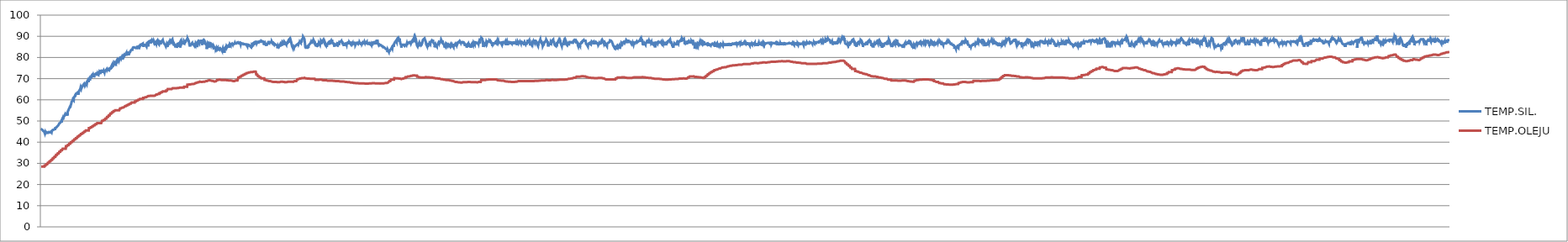
| Category | TEMP.SIL. | TEMP.OLEJU |
|---|---|---|
| 2015-01-01_00:00:09 | 45.5 | 28.5 |
| 2015-01-01_00:00:10 | 45.5 | 28.5 |
| 2015-01-01_00:00:11 | 46 | 28.5 |
| 2015-01-01_00:00:12 | 46 | 28.5 |
| 2015-01-01_00:00:13 | 46.2 | 28.5 |
| 2015-01-01_00:00:14 | 45.7 | 28.5 |
| 2015-01-01_00:00:15 | 45.9 | 28.5 |
| 2015-01-01_00:00:16 | 45.7 | 28.5 |
| 2015-01-01_00:00:17 | 45.6 | 28.5 |
| 2015-01-01_00:00:18 | 45.3 | 28.5 |
| 2015-01-01_00:00:19 | 45.3 | 28.5 |
| 2015-01-01_00:00:20 | 45.2 | 28.5 |
| 2015-01-01_00:00:21 | 45.1 | 28.5 |
| 2015-01-01_00:00:22 | 45 | 28.5 |
| 2015-01-01_00:00:23 | 45 | 28.5 |
| 2015-01-01_00:00:24 | 44.8 | 28.5 |
| 2015-01-01_00:00:25 | 44.8 | 29 |
| 2015-01-01_00:00:26 | 44.2 | 29 |
| 2015-01-01_00:00:27 | 44.7 | 29 |
| 2015-01-01_00:00:28 | 44.7 | 29 |
| 2015-01-01_00:00:29 | 44.1 | 29 |
| 2015-01-01_00:00:30 | 44.7 | 29 |
| 2015-01-01_00:00:31 | 44.7 | 29 |
| 2015-01-01_00:00:32 | 44.3 | 29 |
| 2015-01-01_00:00:33 | 44.6 | 29.6 |
| 2015-01-01_00:00:34 | 44.2 | 29.6 |
| 2015-01-01_00:00:35 | 44.1 | 29.6 |
| 2015-01-01_00:00:36 | 44.7 | 29.6 |
| 2015-01-01_00:00:37 | 44.6 | 29.6 |
| 2015-01-01_00:00:38 | 44.6 | 29.6 |
| 2015-01-01_00:00:39 | 44.7 | 29.6 |
| 2015-01-01_00:00:40 | 44.5 | 29.6 |
| 2015-01-01_00:00:41 | 44.4 | 30.3 |
| 2015-01-01_00:00:42 | 44.7 | 30.3 |
| 2015-01-01_00:00:43 | 44.2 | 30.3 |
| 2015-01-01_00:00:44 | 44.6 | 30.3 |
| 2015-01-01_00:00:45 | 44.6 | 30.3 |
| 2015-01-01_00:00:46 | 44.8 | 30.3 |
| 2015-01-01_00:00:47 | 44.5 | 30.3 |
| 2015-01-01_00:00:48 | 44.7 | 30.3 |
| 2015-01-01_00:00:49 | 44.6 | 31 |
| 2015-01-01_00:00:50 | 44.8 | 31 |
| 2015-01-01_00:00:51 | 44.6 | 31 |
| 2015-01-01_00:00:52 | 44.8 | 31 |
| 2015-01-01_00:00:53 | 44.7 | 31 |
| 2015-01-01_00:00:54 | 44.7 | 31 |
| 2015-01-01_00:00:55 | 44.4 | 31 |
| 2015-01-01_00:00:56 | 45 | 31 |
| 2015-01-01_00:00:57 | 45 | 31.6 |
| 2015-01-01_00:00:58 | 45 | 31.6 |
| 2015-01-01_00:00:59 | 44.6 | 31.6 |
| 2015-01-01_00:01:00 | 45.1 | 31.6 |
| 2015-01-01_00:01:01 | 45.3 | 31.6 |
| 2015-01-01_00:01:02 | 45.2 | 31.6 |
| 2015-01-01_00:01:03 | 45.4 | 31.6 |
| 2015-01-01_00:01:04 | 44.8 | 31.6 |
| 2015-01-01_00:01:05 | 45.8 | 32.4 |
| 2015-01-01_00:01:06 | 45.9 | 32.4 |
| 2015-01-01_00:01:07 | 45.8 | 32.4 |
| 2015-01-01_00:01:08 | 46 | 32.4 |
| 2015-01-01_00:01:09 | 45.7 | 32.4 |
| 2015-01-01_00:01:10 | 45.9 | 32.4 |
| 2015-01-01_00:01:11 | 45.9 | 32.4 |
| 2015-01-01_00:01:12 | 45.8 | 32.4 |
| 2015-01-01_00:01:13 | 46 | 33.1 |
| 2015-01-01_00:01:14 | 46.1 | 33.1 |
| 2015-01-01_00:01:15 | 46.2 | 33.1 |
| 2015-01-01_00:01:16 | 45.7 | 33.1 |
| 2015-01-01_00:01:17 | 46.7 | 33.1 |
| 2015-01-01_00:01:18 | 46.5 | 33.1 |
| 2015-01-01_00:01:19 | 46.8 | 33.1 |
| 2015-01-01_00:01:20 | 46.8 | 33.1 |
| 2015-01-01_00:01:21 | 46.8 | 34 |
| 2015-01-01_00:01:22 | 46.9 | 34 |
| 2015-01-01_00:01:23 | 46.7 | 34 |
| 2015-01-01_00:01:24 | 46.7 | 34 |
| 2015-01-01_00:01:25 | 46.7 | 34 |
| 2015-01-01_00:01:26 | 47 | 34 |
| 2015-01-01_00:01:27 | 47.5 | 34 |
| 2015-01-01_00:01:28 | 47.7 | 34 |
| 2015-01-01_00:01:29 | 47.5 | 34.7 |
| 2015-01-01_00:01:30 | 47.6 | 34.7 |
| 2015-01-01_00:01:31 | 47.2 | 34.7 |
| 2015-01-01_00:01:32 | 48 | 34.7 |
| 2015-01-01_00:01:33 | 48 | 34.7 |
| 2015-01-01_00:01:34 | 48.2 | 34.7 |
| 2015-01-01_00:01:35 | 48.5 | 34.7 |
| 2015-01-01_00:01:36 | 48.6 | 34.7 |
| 2015-01-01_00:01:37 | 48.9 | 35.5 |
| 2015-01-01_00:01:38 | 48.9 | 35.5 |
| 2015-01-01_00:01:39 | 49.1 | 35.5 |
| 2015-01-01_00:01:40 | 48.9 | 35.5 |
| 2015-01-01_00:01:41 | 49.1 | 35.5 |
| 2015-01-01_00:01:42 | 49.2 | 35.5 |
| 2015-01-01_00:01:43 | 49 | 35.5 |
| 2015-01-01_00:01:44 | 49.3 | 35.5 |
| 2015-01-01_00:01:45 | 49 | 36.2 |
| 2015-01-01_00:01:46 | 49.2 | 36.2 |
| 2015-01-01_00:01:47 | 50.1 | 36.2 |
| 2015-01-01_00:01:48 | 49.3 | 36.2 |
| 2015-01-01_00:01:49 | 50.1 | 36.2 |
| 2015-01-01_00:01:50 | 50.2 | 36.2 |
| 2015-01-01_00:01:51 | 50.7 | 36.2 |
| 2015-01-01_00:01:52 | 51 | 36.2 |
| 2015-01-01_00:01:53 | 51.2 | 36.9 |
| 2015-01-01_00:01:54 | 50.7 | 36.9 |
| 2015-01-01_00:01:55 | 50.9 | 36.9 |
| 2015-01-01_00:01:56 | 51.3 | 36.9 |
| 2015-01-01_00:01:57 | 51.5 | 36.9 |
| 2015-01-01_00:01:58 | 51.6 | 36.9 |
| 2015-01-01_00:01:59 | 52 | 36.9 |
| 2015-01-01_00:02:00 | 52.2 | 36.9 |
| 2015-01-01_00:02:01 | 52.2 | 36.9 |
| 2015-01-01_00:02:02 | 52.5 | 36.9 |
| 2015-01-01_00:02:03 | 52.6 | 36.9 |
| 2015-01-01_00:02:04 | 53 | 36.9 |
| 2015-01-01_00:02:05 | 53.3 | 36.9 |
| 2015-01-01_00:02:06 | 53.4 | 36.9 |
| 2015-01-01_00:02:07 | 53.1 | 36.9 |
| 2015-01-01_00:02:08 | 53.2 | 36.9 |
| 2015-01-01_00:02:09 | 53 | 38.1 |
| 2015-01-01_00:02:10 | 53.2 | 38.1 |
| 2015-01-01_00:02:11 | 52.8 | 38.1 |
| 2015-01-01_00:02:12 | 53.1 | 38.1 |
| 2015-01-01_00:02:13 | 53.3 | 38.1 |
| 2015-01-01_00:02:14 | 53.3 | 38.1 |
| 2015-01-01_00:02:15 | 53.7 | 38.1 |
| 2015-01-01_00:02:16 | 52.6 | 38.1 |
| 2015-01-01_00:02:17 | 54.1 | 38.6 |
| 2015-01-01_00:02:18 | 54.5 | 38.6 |
| 2015-01-01_00:02:19 | 54.7 | 38.6 |
| 2015-01-01_00:02:20 | 54.2 | 38.6 |
| 2015-01-01_00:02:21 | 55 | 38.6 |
| 2015-01-01_00:02:22 | 55.1 | 38.6 |
| 2015-01-01_00:02:23 | 55.6 | 38.6 |
| 2015-01-01_00:02:24 | 55.8 | 38.6 |
| 2015-01-01_00:02:25 | 56 | 39.3 |
| 2015-01-01_00:02:26 | 55.8 | 39.3 |
| 2015-01-01_00:02:27 | 56.2 | 39.3 |
| 2015-01-01_00:02:28 | 56.4 | 39.3 |
| 2015-01-01_00:02:29 | 56.9 | 39.3 |
| 2015-01-01_00:02:30 | 56.3 | 39.3 |
| 2015-01-01_00:02:31 | 57.2 | 39.3 |
| 2015-01-01_00:02:32 | 57.2 | 39.3 |
| 2015-01-01_00:02:33 | 57.3 | 40 |
| 2015-01-01_00:02:34 | 57.8 | 40 |
| 2015-01-01_00:02:35 | 57.8 | 40 |
| 2015-01-01_00:02:36 | 58.7 | 40 |
| 2015-01-01_00:02:37 | 59.1 | 40 |
| 2015-01-01_00:02:38 | 59.2 | 40 |
| 2015-01-01_00:02:39 | 59.2 | 40 |
| 2015-01-01_00:02:40 | 58.8 | 40 |
| 2015-01-01_00:02:41 | 59.6 | 40.6 |
| 2015-01-01_00:02:42 | 59.9 | 40.6 |
| 2015-01-01_00:02:43 | 60.3 | 40.6 |
| 2015-01-01_00:02:44 | 60.3 | 40.6 |
| 2015-01-01_00:02:45 | 60.2 | 40.6 |
| 2015-01-01_00:02:46 | 60.3 | 40.6 |
| 2015-01-01_00:02:47 | 59.8 | 40.6 |
| 2015-01-01_00:02:48 | 60.8 | 40.6 |
| 2015-01-01_00:02:49 | 61.2 | 41.3 |
| 2015-01-01_00:02:50 | 61.2 | 41.3 |
| 2015-01-01_00:02:51 | 61.3 | 41.3 |
| 2015-01-01_00:02:52 | 61.5 | 41.3 |
| 2015-01-01_00:02:53 | 61.9 | 41.3 |
| 2015-01-01_00:02:54 | 61.5 | 41.3 |
| 2015-01-01_00:02:55 | 61.9 | 41.3 |
| 2015-01-01_00:02:56 | 62.2 | 41.3 |
| 2015-01-01_00:02:57 | 62.6 | 41.9 |
| 2015-01-01_00:02:58 | 62.6 | 41.9 |
| 2015-01-01_00:02:59 | 62.7 | 41.9 |
| 2015-01-01_00:03:00 | 63 | 41.9 |
| 2015-01-01_00:03:01 | 63.1 | 41.9 |
| 2015-01-01_00:03:02 | 63.2 | 41.9 |
| 2015-01-01_00:03:03 | 63.2 | 41.9 |
| 2015-01-01_00:03:04 | 63.3 | 41.9 |
| 2015-01-01_00:03:05 | 63.3 | 42.6 |
| 2015-01-01_00:03:06 | 63.3 | 42.6 |
| 2015-01-01_00:03:07 | 63.6 | 42.6 |
| 2015-01-01_00:03:08 | 63.9 | 42.6 |
| 2015-01-01_00:03:09 | 62.4 | 42.6 |
| 2015-01-01_00:03:10 | 63.8 | 42.6 |
| 2015-01-01_00:03:11 | 63.4 | 42.6 |
| 2015-01-01_00:03:12 | 64 | 42.6 |
| 2015-01-01_00:03:13 | 64.2 | 43.2 |
| 2015-01-01_00:03:14 | 64.4 | 43.2 |
| 2015-01-01_00:03:15 | 64.7 | 43.2 |
| 2015-01-01_00:03:16 | 64.4 | 43.2 |
| 2015-01-01_00:03:17 | 64.8 | 43.2 |
| 2015-01-01_00:03:18 | 65.1 | 43.2 |
| 2015-01-01_00:03:19 | 65.2 | 43.2 |
| 2015-01-01_00:03:20 | 65.6 | 43.2 |
| 2015-01-01_00:03:21 | 65.6 | 43.8 |
| 2015-01-01_00:03:22 | 65.2 | 43.8 |
| 2015-01-01_00:03:23 | 65.9 | 43.8 |
| 2015-01-01_00:03:24 | 66 | 43.8 |
| 2015-01-01_00:03:25 | 65.5 | 43.8 |
| 2015-01-01_00:03:26 | 65.8 | 43.8 |
| 2015-01-01_00:03:27 | 65.5 | 43.8 |
| 2015-01-01_00:03:28 | 66.2 | 43.8 |
| 2015-01-01_00:03:29 | 66.4 | 44.3 |
| 2015-01-01_00:03:30 | 66.5 | 44.3 |
| 2015-01-01_00:03:31 | 66.4 | 44.3 |
| 2015-01-01_00:03:32 | 66.6 | 44.3 |
| 2015-01-01_00:03:33 | 67 | 44.3 |
| 2015-01-01_00:03:34 | 66.8 | 44.3 |
| 2015-01-01_00:03:35 | 67.2 | 44.3 |
| 2015-01-01_00:03:36 | 67.3 | 44.3 |
| 2015-01-01_00:03:37 | 67.5 | 44.9 |
| 2015-01-01_00:03:38 | 67.1 | 44.9 |
| 2015-01-01_00:03:39 | 67.3 | 44.9 |
| 2015-01-01_00:03:40 | 66.2 | 44.9 |
| 2015-01-01_00:03:41 | 67.1 | 44.9 |
| 2015-01-01_00:03:42 | 66.7 | 44.9 |
| 2015-01-01_00:03:43 | 66.5 | 44.9 |
| 2015-01-01_00:03:44 | 67.1 | 44.9 |
| 2015-01-01_00:03:45 | 67.4 | 45.5 |
| 2015-01-01_00:03:46 | 67.6 | 45.5 |
| 2015-01-01_00:03:47 | 67.6 | 45.5 |
| 2015-01-01_00:03:48 | 67.5 | 45.5 |
| 2015-01-01_00:03:49 | 68.1 | 45.5 |
| 2015-01-01_00:03:50 | 68.3 | 45.5 |
| 2015-01-01_00:03:51 | 67.6 | 45.5 |
| 2015-01-01_00:03:52 | 68.2 | 45.5 |
| 2015-01-01_00:03:53 | 68.6 | 45.5 |
| 2015-01-01_00:03:54 | 68.7 | 45.5 |
| 2015-01-01_00:03:55 | 68.9 | 45.5 |
| 2015-01-01_00:03:56 | 69.2 | 45.5 |
| 2015-01-01_00:03:57 | 69 | 45.5 |
| 2015-01-01_00:03:58 | 69 | 45.5 |
| 2015-01-01_00:03:59 | 68.3 | 45.5 |
| 2015-01-01_00:04:00 | 69.3 | 45.5 |
| 2015-01-01_00:04:01 | 69.5 | 46.6 |
| 2015-01-01_00:04:02 | 69.7 | 46.6 |
| 2015-01-01_00:04:03 | 69.1 | 46.6 |
| 2015-01-01_00:04:04 | 69.7 | 46.6 |
| 2015-01-01_00:04:05 | 69.1 | 46.6 |
| 2015-01-01_00:04:06 | 69.7 | 46.6 |
| 2015-01-01_00:04:07 | 70.4 | 46.6 |
| 2015-01-01_00:04:08 | 70.5 | 46.6 |
| 2015-01-01_00:04:09 | 70.7 | 47 |
| 2015-01-01_00:04:10 | 70.7 | 47 |
| 2015-01-01_00:04:11 | 70.1 | 47 |
| 2015-01-01_00:04:12 | 70.5 | 47 |
| 2015-01-01_00:04:13 | 71.3 | 47 |
| 2015-01-01_00:04:14 | 71 | 47 |
| 2015-01-01_00:04:15 | 71.2 | 47 |
| 2015-01-01_00:04:16 | 71.3 | 47 |
| 2015-01-01_00:04:17 | 71.8 | 47.5 |
| 2015-01-01_00:04:18 | 71.9 | 47.5 |
| 2015-01-01_00:04:19 | 71.8 | 47.5 |
| 2015-01-01_00:04:20 | 70.9 | 47.5 |
| 2015-01-01_00:04:21 | 71.7 | 47.5 |
| 2015-01-01_00:04:22 | 71.1 | 47.5 |
| 2015-01-01_00:04:23 | 71.5 | 47.5 |
| 2015-01-01_00:04:24 | 71.6 | 47.5 |
| 2015-01-01_00:04:25 | 71.5 | 48 |
| 2015-01-01_00:04:26 | 70.6 | 48 |
| 2015-01-01_00:04:27 | 71.1 | 48 |
| 2015-01-01_00:04:28 | 71.8 | 48 |
| 2015-01-01_00:04:29 | 71.9 | 48 |
| 2015-01-01_00:04:30 | 72 | 48 |
| 2015-01-01_00:04:31 | 71.9 | 48 |
| 2015-01-01_00:04:32 | 72.1 | 48 |
| 2015-01-01_00:04:33 | 72.2 | 48.5 |
| 2015-01-01_00:04:34 | 71.4 | 48.5 |
| 2015-01-01_00:04:35 | 72 | 48.5 |
| 2015-01-01_00:04:36 | 72.3 | 48.5 |
| 2015-01-01_00:04:37 | 72.1 | 48.5 |
| 2015-01-01_00:04:38 | 72.1 | 48.5 |
| 2015-01-01_00:04:39 | 72.4 | 48.5 |
| 2015-01-01_00:04:40 | 72.4 | 48.5 |
| 2015-01-01_00:04:41 | 72.4 | 49 |
| 2015-01-01_00:04:42 | 72.3 | 49 |
| 2015-01-01_00:04:43 | 72.4 | 49 |
| 2015-01-01_00:04:44 | 72 | 49 |
| 2015-01-01_00:04:45 | 72.6 | 49 |
| 2015-01-01_00:04:46 | 72.6 | 49 |
| 2015-01-01_00:04:47 | 72.8 | 49 |
| 2015-01-01_00:04:48 | 72.2 | 49 |
| 2015-01-01_00:04:49 | 72.9 | 49 |
| 2015-01-01_00:04:50 | 72.1 | 49 |
| 2015-01-01_00:04:51 | 72.6 | 49 |
| 2015-01-01_00:04:52 | 73 | 49 |
| 2015-01-01_00:04:53 | 73.1 | 49 |
| 2015-01-01_00:04:54 | 72.7 | 49 |
| 2015-01-01_00:04:55 | 73.3 | 49 |
| 2015-01-01_00:04:56 | 72.2 | 49 |
| 2015-01-01_00:04:57 | 73.6 | 49 |
| 2015-01-01_00:04:58 | 73.6 | 49 |
| 2015-01-01_00:04:59 | 73.8 | 49 |
| 2015-01-01_00:05:00 | 73.9 | 49 |
| 2015-01-01_00:05:01 | 73.8 | 49 |
| 2015-01-01_00:05:02 | 73.8 | 49 |
| 2015-01-01_00:05:03 | 73.8 | 49 |
| 2015-01-01_00:05:04 | 73.8 | 49 |
| 2015-01-01_00:05:05 | 73.8 | 50.1 |
| 2015-01-01_00:05:06 | 74.1 | 50.1 |
| 2015-01-01_00:05:07 | 73.6 | 50.1 |
| 2015-01-01_00:05:08 | 72.7 | 50.1 |
| 2015-01-01_00:05:09 | 72.8 | 50.1 |
| 2015-01-01_00:05:10 | 73 | 50.1 |
| 2015-01-01_00:05:11 | 73.5 | 50.1 |
| 2015-01-01_00:05:12 | 73.8 | 50.1 |
| 2015-01-01_00:05:13 | 73.9 | 50.5 |
| 2015-01-01_00:05:14 | 73.7 | 50.5 |
| 2015-01-01_00:05:15 | 73.4 | 50.5 |
| 2015-01-01_00:05:16 | 73.5 | 50.5 |
| 2015-01-01_00:05:17 | 72.9 | 50.5 |
| 2015-01-01_00:05:18 | 73.4 | 50.5 |
| 2015-01-01_00:05:19 | 73.7 | 50.5 |
| 2015-01-01_00:05:20 | 73.7 | 50.5 |
| 2015-01-01_00:05:21 | 73.5 | 51.1 |
| 2015-01-01_00:05:22 | 73.4 | 51.1 |
| 2015-01-01_00:05:23 | 73.9 | 51.1 |
| 2015-01-01_00:05:24 | 73.9 | 51.1 |
| 2015-01-01_00:05:25 | 74.2 | 51.1 |
| 2015-01-01_00:05:26 | 74.2 | 51.1 |
| 2015-01-01_00:05:27 | 74.4 | 51.1 |
| 2015-01-01_00:05:28 | 73.9 | 51.1 |
| 2015-01-01_00:05:29 | 74.5 | 51.9 |
| 2015-01-01_00:05:30 | 74.1 | 51.9 |
| 2015-01-01_00:05:31 | 74.1 | 51.9 |
| 2015-01-01_00:05:32 | 74.5 | 51.9 |
| 2015-01-01_00:05:33 | 74.4 | 51.9 |
| 2015-01-01_00:05:34 | 74.4 | 51.9 |
| 2015-01-01_00:05:35 | 74.1 | 51.9 |
| 2015-01-01_00:05:36 | 74.1 | 51.9 |
| 2015-01-01_00:05:37 | 74.1 | 52.6 |
| 2015-01-01_00:05:38 | 74.3 | 52.6 |
| 2015-01-01_00:05:39 | 74.1 | 52.6 |
| 2015-01-01_00:05:40 | 73.9 | 52.6 |
| 2015-01-01_00:05:41 | 73.8 | 52.6 |
| 2015-01-01_00:05:42 | 74.5 | 52.6 |
| 2015-01-01_00:05:43 | 74.9 | 52.6 |
| 2015-01-01_00:05:44 | 74.5 | 52.6 |
| 2015-01-01_00:05:45 | 75.4 | 53.5 |
| 2015-01-01_00:05:46 | 74.4 | 53.5 |
| 2015-01-01_00:05:47 | 75.3 | 53.5 |
| 2015-01-01_00:05:48 | 75.2 | 53.5 |
| 2015-01-01_00:05:49 | 74.6 | 53.5 |
| 2015-01-01_00:05:50 | 75.7 | 53.5 |
| 2015-01-01_00:05:51 | 75.6 | 53.5 |
| 2015-01-01_00:05:52 | 75.8 | 53.5 |
| 2015-01-01_00:05:53 | 75.5 | 54.1 |
| 2015-01-01_00:05:54 | 76.5 | 54.1 |
| 2015-01-01_00:05:55 | 75.3 | 54.1 |
| 2015-01-01_00:05:56 | 76.1 | 54.1 |
| 2015-01-01_00:05:57 | 75.6 | 54.1 |
| 2015-01-01_00:05:58 | 76.9 | 54.1 |
| 2015-01-01_00:05:59 | 77.2 | 54.1 |
| 2015-01-01_00:06:00 | 77.1 | 54.1 |
| 2015-01-01_00:06:01 | 77.2 | 54.7 |
| 2015-01-01_00:06:02 | 77.1 | 54.7 |
| 2015-01-01_00:06:03 | 77.2 | 54.7 |
| 2015-01-01_00:06:04 | 76.2 | 54.7 |
| 2015-01-01_00:06:05 | 77.4 | 54.7 |
| 2015-01-01_00:06:06 | 77.3 | 54.7 |
| 2015-01-01_00:06:07 | 77.2 | 54.7 |
| 2015-01-01_00:06:08 | 77 | 54.7 |
| 2015-01-01_00:06:09 | 77.4 | 55.1 |
| 2015-01-01_00:06:10 | 77.7 | 55.1 |
| 2015-01-01_00:06:11 | 77.1 | 55.1 |
| 2015-01-01_00:06:12 | 77.4 | 55.1 |
| 2015-01-01_00:06:13 | 77 | 55.1 |
| 2015-01-01_00:06:14 | 78 | 55.1 |
| 2015-01-01_00:06:15 | 77.1 | 55.1 |
| 2015-01-01_00:06:16 | 78.4 | 55.1 |
| 2015-01-01_00:06:17 | 78.4 | 55.1 |
| 2015-01-01_00:06:18 | 78.6 | 55.1 |
| 2015-01-01_00:06:19 | 78.2 | 55.1 |
| 2015-01-01_00:06:20 | 79.1 | 55.1 |
| 2015-01-01_00:06:21 | 79.1 | 55.1 |
| 2015-01-01_00:06:22 | 79.2 | 55.1 |
| 2015-01-01_00:06:23 | 78.8 | 55.1 |
| 2015-01-01_00:06:24 | 78.4 | 55.1 |
| 2015-01-01_00:06:25 | 79.4 | 55.1 |
| 2015-01-01_00:06:26 | 78.6 | 55.1 |
| 2015-01-01_00:06:27 | 79.6 | 55.1 |
| 2015-01-01_00:06:28 | 79.3 | 55.1 |
| 2015-01-01_00:06:29 | 79.1 | 55.1 |
| 2015-01-01_00:06:30 | 79.5 | 55.1 |
| 2015-01-01_00:06:31 | 79.5 | 55.1 |
| 2015-01-01_00:06:32 | 79.9 | 55.1 |
| 2015-01-01_00:06:33 | 79.8 | 56 |
| 2015-01-01_00:06:34 | 80.2 | 56 |
| 2015-01-01_00:06:35 | 79.6 | 56 |
| 2015-01-01_00:06:36 | 79.7 | 56 |
| 2015-01-01_00:06:37 | 80.1 | 56 |
| 2015-01-01_00:06:38 | 80.2 | 56 |
| 2015-01-01_00:06:39 | 79.5 | 56 |
| 2015-01-01_00:06:40 | 79.5 | 56 |
| 2015-01-01_00:06:41 | 79.6 | 56.3 |
| 2015-01-01_00:06:42 | 80.2 | 56.3 |
| 2015-01-01_00:06:43 | 80 | 56.3 |
| 2015-01-01_00:06:44 | 80.3 | 56.3 |
| 2015-01-01_00:06:45 | 79.2 | 56.3 |
| 2015-01-01_00:06:46 | 80.5 | 56.3 |
| 2015-01-01_00:06:47 | 80.7 | 56.3 |
| 2015-01-01_00:06:48 | 80.2 | 56.3 |
| 2015-01-01_00:06:49 | 80.8 | 56.6 |
| 2015-01-01_00:06:50 | 80.8 | 56.6 |
| 2015-01-01_00:06:51 | 81.1 | 56.6 |
| 2015-01-01_00:06:52 | 80.5 | 56.6 |
| 2015-01-01_00:06:53 | 80.4 | 56.6 |
| 2015-01-01_00:06:54 | 80.9 | 56.6 |
| 2015-01-01_00:06:55 | 81.2 | 56.6 |
| 2015-01-01_00:06:56 | 80.9 | 56.6 |
| 2015-01-01_00:06:57 | 81.2 | 57 |
| 2015-01-01_00:06:58 | 80.6 | 57 |
| 2015-01-01_00:06:59 | 81.2 | 57 |
| 2015-01-01_00:07:00 | 81 | 57 |
| 2015-01-01_00:07:01 | 81 | 57 |
| 2015-01-01_00:07:02 | 81.4 | 57 |
| 2015-01-01_00:07:03 | 82 | 57 |
| 2015-01-01_00:07:04 | 80.9 | 57 |
| 2015-01-01_00:07:05 | 81.8 | 57.4 |
| 2015-01-01_00:07:06 | 82.2 | 57.4 |
| 2015-01-01_00:07:07 | 82.5 | 57.4 |
| 2015-01-01_00:07:08 | 82.7 | 57.4 |
| 2015-01-01_00:07:09 | 81.9 | 57.4 |
| 2015-01-01_00:07:10 | 82.2 | 57.4 |
| 2015-01-01_00:07:11 | 82.5 | 57.4 |
| 2015-01-01_00:07:12 | 82.4 | 57.4 |
| 2015-01-01_00:07:13 | 82.2 | 57.8 |
| 2015-01-01_00:07:14 | 81.1 | 57.8 |
| 2015-01-01_00:07:15 | 81.6 | 57.8 |
| 2015-01-01_00:07:16 | 81.7 | 57.8 |
| 2015-01-01_00:07:17 | 82.1 | 57.8 |
| 2015-01-01_00:07:18 | 82.7 | 57.8 |
| 2015-01-01_00:07:19 | 82.2 | 57.8 |
| 2015-01-01_00:07:20 | 82.4 | 57.8 |
| 2015-01-01_00:07:21 | 82.5 | 58.2 |
| 2015-01-01_00:07:22 | 82.6 | 58.2 |
| 2015-01-01_00:07:23 | 82.8 | 58.2 |
| 2015-01-01_00:07:24 | 83.1 | 58.2 |
| 2015-01-01_00:07:25 | 83.2 | 58.2 |
| 2015-01-01_00:07:26 | 83.1 | 58.2 |
| 2015-01-01_00:07:27 | 83.3 | 58.2 |
| 2015-01-01_00:07:28 | 83.6 | 58.2 |
| 2015-01-01_00:07:29 | 83.5 | 58.7 |
| 2015-01-01_00:07:30 | 83.9 | 58.7 |
| 2015-01-01_00:07:31 | 83.7 | 58.7 |
| 2015-01-01_00:07:32 | 83.9 | 58.7 |
| 2015-01-01_00:07:33 | 83.6 | 58.7 |
| 2015-01-01_00:07:34 | 84.2 | 58.7 |
| 2015-01-01_00:07:35 | 84 | 58.7 |
| 2015-01-01_00:07:36 | 84.7 | 58.7 |
| 2015-01-01_00:07:37 | 84.4 | 58.7 |
| 2015-01-01_00:07:38 | 84.6 | 58.7 |
| 2015-01-01_00:07:39 | 84.7 | 58.7 |
| 2015-01-01_00:07:40 | 85 | 58.7 |
| 2015-01-01_00:07:41 | 84.8 | 58.7 |
| 2015-01-01_00:07:42 | 85.1 | 58.7 |
| 2015-01-01_00:07:43 | 85 | 58.7 |
| 2015-01-01_00:07:44 | 84.9 | 58.7 |
| 2015-01-01_00:07:45 | 85 | 59.2 |
| 2015-01-01_00:07:46 | 84.6 | 59.2 |
| 2015-01-01_00:07:47 | 84.8 | 59.2 |
| 2015-01-01_00:07:48 | 84.7 | 59.2 |
| 2015-01-01_00:07:49 | 84.9 | 59.2 |
| 2015-01-01_00:07:50 | 84.4 | 59.2 |
| 2015-01-01_00:07:51 | 84.4 | 59.2 |
| 2015-01-01_00:07:52 | 84 | 59.2 |
| 2015-01-01_00:07:53 | 84.5 | 59.6 |
| 2015-01-01_00:07:54 | 84.8 | 59.6 |
| 2015-01-01_00:07:55 | 85 | 59.6 |
| 2015-01-01_00:07:56 | 84.8 | 59.6 |
| 2015-01-01_00:07:57 | 85 | 59.6 |
| 2015-01-01_00:07:58 | 84.9 | 59.6 |
| 2015-01-01_00:07:59 | 84.9 | 59.6 |
| 2015-01-01_00:08:00 | 85 | 59.6 |
| 2015-01-01_00:08:01 | 85.4 | 60 |
| 2015-01-01_00:08:02 | 85 | 60 |
| 2015-01-01_00:08:03 | 84 | 60 |
| 2015-01-01_00:08:04 | 85.2 | 60 |
| 2015-01-01_00:08:05 | 85.7 | 60 |
| 2015-01-01_00:08:06 | 84.8 | 60 |
| 2015-01-01_00:08:07 | 85.1 | 60 |
| 2015-01-01_00:08:08 | 85.3 | 60 |
| 2015-01-01_00:08:09 | 85.9 | 60.4 |
| 2015-01-01_00:08:10 | 85.5 | 60.4 |
| 2015-01-01_00:08:11 | 85.7 | 60.4 |
| 2015-01-01_00:08:12 | 86 | 60.4 |
| 2015-01-01_00:08:13 | 85.8 | 60.4 |
| 2015-01-01_00:08:14 | 85.9 | 60.4 |
| 2015-01-01_00:08:15 | 86.1 | 60.4 |
| 2015-01-01_00:08:16 | 85.9 | 60.4 |
| 2015-01-01_00:08:17 | 85.9 | 60.4 |
| 2015-01-01_00:08:18 | 85.4 | 60.4 |
| 2015-01-01_00:08:19 | 86.3 | 60.4 |
| 2015-01-01_00:08:20 | 86 | 60.4 |
| 2015-01-01_00:08:21 | 86.1 | 60.4 |
| 2015-01-01_00:08:22 | 86 | 60.4 |
| 2015-01-01_00:08:23 | 86.4 | 60.4 |
| 2015-01-01_00:08:24 | 86.6 | 60.4 |
| 2015-01-01_00:08:25 | 86.5 | 60.9 |
| 2015-01-01_00:08:26 | 85 | 60.9 |
| 2015-01-01_00:08:27 | 86.2 | 60.9 |
| 2015-01-01_00:08:28 | 85.3 | 60.9 |
| 2015-01-01_00:08:29 | 85.1 | 60.9 |
| 2015-01-01_00:08:30 | 86 | 60.9 |
| 2015-01-01_00:08:31 | 86.5 | 60.9 |
| 2015-01-01_00:08:32 | 85.9 | 60.9 |
| 2015-01-01_00:08:33 | 86 | 61.2 |
| 2015-01-01_00:08:34 | 86 | 61.2 |
| 2015-01-01_00:08:35 | 86 | 61.2 |
| 2015-01-01_00:08:36 | 85.6 | 61.2 |
| 2015-01-01_00:08:37 | 85.9 | 61.2 |
| 2015-01-01_00:08:38 | 86.2 | 61.2 |
| 2015-01-01_00:08:39 | 86.2 | 61.2 |
| 2015-01-01_00:08:40 | 86.1 | 61.2 |
| 2015-01-01_00:08:41 | 85.7 | 61.5 |
| 2015-01-01_00:08:42 | 85.1 | 61.5 |
| 2015-01-01_00:08:43 | 85.6 | 61.5 |
| 2015-01-01_00:08:44 | 86.8 | 61.5 |
| 2015-01-01_00:08:45 | 86.8 | 61.5 |
| 2015-01-01_00:08:46 | 86.8 | 61.5 |
| 2015-01-01_00:08:47 | 86.9 | 61.5 |
| 2015-01-01_00:08:48 | 86.9 | 61.5 |
| 2015-01-01_00:08:49 | 87.2 | 61.8 |
| 2015-01-01_00:08:50 | 85.2 | 61.8 |
| 2015-01-01_00:08:51 | 86.9 | 61.8 |
| 2015-01-01_00:08:52 | 87 | 61.8 |
| 2015-01-01_00:08:53 | 86.9 | 61.8 |
| 2015-01-01_00:08:54 | 87.2 | 61.8 |
| 2015-01-01_00:08:55 | 86.8 | 61.8 |
| 2015-01-01_00:08:56 | 87.6 | 61.8 |
| 2015-01-01_00:08:57 | 87.5 | 61.9 |
| 2015-01-01_00:08:58 | 87.9 | 61.9 |
| 2015-01-01_00:08:59 | 87.6 | 61.9 |
| 2015-01-01_00:09:00 | 87.6 | 61.9 |
| 2015-01-01_00:09:01 | 87.9 | 61.9 |
| 2015-01-01_00:09:02 | 86.6 | 61.9 |
| 2015-01-01_00:09:03 | 87.9 | 61.9 |
| 2015-01-01_00:09:04 | 87 | 61.9 |
| 2015-01-01_00:09:05 | 87.6 | 61.9 |
| 2015-01-01_00:09:06 | 87.5 | 61.9 |
| 2015-01-01_00:09:07 | 88 | 61.9 |
| 2015-01-01_00:09:08 | 87.7 | 61.9 |
| 2015-01-01_00:09:09 | 88 | 61.9 |
| 2015-01-01_00:09:10 | 87.2 | 61.9 |
| 2015-01-01_00:09:11 | 88 | 61.9 |
| 2015-01-01_00:09:12 | 87.8 | 61.9 |
| 2015-01-01_00:09:13 | 88 | 61.9 |
| 2015-01-01_00:09:14 | 87.9 | 61.9 |
| 2015-01-01_00:09:15 | 87.8 | 61.9 |
| 2015-01-01_00:09:16 | 87.4 | 61.9 |
| 2015-01-01_00:09:17 | 87.8 | 61.9 |
| 2015-01-01_00:09:18 | 88.1 | 61.9 |
| 2015-01-01_00:09:19 | 87.3 | 61.9 |
| 2015-01-01_00:09:20 | 87.8 | 61.9 |
| 2015-01-01_00:09:21 | 87 | 62.1 |
| 2015-01-01_00:09:22 | 86 | 62.1 |
| 2015-01-01_00:09:23 | 86.6 | 62.1 |
| 2015-01-01_00:09:24 | 87 | 62.1 |
| 2015-01-01_00:09:25 | 85.9 | 62.1 |
| 2015-01-01_00:09:26 | 87.2 | 62.1 |
| 2015-01-01_00:09:27 | 87.2 | 62.1 |
| 2015-01-01_00:09:28 | 87.2 | 62.1 |
| 2015-01-01_00:09:29 | 86.5 | 62.5 |
| 2015-01-01_00:09:30 | 87.2 | 62.5 |
| 2015-01-01_00:09:31 | 87.6 | 62.5 |
| 2015-01-01_00:09:32 | 87.8 | 62.5 |
| 2015-01-01_00:09:33 | 87.8 | 62.5 |
| 2015-01-01_00:09:34 | 87.7 | 62.5 |
| 2015-01-01_00:09:35 | 88.1 | 62.5 |
| 2015-01-01_00:09:36 | 87.9 | 62.5 |
| 2015-01-01_00:09:37 | 87.4 | 62.8 |
| 2015-01-01_00:09:38 | 86.7 | 62.8 |
| 2015-01-01_00:09:39 | 86.5 | 62.8 |
| 2015-01-01_00:09:40 | 86.6 | 62.8 |
| 2015-01-01_00:09:41 | 86.5 | 62.8 |
| 2015-01-01_00:09:42 | 86.7 | 62.8 |
| 2015-01-01_00:09:43 | 86.1 | 62.8 |
| 2015-01-01_00:09:44 | 86.5 | 62.8 |
| 2015-01-01_00:09:45 | 87.2 | 63.2 |
| 2015-01-01_00:09:46 | 86.9 | 63.2 |
| 2015-01-01_00:09:47 | 87.2 | 63.2 |
| 2015-01-01_00:09:48 | 87 | 63.2 |
| 2015-01-01_00:09:49 | 86.6 | 63.2 |
| 2015-01-01_00:09:50 | 86.1 | 63.2 |
| 2015-01-01_00:09:51 | 87.7 | 63.2 |
| 2015-01-01_00:09:52 | 86.9 | 63.2 |
| 2015-01-01_00:09:53 | 87.1 | 63.6 |
| 2015-01-01_00:09:54 | 88.1 | 63.6 |
| 2015-01-01_00:09:55 | 87.9 | 63.6 |
| 2015-01-01_00:09:56 | 88 | 63.6 |
| 2015-01-01_00:09:57 | 87 | 63.6 |
| 2015-01-01_00:09:58 | 87.9 | 63.6 |
| 2015-01-01_00:09:59 | 88.1 | 63.6 |
| 2015-01-01_00:10:00 | 87.9 | 63.6 |
| 2015-01-01_00:10:01 | 88.3 | 64 |
| 2015-01-01_00:10:02 | 87.9 | 64 |
| 2015-01-01_00:10:03 | 87.5 | 64 |
| 2015-01-01_00:10:04 | 87.6 | 64 |
| 2015-01-01_00:10:05 | 87.8 | 64 |
| 2015-01-01_00:10:06 | 87.6 | 64 |
| 2015-01-01_00:10:07 | 87.2 | 64 |
| 2015-01-01_00:10:08 | 86.5 | 64 |
| 2015-01-01_00:10:09 | 86.4 | 64 |
| 2015-01-01_00:10:10 | 86.3 | 64 |
| 2015-01-01_00:10:11 | 86.2 | 64 |
| 2015-01-01_00:10:12 | 86.1 | 64 |
| 2015-01-01_00:10:13 | 85.8 | 64 |
| 2015-01-01_00:10:14 | 85.7 | 64 |
| 2015-01-01_00:10:15 | 85.8 | 64 |
| 2015-01-01_00:10:16 | 85.3 | 64 |
| 2015-01-01_00:10:17 | 85.3 | 64.4 |
| 2015-01-01_00:10:18 | 86 | 64.4 |
| 2015-01-01_00:10:19 | 84.9 | 64.4 |
| 2015-01-01_00:10:20 | 85.7 | 64.4 |
| 2015-01-01_00:10:21 | 86.2 | 64.4 |
| 2015-01-01_00:10:22 | 86 | 64.4 |
| 2015-01-01_00:10:23 | 85.7 | 64.4 |
| 2015-01-01_00:10:24 | 85.1 | 64.4 |
| 2015-01-01_00:10:25 | 85.8 | 65.1 |
| 2015-01-01_00:10:26 | 86.3 | 65.1 |
| 2015-01-01_00:10:27 | 85.8 | 65.1 |
| 2015-01-01_00:10:28 | 86.9 | 65.1 |
| 2015-01-01_00:10:29 | 86.8 | 65.1 |
| 2015-01-01_00:10:30 | 87.2 | 65.1 |
| 2015-01-01_00:10:31 | 87.3 | 65.1 |
| 2015-01-01_00:10:32 | 87.2 | 65.1 |
| 2015-01-01_00:10:33 | 87.4 | 65.1 |
| 2015-01-01_00:10:34 | 87.5 | 65.1 |
| 2015-01-01_00:10:35 | 87.9 | 65.1 |
| 2015-01-01_00:10:36 | 87.9 | 65.1 |
| 2015-01-01_00:10:37 | 87.5 | 65.1 |
| 2015-01-01_00:10:38 | 88 | 65.1 |
| 2015-01-01_00:10:39 | 88 | 65.1 |
| 2015-01-01_00:10:40 | 88.2 | 65.1 |
| 2015-01-01_00:10:41 | 88.3 | 65.1 |
| 2015-01-01_00:10:42 | 88.3 | 65.1 |
| 2015-01-01_00:10:43 | 87.4 | 65.1 |
| 2015-01-01_00:10:44 | 88.1 | 65.1 |
| 2015-01-01_00:10:45 | 88.1 | 65.1 |
| 2015-01-01_00:10:46 | 87.8 | 65.1 |
| 2015-01-01_00:10:47 | 88.1 | 65.1 |
| 2015-01-01_00:10:48 | 88.6 | 65.1 |
| 2015-01-01_00:10:49 | 88.1 | 65.5 |
| 2015-01-01_00:10:50 | 87.5 | 65.5 |
| 2015-01-01_00:10:51 | 87.7 | 65.5 |
| 2015-01-01_00:10:52 | 87.8 | 65.5 |
| 2015-01-01_00:10:53 | 87.4 | 65.5 |
| 2015-01-01_00:10:54 | 87 | 65.5 |
| 2015-01-01_00:10:55 | 86 | 65.5 |
| 2015-01-01_00:10:56 | 85.6 | 65.5 |
| 2015-01-01_00:10:57 | 86.3 | 65.5 |
| 2015-01-01_00:10:58 | 86.6 | 65.5 |
| 2015-01-01_00:10:59 | 86.2 | 65.5 |
| 2015-01-01_00:11:00 | 85.9 | 65.5 |
| 2015-01-01_00:11:01 | 85.6 | 65.5 |
| 2015-01-01_00:11:02 | 85.7 | 65.5 |
| 2015-01-01_00:11:03 | 84.8 | 65.5 |
| 2015-01-01_00:11:04 | 85.7 | 65.5 |
| 2015-01-01_00:11:05 | 85.6 | 65.5 |
| 2015-01-01_00:11:06 | 85.5 | 65.5 |
| 2015-01-01_00:11:07 | 85.7 | 65.5 |
| 2015-01-01_00:11:08 | 85.8 | 65.5 |
| 2015-01-01_00:11:09 | 85.5 | 65.5 |
| 2015-01-01_00:11:10 | 84.5 | 65.5 |
| 2015-01-01_00:11:11 | 86 | 65.5 |
| 2015-01-01_00:11:12 | 86.4 | 65.5 |
| 2015-01-01_00:11:13 | 86.3 | 65.6 |
| 2015-01-01_00:11:14 | 86.5 | 65.6 |
| 2015-01-01_00:11:15 | 86.3 | 65.6 |
| 2015-01-01_00:11:16 | 86.5 | 65.6 |
| 2015-01-01_00:11:17 | 86.6 | 65.6 |
| 2015-01-01_00:11:18 | 86.7 | 65.6 |
| 2015-01-01_00:11:19 | 86.1 | 65.6 |
| 2015-01-01_00:11:20 | 84.9 | 65.6 |
| 2015-01-01_00:11:21 | 86.3 | 65.8 |
| 2015-01-01_00:11:22 | 86.3 | 65.8 |
| 2015-01-01_00:11:23 | 86.5 | 65.8 |
| 2015-01-01_00:11:24 | 86.6 | 65.8 |
| 2015-01-01_00:11:25 | 87.1 | 65.8 |
| 2015-01-01_00:11:26 | 87 | 65.8 |
| 2015-01-01_00:11:27 | 84.7 | 65.8 |
| 2015-01-01_00:11:28 | 87.1 | 65.8 |
| 2015-01-01_00:11:29 | 87.2 | 65.8 |
| 2015-01-01_00:11:30 | 87.3 | 65.8 |
| 2015-01-01_00:11:31 | 87.7 | 65.8 |
| 2015-01-01_00:11:32 | 87 | 65.8 |
| 2015-01-01_00:11:33 | 86.8 | 65.8 |
| 2015-01-01_00:11:34 | 86.6 | 65.8 |
| 2015-01-01_00:11:35 | 86.8 | 65.8 |
| 2015-01-01_00:11:36 | 86.9 | 65.8 |
| 2015-01-01_00:11:37 | 87 | 65.8 |
| 2015-01-01_00:11:38 | 86.9 | 65.8 |
| 2015-01-01_00:11:39 | 87 | 65.8 |
| 2015-01-01_00:11:40 | 87.2 | 65.8 |
| 2015-01-01_00:11:41 | 87 | 65.8 |
| 2015-01-01_00:11:42 | 86.7 | 65.8 |
| 2015-01-01_00:11:43 | 87.3 | 65.8 |
| 2015-01-01_00:11:44 | 87.8 | 65.8 |
| 2015-01-01_00:11:45 | 87.5 | 66.2 |
| 2015-01-01_00:11:46 | 87.8 | 66.2 |
| 2015-01-01_00:11:47 | 87.9 | 66.2 |
| 2015-01-01_00:11:48 | 87.1 | 66.2 |
| 2015-01-01_00:11:49 | 87.5 | 66.2 |
| 2015-01-01_00:11:50 | 86.9 | 66.2 |
| 2015-01-01_00:11:51 | 87.5 | 66.2 |
| 2015-01-01_00:11:52 | 87.6 | 66.2 |
| 2015-01-01_00:11:53 | 87.5 | 66.2 |
| 2015-01-01_00:11:54 | 87.7 | 66.2 |
| 2015-01-01_00:11:55 | 88.1 | 66.2 |
| 2015-01-01_00:11:56 | 88.3 | 66.2 |
| 2015-01-01_00:11:57 | 88.4 | 66.2 |
| 2015-01-01_00:11:58 | 88 | 66.2 |
| 2015-01-01_00:11:59 | 88.3 | 66.2 |
| 2015-01-01_00:12:00 | 88.6 | 66.2 |
| 2015-01-01_00:12:01 | 88.1 | 67.2 |
| 2015-01-01_00:12:02 | 89 | 67.2 |
| 2015-01-01_00:12:03 | 88.7 | 67.2 |
| 2015-01-01_00:12:04 | 88.8 | 67.2 |
| 2015-01-01_00:12:05 | 88.4 | 67.2 |
| 2015-01-01_00:12:06 | 87.5 | 67.2 |
| 2015-01-01_00:12:07 | 88.1 | 67.2 |
| 2015-01-01_00:12:08 | 87.6 | 67.2 |
| 2015-01-01_00:12:09 | 87.1 | 67.3 |
| 2015-01-01_00:12:10 | 86.5 | 67.3 |
| 2015-01-01_00:12:11 | 86.1 | 67.3 |
| 2015-01-01_00:12:12 | 86.3 | 67.3 |
| 2015-01-01_00:12:13 | 85.6 | 67.3 |
| 2015-01-01_00:12:14 | 85.2 | 67.3 |
| 2015-01-01_00:12:15 | 86.1 | 67.3 |
| 2015-01-01_00:12:16 | 85.9 | 67.3 |
| 2015-01-01_00:12:17 | 85.8 | 67.4 |
| 2015-01-01_00:12:18 | 86.3 | 67.4 |
| 2015-01-01_00:12:19 | 86.4 | 67.4 |
| 2015-01-01_00:12:20 | 86.3 | 67.4 |
| 2015-01-01_00:12:21 | 86.5 | 67.4 |
| 2015-01-01_00:12:22 | 86.5 | 67.4 |
| 2015-01-01_00:12:23 | 86.4 | 67.4 |
| 2015-01-01_00:12:24 | 86.8 | 67.4 |
| 2015-01-01_00:12:25 | 86.2 | 67.5 |
| 2015-01-01_00:12:26 | 86.1 | 67.5 |
| 2015-01-01_00:12:27 | 86.1 | 67.5 |
| 2015-01-01_00:12:28 | 86.2 | 67.5 |
| 2015-01-01_00:12:29 | 86 | 67.5 |
| 2015-01-01_00:12:30 | 86.2 | 67.5 |
| 2015-01-01_00:12:31 | 86.5 | 67.5 |
| 2015-01-01_00:12:32 | 86.1 | 67.5 |
| 2015-01-01_00:12:33 | 86 | 67.6 |
| 2015-01-01_00:12:34 | 85.9 | 67.6 |
| 2015-01-01_00:12:35 | 85.5 | 67.6 |
| 2015-01-01_00:12:36 | 85.9 | 67.6 |
| 2015-01-01_00:12:37 | 85.6 | 67.6 |
| 2015-01-01_00:12:38 | 85.9 | 67.6 |
| 2015-01-01_00:12:39 | 86.1 | 67.6 |
| 2015-01-01_00:12:40 | 85.4 | 67.6 |
| 2015-01-01_00:12:41 | 85.6 | 68 |
| 2015-01-01_00:12:42 | 86.8 | 68 |
| 2015-01-01_00:12:43 | 86.5 | 68 |
| 2015-01-01_00:12:44 | 86.8 | 68 |
| 2015-01-01_00:12:45 | 86.5 | 68 |
| 2015-01-01_00:12:46 | 86.7 | 68 |
| 2015-01-01_00:12:47 | 86.1 | 68 |
| 2015-01-01_00:12:48 | 87.1 | 68 |
| 2015-01-01_00:12:49 | 84.9 | 68.3 |
| 2015-01-01_00:12:50 | 86.9 | 68.3 |
| 2015-01-01_00:12:51 | 87.3 | 68.3 |
| 2015-01-01_00:12:52 | 87.1 | 68.3 |
| 2015-01-01_00:12:53 | 87.3 | 68.3 |
| 2015-01-01_00:12:54 | 87.7 | 68.3 |
| 2015-01-01_00:12:55 | 87.4 | 68.3 |
| 2015-01-01_00:12:56 | 87.8 | 68.3 |
| 2015-01-01_00:12:57 | 87.8 | 68.6 |
| 2015-01-01_00:12:58 | 87.5 | 68.6 |
| 2015-01-01_00:12:59 | 86.8 | 68.6 |
| 2015-01-01_00:13:00 | 87.6 | 68.6 |
| 2015-01-01_00:13:01 | 87.5 | 68.6 |
| 2015-01-01_00:13:02 | 87.9 | 68.6 |
| 2015-01-01_00:13:03 | 87.6 | 68.6 |
| 2015-01-01_00:13:04 | 87.5 | 68.6 |
| 2015-01-01_00:13:05 | 87.3 | 68.5 |
| 2015-01-01_00:13:06 | 87.9 | 68.5 |
| 2015-01-01_00:13:07 | 87.3 | 68.5 |
| 2015-01-01_00:13:08 | 88.3 | 68.5 |
| 2015-01-01_00:13:09 | 87.1 | 68.5 |
| 2015-01-01_00:13:10 | 88.1 | 68.5 |
| 2015-01-01_00:13:11 | 88.1 | 68.5 |
| 2015-01-01_00:13:12 | 87.4 | 68.5 |
| 2015-01-01_00:13:13 | 85.9 | 68.5 |
| 2015-01-01_00:13:14 | 88.3 | 68.5 |
| 2015-01-01_00:13:15 | 88.2 | 68.5 |
| 2015-01-01_00:13:16 | 87.8 | 68.5 |
| 2015-01-01_00:13:17 | 88 | 68.5 |
| 2015-01-01_00:13:18 | 87.8 | 68.5 |
| 2015-01-01_00:13:19 | 88.1 | 68.5 |
| 2015-01-01_00:13:20 | 88.3 | 68.5 |
| 2015-01-01_00:13:21 | 88.2 | 68.6 |
| 2015-01-01_00:13:22 | 88.1 | 68.6 |
| 2015-01-01_00:13:23 | 88 | 68.6 |
| 2015-01-01_00:13:24 | 87.8 | 68.6 |
| 2015-01-01_00:13:25 | 87.6 | 68.6 |
| 2015-01-01_00:13:26 | 87.5 | 68.6 |
| 2015-01-01_00:13:27 | 86.2 | 68.6 |
| 2015-01-01_00:13:28 | 86.8 | 68.6 |
| 2015-01-01_00:13:29 | 86.7 | 68.8 |
| 2015-01-01_00:13:30 | 86.3 | 68.8 |
| 2015-01-01_00:13:31 | 86.3 | 68.8 |
| 2015-01-01_00:13:32 | 86.6 | 68.8 |
| 2015-01-01_00:13:33 | 86.3 | 68.8 |
| 2015-01-01_00:13:34 | 86.3 | 68.8 |
| 2015-01-01_00:13:35 | 86.3 | 68.8 |
| 2015-01-01_00:13:36 | 84 | 68.8 |
| 2015-01-01_00:13:37 | 86.1 | 69.1 |
| 2015-01-01_00:13:38 | 85.9 | 69.1 |
| 2015-01-01_00:13:39 | 86.8 | 69.1 |
| 2015-01-01_00:13:40 | 86.6 | 69.1 |
| 2015-01-01_00:13:41 | 86.5 | 69.1 |
| 2015-01-01_00:13:42 | 86.3 | 69.1 |
| 2015-01-01_00:13:43 | 86.5 | 69.1 |
| 2015-01-01_00:13:44 | 86.1 | 69.1 |
| 2015-01-01_00:13:45 | 84.6 | 69.2 |
| 2015-01-01_00:13:46 | 86.2 | 69.2 |
| 2015-01-01_00:13:47 | 86.6 | 69.2 |
| 2015-01-01_00:13:48 | 86.6 | 69.2 |
| 2015-01-01_00:13:49 | 86.4 | 69.2 |
| 2015-01-01_00:13:50 | 86.2 | 69.2 |
| 2015-01-01_00:13:51 | 86.3 | 69.2 |
| 2015-01-01_00:13:52 | 87.1 | 69.2 |
| 2015-01-01_00:13:53 | 86.4 | 69.1 |
| 2015-01-01_00:13:54 | 86.3 | 69.1 |
| 2015-01-01_00:13:55 | 85.9 | 69.1 |
| 2015-01-01_00:13:56 | 86.5 | 69.1 |
| 2015-01-01_00:13:57 | 86.2 | 69.1 |
| 2015-01-01_00:13:58 | 86.2 | 69.1 |
| 2015-01-01_00:13:59 | 86.3 | 69.1 |
| 2015-01-01_00:14:00 | 86.2 | 69.1 |
| 2015-01-01_00:14:01 | 86.1 | 68.9 |
| 2015-01-01_00:14:02 | 86.2 | 68.9 |
| 2015-01-01_00:14:03 | 86.1 | 68.9 |
| 2015-01-01_00:14:04 | 85.9 | 68.9 |
| 2015-01-01_00:14:05 | 85.8 | 68.9 |
| 2015-01-01_00:14:06 | 85 | 68.9 |
| 2015-01-01_00:14:07 | 85.3 | 68.9 |
| 2015-01-01_00:14:08 | 85.6 | 68.9 |
| 2015-01-01_00:14:09 | 85.3 | 68.7 |
| 2015-01-01_00:14:10 | 85.4 | 68.7 |
| 2015-01-01_00:14:11 | 85 | 68.7 |
| 2015-01-01_00:14:12 | 85.3 | 68.7 |
| 2015-01-01_00:14:13 | 84.8 | 68.7 |
| 2015-01-01_00:14:14 | 84.9 | 68.7 |
| 2015-01-01_00:14:15 | 84.6 | 68.7 |
| 2015-01-01_00:14:16 | 84.9 | 68.7 |
| 2015-01-01_00:14:17 | 83.9 | 68.8 |
| 2015-01-01_00:14:18 | 84.9 | 68.8 |
| 2015-01-01_00:14:19 | 84 | 68.8 |
| 2015-01-01_00:14:20 | 83.9 | 68.8 |
| 2015-01-01_00:14:21 | 84.4 | 68.8 |
| 2015-01-01_00:14:22 | 83.8 | 68.8 |
| 2015-01-01_00:14:23 | 83.9 | 68.8 |
| 2015-01-01_00:14:24 | 83.9 | 68.8 |
| 2015-01-01_00:14:25 | 84.2 | 69.3 |
| 2015-01-01_00:14:26 | 83.8 | 69.3 |
| 2015-01-01_00:14:27 | 83.8 | 69.3 |
| 2015-01-01_00:14:28 | 83.5 | 69.3 |
| 2015-01-01_00:14:29 | 84.3 | 69.3 |
| 2015-01-01_00:14:30 | 83.2 | 69.3 |
| 2015-01-01_00:14:31 | 84.5 | 69.3 |
| 2015-01-01_00:14:32 | 83.5 | 69.3 |
| 2015-01-01_00:14:33 | 84.1 | 69.5 |
| 2015-01-01_00:14:34 | 83.4 | 69.5 |
| 2015-01-01_00:14:35 | 83.7 | 69.5 |
| 2015-01-01_00:14:36 | 84.9 | 69.5 |
| 2015-01-01_00:14:37 | 84.7 | 69.5 |
| 2015-01-01_00:14:38 | 84.4 | 69.5 |
| 2015-01-01_00:14:39 | 84.8 | 69.5 |
| 2015-01-01_00:14:40 | 84.3 | 69.5 |
| 2015-01-01_00:14:41 | 84.5 | 69.4 |
| 2015-01-01_00:14:42 | 84.6 | 69.4 |
| 2015-01-01_00:14:43 | 84.3 | 69.4 |
| 2015-01-01_00:14:44 | 84.6 | 69.4 |
| 2015-01-01_00:14:45 | 84 | 69.4 |
| 2015-01-01_00:14:46 | 84.1 | 69.4 |
| 2015-01-01_00:14:47 | 84 | 69.4 |
| 2015-01-01_00:14:48 | 84.1 | 69.4 |
| 2015-01-01_00:14:49 | 83.8 | 69.3 |
| 2015-01-01_00:14:50 | 83.1 | 69.3 |
| 2015-01-01_00:14:51 | 84.2 | 69.3 |
| 2015-01-01_00:14:52 | 83.7 | 69.3 |
| 2015-01-01_00:14:53 | 83.9 | 69.3 |
| 2015-01-01_00:14:54 | 84.3 | 69.3 |
| 2015-01-01_00:14:55 | 83.9 | 69.3 |
| 2015-01-01_00:14:56 | 83.6 | 69.3 |
| 2015-01-01_00:14:57 | 84 | 69.3 |
| 2015-01-01_00:14:58 | 83.5 | 69.3 |
| 2015-01-01_00:14:59 | 84.1 | 69.3 |
| 2015-01-01_00:15:00 | 83.9 | 69.3 |
| 2015-01-01_00:15:01 | 82.2 | 69.3 |
| 2015-01-01_00:15:02 | 84.7 | 69.3 |
| 2015-01-01_00:15:03 | 83.6 | 69.3 |
| 2015-01-01_00:15:04 | 84.4 | 69.3 |
| 2015-01-01_00:15:05 | 84.1 | 69.3 |
| 2015-01-01_00:15:06 | 84.5 | 69.3 |
| 2015-01-01_00:15:07 | 84.7 | 69.3 |
| 2015-01-01_00:15:08 | 84.1 | 69.3 |
| 2015-01-01_00:15:09 | 85.2 | 69.3 |
| 2015-01-01_00:15:10 | 85.1 | 69.3 |
| 2015-01-01_00:15:11 | 84.8 | 69.3 |
| 2015-01-01_00:15:12 | 85.3 | 69.3 |
| 2015-01-01_00:15:13 | 85.5 | 69.2 |
| 2015-01-01_00:15:14 | 85.3 | 69.2 |
| 2015-01-01_00:15:15 | 84.8 | 69.2 |
| 2015-01-01_00:15:16 | 85 | 69.2 |
| 2015-01-01_00:15:17 | 84.8 | 69.2 |
| 2015-01-01_00:15:18 | 85.2 | 69.2 |
| 2015-01-01_00:15:19 | 84.8 | 69.2 |
| 2015-01-01_00:15:20 | 85.4 | 69.2 |
| 2015-01-01_00:15:21 | 84.7 | 69.1 |
| 2015-01-01_00:15:22 | 85.8 | 69.1 |
| 2015-01-01_00:15:23 | 85.4 | 69.1 |
| 2015-01-01_00:15:24 | 84.6 | 69.1 |
| 2015-01-01_00:15:25 | 86.1 | 69.1 |
| 2015-01-01_00:15:26 | 85.4 | 69.1 |
| 2015-01-01_00:15:27 | 85.6 | 69.1 |
| 2015-01-01_00:15:28 | 86.3 | 69.1 |
| 2015-01-01_00:15:29 | 86.1 | 69.1 |
| 2015-01-01_00:15:30 | 86.4 | 69.1 |
| 2015-01-01_00:15:31 | 86.6 | 69.1 |
| 2015-01-01_00:15:32 | 85.7 | 69.1 |
| 2015-01-01_00:15:33 | 86.7 | 69.1 |
| 2015-01-01_00:15:34 | 86.3 | 69.1 |
| 2015-01-01_00:15:35 | 86.2 | 69.1 |
| 2015-01-01_00:15:36 | 86.4 | 69.1 |
| 2015-01-01_00:15:37 | 86.4 | 69 |
| 2015-01-01_00:15:38 | 86.4 | 69 |
| 2015-01-01_00:15:39 | 86.6 | 69 |
| 2015-01-01_00:15:40 | 86.5 | 69 |
| 2015-01-01_00:15:41 | 86.3 | 69 |
| 2015-01-01_00:15:42 | 86.1 | 69 |
| 2015-01-01_00:15:43 | 86.5 | 69 |
| 2015-01-01_00:15:44 | 86.9 | 69 |
| 2015-01-01_00:15:45 | 86.9 | 68.8 |
| 2015-01-01_00:15:46 | 86.2 | 68.8 |
| 2015-01-01_00:15:47 | 86.3 | 68.8 |
| 2015-01-01_00:15:48 | 86.5 | 68.8 |
| 2015-01-01_00:15:49 | 86.3 | 68.8 |
| 2015-01-01_00:15:50 | 86.5 | 68.8 |
| 2015-01-01_00:15:51 | 86.5 | 68.8 |
| 2015-01-01_00:15:52 | 86.8 | 68.8 |
| 2015-01-01_00:15:53 | 87 | 69.1 |
| 2015-01-01_00:15:54 | 86.8 | 69.1 |
| 2015-01-01_00:15:55 | 86.6 | 69.1 |
| 2015-01-01_00:15:56 | 86.7 | 69.1 |
| 2015-01-01_00:15:57 | 86.7 | 69.1 |
| 2015-01-01_00:15:58 | 86.9 | 69.1 |
| 2015-01-01_00:15:59 | 86.7 | 69.1 |
| 2015-01-01_00:16:00 | 86.6 | 69.1 |
| 2015-01-01_00:16:01 | 86.9 | 69.1 |
| 2015-01-01_00:16:02 | 86.9 | 69.1 |
| 2015-01-01_00:16:03 | 87 | 69.1 |
| 2015-01-01_00:16:04 | 86.7 | 69.1 |
| 2015-01-01_00:16:05 | 87 | 69.1 |
| 2015-01-01_00:16:06 | 87 | 69.1 |
| 2015-01-01_00:16:07 | 87 | 69.1 |
| 2015-01-01_00:16:08 | 87.2 | 69.1 |
| 2015-01-01_00:16:09 | 87 | 70.5 |
| 2015-01-01_00:16:10 | 86.9 | 70.5 |
| 2015-01-01_00:16:11 | 86.8 | 70.5 |
| 2015-01-01_00:16:12 | 86.5 | 70.5 |
| 2015-01-01_00:16:13 | 87.1 | 70.5 |
| 2015-01-01_00:16:14 | 86.8 | 70.5 |
| 2015-01-01_00:16:15 | 86.8 | 70.5 |
| 2015-01-01_00:16:16 | 87 | 70.5 |
| 2015-01-01_00:16:17 | 86.8 | 70.9 |
| 2015-01-01_00:16:18 | 86.2 | 70.9 |
| 2015-01-01_00:16:19 | 86.8 | 70.9 |
| 2015-01-01_00:16:20 | 86.8 | 70.9 |
| 2015-01-01_00:16:21 | 86.1 | 70.9 |
| 2015-01-01_00:16:22 | 86 | 70.9 |
| 2015-01-01_00:16:23 | 86.8 | 70.9 |
| 2015-01-01_00:16:24 | 86.7 | 70.9 |
| 2015-01-01_00:16:25 | 86.8 | 71.4 |
| 2015-01-01_00:16:26 | 86.6 | 71.4 |
| 2015-01-01_00:16:27 | 86.6 | 71.4 |
| 2015-01-01_00:16:28 | 86.6 | 71.4 |
| 2015-01-01_00:16:29 | 86.5 | 71.4 |
| 2015-01-01_00:16:30 | 86.5 | 71.4 |
| 2015-01-01_00:16:31 | 86.5 | 71.4 |
| 2015-01-01_00:16:32 | 86.3 | 71.4 |
| 2015-01-01_00:16:33 | 86.5 | 71.8 |
| 2015-01-01_00:16:34 | 86.1 | 71.8 |
| 2015-01-01_00:16:35 | 86.7 | 71.8 |
| 2015-01-01_00:16:36 | 86.2 | 71.8 |
| 2015-01-01_00:16:37 | 85.7 | 71.8 |
| 2015-01-01_00:16:38 | 86.3 | 71.8 |
| 2015-01-01_00:16:39 | 86.3 | 71.8 |
| 2015-01-01_00:16:40 | 86.3 | 71.8 |
| 2015-01-01_00:16:41 | 86.3 | 72.2 |
| 2015-01-01_00:16:42 | 86 | 72.2 |
| 2015-01-01_00:16:43 | 86.2 | 72.2 |
| 2015-01-01_00:16:44 | 86.1 | 72.2 |
| 2015-01-01_00:16:45 | 86.1 | 72.2 |
| 2015-01-01_00:16:46 | 86 | 72.2 |
| 2015-01-01_00:16:47 | 86.3 | 72.2 |
| 2015-01-01_00:16:48 | 86.2 | 72.2 |
| 2015-01-01_00:16:49 | 85.9 | 72.6 |
| 2015-01-01_00:16:50 | 86.2 | 72.6 |
| 2015-01-01_00:16:51 | 86.3 | 72.6 |
| 2015-01-01_00:16:52 | 85.9 | 72.6 |
| 2015-01-01_00:16:53 | 85.3 | 72.6 |
| 2015-01-01_00:16:54 | 86.1 | 72.6 |
| 2015-01-01_00:16:55 | 85.9 | 72.6 |
| 2015-01-01_00:16:56 | 86.1 | 72.6 |
| 2015-01-01_00:16:57 | 85.8 | 72.9 |
| 2015-01-01_00:16:58 | 85.8 | 72.9 |
| 2015-01-01_00:16:59 | 86 | 72.9 |
| 2015-01-01_00:17:00 | 85.6 | 72.9 |
| 2015-01-01_00:17:01 | 85.7 | 72.9 |
| 2015-01-01_00:17:02 | 85.7 | 72.9 |
| 2015-01-01_00:17:03 | 85.4 | 72.9 |
| 2015-01-01_00:17:04 | 85.6 | 72.9 |
| 2015-01-01_00:17:05 | 85.6 | 73.1 |
| 2015-01-01_00:17:06 | 85.7 | 73.1 |
| 2015-01-01_00:17:07 | 85.4 | 73.1 |
| 2015-01-01_00:17:08 | 85.2 | 73.1 |
| 2015-01-01_00:17:09 | 85.4 | 73.1 |
| 2015-01-01_00:17:10 | 85.3 | 73.1 |
| 2015-01-01_00:17:11 | 85.3 | 73.1 |
| 2015-01-01_00:17:12 | 84.8 | 73.1 |
| 2015-01-01_00:17:13 | 84.5 | 73.1 |
| 2015-01-01_00:17:14 | 85.5 | 73.1 |
| 2015-01-01_00:17:15 | 84.8 | 73.1 |
| 2015-01-01_00:17:16 | 86.2 | 73.1 |
| 2015-01-01_00:17:17 | 86.3 | 73.1 |
| 2015-01-01_00:17:18 | 86.2 | 73.1 |
| 2015-01-01_00:17:19 | 86.3 | 73.1 |
| 2015-01-01_00:17:20 | 85.9 | 73.1 |
| 2015-01-01_00:17:21 | 85.9 | 73.3 |
| 2015-01-01_00:17:22 | 86.7 | 73.3 |
| 2015-01-01_00:17:23 | 87.1 | 73.3 |
| 2015-01-01_00:17:24 | 85.8 | 73.3 |
| 2015-01-01_00:17:25 | 87 | 73.3 |
| 2015-01-01_00:17:26 | 87.1 | 73.3 |
| 2015-01-01_00:17:27 | 86.2 | 73.3 |
| 2015-01-01_00:17:28 | 87.2 | 73.3 |
| 2015-01-01_00:17:29 | 87.2 | 73.3 |
| 2015-01-01_00:17:30 | 87.5 | 73.3 |
| 2015-01-01_00:17:31 | 87.3 | 73.3 |
| 2015-01-01_00:17:32 | 87.2 | 73.3 |
| 2015-01-01_00:17:33 | 87.4 | 73.3 |
| 2015-01-01_00:17:34 | 87.4 | 73.3 |
| 2015-01-01_00:17:35 | 87.4 | 73.3 |
| 2015-01-01_00:17:36 | 87 | 73.3 |
| 2015-01-01_00:17:37 | 87.4 | 71.9 |
| 2015-01-01_00:17:38 | 87.8 | 71.9 |
| 2015-01-01_00:17:39 | 87.4 | 71.9 |
| 2015-01-01_00:17:40 | 86.8 | 71.9 |
| 2015-01-01_00:17:41 | 87.1 | 71.9 |
| 2015-01-01_00:17:42 | 87.2 | 71.9 |
| 2015-01-01_00:17:43 | 87.6 | 71.9 |
| 2015-01-01_00:17:44 | 86.9 | 71.9 |
| 2015-01-01_00:17:45 | 87.6 | 71.1 |
| 2015-01-01_00:17:46 | 86.5 | 71.1 |
| 2015-01-01_00:17:47 | 87.3 | 71.1 |
| 2015-01-01_00:17:48 | 87.1 | 71.1 |
| 2015-01-01_00:17:49 | 87.5 | 71.1 |
| 2015-01-01_00:17:50 | 87.5 | 71.1 |
| 2015-01-01_00:17:51 | 87.2 | 71.1 |
| 2015-01-01_00:17:52 | 87.5 | 71.1 |
| 2015-01-01_00:17:53 | 86.9 | 70.6 |
| 2015-01-01_00:17:54 | 87.9 | 70.6 |
| 2015-01-01_00:17:55 | 86.9 | 70.6 |
| 2015-01-01_00:17:56 | 87.6 | 70.6 |
| 2015-01-01_00:17:57 | 88.1 | 70.6 |
| 2015-01-01_00:17:58 | 87.7 | 70.6 |
| 2015-01-01_00:17:59 | 87.1 | 70.6 |
| 2015-01-01_00:18:00 | 87.2 | 70.6 |
| 2015-01-01_00:18:01 | 87.9 | 70.1 |
| 2015-01-01_00:18:02 | 87.6 | 70.1 |
| 2015-01-01_00:18:03 | 87.6 | 70.1 |
| 2015-01-01_00:18:04 | 87.9 | 70.1 |
| 2015-01-01_00:18:05 | 87.8 | 70.1 |
| 2015-01-01_00:18:06 | 87.6 | 70.1 |
| 2015-01-01_00:18:07 | 87.5 | 70.1 |
| 2015-01-01_00:18:08 | 87.4 | 70.1 |
| 2015-01-01_00:18:09 | 87.3 | 70.1 |
| 2015-01-01_00:18:10 | 87.6 | 70.1 |
| 2015-01-01_00:18:11 | 87.5 | 70.1 |
| 2015-01-01_00:18:12 | 86.9 | 70.1 |
| 2015-01-01_00:18:13 | 87.2 | 70.1 |
| 2015-01-01_00:18:14 | 87.5 | 70.1 |
| 2015-01-01_00:18:15 | 86 | 70.1 |
| 2015-01-01_00:18:16 | 87.4 | 70.1 |
| 2015-01-01_00:18:17 | 86 | 69.4 |
| 2015-01-01_00:18:18 | 86.4 | 69.4 |
| 2015-01-01_00:18:19 | 86.5 | 69.4 |
| 2015-01-01_00:18:20 | 86.8 | 69.4 |
| 2015-01-01_00:18:21 | 86.6 | 69.4 |
| 2015-01-01_00:18:22 | 86.8 | 69.4 |
| 2015-01-01_00:18:23 | 86.9 | 69.4 |
| 2015-01-01_00:18:24 | 86.5 | 69.4 |
| 2015-01-01_00:18:25 | 85.6 | 69.1 |
| 2015-01-01_00:18:26 | 86.6 | 69.1 |
| 2015-01-01_00:18:27 | 86.8 | 69.1 |
| 2015-01-01_00:18:28 | 85.6 | 69.1 |
| 2015-01-01_00:18:29 | 86.8 | 69.1 |
| 2015-01-01_00:18:30 | 86.6 | 69.1 |
| 2015-01-01_00:18:31 | 86.2 | 69.1 |
| 2015-01-01_00:18:32 | 86.7 | 69.1 |
| 2015-01-01_00:18:33 | 86.7 | 68.9 |
| 2015-01-01_00:18:34 | 86.1 | 68.9 |
| 2015-01-01_00:18:35 | 87 | 68.9 |
| 2015-01-01_00:18:36 | 87.1 | 68.9 |
| 2015-01-01_00:18:37 | 86.7 | 68.9 |
| 2015-01-01_00:18:38 | 87.1 | 68.9 |
| 2015-01-01_00:18:39 | 87.3 | 68.9 |
| 2015-01-01_00:18:40 | 86.7 | 68.9 |
| 2015-01-01_00:18:41 | 87.3 | 68.8 |
| 2015-01-01_00:18:42 | 87.2 | 68.8 |
| 2015-01-01_00:18:43 | 87.4 | 68.8 |
| 2015-01-01_00:18:44 | 87.3 | 68.8 |
| 2015-01-01_00:18:45 | 87.3 | 68.8 |
| 2015-01-01_00:18:46 | 87.2 | 68.8 |
| 2015-01-01_00:18:47 | 87.2 | 68.8 |
| 2015-01-01_00:18:48 | 87.1 | 68.8 |
| 2015-01-01_00:18:49 | 86.9 | 68.6 |
| 2015-01-01_00:18:50 | 87.3 | 68.6 |
| 2015-01-01_00:18:51 | 87 | 68.6 |
| 2015-01-01_00:18:52 | 87.6 | 68.6 |
| 2015-01-01_00:18:53 | 87.5 | 68.6 |
| 2015-01-01_00:18:54 | 87.2 | 68.6 |
| 2015-01-01_00:18:55 | 87.6 | 68.6 |
| 2015-01-01_00:18:56 | 87.2 | 68.6 |
| 2015-01-01_00:18:57 | 87.2 | 68.5 |
| 2015-01-01_00:18:58 | 86.7 | 68.5 |
| 2015-01-01_00:18:59 | 87 | 68.5 |
| 2015-01-01_00:19:00 | 86.9 | 68.5 |
| 2015-01-01_00:19:01 | 86.7 | 68.5 |
| 2015-01-01_00:19:02 | 86.7 | 68.5 |
| 2015-01-01_00:19:03 | 86.1 | 68.5 |
| 2015-01-01_00:19:04 | 86.6 | 68.5 |
| 2015-01-01_00:19:05 | 86.3 | 68.5 |
| 2015-01-01_00:19:06 | 86.5 | 68.5 |
| 2015-01-01_00:19:07 | 86.6 | 68.5 |
| 2015-01-01_00:19:08 | 86.3 | 68.5 |
| 2015-01-01_00:19:09 | 86.2 | 68.5 |
| 2015-01-01_00:19:10 | 86.5 | 68.5 |
| 2015-01-01_00:19:11 | 86.1 | 68.5 |
| 2015-01-01_00:19:12 | 86.1 | 68.5 |
| 2015-01-01_00:19:13 | 86.2 | 68.4 |
| 2015-01-01_00:19:14 | 85.9 | 68.4 |
| 2015-01-01_00:19:15 | 85.7 | 68.4 |
| 2015-01-01_00:19:16 | 86.1 | 68.4 |
| 2015-01-01_00:19:17 | 85.6 | 68.4 |
| 2015-01-01_00:19:18 | 85.6 | 68.4 |
| 2015-01-01_00:19:19 | 85.7 | 68.4 |
| 2015-01-01_00:19:20 | 85.4 | 68.4 |
| 2015-01-01_00:19:21 | 84.4 | 68.4 |
| 2015-01-01_00:19:22 | 85.3 | 68.4 |
| 2015-01-01_00:19:23 | 84.5 | 68.4 |
| 2015-01-01_00:19:24 | 85.5 | 68.4 |
| 2015-01-01_00:19:25 | 85.4 | 68.4 |
| 2015-01-01_00:19:26 | 85.3 | 68.4 |
| 2015-01-01_00:19:27 | 85 | 68.4 |
| 2015-01-01_00:19:28 | 85.3 | 68.4 |
| 2015-01-01_00:19:29 | 84.9 | 68.4 |
| 2015-01-01_00:19:30 | 85.5 | 68.4 |
| 2015-01-01_00:19:31 | 85.6 | 68.4 |
| 2015-01-01_00:19:32 | 85.9 | 68.4 |
| 2015-01-01_00:19:33 | 85.2 | 68.4 |
| 2015-01-01_00:19:34 | 85.8 | 68.4 |
| 2015-01-01_00:19:35 | 85.7 | 68.4 |
| 2015-01-01_00:19:36 | 86.1 | 68.4 |
| 2015-01-01_00:19:37 | 86.2 | 68.6 |
| 2015-01-01_00:19:38 | 86.8 | 68.6 |
| 2015-01-01_00:19:39 | 86.4 | 68.6 |
| 2015-01-01_00:19:40 | 85.5 | 68.6 |
| 2015-01-01_00:19:41 | 86.7 | 68.6 |
| 2015-01-01_00:19:42 | 87 | 68.6 |
| 2015-01-01_00:19:43 | 87 | 68.6 |
| 2015-01-01_00:19:44 | 87.5 | 68.6 |
| 2015-01-01_00:19:45 | 87.3 | 68.5 |
| 2015-01-01_00:19:46 | 87.3 | 68.5 |
| 2015-01-01_00:19:47 | 87.2 | 68.5 |
| 2015-01-01_00:19:48 | 87.1 | 68.5 |
| 2015-01-01_00:19:49 | 87.2 | 68.5 |
| 2015-01-01_00:19:50 | 87.3 | 68.5 |
| 2015-01-01_00:19:51 | 87 | 68.5 |
| 2015-01-01_00:19:52 | 85.9 | 68.5 |
| 2015-01-01_00:19:53 | 85.9 | 68.3 |
| 2015-01-01_00:19:54 | 87.4 | 68.3 |
| 2015-01-01_00:19:55 | 87.2 | 68.3 |
| 2015-01-01_00:19:56 | 87.6 | 68.3 |
| 2015-01-01_00:19:57 | 87.2 | 68.3 |
| 2015-01-01_00:19:58 | 86.9 | 68.3 |
| 2015-01-01_00:19:59 | 87.2 | 68.3 |
| 2015-01-01_00:20:00 | 86.7 | 68.3 |
| 2015-01-01_00:20:01 | 87 | 68.4 |
| 2015-01-01_00:20:02 | 87.1 | 68.4 |
| 2015-01-01_00:20:03 | 86.1 | 68.4 |
| 2015-01-01_00:20:04 | 87 | 68.4 |
| 2015-01-01_00:20:05 | 86.3 | 68.4 |
| 2015-01-01_00:20:06 | 86.3 | 68.4 |
| 2015-01-01_00:20:07 | 86.8 | 68.4 |
| 2015-01-01_00:20:08 | 87.3 | 68.4 |
| 2015-01-01_00:20:09 | 86.7 | 68.6 |
| 2015-01-01_00:20:10 | 87.4 | 68.6 |
| 2015-01-01_00:20:11 | 87.4 | 68.6 |
| 2015-01-01_00:20:12 | 87.1 | 68.6 |
| 2015-01-01_00:20:13 | 87.4 | 68.6 |
| 2015-01-01_00:20:14 | 87.6 | 68.6 |
| 2015-01-01_00:20:15 | 88.1 | 68.6 |
| 2015-01-01_00:20:16 | 87 | 68.6 |
| 2015-01-01_00:20:17 | 88.7 | 68.6 |
| 2015-01-01_00:20:18 | 87.6 | 68.6 |
| 2015-01-01_00:20:19 | 88.6 | 68.6 |
| 2015-01-01_00:20:20 | 88.7 | 68.6 |
| 2015-01-01_00:20:21 | 88.3 | 68.6 |
| 2015-01-01_00:20:22 | 89 | 68.6 |
| 2015-01-01_00:20:23 | 89.1 | 68.6 |
| 2015-01-01_00:20:24 | 88.4 | 68.6 |
| 2015-01-01_00:20:25 | 87.9 | 68.6 |
| 2015-01-01_00:20:26 | 87.6 | 68.6 |
| 2015-01-01_00:20:27 | 87.3 | 68.6 |
| 2015-01-01_00:20:28 | 86.6 | 68.6 |
| 2015-01-01_00:20:29 | 86.5 | 68.6 |
| 2015-01-01_00:20:30 | 85.9 | 68.6 |
| 2015-01-01_00:20:31 | 85.4 | 68.6 |
| 2015-01-01_00:20:32 | 85.2 | 68.6 |
| 2015-01-01_00:20:33 | 85.1 | 68.5 |
| 2015-01-01_00:20:34 | 85.1 | 68.5 |
| 2015-01-01_00:20:35 | 84.5 | 68.5 |
| 2015-01-01_00:20:36 | 85.2 | 68.5 |
| 2015-01-01_00:20:37 | 84.3 | 68.5 |
| 2015-01-01_00:20:38 | 84.2 | 68.5 |
| 2015-01-01_00:20:39 | 85 | 68.5 |
| 2015-01-01_00:20:40 | 85.2 | 68.5 |
| 2015-01-01_00:20:41 | 84.6 | 68.8 |
| 2015-01-01_00:20:42 | 85 | 68.8 |
| 2015-01-01_00:20:43 | 85.1 | 68.8 |
| 2015-01-01_00:20:44 | 84.9 | 68.8 |
| 2015-01-01_00:20:45 | 85.3 | 68.8 |
| 2015-01-01_00:20:46 | 85.2 | 68.8 |
| 2015-01-01_00:20:47 | 85.3 | 68.8 |
| 2015-01-01_00:20:48 | 85.1 | 68.8 |
| 2015-01-01_00:20:49 | 85.4 | 68.8 |
| 2015-01-01_00:20:50 | 85.7 | 68.8 |
| 2015-01-01_00:20:51 | 85.5 | 68.8 |
| 2015-01-01_00:20:52 | 85.7 | 68.8 |
| 2015-01-01_00:20:53 | 86 | 68.8 |
| 2015-01-01_00:20:54 | 85.8 | 68.8 |
| 2015-01-01_00:20:55 | 86.1 | 68.8 |
| 2015-01-01_00:20:56 | 86 | 68.8 |
| 2015-01-01_00:20:57 | 86 | 69.7 |
| 2015-01-01_00:20:58 | 85.9 | 69.7 |
| 2015-01-01_00:20:59 | 86.3 | 69.7 |
| 2015-01-01_00:21:00 | 86 | 69.7 |
| 2015-01-01_00:21:01 | 86.1 | 69.7 |
| 2015-01-01_00:21:02 | 86.8 | 69.7 |
| 2015-01-01_00:21:03 | 86.4 | 69.7 |
| 2015-01-01_00:21:04 | 86.5 | 69.7 |
| 2015-01-01_00:21:05 | 86.9 | 70 |
| 2015-01-01_00:21:06 | 87.3 | 70 |
| 2015-01-01_00:21:07 | 86.6 | 70 |
| 2015-01-01_00:21:08 | 87 | 70 |
| 2015-01-01_00:21:09 | 87.5 | 70 |
| 2015-01-01_00:21:10 | 87.5 | 70 |
| 2015-01-01_00:21:11 | 87.3 | 70 |
| 2015-01-01_00:21:12 | 87.3 | 70 |
| 2015-01-01_00:21:13 | 87.4 | 70.2 |
| 2015-01-01_00:21:14 | 86.9 | 70.2 |
| 2015-01-01_00:21:15 | 88.1 | 70.2 |
| 2015-01-01_00:21:16 | 87.4 | 70.2 |
| 2015-01-01_00:21:17 | 86.9 | 70.2 |
| 2015-01-01_00:21:18 | 88.1 | 70.2 |
| 2015-01-01_00:21:19 | 88.5 | 70.2 |
| 2015-01-01_00:21:20 | 88.8 | 70.2 |
| 2015-01-01_00:21:21 | 88.2 | 70.2 |
| 2015-01-01_00:21:22 | 88.3 | 70.2 |
| 2015-01-01_00:21:23 | 88.3 | 70.2 |
| 2015-01-01_00:21:24 | 89 | 70.2 |
| 2015-01-01_00:21:25 | 89.8 | 70.2 |
| 2015-01-01_00:21:26 | 90 | 70.2 |
| 2015-01-01_00:21:27 | 90 | 70.2 |
| 2015-01-01_00:21:28 | 89.3 | 70.2 |
| 2015-01-01_00:21:29 | 89.5 | 70.4 |
| 2015-01-01_00:21:30 | 89.5 | 70.4 |
| 2015-01-01_00:21:31 | 88.8 | 70.4 |
| 2015-01-01_00:21:32 | 88.4 | 70.4 |
| 2015-01-01_00:21:33 | 87.5 | 70.4 |
| 2015-01-01_00:21:34 | 86.7 | 70.4 |
| 2015-01-01_00:21:35 | 86.4 | 70.4 |
| 2015-01-01_00:21:36 | 84.8 | 70.4 |
| 2015-01-01_00:21:37 | 85.1 | 70.1 |
| 2015-01-01_00:21:38 | 85 | 70.1 |
| 2015-01-01_00:21:39 | 84.9 | 70.1 |
| 2015-01-01_00:21:40 | 85.1 | 70.1 |
| 2015-01-01_00:21:41 | 84.7 | 70.1 |
| 2015-01-01_00:21:42 | 84.7 | 70.1 |
| 2015-01-01_00:21:43 | 84.1 | 70.1 |
| 2015-01-01_00:21:44 | 84.9 | 70.1 |
| 2015-01-01_00:21:45 | 84.2 | 70 |
| 2015-01-01_00:21:46 | 85.2 | 70 |
| 2015-01-01_00:21:47 | 85.3 | 70 |
| 2015-01-01_00:21:48 | 85.8 | 70 |
| 2015-01-01_00:21:49 | 85.2 | 70 |
| 2015-01-01_00:21:50 | 84.5 | 70 |
| 2015-01-01_00:21:51 | 85.2 | 70 |
| 2015-01-01_00:21:52 | 85.7 | 70 |
| 2015-01-01_00:21:53 | 85.9 | 70 |
| 2015-01-01_00:21:54 | 85.4 | 70 |
| 2015-01-01_00:21:55 | 86 | 70 |
| 2015-01-01_00:21:56 | 85.7 | 70 |
| 2015-01-01_00:21:57 | 86.3 | 70 |
| 2015-01-01_00:21:58 | 86.4 | 70 |
| 2015-01-01_00:21:59 | 86.3 | 70 |
| 2015-01-01_00:22:00 | 86 | 70 |
| 2015-01-01_00:22:01 | 86.7 | 69.9 |
| 2015-01-01_00:22:02 | 86.9 | 69.9 |
| 2015-01-01_00:22:03 | 87.2 | 69.9 |
| 2015-01-01_00:22:04 | 87.3 | 69.9 |
| 2015-01-01_00:22:05 | 86.5 | 69.9 |
| 2015-01-01_00:22:06 | 87.2 | 69.9 |
| 2015-01-01_00:22:07 | 87 | 69.9 |
| 2015-01-01_00:22:08 | 87.3 | 69.9 |
| 2015-01-01_00:22:09 | 87.6 | 69.9 |
| 2015-01-01_00:22:10 | 87.8 | 69.9 |
| 2015-01-01_00:22:11 | 87.6 | 69.9 |
| 2015-01-01_00:22:12 | 87.8 | 69.9 |
| 2015-01-01_00:22:13 | 88.1 | 69.9 |
| 2015-01-01_00:22:14 | 88.2 | 69.9 |
| 2015-01-01_00:22:15 | 87.7 | 69.9 |
| 2015-01-01_00:22:16 | 88.2 | 69.9 |
| 2015-01-01_00:22:17 | 88.3 | 69.9 |
| 2015-01-01_00:22:18 | 87.8 | 69.9 |
| 2015-01-01_00:22:19 | 87.9 | 69.9 |
| 2015-01-01_00:22:20 | 87.9 | 69.9 |
| 2015-01-01_00:22:21 | 88 | 69.9 |
| 2015-01-01_00:22:22 | 87.3 | 69.9 |
| 2015-01-01_00:22:23 | 86.7 | 69.9 |
| 2015-01-01_00:22:24 | 86.5 | 69.9 |
| 2015-01-01_00:22:25 | 86.1 | 69.4 |
| 2015-01-01_00:22:26 | 85.7 | 69.4 |
| 2015-01-01_00:22:27 | 85.7 | 69.4 |
| 2015-01-01_00:22:28 | 86 | 69.4 |
| 2015-01-01_00:22:29 | 85.6 | 69.4 |
| 2015-01-01_00:22:30 | 85.4 | 69.4 |
| 2015-01-01_00:22:31 | 85.5 | 69.4 |
| 2015-01-01_00:22:32 | 86 | 69.4 |
| 2015-01-01_00:22:33 | 85.8 | 69.4 |
| 2015-01-01_00:22:34 | 86.5 | 69.4 |
| 2015-01-01_00:22:35 | 85.1 | 69.4 |
| 2015-01-01_00:22:36 | 86.3 | 69.4 |
| 2015-01-01_00:22:37 | 86.5 | 69.4 |
| 2015-01-01_00:22:38 | 86.6 | 69.4 |
| 2015-01-01_00:22:39 | 86.6 | 69.4 |
| 2015-01-01_00:22:40 | 86.6 | 69.4 |
| 2015-01-01_00:22:41 | 86.3 | 69.5 |
| 2015-01-01_00:22:42 | 86.9 | 69.5 |
| 2015-01-01_00:22:43 | 86.9 | 69.5 |
| 2015-01-01_00:22:44 | 86.6 | 69.5 |
| 2015-01-01_00:22:45 | 87 | 69.5 |
| 2015-01-01_00:22:46 | 86.7 | 69.5 |
| 2015-01-01_00:22:47 | 86 | 69.5 |
| 2015-01-01_00:22:48 | 86.8 | 69.5 |
| 2015-01-01_00:22:49 | 86.2 | 69.5 |
| 2015-01-01_00:22:50 | 86.7 | 69.5 |
| 2015-01-01_00:22:51 | 87.4 | 69.5 |
| 2015-01-01_00:22:52 | 87.4 | 69.5 |
| 2015-01-01_00:22:53 | 87.5 | 69.5 |
| 2015-01-01_00:22:54 | 86.7 | 69.5 |
| 2015-01-01_00:22:55 | 87.6 | 69.5 |
| 2015-01-01_00:22:56 | 87.3 | 69.5 |
| 2015-01-01_00:22:57 | 87.7 | 69.3 |
| 2015-01-01_00:22:58 | 87.2 | 69.3 |
| 2015-01-01_00:22:59 | 86.9 | 69.3 |
| 2015-01-01_00:23:00 | 87 | 69.3 |
| 2015-01-01_00:23:01 | 87.1 | 69.3 |
| 2015-01-01_00:23:02 | 88 | 69.3 |
| 2015-01-01_00:23:03 | 87.9 | 69.3 |
| 2015-01-01_00:23:04 | 87.3 | 69.3 |
| 2015-01-01_00:23:05 | 87.7 | 69.2 |
| 2015-01-01_00:23:06 | 88 | 69.2 |
| 2015-01-01_00:23:07 | 87.8 | 69.2 |
| 2015-01-01_00:23:08 | 87.6 | 69.2 |
| 2015-01-01_00:23:09 | 86.9 | 69.2 |
| 2015-01-01_00:23:10 | 87.5 | 69.2 |
| 2015-01-01_00:23:11 | 87.2 | 69.2 |
| 2015-01-01_00:23:12 | 87 | 69.2 |
| 2015-01-01_00:23:13 | 86.8 | 69.2 |
| 2015-01-01_00:23:14 | 86.1 | 69.2 |
| 2015-01-01_00:23:15 | 86.1 | 69.2 |
| 2015-01-01_00:23:16 | 86.4 | 69.2 |
| 2015-01-01_00:23:17 | 85.6 | 69.2 |
| 2015-01-01_00:23:18 | 86.1 | 69.2 |
| 2015-01-01_00:23:19 | 86.3 | 69.2 |
| 2015-01-01_00:23:20 | 85 | 69.2 |
| 2015-01-01_00:23:21 | 85.5 | 69 |
| 2015-01-01_00:23:22 | 86.2 | 69 |
| 2015-01-01_00:23:23 | 86.3 | 69 |
| 2015-01-01_00:23:24 | 86.5 | 69 |
| 2015-01-01_00:23:25 | 86.6 | 69 |
| 2015-01-01_00:23:26 | 86.7 | 69 |
| 2015-01-01_00:23:27 | 86.9 | 69 |
| 2015-01-01_00:23:28 | 86.7 | 69 |
| 2015-01-01_00:23:29 | 87 | 69 |
| 2015-01-01_00:23:30 | 86 | 69 |
| 2015-01-01_00:23:31 | 87.3 | 69 |
| 2015-01-01_00:23:32 | 87.3 | 69 |
| 2015-01-01_00:23:33 | 87.5 | 69 |
| 2015-01-01_00:23:34 | 87.6 | 69 |
| 2015-01-01_00:23:35 | 87.2 | 69 |
| 2015-01-01_00:23:36 | 87.6 | 69 |
| 2015-01-01_00:23:37 | 86.3 | 69 |
| 2015-01-01_00:23:38 | 87.9 | 69 |
| 2015-01-01_00:23:39 | 88 | 69 |
| 2015-01-01_00:23:40 | 87.5 | 69 |
| 2015-01-01_00:23:41 | 87.3 | 69 |
| 2015-01-01_00:23:42 | 87.9 | 69 |
| 2015-01-01_00:23:43 | 87.8 | 69 |
| 2015-01-01_00:23:44 | 87.3 | 69 |
| 2015-01-01_00:23:45 | 88.3 | 69 |
| 2015-01-01_00:23:46 | 88 | 69 |
| 2015-01-01_00:23:47 | 87.5 | 69 |
| 2015-01-01_00:23:48 | 87.5 | 69 |
| 2015-01-01_00:23:49 | 86.8 | 69 |
| 2015-01-01_00:23:50 | 86.9 | 69 |
| 2015-01-01_00:23:51 | 87.1 | 69 |
| 2015-01-01_00:23:52 | 87 | 69 |
| 2015-01-01_00:23:53 | 86.5 | 68.9 |
| 2015-01-01_00:23:54 | 86.6 | 68.9 |
| 2015-01-01_00:23:55 | 86.1 | 68.9 |
| 2015-01-01_00:23:56 | 86.1 | 68.9 |
| 2015-01-01_00:23:57 | 85.7 | 68.9 |
| 2015-01-01_00:23:58 | 85.1 | 68.9 |
| 2015-01-01_00:23:59 | 86.6 | 68.9 |
| 2015-01-01_00:24:00 | 86.2 | 68.9 |
| 2015-01-01_00:24:01 | 86.3 | 68.8 |
| 2015-01-01_00:24:02 | 86.1 | 68.8 |
| 2015-01-01_00:24:03 | 86.2 | 68.8 |
| 2015-01-01_00:24:04 | 86.3 | 68.8 |
| 2015-01-01_00:24:05 | 86.1 | 68.8 |
| 2015-01-01_00:24:06 | 86.4 | 68.8 |
| 2015-01-01_00:24:07 | 86.2 | 68.8 |
| 2015-01-01_00:24:08 | 86.2 | 68.8 |
| 2015-01-01_00:24:09 | 86.3 | 68.8 |
| 2015-01-01_00:24:10 | 85.8 | 68.8 |
| 2015-01-01_00:24:11 | 86.4 | 68.8 |
| 2015-01-01_00:24:12 | 86.3 | 68.8 |
| 2015-01-01_00:24:13 | 86.2 | 68.8 |
| 2015-01-01_00:24:14 | 86.6 | 68.8 |
| 2015-01-01_00:24:15 | 86 | 68.8 |
| 2015-01-01_00:24:16 | 85.8 | 68.8 |
| 2015-01-01_00:24:17 | 87.2 | 68.8 |
| 2015-01-01_00:24:18 | 86.8 | 68.8 |
| 2015-01-01_00:24:19 | 85.9 | 68.8 |
| 2015-01-01_00:24:20 | 86.9 | 68.8 |
| 2015-01-01_00:24:21 | 86.4 | 68.8 |
| 2015-01-01_00:24:22 | 87.4 | 68.8 |
| 2015-01-01_00:24:23 | 87.7 | 68.8 |
| 2015-01-01_00:24:24 | 87.6 | 68.8 |
| 2015-01-01_00:24:25 | 87.4 | 68.7 |
| 2015-01-01_00:24:26 | 87.2 | 68.7 |
| 2015-01-01_00:24:27 | 87.4 | 68.7 |
| 2015-01-01_00:24:28 | 87.2 | 68.7 |
| 2015-01-01_00:24:29 | 87.2 | 68.7 |
| 2015-01-01_00:24:30 | 87.7 | 68.7 |
| 2015-01-01_00:24:31 | 87.8 | 68.7 |
| 2015-01-01_00:24:32 | 87 | 68.7 |
| 2015-01-01_00:24:33 | 87.8 | 68.7 |
| 2015-01-01_00:24:34 | 87.5 | 68.7 |
| 2015-01-01_00:24:35 | 87 | 68.7 |
| 2015-01-01_00:24:36 | 87.4 | 68.7 |
| 2015-01-01_00:24:37 | 87.2 | 68.7 |
| 2015-01-01_00:24:38 | 86.2 | 68.7 |
| 2015-01-01_00:24:39 | 86.9 | 68.7 |
| 2015-01-01_00:24:40 | 86.1 | 68.7 |
| 2015-01-01_00:24:41 | 86.8 | 68.6 |
| 2015-01-01_00:24:42 | 86.5 | 68.6 |
| 2015-01-01_00:24:43 | 86.2 | 68.6 |
| 2015-01-01_00:24:44 | 85.4 | 68.6 |
| 2015-01-01_00:24:45 | 86.3 | 68.6 |
| 2015-01-01_00:24:46 | 86.1 | 68.6 |
| 2015-01-01_00:24:47 | 86.4 | 68.6 |
| 2015-01-01_00:24:48 | 86.3 | 68.6 |
| 2015-01-01_00:24:49 | 86.3 | 68.5 |
| 2015-01-01_00:24:50 | 86.5 | 68.5 |
| 2015-01-01_00:24:51 | 85.8 | 68.5 |
| 2015-01-01_00:24:52 | 86.1 | 68.5 |
| 2015-01-01_00:24:53 | 85.5 | 68.5 |
| 2015-01-01_00:24:54 | 86.9 | 68.5 |
| 2015-01-01_00:24:55 | 86.4 | 68.5 |
| 2015-01-01_00:24:56 | 86.7 | 68.5 |
| 2015-01-01_00:24:57 | 85.9 | 68.4 |
| 2015-01-01_00:24:58 | 86.5 | 68.4 |
| 2015-01-01_00:24:59 | 86.7 | 68.4 |
| 2015-01-01_00:25:00 | 86.7 | 68.4 |
| 2015-01-01_00:25:01 | 87 | 68.4 |
| 2015-01-01_00:25:02 | 86.8 | 68.4 |
| 2015-01-01_00:25:03 | 86.8 | 68.4 |
| 2015-01-01_00:25:04 | 86.7 | 68.4 |
| 2015-01-01_00:25:05 | 86.8 | 68.4 |
| 2015-01-01_00:25:06 | 87.2 | 68.4 |
| 2015-01-01_00:25:07 | 86.2 | 68.4 |
| 2015-01-01_00:25:08 | 87.3 | 68.4 |
| 2015-01-01_00:25:09 | 86.6 | 68.4 |
| 2015-01-01_00:25:10 | 87.3 | 68.4 |
| 2015-01-01_00:25:11 | 87.3 | 68.4 |
| 2015-01-01_00:25:12 | 87.4 | 68.4 |
| 2015-01-01_00:25:13 | 87 | 68.2 |
| 2015-01-01_00:25:14 | 87.6 | 68.2 |
| 2015-01-01_00:25:15 | 86.6 | 68.2 |
| 2015-01-01_00:25:16 | 87.4 | 68.2 |
| 2015-01-01_00:25:17 | 87.4 | 68.2 |
| 2015-01-01_00:25:18 | 86.9 | 68.2 |
| 2015-01-01_00:25:19 | 87.3 | 68.2 |
| 2015-01-01_00:25:20 | 87.3 | 68.2 |
| 2015-01-01_00:25:21 | 87.3 | 68.1 |
| 2015-01-01_00:25:22 | 86.3 | 68.1 |
| 2015-01-01_00:25:23 | 87.1 | 68.1 |
| 2015-01-01_00:25:24 | 87.3 | 68.1 |
| 2015-01-01_00:25:25 | 86.4 | 68.1 |
| 2015-01-01_00:25:26 | 86.4 | 68.1 |
| 2015-01-01_00:25:27 | 86.8 | 68.1 |
| 2015-01-01_00:25:28 | 86.3 | 68.1 |
| 2015-01-01_00:25:29 | 86.7 | 68 |
| 2015-01-01_00:25:30 | 86.8 | 68 |
| 2015-01-01_00:25:31 | 86.6 | 68 |
| 2015-01-01_00:25:32 | 86.8 | 68 |
| 2015-01-01_00:25:33 | 86.9 | 68 |
| 2015-01-01_00:25:34 | 86.9 | 68 |
| 2015-01-01_00:25:35 | 86.7 | 68 |
| 2015-01-01_00:25:36 | 86.3 | 68 |
| 2015-01-01_00:25:37 | 85.8 | 67.9 |
| 2015-01-01_00:25:38 | 86.4 | 67.9 |
| 2015-01-01_00:25:39 | 87.1 | 67.9 |
| 2015-01-01_00:25:40 | 85.9 | 67.9 |
| 2015-01-01_00:25:41 | 85.6 | 67.9 |
| 2015-01-01_00:25:42 | 85.6 | 67.9 |
| 2015-01-01_00:25:43 | 86.5 | 67.9 |
| 2015-01-01_00:25:44 | 86.7 | 67.9 |
| 2015-01-01_00:25:45 | 86.9 | 67.9 |
| 2015-01-01_00:25:46 | 86.8 | 67.9 |
| 2015-01-01_00:25:47 | 86.7 | 67.9 |
| 2015-01-01_00:25:48 | 86.7 | 67.9 |
| 2015-01-01_00:25:49 | 87 | 67.9 |
| 2015-01-01_00:25:50 | 87 | 67.9 |
| 2015-01-01_00:25:51 | 87 | 67.9 |
| 2015-01-01_00:25:52 | 86.9 | 67.9 |
| 2015-01-01_00:25:53 | 87 | 67.8 |
| 2015-01-01_00:25:54 | 86.4 | 67.8 |
| 2015-01-01_00:25:55 | 86.6 | 67.8 |
| 2015-01-01_00:25:56 | 86.7 | 67.8 |
| 2015-01-01_00:25:57 | 86.7 | 67.8 |
| 2015-01-01_00:25:58 | 87 | 67.8 |
| 2015-01-01_00:25:59 | 86.5 | 67.8 |
| 2015-01-01_00:26:00 | 87.1 | 67.8 |
| 2015-01-01_00:26:01 | 86.9 | 67.8 |
| 2015-01-01_00:26:02 | 86.7 | 67.8 |
| 2015-01-01_00:26:03 | 86.3 | 67.8 |
| 2015-01-01_00:26:04 | 87 | 67.8 |
| 2015-01-01_00:26:05 | 87.2 | 67.8 |
| 2015-01-01_00:26:06 | 86.8 | 67.8 |
| 2015-01-01_00:26:07 | 86.9 | 67.8 |
| 2015-01-01_00:26:08 | 86 | 67.8 |
| 2015-01-01_00:26:09 | 87 | 67.8 |
| 2015-01-01_00:26:10 | 86.1 | 67.8 |
| 2015-01-01_00:26:11 | 87 | 67.8 |
| 2015-01-01_00:26:12 | 86.4 | 67.8 |
| 2015-01-01_00:26:13 | 86.3 | 67.8 |
| 2015-01-01_00:26:14 | 86.8 | 67.8 |
| 2015-01-01_00:26:15 | 87.1 | 67.8 |
| 2015-01-01_00:26:16 | 86.3 | 67.8 |
| 2015-01-01_00:26:17 | 87 | 67.8 |
| 2015-01-01_00:26:18 | 86.9 | 67.8 |
| 2015-01-01_00:26:19 | 86.9 | 67.8 |
| 2015-01-01_00:26:20 | 86.7 | 67.8 |
| 2015-01-01_00:26:21 | 87.1 | 67.8 |
| 2015-01-01_00:26:22 | 87 | 67.8 |
| 2015-01-01_00:26:23 | 87 | 67.8 |
| 2015-01-01_00:26:24 | 87.5 | 67.8 |
| 2015-01-01_00:26:25 | 87.3 | 67.7 |
| 2015-01-01_00:26:26 | 87 | 67.7 |
| 2015-01-01_00:26:27 | 87.4 | 67.7 |
| 2015-01-01_00:26:28 | 87.4 | 67.7 |
| 2015-01-01_00:26:29 | 86.4 | 67.7 |
| 2015-01-01_00:26:30 | 87.5 | 67.7 |
| 2015-01-01_00:26:31 | 87 | 67.7 |
| 2015-01-01_00:26:32 | 87.1 | 67.7 |
| 2015-01-01_00:26:33 | 87.2 | 67.7 |
| 2015-01-01_00:26:34 | 87.3 | 67.7 |
| 2015-01-01_00:26:35 | 87.4 | 67.7 |
| 2015-01-01_00:26:36 | 86.2 | 67.7 |
| 2015-01-01_00:26:37 | 87.3 | 67.7 |
| 2015-01-01_00:26:38 | 87.2 | 67.7 |
| 2015-01-01_00:26:39 | 86.3 | 67.7 |
| 2015-01-01_00:26:40 | 86.8 | 67.7 |
| 2015-01-01_00:26:41 | 86.2 | 67.7 |
| 2015-01-01_00:26:42 | 86.6 | 67.7 |
| 2015-01-01_00:26:43 | 86 | 67.7 |
| 2015-01-01_00:26:44 | 86.7 | 67.7 |
| 2015-01-01_00:26:45 | 86.9 | 67.7 |
| 2015-01-01_00:26:46 | 86.6 | 67.7 |
| 2015-01-01_00:26:47 | 86.6 | 67.7 |
| 2015-01-01_00:26:48 | 86.5 | 67.7 |
| 2015-01-01_00:26:49 | 86.9 | 67.8 |
| 2015-01-01_00:26:50 | 86.6 | 67.8 |
| 2015-01-01_00:26:51 | 86.9 | 67.8 |
| 2015-01-01_00:26:52 | 86.5 | 67.8 |
| 2015-01-01_00:26:53 | 87 | 67.8 |
| 2015-01-01_00:26:54 | 85.7 | 67.8 |
| 2015-01-01_00:26:55 | 86.8 | 67.8 |
| 2015-01-01_00:26:56 | 86.8 | 67.8 |
| 2015-01-01_00:26:57 | 86.7 | 67.8 |
| 2015-01-01_00:26:58 | 86.8 | 67.8 |
| 2015-01-01_00:26:59 | 85.9 | 67.8 |
| 2015-01-01_00:27:00 | 86.3 | 67.8 |
| 2015-01-01_00:27:01 | 86.8 | 67.8 |
| 2015-01-01_00:27:02 | 87 | 67.8 |
| 2015-01-01_00:27:03 | 86.8 | 67.8 |
| 2015-01-01_00:27:04 | 86.6 | 67.8 |
| 2015-01-01_00:27:05 | 86.4 | 67.9 |
| 2015-01-01_00:27:06 | 86.6 | 67.9 |
| 2015-01-01_00:27:07 | 86.8 | 67.9 |
| 2015-01-01_00:27:08 | 86.9 | 67.9 |
| 2015-01-01_00:27:09 | 87.2 | 67.9 |
| 2015-01-01_00:27:10 | 86.9 | 67.9 |
| 2015-01-01_00:27:11 | 87 | 67.9 |
| 2015-01-01_00:27:12 | 87 | 67.9 |
| 2015-01-01_00:27:13 | 87.2 | 67.8 |
| 2015-01-01_00:27:14 | 87.2 | 67.8 |
| 2015-01-01_00:27:15 | 87.2 | 67.8 |
| 2015-01-01_00:27:16 | 87.2 | 67.8 |
| 2015-01-01_00:27:17 | 87.5 | 67.8 |
| 2015-01-01_00:27:18 | 87.3 | 67.8 |
| 2015-01-01_00:27:19 | 86.2 | 67.8 |
| 2015-01-01_00:27:20 | 87.8 | 67.8 |
| 2015-01-01_00:27:21 | 87.1 | 67.8 |
| 2015-01-01_00:27:22 | 87.5 | 67.8 |
| 2015-01-01_00:27:23 | 87.9 | 67.8 |
| 2015-01-01_00:27:24 | 88 | 67.8 |
| 2015-01-01_00:27:25 | 88 | 67.8 |
| 2015-01-01_00:27:26 | 88.2 | 67.8 |
| 2015-01-01_00:27:27 | 88.1 | 67.8 |
| 2015-01-01_00:27:28 | 87.9 | 67.8 |
| 2015-01-01_00:27:29 | 87.8 | 67.8 |
| 2015-01-01_00:27:30 | 86.2 | 67.8 |
| 2015-01-01_00:27:31 | 86.8 | 67.8 |
| 2015-01-01_00:27:32 | 87 | 67.8 |
| 2015-01-01_00:27:33 | 86.1 | 67.8 |
| 2015-01-01_00:27:34 | 86.1 | 67.8 |
| 2015-01-01_00:27:35 | 85.6 | 67.8 |
| 2015-01-01_00:27:36 | 85.6 | 67.8 |
| 2015-01-01_00:27:37 | 85.6 | 67.7 |
| 2015-01-01_00:27:38 | 85.9 | 67.7 |
| 2015-01-01_00:27:39 | 85.9 | 67.7 |
| 2015-01-01_00:27:40 | 86 | 67.7 |
| 2015-01-01_00:27:41 | 85.8 | 67.7 |
| 2015-01-01_00:27:42 | 86.1 | 67.7 |
| 2015-01-01_00:27:43 | 86 | 67.7 |
| 2015-01-01_00:27:44 | 85.9 | 67.7 |
| 2015-01-01_00:27:45 | 85.8 | 67.8 |
| 2015-01-01_00:27:46 | 85.7 | 67.8 |
| 2015-01-01_00:27:47 | 85.7 | 67.8 |
| 2015-01-01_00:27:48 | 85.4 | 67.8 |
| 2015-01-01_00:27:49 | 85.4 | 67.8 |
| 2015-01-01_00:27:50 | 85.3 | 67.8 |
| 2015-01-01_00:27:51 | 85.2 | 67.8 |
| 2015-01-01_00:27:52 | 85.4 | 67.8 |
| 2015-01-01_00:27:53 | 85.3 | 67.8 |
| 2015-01-01_00:27:54 | 85 | 67.8 |
| 2015-01-01_00:27:55 | 84.8 | 67.8 |
| 2015-01-01_00:27:56 | 85 | 67.8 |
| 2015-01-01_00:27:57 | 84.6 | 67.8 |
| 2015-01-01_00:27:58 | 84.6 | 67.8 |
| 2015-01-01_00:27:59 | 85 | 67.8 |
| 2015-01-01_00:28:00 | 84.8 | 67.8 |
| 2015-01-01_00:28:01 | 84.7 | 67.9 |
| 2015-01-01_00:28:02 | 84.7 | 67.9 |
| 2015-01-01_00:28:03 | 84.5 | 67.9 |
| 2015-01-01_00:28:04 | 85 | 67.9 |
| 2015-01-01_00:28:05 | 84.4 | 67.9 |
| 2015-01-01_00:28:06 | 84.3 | 67.9 |
| 2015-01-01_00:28:07 | 84.2 | 67.9 |
| 2015-01-01_00:28:08 | 84 | 67.9 |
| 2015-01-01_00:28:09 | 84.2 | 68 |
| 2015-01-01_00:28:10 | 84 | 68 |
| 2015-01-01_00:28:11 | 84.1 | 68 |
| 2015-01-01_00:28:12 | 83.8 | 68 |
| 2015-01-01_00:28:13 | 83.9 | 68 |
| 2015-01-01_00:28:14 | 83.6 | 68 |
| 2015-01-01_00:28:15 | 83.6 | 68 |
| 2015-01-01_00:28:16 | 83.5 | 68 |
| 2015-01-01_00:28:17 | 82.5 | 68.2 |
| 2015-01-01_00:28:18 | 83.6 | 68.2 |
| 2015-01-01_00:28:19 | 83.5 | 68.2 |
| 2015-01-01_00:28:20 | 83.4 | 68.2 |
| 2015-01-01_00:28:21 | 83.7 | 68.2 |
| 2015-01-01_00:28:22 | 83.5 | 68.2 |
| 2015-01-01_00:28:23 | 82.6 | 68.2 |
| 2015-01-01_00:28:24 | 82.5 | 68.2 |
| 2015-01-01_00:28:25 | 83.7 | 68.8 |
| 2015-01-01_00:28:26 | 82.8 | 68.8 |
| 2015-01-01_00:28:27 | 83.3 | 68.8 |
| 2015-01-01_00:28:28 | 83.4 | 68.8 |
| 2015-01-01_00:28:29 | 83.5 | 68.8 |
| 2015-01-01_00:28:30 | 83.5 | 68.8 |
| 2015-01-01_00:28:31 | 83.7 | 68.8 |
| 2015-01-01_00:28:32 | 83.6 | 68.8 |
| 2015-01-01_00:28:33 | 83.7 | 69.5 |
| 2015-01-01_00:28:34 | 83.4 | 69.5 |
| 2015-01-01_00:28:35 | 84.2 | 69.5 |
| 2015-01-01_00:28:36 | 84.2 | 69.5 |
| 2015-01-01_00:28:37 | 84.5 | 69.5 |
| 2015-01-01_00:28:38 | 84.8 | 69.5 |
| 2015-01-01_00:28:39 | 85 | 69.5 |
| 2015-01-01_00:28:40 | 84.3 | 69.5 |
| 2015-01-01_00:28:41 | 84.9 | 69.5 |
| 2015-01-01_00:28:42 | 85.2 | 69.5 |
| 2015-01-01_00:28:43 | 85.4 | 69.5 |
| 2015-01-01_00:28:44 | 85.4 | 69.5 |
| 2015-01-01_00:28:45 | 85.3 | 69.5 |
| 2015-01-01_00:28:46 | 85.8 | 69.5 |
| 2015-01-01_00:28:47 | 85.1 | 69.5 |
| 2015-01-01_00:28:48 | 86.2 | 69.5 |
| 2015-01-01_00:28:49 | 86.3 | 70.2 |
| 2015-01-01_00:28:50 | 86.2 | 70.2 |
| 2015-01-01_00:28:51 | 86.4 | 70.2 |
| 2015-01-01_00:28:52 | 87.1 | 70.2 |
| 2015-01-01_00:28:53 | 86.9 | 70.2 |
| 2015-01-01_00:28:54 | 86.8 | 70.2 |
| 2015-01-01_00:28:55 | 87.5 | 70.2 |
| 2015-01-01_00:28:56 | 87.7 | 70.2 |
| 2015-01-01_00:28:57 | 87.8 | 70.1 |
| 2015-01-01_00:28:58 | 87.9 | 70.1 |
| 2015-01-01_00:28:59 | 87.9 | 70.1 |
| 2015-01-01_00:29:00 | 88.2 | 70.1 |
| 2015-01-01_00:29:01 | 87.3 | 70.1 |
| 2015-01-01_00:29:02 | 88.6 | 70.1 |
| 2015-01-01_00:29:03 | 88.1 | 70.1 |
| 2015-01-01_00:29:04 | 88.6 | 70.1 |
| 2015-01-01_00:29:05 | 89 | 70.1 |
| 2015-01-01_00:29:06 | 89.1 | 70.1 |
| 2015-01-01_00:29:07 | 89.1 | 70.1 |
| 2015-01-01_00:29:08 | 89.1 | 70.1 |
| 2015-01-01_00:29:09 | 89.4 | 70.1 |
| 2015-01-01_00:29:10 | 89.4 | 70.1 |
| 2015-01-01_00:29:11 | 89.4 | 70.1 |
| 2015-01-01_00:29:12 | 89.7 | 70.1 |
| 2015-01-01_00:29:13 | 88.6 | 70 |
| 2015-01-01_00:29:14 | 87.4 | 70 |
| 2015-01-01_00:29:15 | 88.9 | 70 |
| 2015-01-01_00:29:16 | 88.1 | 70 |
| 2015-01-01_00:29:17 | 88 | 70 |
| 2015-01-01_00:29:18 | 87.3 | 70 |
| 2015-01-01_00:29:19 | 86.7 | 70 |
| 2015-01-01_00:29:20 | 86.5 | 70 |
| 2015-01-01_00:29:21 | 86.2 | 69.8 |
| 2015-01-01_00:29:22 | 86.1 | 69.8 |
| 2015-01-01_00:29:23 | 85.7 | 69.8 |
| 2015-01-01_00:29:24 | 84.7 | 69.8 |
| 2015-01-01_00:29:25 | 85.6 | 69.8 |
| 2015-01-01_00:29:26 | 85.4 | 69.8 |
| 2015-01-01_00:29:27 | 85.9 | 69.8 |
| 2015-01-01_00:29:28 | 85.9 | 69.8 |
| 2015-01-01_00:29:29 | 86 | 70 |
| 2015-01-01_00:29:30 | 86.3 | 70 |
| 2015-01-01_00:29:31 | 86.2 | 70 |
| 2015-01-01_00:29:32 | 86 | 70 |
| 2015-01-01_00:29:33 | 85.9 | 70 |
| 2015-01-01_00:29:34 | 86 | 70 |
| 2015-01-01_00:29:35 | 86.3 | 70 |
| 2015-01-01_00:29:36 | 86.2 | 70 |
| 2015-01-01_00:29:37 | 85.8 | 70.3 |
| 2015-01-01_00:29:38 | 85.6 | 70.3 |
| 2015-01-01_00:29:39 | 86 | 70.3 |
| 2015-01-01_00:29:40 | 86 | 70.3 |
| 2015-01-01_00:29:41 | 85.9 | 70.3 |
| 2015-01-01_00:29:42 | 85.9 | 70.3 |
| 2015-01-01_00:29:43 | 85.8 | 70.3 |
| 2015-01-01_00:29:44 | 86 | 70.3 |
| 2015-01-01_00:29:45 | 86.3 | 70.7 |
| 2015-01-01_00:29:46 | 86.2 | 70.7 |
| 2015-01-01_00:29:47 | 86.3 | 70.7 |
| 2015-01-01_00:29:48 | 85.6 | 70.7 |
| 2015-01-01_00:29:49 | 86 | 70.7 |
| 2015-01-01_00:29:50 | 85.8 | 70.7 |
| 2015-01-01_00:29:51 | 86.7 | 70.7 |
| 2015-01-01_00:29:52 | 86.4 | 70.7 |
| 2015-01-01_00:29:53 | 86 | 71 |
| 2015-01-01_00:29:54 | 86.7 | 71 |
| 2015-01-01_00:29:55 | 86.7 | 71 |
| 2015-01-01_00:29:56 | 86.7 | 71 |
| 2015-01-01_00:29:57 | 86.8 | 71 |
| 2015-01-01_00:29:58 | 86.9 | 71 |
| 2015-01-01_00:29:59 | 87 | 71 |
| 2015-01-01_00:30:00 | 87.5 | 71 |
| 2015-01-01_00:30:01 | 87.1 | 71.1 |
| 2015-01-01_00:30:02 | 86.8 | 71.1 |
| 2015-01-01_00:30:03 | 87 | 71.1 |
| 2015-01-01_00:30:04 | 87 | 71.1 |
| 2015-01-01_00:30:05 | 87.2 | 71.1 |
| 2015-01-01_00:30:06 | 87.3 | 71.1 |
| 2015-01-01_00:30:07 | 87.1 | 71.1 |
| 2015-01-01_00:30:08 | 86.9 | 71.1 |
| 2015-01-01_00:30:09 | 86.2 | 71.3 |
| 2015-01-01_00:30:10 | 87 | 71.3 |
| 2015-01-01_00:30:11 | 86.6 | 71.3 |
| 2015-01-01_00:30:12 | 86.7 | 71.3 |
| 2015-01-01_00:30:13 | 87 | 71.3 |
| 2015-01-01_00:30:14 | 86.8 | 71.3 |
| 2015-01-01_00:30:15 | 87.4 | 71.3 |
| 2015-01-01_00:30:16 | 86.9 | 71.3 |
| 2015-01-01_00:30:17 | 87.5 | 71.5 |
| 2015-01-01_00:30:18 | 87.8 | 71.5 |
| 2015-01-01_00:30:19 | 87.9 | 71.5 |
| 2015-01-01_00:30:20 | 87.3 | 71.5 |
| 2015-01-01_00:30:21 | 88 | 71.5 |
| 2015-01-01_00:30:22 | 87.3 | 71.5 |
| 2015-01-01_00:30:23 | 88.2 | 71.5 |
| 2015-01-01_00:30:24 | 87.8 | 71.5 |
| 2015-01-01_00:30:25 | 88.7 | 71.5 |
| 2015-01-01_00:30:26 | 88.9 | 71.5 |
| 2015-01-01_00:30:27 | 89.5 | 71.5 |
| 2015-01-01_00:30:28 | 89.4 | 71.5 |
| 2015-01-01_00:30:29 | 88.9 | 71.5 |
| 2015-01-01_00:30:30 | 88.8 | 71.5 |
| 2015-01-01_00:30:31 | 89.7 | 71.5 |
| 2015-01-01_00:30:32 | 89.8 | 71.5 |
| 2015-01-01_00:30:33 | 89.1 | 71.4 |
| 2015-01-01_00:30:34 | 89 | 71.4 |
| 2015-01-01_00:30:35 | 88.6 | 71.4 |
| 2015-01-01_00:30:36 | 88.4 | 71.4 |
| 2015-01-01_00:30:37 | 87.3 | 71.4 |
| 2015-01-01_00:30:38 | 86.7 | 71.4 |
| 2015-01-01_00:30:39 | 86.4 | 71.4 |
| 2015-01-01_00:30:40 | 85.7 | 71.4 |
| 2015-01-01_00:30:41 | 85.4 | 70.9 |
| 2015-01-01_00:30:42 | 85.8 | 70.9 |
| 2015-01-01_00:30:43 | 85.2 | 70.9 |
| 2015-01-01_00:30:44 | 85.6 | 70.9 |
| 2015-01-01_00:30:45 | 86.1 | 70.9 |
| 2015-01-01_00:30:46 | 86.2 | 70.9 |
| 2015-01-01_00:30:47 | 85.2 | 70.9 |
| 2015-01-01_00:30:48 | 86.2 | 70.9 |
| 2015-01-01_00:30:49 | 86.5 | 70.6 |
| 2015-01-01_00:30:50 | 86.5 | 70.6 |
| 2015-01-01_00:30:51 | 86.9 | 70.6 |
| 2015-01-01_00:30:52 | 86.5 | 70.6 |
| 2015-01-01_00:30:53 | 86.9 | 70.6 |
| 2015-01-01_00:30:54 | 86.5 | 70.6 |
| 2015-01-01_00:30:55 | 86.5 | 70.6 |
| 2015-01-01_00:30:56 | 86.7 | 70.6 |
| 2015-01-01_00:30:57 | 86.1 | 70.5 |
| 2015-01-01_00:30:58 | 86.7 | 70.5 |
| 2015-01-01_00:30:59 | 85.3 | 70.5 |
| 2015-01-01_00:31:00 | 86 | 70.5 |
| 2015-01-01_00:31:01 | 86.5 | 70.5 |
| 2015-01-01_00:31:02 | 85.8 | 70.5 |
| 2015-01-01_00:31:03 | 87 | 70.5 |
| 2015-01-01_00:31:04 | 86.6 | 70.5 |
| 2015-01-01_00:31:05 | 86.9 | 70.5 |
| 2015-01-01_00:31:06 | 87.3 | 70.5 |
| 2015-01-01_00:31:07 | 87.6 | 70.5 |
| 2015-01-01_00:31:08 | 87.8 | 70.5 |
| 2015-01-01_00:31:09 | 88 | 70.5 |
| 2015-01-01_00:31:10 | 88.5 | 70.5 |
| 2015-01-01_00:31:11 | 88.1 | 70.5 |
| 2015-01-01_00:31:12 | 88.6 | 70.5 |
| 2015-01-01_00:31:13 | 88.6 | 70.5 |
| 2015-01-01_00:31:14 | 88.8 | 70.5 |
| 2015-01-01_00:31:15 | 88.6 | 70.5 |
| 2015-01-01_00:31:16 | 88.4 | 70.5 |
| 2015-01-01_00:31:17 | 89 | 70.5 |
| 2015-01-01_00:31:18 | 88.6 | 70.5 |
| 2015-01-01_00:31:19 | 88.5 | 70.5 |
| 2015-01-01_00:31:20 | 88.7 | 70.5 |
| 2015-01-01_00:31:21 | 88 | 70.7 |
| 2015-01-01_00:31:22 | 87.6 | 70.7 |
| 2015-01-01_00:31:23 | 87.3 | 70.7 |
| 2015-01-01_00:31:24 | 87 | 70.7 |
| 2015-01-01_00:31:25 | 86.2 | 70.7 |
| 2015-01-01_00:31:26 | 85.9 | 70.7 |
| 2015-01-01_00:31:27 | 85.9 | 70.7 |
| 2015-01-01_00:31:28 | 86.2 | 70.7 |
| 2015-01-01_00:31:29 | 86.1 | 70.6 |
| 2015-01-01_00:31:30 | 85.2 | 70.6 |
| 2015-01-01_00:31:31 | 85.8 | 70.6 |
| 2015-01-01_00:31:32 | 86.2 | 70.6 |
| 2015-01-01_00:31:33 | 85.1 | 70.6 |
| 2015-01-01_00:31:34 | 85.7 | 70.6 |
| 2015-01-01_00:31:35 | 86.5 | 70.6 |
| 2015-01-01_00:31:36 | 86.2 | 70.6 |
| 2015-01-01_00:31:37 | 85.7 | 70.6 |
| 2015-01-01_00:31:38 | 86.9 | 70.6 |
| 2015-01-01_00:31:39 | 86.9 | 70.6 |
| 2015-01-01_00:31:40 | 86.2 | 70.6 |
| 2015-01-01_00:31:41 | 86.7 | 70.6 |
| 2015-01-01_00:31:42 | 86.8 | 70.6 |
| 2015-01-01_00:31:43 | 86.6 | 70.6 |
| 2015-01-01_00:31:44 | 86.7 | 70.6 |
| 2015-01-01_00:31:45 | 86.2 | 70.5 |
| 2015-01-01_00:31:46 | 87 | 70.5 |
| 2015-01-01_00:31:47 | 86.7 | 70.5 |
| 2015-01-01_00:31:48 | 87.5 | 70.5 |
| 2015-01-01_00:31:49 | 87.3 | 70.5 |
| 2015-01-01_00:31:50 | 87.8 | 70.5 |
| 2015-01-01_00:31:51 | 87.5 | 70.5 |
| 2015-01-01_00:31:52 | 88 | 70.5 |
| 2015-01-01_00:31:53 | 88.1 | 70.5 |
| 2015-01-01_00:31:54 | 87.6 | 70.5 |
| 2015-01-01_00:31:55 | 86.9 | 70.5 |
| 2015-01-01_00:31:56 | 86.9 | 70.5 |
| 2015-01-01_00:31:57 | 88.3 | 70.5 |
| 2015-01-01_00:31:58 | 87.5 | 70.5 |
| 2015-01-01_00:31:59 | 87.8 | 70.5 |
| 2015-01-01_00:32:00 | 87.2 | 70.5 |
| 2015-01-01_00:32:01 | 86.9 | 70.3 |
| 2015-01-01_00:32:02 | 87 | 70.3 |
| 2015-01-01_00:32:03 | 86.6 | 70.3 |
| 2015-01-01_00:32:04 | 86.4 | 70.3 |
| 2015-01-01_00:32:05 | 86.2 | 70.3 |
| 2015-01-01_00:32:06 | 86 | 70.3 |
| 2015-01-01_00:32:07 | 84.8 | 70.3 |
| 2015-01-01_00:32:08 | 85.3 | 70.3 |
| 2015-01-01_00:32:09 | 85.6 | 70.1 |
| 2015-01-01_00:32:10 | 85.8 | 70.1 |
| 2015-01-01_00:32:11 | 85.4 | 70.1 |
| 2015-01-01_00:32:12 | 86 | 70.1 |
| 2015-01-01_00:32:13 | 85.7 | 70.1 |
| 2015-01-01_00:32:14 | 86.1 | 70.1 |
| 2015-01-01_00:32:15 | 85.9 | 70.1 |
| 2015-01-01_00:32:16 | 86.2 | 70.1 |
| 2015-01-01_00:32:17 | 85.2 | 70.1 |
| 2015-01-01_00:32:18 | 86.3 | 70.1 |
| 2015-01-01_00:32:19 | 85.8 | 70.1 |
| 2015-01-01_00:32:20 | 86.3 | 70.1 |
| 2015-01-01_00:32:21 | 85.8 | 70.1 |
| 2015-01-01_00:32:22 | 86.4 | 70.1 |
| 2015-01-01_00:32:23 | 86.3 | 70.1 |
| 2015-01-01_00:32:24 | 86.8 | 70.1 |
| 2015-01-01_00:32:25 | 86.8 | 70 |
| 2015-01-01_00:32:26 | 86.2 | 70 |
| 2015-01-01_00:32:27 | 86.7 | 70 |
| 2015-01-01_00:32:28 | 87.2 | 70 |
| 2015-01-01_00:32:29 | 86.8 | 70 |
| 2015-01-01_00:32:30 | 86.6 | 70 |
| 2015-01-01_00:32:31 | 87.4 | 70 |
| 2015-01-01_00:32:32 | 87.5 | 70 |
| 2015-01-01_00:32:33 | 87.3 | 69.8 |
| 2015-01-01_00:32:34 | 87.6 | 69.8 |
| 2015-01-01_00:32:35 | 87.1 | 69.8 |
| 2015-01-01_00:32:36 | 87.3 | 69.8 |
| 2015-01-01_00:32:37 | 87.6 | 69.8 |
| 2015-01-01_00:32:38 | 88.4 | 69.8 |
| 2015-01-01_00:32:39 | 88.1 | 69.8 |
| 2015-01-01_00:32:40 | 88 | 69.8 |
| 2015-01-01_00:32:41 | 87.9 | 69.7 |
| 2015-01-01_00:32:42 | 87 | 69.7 |
| 2015-01-01_00:32:43 | 88.1 | 69.7 |
| 2015-01-01_00:32:44 | 86.7 | 69.7 |
| 2015-01-01_00:32:45 | 87.5 | 69.7 |
| 2015-01-01_00:32:46 | 87.3 | 69.7 |
| 2015-01-01_00:32:47 | 86.5 | 69.7 |
| 2015-01-01_00:32:48 | 86.8 | 69.7 |
| 2015-01-01_00:32:49 | 86.3 | 69.5 |
| 2015-01-01_00:32:50 | 86.6 | 69.5 |
| 2015-01-01_00:32:51 | 86.2 | 69.5 |
| 2015-01-01_00:32:52 | 86.1 | 69.5 |
| 2015-01-01_00:32:53 | 85.7 | 69.5 |
| 2015-01-01_00:32:54 | 85.6 | 69.5 |
| 2015-01-01_00:32:55 | 85.7 | 69.5 |
| 2015-01-01_00:32:56 | 84.7 | 69.5 |
| 2015-01-01_00:32:57 | 86.2 | 69.4 |
| 2015-01-01_00:32:58 | 86.1 | 69.4 |
| 2015-01-01_00:32:59 | 85.6 | 69.4 |
| 2015-01-01_00:33:00 | 86 | 69.4 |
| 2015-01-01_00:33:01 | 85.9 | 69.4 |
| 2015-01-01_00:33:02 | 85.6 | 69.4 |
| 2015-01-01_00:33:03 | 86.3 | 69.4 |
| 2015-01-01_00:33:04 | 86.3 | 69.4 |
| 2015-01-01_00:33:05 | 86.1 | 69.3 |
| 2015-01-01_00:33:06 | 85.9 | 69.3 |
| 2015-01-01_00:33:07 | 86 | 69.3 |
| 2015-01-01_00:33:08 | 86.2 | 69.3 |
| 2015-01-01_00:33:09 | 85.5 | 69.3 |
| 2015-01-01_00:33:10 | 86.1 | 69.3 |
| 2015-01-01_00:33:11 | 85.8 | 69.3 |
| 2015-01-01_00:33:12 | 86 | 69.3 |
| 2015-01-01_00:33:13 | 86 | 69.3 |
| 2015-01-01_00:33:14 | 86.1 | 69.3 |
| 2015-01-01_00:33:15 | 85.6 | 69.3 |
| 2015-01-01_00:33:16 | 86 | 69.3 |
| 2015-01-01_00:33:17 | 86.2 | 69.3 |
| 2015-01-01_00:33:18 | 86.1 | 69.3 |
| 2015-01-01_00:33:19 | 85.7 | 69.3 |
| 2015-01-01_00:33:20 | 86.2 | 69.3 |
| 2015-01-01_00:33:21 | 85.5 | 69.1 |
| 2015-01-01_00:33:22 | 86.1 | 69.1 |
| 2015-01-01_00:33:23 | 85.7 | 69.1 |
| 2015-01-01_00:33:24 | 86 | 69.1 |
| 2015-01-01_00:33:25 | 86.2 | 69.1 |
| 2015-01-01_00:33:26 | 85.9 | 69.1 |
| 2015-01-01_00:33:27 | 85.9 | 69.1 |
| 2015-01-01_00:33:28 | 85.5 | 69.1 |
| 2015-01-01_00:33:29 | 85.7 | 68.9 |
| 2015-01-01_00:33:30 | 85.9 | 68.9 |
| 2015-01-01_00:33:31 | 85.8 | 68.9 |
| 2015-01-01_00:33:32 | 85.1 | 68.9 |
| 2015-01-01_00:33:33 | 86.3 | 68.9 |
| 2015-01-01_00:33:34 | 85.7 | 68.9 |
| 2015-01-01_00:33:35 | 86 | 68.9 |
| 2015-01-01_00:33:36 | 85.4 | 68.9 |
| 2015-01-01_00:33:37 | 85.9 | 68.7 |
| 2015-01-01_00:33:38 | 85 | 68.7 |
| 2015-01-01_00:33:39 | 86.2 | 68.7 |
| 2015-01-01_00:33:40 | 86.3 | 68.7 |
| 2015-01-01_00:33:41 | 85.2 | 68.7 |
| 2015-01-01_00:33:42 | 86.4 | 68.7 |
| 2015-01-01_00:33:43 | 86.2 | 68.7 |
| 2015-01-01_00:33:44 | 85.7 | 68.7 |
| 2015-01-01_00:33:45 | 86.2 | 68.5 |
| 2015-01-01_00:33:46 | 86.5 | 68.5 |
| 2015-01-01_00:33:47 | 86.4 | 68.5 |
| 2015-01-01_00:33:48 | 86.6 | 68.5 |
| 2015-01-01_00:33:49 | 86.8 | 68.5 |
| 2015-01-01_00:33:50 | 86.6 | 68.5 |
| 2015-01-01_00:33:51 | 86.9 | 68.5 |
| 2015-01-01_00:33:52 | 85.9 | 68.5 |
| 2015-01-01_00:33:53 | 86.9 | 68.4 |
| 2015-01-01_00:33:54 | 86.7 | 68.4 |
| 2015-01-01_00:33:55 | 86.2 | 68.4 |
| 2015-01-01_00:33:56 | 86.6 | 68.4 |
| 2015-01-01_00:33:57 | 87.1 | 68.4 |
| 2015-01-01_00:33:58 | 86.7 | 68.4 |
| 2015-01-01_00:33:59 | 86.5 | 68.4 |
| 2015-01-01_00:34:00 | 87.2 | 68.4 |
| 2015-01-01_00:34:01 | 87.3 | 68.3 |
| 2015-01-01_00:34:02 | 86.9 | 68.3 |
| 2015-01-01_00:34:03 | 86.9 | 68.3 |
| 2015-01-01_00:34:04 | 87.2 | 68.3 |
| 2015-01-01_00:34:05 | 87.4 | 68.3 |
| 2015-01-01_00:34:06 | 87.6 | 68.3 |
| 2015-01-01_00:34:07 | 87.7 | 68.3 |
| 2015-01-01_00:34:08 | 87.8 | 68.3 |
| 2015-01-01_00:34:09 | 87.5 | 68.2 |
| 2015-01-01_00:34:10 | 87.7 | 68.2 |
| 2015-01-01_00:34:11 | 87.3 | 68.2 |
| 2015-01-01_00:34:12 | 86.5 | 68.2 |
| 2015-01-01_00:34:13 | 87.4 | 68.2 |
| 2015-01-01_00:34:14 | 87.6 | 68.2 |
| 2015-01-01_00:34:15 | 86.8 | 68.2 |
| 2015-01-01_00:34:16 | 87.1 | 68.2 |
| 2015-01-01_00:34:17 | 87.2 | 68.2 |
| 2015-01-01_00:34:18 | 87.4 | 68.2 |
| 2015-01-01_00:34:19 | 86.9 | 68.2 |
| 2015-01-01_00:34:20 | 87.4 | 68.2 |
| 2015-01-01_00:34:21 | 87.3 | 68.2 |
| 2015-01-01_00:34:22 | 87.3 | 68.2 |
| 2015-01-01_00:34:23 | 87.3 | 68.2 |
| 2015-01-01_00:34:24 | 87 | 68.2 |
| 2015-01-01_00:34:25 | 87.1 | 68.4 |
| 2015-01-01_00:34:26 | 87.1 | 68.4 |
| 2015-01-01_00:34:27 | 87.2 | 68.4 |
| 2015-01-01_00:34:28 | 86.7 | 68.4 |
| 2015-01-01_00:34:29 | 86.7 | 68.4 |
| 2015-01-01_00:34:30 | 86.8 | 68.4 |
| 2015-01-01_00:34:31 | 86.5 | 68.4 |
| 2015-01-01_00:34:32 | 86.5 | 68.4 |
| 2015-01-01_00:34:33 | 86.5 | 68.4 |
| 2015-01-01_00:34:34 | 85.5 | 68.4 |
| 2015-01-01_00:34:35 | 86.1 | 68.4 |
| 2015-01-01_00:34:36 | 85.6 | 68.4 |
| 2015-01-01_00:34:37 | 86 | 68.4 |
| 2015-01-01_00:34:38 | 85.9 | 68.4 |
| 2015-01-01_00:34:39 | 86.1 | 68.4 |
| 2015-01-01_00:34:40 | 86.2 | 68.4 |
| 2015-01-01_00:34:41 | 85.6 | 68.4 |
| 2015-01-01_00:34:42 | 85.9 | 68.4 |
| 2015-01-01_00:34:43 | 84.7 | 68.4 |
| 2015-01-01_00:34:44 | 85.3 | 68.4 |
| 2015-01-01_00:34:45 | 86.1 | 68.4 |
| 2015-01-01_00:34:46 | 86 | 68.4 |
| 2015-01-01_00:34:47 | 86.4 | 68.4 |
| 2015-01-01_00:34:48 | 86.3 | 68.4 |
| 2015-01-01_00:34:49 | 86.1 | 68.5 |
| 2015-01-01_00:34:50 | 86.7 | 68.5 |
| 2015-01-01_00:34:51 | 86.2 | 68.5 |
| 2015-01-01_00:34:52 | 86.8 | 68.5 |
| 2015-01-01_00:34:53 | 86.2 | 68.5 |
| 2015-01-01_00:34:54 | 86.1 | 68.5 |
| 2015-01-01_00:34:55 | 85.9 | 68.5 |
| 2015-01-01_00:34:56 | 85 | 68.5 |
| 2015-01-01_00:34:57 | 85.1 | 68.4 |
| 2015-01-01_00:34:58 | 85.2 | 68.4 |
| 2015-01-01_00:34:59 | 86 | 68.4 |
| 2015-01-01_00:35:00 | 85.2 | 68.4 |
| 2015-01-01_00:35:01 | 84.8 | 68.4 |
| 2015-01-01_00:35:02 | 85.9 | 68.4 |
| 2015-01-01_00:35:03 | 84.7 | 68.4 |
| 2015-01-01_00:35:04 | 85.6 | 68.4 |
| 2015-01-01_00:35:05 | 86.1 | 68.4 |
| 2015-01-01_00:35:06 | 86.4 | 68.4 |
| 2015-01-01_00:35:07 | 86.1 | 68.4 |
| 2015-01-01_00:35:08 | 86.3 | 68.4 |
| 2015-01-01_00:35:09 | 86.3 | 68.4 |
| 2015-01-01_00:35:10 | 86.8 | 68.4 |
| 2015-01-01_00:35:11 | 86.6 | 68.4 |
| 2015-01-01_00:35:12 | 87 | 68.4 |
| 2015-01-01_00:35:13 | 86.7 | 68.4 |
| 2015-01-01_00:35:14 | 85.9 | 68.4 |
| 2015-01-01_00:35:15 | 86.5 | 68.4 |
| 2015-01-01_00:35:16 | 85.6 | 68.4 |
| 2015-01-01_00:35:17 | 86.9 | 68.4 |
| 2015-01-01_00:35:18 | 86.7 | 68.4 |
| 2015-01-01_00:35:19 | 87.1 | 68.4 |
| 2015-01-01_00:35:20 | 87.1 | 68.4 |
| 2015-01-01_00:35:21 | 87 | 68.4 |
| 2015-01-01_00:35:22 | 86.1 | 68.4 |
| 2015-01-01_00:35:23 | 87.2 | 68.4 |
| 2015-01-01_00:35:24 | 87.2 | 68.4 |
| 2015-01-01_00:35:25 | 87.3 | 68.4 |
| 2015-01-01_00:35:26 | 87.3 | 68.4 |
| 2015-01-01_00:35:27 | 87.3 | 68.4 |
| 2015-01-01_00:35:28 | 87.1 | 68.4 |
| 2015-01-01_00:35:29 | 86.9 | 68.3 |
| 2015-01-01_00:35:30 | 87.2 | 68.3 |
| 2015-01-01_00:35:31 | 87.2 | 68.3 |
| 2015-01-01_00:35:32 | 86.8 | 68.3 |
| 2015-01-01_00:35:33 | 86.7 | 68.3 |
| 2015-01-01_00:35:34 | 87 | 68.3 |
| 2015-01-01_00:35:35 | 86.9 | 68.3 |
| 2015-01-01_00:35:36 | 87 | 68.3 |
| 2015-01-01_00:35:37 | 87 | 68.5 |
| 2015-01-01_00:35:38 | 86.9 | 68.5 |
| 2015-01-01_00:35:39 | 86.9 | 68.5 |
| 2015-01-01_00:35:40 | 86.4 | 68.5 |
| 2015-01-01_00:35:41 | 87 | 68.5 |
| 2015-01-01_00:35:42 | 87.3 | 68.5 |
| 2015-01-01_00:35:43 | 87.6 | 68.5 |
| 2015-01-01_00:35:44 | 87.5 | 68.5 |
| 2015-01-01_00:35:45 | 87.1 | 68.5 |
| 2015-01-01_00:35:46 | 86.6 | 68.5 |
| 2015-01-01_00:35:47 | 87.1 | 68.5 |
| 2015-01-01_00:35:48 | 87.4 | 68.5 |
| 2015-01-01_00:35:49 | 87.4 | 68.5 |
| 2015-01-01_00:35:50 | 88.9 | 68.5 |
| 2015-01-01_00:35:51 | 88.1 | 68.5 |
| 2015-01-01_00:35:52 | 88.9 | 68.5 |
| 2015-01-01_00:35:53 | 88.5 | 69.3 |
| 2015-01-01_00:35:54 | 89.3 | 69.3 |
| 2015-01-01_00:35:55 | 89.2 | 69.3 |
| 2015-01-01_00:35:56 | 89.4 | 69.3 |
| 2015-01-01_00:35:57 | 89.5 | 69.3 |
| 2015-01-01_00:35:58 | 88.9 | 69.3 |
| 2015-01-01_00:35:59 | 88.4 | 69.3 |
| 2015-01-01_00:36:00 | 87.4 | 69.3 |
| 2015-01-01_00:36:01 | 87.6 | 69.3 |
| 2015-01-01_00:36:02 | 86.7 | 69.3 |
| 2015-01-01_00:36:03 | 85.5 | 69.3 |
| 2015-01-01_00:36:04 | 85 | 69.3 |
| 2015-01-01_00:36:05 | 85.8 | 69.3 |
| 2015-01-01_00:36:06 | 85.3 | 69.3 |
| 2015-01-01_00:36:07 | 86.3 | 69.3 |
| 2015-01-01_00:36:08 | 86 | 69.3 |
| 2015-01-01_00:36:09 | 85.9 | 69.3 |
| 2015-01-01_00:36:10 | 86 | 69.3 |
| 2015-01-01_00:36:11 | 86.1 | 69.3 |
| 2015-01-01_00:36:12 | 86.1 | 69.3 |
| 2015-01-01_00:36:13 | 86.6 | 69.3 |
| 2015-01-01_00:36:14 | 86.4 | 69.3 |
| 2015-01-01_00:36:15 | 86.9 | 69.3 |
| 2015-01-01_00:36:16 | 86.1 | 69.3 |
| 2015-01-01_00:36:17 | 86.8 | 69.5 |
| 2015-01-01_00:36:18 | 87.3 | 69.5 |
| 2015-01-01_00:36:19 | 87 | 69.5 |
| 2015-01-01_00:36:20 | 87.4 | 69.5 |
| 2015-01-01_00:36:21 | 86.6 | 69.5 |
| 2015-01-01_00:36:22 | 86.4 | 69.5 |
| 2015-01-01_00:36:23 | 87.3 | 69.5 |
| 2015-01-01_00:36:24 | 87.2 | 69.5 |
| 2015-01-01_00:36:25 | 87.8 | 69.6 |
| 2015-01-01_00:36:26 | 87 | 69.6 |
| 2015-01-01_00:36:27 | 88 | 69.6 |
| 2015-01-01_00:36:28 | 87.6 | 69.6 |
| 2015-01-01_00:36:29 | 88.1 | 69.6 |
| 2015-01-01_00:36:30 | 88 | 69.6 |
| 2015-01-01_00:36:31 | 88 | 69.6 |
| 2015-01-01_00:36:32 | 87.1 | 69.6 |
| 2015-01-01_00:36:33 | 88 | 69.6 |
| 2015-01-01_00:36:34 | 88.3 | 69.6 |
| 2015-01-01_00:36:35 | 87.9 | 69.6 |
| 2015-01-01_00:36:36 | 88.1 | 69.6 |
| 2015-01-01_00:36:37 | 87.6 | 69.6 |
| 2015-01-01_00:36:38 | 88 | 69.6 |
| 2015-01-01_00:36:39 | 86.8 | 69.6 |
| 2015-01-01_00:36:40 | 87.4 | 69.6 |
| 2015-01-01_00:36:41 | 87.1 | 69.6 |
| 2015-01-01_00:36:42 | 87.2 | 69.6 |
| 2015-01-01_00:36:43 | 87.1 | 69.6 |
| 2015-01-01_00:36:44 | 86.7 | 69.6 |
| 2015-01-01_00:36:45 | 86.9 | 69.6 |
| 2015-01-01_00:36:46 | 86.7 | 69.6 |
| 2015-01-01_00:36:47 | 85.8 | 69.6 |
| 2015-01-01_00:36:48 | 85.4 | 69.6 |
| 2015-01-01_00:36:49 | 86.8 | 69.6 |
| 2015-01-01_00:36:50 | 86.3 | 69.6 |
| 2015-01-01_00:36:51 | 86.6 | 69.6 |
| 2015-01-01_00:36:52 | 86.4 | 69.6 |
| 2015-01-01_00:36:53 | 86.5 | 69.6 |
| 2015-01-01_00:36:54 | 87.2 | 69.6 |
| 2015-01-01_00:36:55 | 86.2 | 69.6 |
| 2015-01-01_00:36:56 | 86.9 | 69.6 |
| 2015-01-01_00:36:57 | 87.2 | 69.6 |
| 2015-01-01_00:36:58 | 86.4 | 69.6 |
| 2015-01-01_00:36:59 | 87.2 | 69.6 |
| 2015-01-01_00:37:00 | 87.5 | 69.6 |
| 2015-01-01_00:37:01 | 87.3 | 69.6 |
| 2015-01-01_00:37:02 | 86.1 | 69.6 |
| 2015-01-01_00:37:03 | 87.4 | 69.6 |
| 2015-01-01_00:37:04 | 87.7 | 69.6 |
| 2015-01-01_00:37:05 | 87.3 | 69.6 |
| 2015-01-01_00:37:06 | 87.2 | 69.6 |
| 2015-01-01_00:37:07 | 87.3 | 69.6 |
| 2015-01-01_00:37:08 | 87.8 | 69.6 |
| 2015-01-01_00:37:09 | 87.4 | 69.6 |
| 2015-01-01_00:37:10 | 87.3 | 69.6 |
| 2015-01-01_00:37:11 | 87.7 | 69.6 |
| 2015-01-01_00:37:12 | 88.2 | 69.6 |
| 2015-01-01_00:37:13 | 87.8 | 69.2 |
| 2015-01-01_00:37:14 | 87.3 | 69.2 |
| 2015-01-01_00:37:15 | 87.4 | 69.2 |
| 2015-01-01_00:37:16 | 87.7 | 69.2 |
| 2015-01-01_00:37:17 | 87 | 69.2 |
| 2015-01-01_00:37:18 | 86.9 | 69.2 |
| 2015-01-01_00:37:19 | 87.4 | 69.2 |
| 2015-01-01_00:37:20 | 87.5 | 69.2 |
| 2015-01-01_00:37:21 | 87.3 | 69.1 |
| 2015-01-01_00:37:22 | 87.2 | 69.1 |
| 2015-01-01_00:37:23 | 87.2 | 69.1 |
| 2015-01-01_00:37:24 | 86.9 | 69.1 |
| 2015-01-01_00:37:25 | 87.2 | 69.1 |
| 2015-01-01_00:37:26 | 86.9 | 69.1 |
| 2015-01-01_00:37:27 | 86.8 | 69.1 |
| 2015-01-01_00:37:28 | 86.9 | 69.1 |
| 2015-01-01_00:37:29 | 87 | 69 |
| 2015-01-01_00:37:30 | 87 | 69 |
| 2015-01-01_00:37:31 | 87.3 | 69 |
| 2015-01-01_00:37:32 | 86.9 | 69 |
| 2015-01-01_00:37:33 | 86.9 | 69 |
| 2015-01-01_00:37:34 | 86 | 69 |
| 2015-01-01_00:37:35 | 86.5 | 69 |
| 2015-01-01_00:37:36 | 87.4 | 69 |
| 2015-01-01_00:37:37 | 86.8 | 69 |
| 2015-01-01_00:37:38 | 87.6 | 69 |
| 2015-01-01_00:37:39 | 86.8 | 69 |
| 2015-01-01_00:37:40 | 87 | 69 |
| 2015-01-01_00:37:41 | 87.2 | 69 |
| 2015-01-01_00:37:42 | 86.9 | 69 |
| 2015-01-01_00:37:43 | 87.5 | 69 |
| 2015-01-01_00:37:44 | 87.5 | 69 |
| 2015-01-01_00:37:45 | 86.9 | 68.8 |
| 2015-01-01_00:37:46 | 86.9 | 68.8 |
| 2015-01-01_00:37:47 | 86.6 | 68.8 |
| 2015-01-01_00:37:48 | 86.8 | 68.8 |
| 2015-01-01_00:37:49 | 87.2 | 68.8 |
| 2015-01-01_00:37:50 | 86.9 | 68.8 |
| 2015-01-01_00:37:51 | 87.7 | 68.8 |
| 2015-01-01_00:37:52 | 86.9 | 68.8 |
| 2015-01-01_00:37:53 | 87.2 | 68.7 |
| 2015-01-01_00:37:54 | 85.9 | 68.7 |
| 2015-01-01_00:37:55 | 87 | 68.7 |
| 2015-01-01_00:37:56 | 86.8 | 68.7 |
| 2015-01-01_00:37:57 | 87.1 | 68.7 |
| 2015-01-01_00:37:58 | 87.6 | 68.7 |
| 2015-01-01_00:37:59 | 87.6 | 68.7 |
| 2015-01-01_00:38:00 | 86.1 | 68.7 |
| 2015-01-01_00:38:01 | 86.8 | 68.6 |
| 2015-01-01_00:38:02 | 85.8 | 68.6 |
| 2015-01-01_00:38:03 | 86.8 | 68.6 |
| 2015-01-01_00:38:04 | 87.2 | 68.6 |
| 2015-01-01_00:38:05 | 87.3 | 68.6 |
| 2015-01-01_00:38:06 | 86.5 | 68.6 |
| 2015-01-01_00:38:07 | 87.5 | 68.6 |
| 2015-01-01_00:38:08 | 86.5 | 68.6 |
| 2015-01-01_00:38:09 | 87.3 | 68.6 |
| 2015-01-01_00:38:10 | 87.5 | 68.6 |
| 2015-01-01_00:38:11 | 87.5 | 68.6 |
| 2015-01-01_00:38:12 | 87.2 | 68.6 |
| 2015-01-01_00:38:13 | 87.4 | 68.6 |
| 2015-01-01_00:38:14 | 87.2 | 68.6 |
| 2015-01-01_00:38:15 | 87.3 | 68.6 |
| 2015-01-01_00:38:16 | 87.4 | 68.6 |
| 2015-01-01_00:38:17 | 86.3 | 68.5 |
| 2015-01-01_00:38:18 | 87.4 | 68.5 |
| 2015-01-01_00:38:19 | 87 | 68.5 |
| 2015-01-01_00:38:20 | 87.3 | 68.5 |
| 2015-01-01_00:38:21 | 87.2 | 68.5 |
| 2015-01-01_00:38:22 | 86.6 | 68.5 |
| 2015-01-01_00:38:23 | 87.3 | 68.5 |
| 2015-01-01_00:38:24 | 86.2 | 68.5 |
| 2015-01-01_00:38:25 | 87.4 | 68.5 |
| 2015-01-01_00:38:26 | 87.2 | 68.5 |
| 2015-01-01_00:38:27 | 87.4 | 68.5 |
| 2015-01-01_00:38:28 | 86.6 | 68.5 |
| 2015-01-01_00:38:29 | 87.3 | 68.5 |
| 2015-01-01_00:38:30 | 87.6 | 68.5 |
| 2015-01-01_00:38:31 | 86.2 | 68.5 |
| 2015-01-01_00:38:32 | 87.2 | 68.5 |
| 2015-01-01_00:38:33 | 86.8 | 68.5 |
| 2015-01-01_00:38:34 | 87.4 | 68.5 |
| 2015-01-01_00:38:35 | 86.9 | 68.5 |
| 2015-01-01_00:38:36 | 87.2 | 68.5 |
| 2015-01-01_00:38:37 | 87.5 | 68.5 |
| 2015-01-01_00:38:38 | 86.9 | 68.5 |
| 2015-01-01_00:38:39 | 87.3 | 68.5 |
| 2015-01-01_00:38:40 | 86.8 | 68.5 |
| 2015-01-01_00:38:41 | 87.2 | 68.6 |
| 2015-01-01_00:38:42 | 86.4 | 68.6 |
| 2015-01-01_00:38:43 | 87 | 68.6 |
| 2015-01-01_00:38:44 | 86.9 | 68.6 |
| 2015-01-01_00:38:45 | 87.3 | 68.6 |
| 2015-01-01_00:38:46 | 87.3 | 68.6 |
| 2015-01-01_00:38:47 | 87.3 | 68.6 |
| 2015-01-01_00:38:48 | 85.9 | 68.6 |
| 2015-01-01_00:38:49 | 87.5 | 68.8 |
| 2015-01-01_00:38:50 | 86.7 | 68.8 |
| 2015-01-01_00:38:51 | 87.4 | 68.8 |
| 2015-01-01_00:38:52 | 87.5 | 68.8 |
| 2015-01-01_00:38:53 | 87.3 | 68.8 |
| 2015-01-01_00:38:54 | 86.8 | 68.8 |
| 2015-01-01_00:38:55 | 87.2 | 68.8 |
| 2015-01-01_00:38:56 | 87.5 | 68.8 |
| 2015-01-01_00:38:57 | 87.4 | 68.8 |
| 2015-01-01_00:38:58 | 87.2 | 68.8 |
| 2015-01-01_00:38:59 | 87 | 68.8 |
| 2015-01-01_00:39:00 | 87 | 68.8 |
| 2015-01-01_00:39:01 | 87.8 | 68.8 |
| 2015-01-01_00:39:02 | 86.9 | 68.8 |
| 2015-01-01_00:39:03 | 87.3 | 68.8 |
| 2015-01-01_00:39:04 | 87.6 | 68.8 |
| 2015-01-01_00:39:05 | 87.4 | 68.8 |
| 2015-01-01_00:39:06 | 86.7 | 68.8 |
| 2015-01-01_00:39:07 | 87.8 | 68.8 |
| 2015-01-01_00:39:08 | 87.9 | 68.8 |
| 2015-01-01_00:39:09 | 87.7 | 68.8 |
| 2015-01-01_00:39:10 | 87.7 | 68.8 |
| 2015-01-01_00:39:11 | 87.8 | 68.8 |
| 2015-01-01_00:39:12 | 86.7 | 68.8 |
| 2015-01-01_00:39:13 | 87 | 68.8 |
| 2015-01-01_00:39:14 | 86.2 | 68.8 |
| 2015-01-01_00:39:15 | 87 | 68.8 |
| 2015-01-01_00:39:16 | 87.4 | 68.8 |
| 2015-01-01_00:39:17 | 86.6 | 68.8 |
| 2015-01-01_00:39:18 | 87.3 | 68.8 |
| 2015-01-01_00:39:19 | 87 | 68.8 |
| 2015-01-01_00:39:20 | 86.7 | 68.8 |
| 2015-01-01_00:39:21 | 86.8 | 68.8 |
| 2015-01-01_00:39:22 | 86.9 | 68.8 |
| 2015-01-01_00:39:23 | 87.1 | 68.8 |
| 2015-01-01_00:39:24 | 86.8 | 68.8 |
| 2015-01-01_00:39:25 | 85.8 | 68.8 |
| 2015-01-01_00:39:26 | 86.8 | 68.8 |
| 2015-01-01_00:39:27 | 86.9 | 68.8 |
| 2015-01-01_00:39:28 | 87 | 68.8 |
| 2015-01-01_00:39:29 | 86.3 | 68.8 |
| 2015-01-01_00:39:30 | 86.8 | 68.8 |
| 2015-01-01_00:39:31 | 87.3 | 68.8 |
| 2015-01-01_00:39:32 | 87 | 68.8 |
| 2015-01-01_00:39:33 | 86 | 68.8 |
| 2015-01-01_00:39:34 | 86.9 | 68.8 |
| 2015-01-01_00:39:35 | 86.5 | 68.8 |
| 2015-01-01_00:39:36 | 87.1 | 68.8 |
| 2015-01-01_00:39:37 | 87.3 | 68.8 |
| 2015-01-01_00:39:38 | 87.4 | 68.8 |
| 2015-01-01_00:39:39 | 87.6 | 68.8 |
| 2015-01-01_00:39:40 | 88.3 | 68.8 |
| 2015-01-01_00:39:41 | 87.1 | 68.8 |
| 2015-01-01_00:39:42 | 88 | 68.8 |
| 2015-01-01_00:39:43 | 86.7 | 68.8 |
| 2015-01-01_00:39:44 | 87.6 | 68.8 |
| 2015-01-01_00:39:45 | 87.9 | 68.8 |
| 2015-01-01_00:39:46 | 87.7 | 68.8 |
| 2015-01-01_00:39:47 | 88.1 | 68.8 |
| 2015-01-01_00:39:48 | 87.4 | 68.8 |
| 2015-01-01_00:39:49 | 86.7 | 68.8 |
| 2015-01-01_00:39:50 | 87.1 | 68.8 |
| 2015-01-01_00:39:51 | 87.1 | 68.8 |
| 2015-01-01_00:39:52 | 86.8 | 68.8 |
| 2015-01-01_00:39:53 | 85.7 | 68.8 |
| 2015-01-01_00:39:54 | 86.9 | 68.8 |
| 2015-01-01_00:39:55 | 86.5 | 68.8 |
| 2015-01-01_00:39:56 | 86.5 | 68.8 |
| 2015-01-01_00:39:57 | 86.3 | 68.8 |
| 2015-01-01_00:39:58 | 86.7 | 68.8 |
| 2015-01-01_00:39:59 | 85.9 | 68.8 |
| 2015-01-01_00:40:00 | 86.8 | 68.8 |
| 2015-01-01_00:40:01 | 86.5 | 68.8 |
| 2015-01-01_00:40:02 | 87 | 68.8 |
| 2015-01-01_00:40:03 | 86.3 | 68.8 |
| 2015-01-01_00:40:04 | 86.9 | 68.8 |
| 2015-01-01_00:40:05 | 86.8 | 68.8 |
| 2015-01-01_00:40:06 | 87.2 | 68.8 |
| 2015-01-01_00:40:07 | 87.6 | 68.8 |
| 2015-01-01_00:40:08 | 87.3 | 68.8 |
| 2015-01-01_00:40:09 | 87 | 68.9 |
| 2015-01-01_00:40:10 | 87.5 | 68.9 |
| 2015-01-01_00:40:11 | 87.3 | 68.9 |
| 2015-01-01_00:40:12 | 87.6 | 68.9 |
| 2015-01-01_00:40:13 | 87 | 68.9 |
| 2015-01-01_00:40:14 | 88.3 | 68.9 |
| 2015-01-01_00:40:15 | 87.5 | 68.9 |
| 2015-01-01_00:40:16 | 88.2 | 68.9 |
| 2015-01-01_00:40:17 | 87.8 | 68.9 |
| 2015-01-01_00:40:18 | 88.1 | 68.9 |
| 2015-01-01_00:40:19 | 87.7 | 68.9 |
| 2015-01-01_00:40:20 | 87.4 | 68.9 |
| 2015-01-01_00:40:21 | 86.3 | 68.9 |
| 2015-01-01_00:40:22 | 86.6 | 68.9 |
| 2015-01-01_00:40:23 | 86.8 | 68.9 |
| 2015-01-01_00:40:24 | 86.5 | 68.9 |
| 2015-01-01_00:40:25 | 86.3 | 68.9 |
| 2015-01-01_00:40:26 | 86.2 | 68.9 |
| 2015-01-01_00:40:27 | 86.2 | 68.9 |
| 2015-01-01_00:40:28 | 86.1 | 68.9 |
| 2015-01-01_00:40:29 | 86.4 | 68.9 |
| 2015-01-01_00:40:30 | 85.4 | 68.9 |
| 2015-01-01_00:40:31 | 86.3 | 68.9 |
| 2015-01-01_00:40:32 | 85.7 | 68.9 |
| 2015-01-01_00:40:33 | 87.2 | 69 |
| 2015-01-01_00:40:34 | 86.7 | 69 |
| 2015-01-01_00:40:35 | 87.6 | 69 |
| 2015-01-01_00:40:36 | 87 | 69 |
| 2015-01-01_00:40:37 | 87.5 | 69 |
| 2015-01-01_00:40:38 | 87.6 | 69 |
| 2015-01-01_00:40:39 | 87.8 | 69 |
| 2015-01-01_00:40:40 | 87.7 | 69 |
| 2015-01-01_00:40:41 | 88.5 | 69.1 |
| 2015-01-01_00:40:42 | 88.3 | 69.1 |
| 2015-01-01_00:40:43 | 87.3 | 69.1 |
| 2015-01-01_00:40:44 | 87.9 | 69.1 |
| 2015-01-01_00:40:45 | 87.6 | 69.1 |
| 2015-01-01_00:40:46 | 88.1 | 69.1 |
| 2015-01-01_00:40:47 | 87.6 | 69.1 |
| 2015-01-01_00:40:48 | 87.4 | 69.1 |
| 2015-01-01_00:40:49 | 86.5 | 69.1 |
| 2015-01-01_00:40:50 | 86.6 | 69.1 |
| 2015-01-01_00:40:51 | 86.6 | 69.1 |
| 2015-01-01_00:40:52 | 86.1 | 69.1 |
| 2015-01-01_00:40:53 | 85.4 | 69.1 |
| 2015-01-01_00:40:54 | 85.5 | 69.1 |
| 2015-01-01_00:40:55 | 85.4 | 69.1 |
| 2015-01-01_00:40:56 | 86.1 | 69.1 |
| 2015-01-01_00:40:57 | 85.7 | 69.1 |
| 2015-01-01_00:40:58 | 86.1 | 69.1 |
| 2015-01-01_00:40:59 | 86.6 | 69.1 |
| 2015-01-01_00:41:00 | 86.7 | 69.1 |
| 2015-01-01_00:41:01 | 86.7 | 69.1 |
| 2015-01-01_00:41:02 | 86.4 | 69.1 |
| 2015-01-01_00:41:03 | 87.1 | 69.1 |
| 2015-01-01_00:41:04 | 87.4 | 69.1 |
| 2015-01-01_00:41:05 | 87.5 | 69.3 |
| 2015-01-01_00:41:06 | 87.2 | 69.3 |
| 2015-01-01_00:41:07 | 87.6 | 69.3 |
| 2015-01-01_00:41:08 | 88 | 69.3 |
| 2015-01-01_00:41:09 | 88.1 | 69.3 |
| 2015-01-01_00:41:10 | 87.2 | 69.3 |
| 2015-01-01_00:41:11 | 88.3 | 69.3 |
| 2015-01-01_00:41:12 | 88.1 | 69.3 |
| 2015-01-01_00:41:13 | 88.5 | 69.3 |
| 2015-01-01_00:41:14 | 87.8 | 69.3 |
| 2015-01-01_00:41:15 | 87.2 | 69.3 |
| 2015-01-01_00:41:16 | 87.6 | 69.3 |
| 2015-01-01_00:41:17 | 87.1 | 69.3 |
| 2015-01-01_00:41:18 | 86.9 | 69.3 |
| 2015-01-01_00:41:19 | 86.9 | 69.3 |
| 2015-01-01_00:41:20 | 85.2 | 69.3 |
| 2015-01-01_00:41:21 | 86.1 | 69.2 |
| 2015-01-01_00:41:22 | 86 | 69.2 |
| 2015-01-01_00:41:23 | 86 | 69.2 |
| 2015-01-01_00:41:24 | 86.1 | 69.2 |
| 2015-01-01_00:41:25 | 86.1 | 69.2 |
| 2015-01-01_00:41:26 | 86.2 | 69.2 |
| 2015-01-01_00:41:27 | 85.8 | 69.2 |
| 2015-01-01_00:41:28 | 85.8 | 69.2 |
| 2015-01-01_00:41:29 | 86.7 | 69.3 |
| 2015-01-01_00:41:30 | 85.9 | 69.3 |
| 2015-01-01_00:41:31 | 86.1 | 69.3 |
| 2015-01-01_00:41:32 | 87.3 | 69.3 |
| 2015-01-01_00:41:33 | 87.4 | 69.3 |
| 2015-01-01_00:41:34 | 87.6 | 69.3 |
| 2015-01-01_00:41:35 | 86.8 | 69.3 |
| 2015-01-01_00:41:36 | 86.6 | 69.3 |
| 2015-01-01_00:41:37 | 87.7 | 69.4 |
| 2015-01-01_00:41:38 | 88 | 69.4 |
| 2015-01-01_00:41:39 | 87.7 | 69.4 |
| 2015-01-01_00:41:40 | 88.1 | 69.4 |
| 2015-01-01_00:41:41 | 88.3 | 69.4 |
| 2015-01-01_00:41:42 | 88.3 | 69.4 |
| 2015-01-01_00:41:43 | 88.3 | 69.4 |
| 2015-01-01_00:41:44 | 88.5 | 69.4 |
| 2015-01-01_00:41:45 | 88.3 | 69.3 |
| 2015-01-01_00:41:46 | 87 | 69.3 |
| 2015-01-01_00:41:47 | 87.6 | 69.3 |
| 2015-01-01_00:41:48 | 87.1 | 69.3 |
| 2015-01-01_00:41:49 | 86.8 | 69.3 |
| 2015-01-01_00:41:50 | 86.3 | 69.3 |
| 2015-01-01_00:41:51 | 86.6 | 69.3 |
| 2015-01-01_00:41:52 | 85.8 | 69.3 |
| 2015-01-01_00:41:53 | 85.5 | 69.3 |
| 2015-01-01_00:41:54 | 85.9 | 69.3 |
| 2015-01-01_00:41:55 | 85.5 | 69.3 |
| 2015-01-01_00:41:56 | 86.1 | 69.3 |
| 2015-01-01_00:41:57 | 85.4 | 69.3 |
| 2015-01-01_00:41:58 | 86.2 | 69.3 |
| 2015-01-01_00:41:59 | 86.6 | 69.3 |
| 2015-01-01_00:42:00 | 85.2 | 69.3 |
| 2015-01-01_00:42:01 | 86.5 | 69.4 |
| 2015-01-01_00:42:02 | 85.7 | 69.4 |
| 2015-01-01_00:42:03 | 87.2 | 69.4 |
| 2015-01-01_00:42:04 | 86.6 | 69.4 |
| 2015-01-01_00:42:05 | 86.9 | 69.4 |
| 2015-01-01_00:42:06 | 86.5 | 69.4 |
| 2015-01-01_00:42:07 | 87.4 | 69.4 |
| 2015-01-01_00:42:08 | 87.4 | 69.4 |
| 2015-01-01_00:42:09 | 87.6 | 69.5 |
| 2015-01-01_00:42:10 | 88 | 69.5 |
| 2015-01-01_00:42:11 | 87.8 | 69.5 |
| 2015-01-01_00:42:12 | 87.1 | 69.5 |
| 2015-01-01_00:42:13 | 87.6 | 69.5 |
| 2015-01-01_00:42:14 | 88.1 | 69.5 |
| 2015-01-01_00:42:15 | 88.3 | 69.5 |
| 2015-01-01_00:42:16 | 88.5 | 69.5 |
| 2015-01-01_00:42:17 | 88.6 | 69.5 |
| 2015-01-01_00:42:18 | 88.3 | 69.5 |
| 2015-01-01_00:42:19 | 87.8 | 69.5 |
| 2015-01-01_00:42:20 | 86.7 | 69.5 |
| 2015-01-01_00:42:21 | 87 | 69.5 |
| 2015-01-01_00:42:22 | 86.3 | 69.5 |
| 2015-01-01_00:42:23 | 86 | 69.5 |
| 2015-01-01_00:42:24 | 86.5 | 69.5 |
| 2015-01-01_00:42:25 | 86.3 | 69.5 |
| 2015-01-01_00:42:26 | 85.3 | 69.5 |
| 2015-01-01_00:42:27 | 85.9 | 69.5 |
| 2015-01-01_00:42:28 | 86.2 | 69.5 |
| 2015-01-01_00:42:29 | 86.3 | 69.5 |
| 2015-01-01_00:42:30 | 86.3 | 69.5 |
| 2015-01-01_00:42:31 | 86.8 | 69.5 |
| 2015-01-01_00:42:32 | 85.8 | 69.5 |
| 2015-01-01_00:42:33 | 86.2 | 69.5 |
| 2015-01-01_00:42:34 | 86.3 | 69.5 |
| 2015-01-01_00:42:35 | 87.5 | 69.5 |
| 2015-01-01_00:42:36 | 87.5 | 69.5 |
| 2015-01-01_00:42:37 | 88 | 69.5 |
| 2015-01-01_00:42:38 | 87.9 | 69.5 |
| 2015-01-01_00:42:39 | 87.6 | 69.5 |
| 2015-01-01_00:42:40 | 88.3 | 69.5 |
| 2015-01-01_00:42:41 | 88 | 69.6 |
| 2015-01-01_00:42:42 | 88.7 | 69.6 |
| 2015-01-01_00:42:43 | 88.8 | 69.6 |
| 2015-01-01_00:42:44 | 88.8 | 69.6 |
| 2015-01-01_00:42:45 | 88.4 | 69.6 |
| 2015-01-01_00:42:46 | 87.8 | 69.6 |
| 2015-01-01_00:42:47 | 87.4 | 69.6 |
| 2015-01-01_00:42:48 | 87.3 | 69.6 |
| 2015-01-01_00:42:49 | 86.2 | 69.7 |
| 2015-01-01_00:42:50 | 86.1 | 69.7 |
| 2015-01-01_00:42:51 | 86.5 | 69.7 |
| 2015-01-01_00:42:52 | 86.1 | 69.7 |
| 2015-01-01_00:42:53 | 85.7 | 69.7 |
| 2015-01-01_00:42:54 | 86 | 69.7 |
| 2015-01-01_00:42:55 | 85.9 | 69.7 |
| 2015-01-01_00:42:56 | 86.3 | 69.7 |
| 2015-01-01_00:42:57 | 85.9 | 69.9 |
| 2015-01-01_00:42:58 | 86.7 | 69.9 |
| 2015-01-01_00:42:59 | 86.3 | 69.9 |
| 2015-01-01_00:43:00 | 85.7 | 69.9 |
| 2015-01-01_00:43:01 | 86.1 | 69.9 |
| 2015-01-01_00:43:02 | 86.9 | 69.9 |
| 2015-01-01_00:43:03 | 87.2 | 69.9 |
| 2015-01-01_00:43:04 | 87.3 | 69.9 |
| 2015-01-01_00:43:05 | 87 | 70 |
| 2015-01-01_00:43:06 | 87.3 | 70 |
| 2015-01-01_00:43:07 | 87.4 | 70 |
| 2015-01-01_00:43:08 | 87.3 | 70 |
| 2015-01-01_00:43:09 | 87.3 | 70 |
| 2015-01-01_00:43:10 | 87.5 | 70 |
| 2015-01-01_00:43:11 | 87.1 | 70 |
| 2015-01-01_00:43:12 | 87.1 | 70 |
| 2015-01-01_00:43:13 | 87.1 | 70.1 |
| 2015-01-01_00:43:14 | 87.2 | 70.1 |
| 2015-01-01_00:43:15 | 86.5 | 70.1 |
| 2015-01-01_00:43:16 | 87.3 | 70.1 |
| 2015-01-01_00:43:17 | 87.2 | 70.1 |
| 2015-01-01_00:43:18 | 86.5 | 70.1 |
| 2015-01-01_00:43:19 | 86.6 | 70.1 |
| 2015-01-01_00:43:20 | 87.3 | 70.1 |
| 2015-01-01_00:43:21 | 87.6 | 70.4 |
| 2015-01-01_00:43:22 | 87.7 | 70.4 |
| 2015-01-01_00:43:23 | 87.5 | 70.4 |
| 2015-01-01_00:43:24 | 87.7 | 70.4 |
| 2015-01-01_00:43:25 | 88 | 70.4 |
| 2015-01-01_00:43:26 | 87.6 | 70.4 |
| 2015-01-01_00:43:27 | 88.2 | 70.4 |
| 2015-01-01_00:43:28 | 88.4 | 70.4 |
| 2015-01-01_00:43:29 | 88.2 | 70.4 |
| 2015-01-01_00:43:30 | 87.8 | 70.4 |
| 2015-01-01_00:43:31 | 88.1 | 70.4 |
| 2015-01-01_00:43:32 | 88.6 | 70.4 |
| 2015-01-01_00:43:33 | 88.4 | 70.4 |
| 2015-01-01_00:43:34 | 87.9 | 70.4 |
| 2015-01-01_00:43:35 | 88.2 | 70.4 |
| 2015-01-01_00:43:36 | 87.3 | 70.4 |
| 2015-01-01_00:43:37 | 86.7 | 70.9 |
| 2015-01-01_00:43:38 | 87.6 | 70.9 |
| 2015-01-01_00:43:39 | 87.7 | 70.9 |
| 2015-01-01_00:43:40 | 87.6 | 70.9 |
| 2015-01-01_00:43:41 | 87.2 | 70.9 |
| 2015-01-01_00:43:42 | 86.9 | 70.9 |
| 2015-01-01_00:43:43 | 86.7 | 70.9 |
| 2015-01-01_00:43:44 | 85.8 | 70.9 |
| 2015-01-01_00:43:45 | 86 | 70.9 |
| 2015-01-01_00:43:46 | 85.3 | 70.9 |
| 2015-01-01_00:43:47 | 85.8 | 70.9 |
| 2015-01-01_00:43:48 | 86.3 | 70.9 |
| 2015-01-01_00:43:49 | 86 | 70.9 |
| 2015-01-01_00:43:50 | 86.2 | 70.9 |
| 2015-01-01_00:43:51 | 85.9 | 70.9 |
| 2015-01-01_00:43:52 | 85.7 | 70.9 |
| 2015-01-01_00:43:53 | 85.9 | 71 |
| 2015-01-01_00:43:54 | 85.7 | 71 |
| 2015-01-01_00:43:55 | 85.3 | 71 |
| 2015-01-01_00:43:56 | 86.7 | 71 |
| 2015-01-01_00:43:57 | 86.2 | 71 |
| 2015-01-01_00:43:58 | 86.8 | 71 |
| 2015-01-01_00:43:59 | 86.4 | 71 |
| 2015-01-01_00:44:00 | 86.9 | 71 |
| 2015-01-01_00:44:01 | 86.9 | 71.1 |
| 2015-01-01_00:44:02 | 87.5 | 71.1 |
| 2015-01-01_00:44:03 | 86.8 | 71.1 |
| 2015-01-01_00:44:04 | 87 | 71.1 |
| 2015-01-01_00:44:05 | 86.8 | 71.1 |
| 2015-01-01_00:44:06 | 86.6 | 71.1 |
| 2015-01-01_00:44:07 | 87.8 | 71.1 |
| 2015-01-01_00:44:08 | 88.1 | 71.1 |
| 2015-01-01_00:44:09 | 87.7 | 71.1 |
| 2015-01-01_00:44:10 | 87.9 | 71.1 |
| 2015-01-01_00:44:11 | 88.1 | 71.1 |
| 2015-01-01_00:44:12 | 88.2 | 71.1 |
| 2015-01-01_00:44:13 | 87.7 | 71.1 |
| 2015-01-01_00:44:14 | 87.3 | 71.1 |
| 2015-01-01_00:44:15 | 88.4 | 71.1 |
| 2015-01-01_00:44:16 | 87.4 | 71.1 |
| 2015-01-01_00:44:17 | 88.3 | 71 |
| 2015-01-01_00:44:18 | 88.4 | 71 |
| 2015-01-01_00:44:19 | 87.4 | 71 |
| 2015-01-01_00:44:20 | 88.3 | 71 |
| 2015-01-01_00:44:21 | 87.7 | 71 |
| 2015-01-01_00:44:22 | 87.5 | 71 |
| 2015-01-01_00:44:23 | 87.3 | 71 |
| 2015-01-01_00:44:24 | 86.5 | 71 |
| 2015-01-01_00:44:25 | 86.6 | 70.7 |
| 2015-01-01_00:44:26 | 86.8 | 70.7 |
| 2015-01-01_00:44:27 | 86.5 | 70.7 |
| 2015-01-01_00:44:28 | 86.3 | 70.7 |
| 2015-01-01_00:44:29 | 85.9 | 70.7 |
| 2015-01-01_00:44:30 | 85.6 | 70.7 |
| 2015-01-01_00:44:31 | 86.1 | 70.7 |
| 2015-01-01_00:44:32 | 85.7 | 70.7 |
| 2015-01-01_00:44:33 | 85.2 | 70.5 |
| 2015-01-01_00:44:34 | 86 | 70.5 |
| 2015-01-01_00:44:35 | 86.2 | 70.5 |
| 2015-01-01_00:44:36 | 86 | 70.5 |
| 2015-01-01_00:44:37 | 86.6 | 70.5 |
| 2015-01-01_00:44:38 | 86.7 | 70.5 |
| 2015-01-01_00:44:39 | 86.9 | 70.5 |
| 2015-01-01_00:44:40 | 86.9 | 70.5 |
| 2015-01-01_00:44:41 | 86.6 | 70.4 |
| 2015-01-01_00:44:42 | 86.9 | 70.4 |
| 2015-01-01_00:44:43 | 86.5 | 70.4 |
| 2015-01-01_00:44:44 | 86.2 | 70.4 |
| 2015-01-01_00:44:45 | 86.4 | 70.4 |
| 2015-01-01_00:44:46 | 86.7 | 70.4 |
| 2015-01-01_00:44:47 | 86.5 | 70.4 |
| 2015-01-01_00:44:48 | 86.1 | 70.4 |
| 2015-01-01_00:44:49 | 86.5 | 70.3 |
| 2015-01-01_00:44:50 | 86.7 | 70.3 |
| 2015-01-01_00:44:51 | 87 | 70.3 |
| 2015-01-01_00:44:52 | 87.5 | 70.3 |
| 2015-01-01_00:44:53 | 87.2 | 70.3 |
| 2015-01-01_00:44:54 | 87.3 | 70.3 |
| 2015-01-01_00:44:55 | 87.6 | 70.3 |
| 2015-01-01_00:44:56 | 87.1 | 70.3 |
| 2015-01-01_00:44:57 | 86.8 | 70.3 |
| 2015-01-01_00:44:58 | 87.4 | 70.3 |
| 2015-01-01_00:44:59 | 86.9 | 70.3 |
| 2015-01-01_00:45:00 | 87.3 | 70.3 |
| 2015-01-01_00:45:01 | 87.5 | 70.3 |
| 2015-01-01_00:45:02 | 87.3 | 70.3 |
| 2015-01-01_00:45:03 | 86.2 | 70.3 |
| 2015-01-01_00:45:04 | 87.3 | 70.3 |
| 2015-01-01_00:45:05 | 87.5 | 70.2 |
| 2015-01-01_00:45:06 | 87 | 70.2 |
| 2015-01-01_00:45:07 | 87.4 | 70.2 |
| 2015-01-01_00:45:08 | 87.5 | 70.2 |
| 2015-01-01_00:45:09 | 87.3 | 70.2 |
| 2015-01-01_00:45:10 | 87.3 | 70.2 |
| 2015-01-01_00:45:11 | 87.4 | 70.2 |
| 2015-01-01_00:45:12 | 86.3 | 70.2 |
| 2015-01-01_00:45:13 | 86.5 | 70.2 |
| 2015-01-01_00:45:14 | 87.1 | 70.2 |
| 2015-01-01_00:45:15 | 86.8 | 70.2 |
| 2015-01-01_00:45:16 | 86.8 | 70.2 |
| 2015-01-01_00:45:17 | 86.8 | 70.2 |
| 2015-01-01_00:45:18 | 86.7 | 70.2 |
| 2015-01-01_00:45:19 | 86.6 | 70.2 |
| 2015-01-01_00:45:20 | 86.7 | 70.2 |
| 2015-01-01_00:45:21 | 86.9 | 70.3 |
| 2015-01-01_00:45:22 | 86.2 | 70.3 |
| 2015-01-01_00:45:23 | 86.8 | 70.3 |
| 2015-01-01_00:45:24 | 86.1 | 70.3 |
| 2015-01-01_00:45:25 | 86.3 | 70.3 |
| 2015-01-01_00:45:26 | 86.5 | 70.3 |
| 2015-01-01_00:45:27 | 86.1 | 70.3 |
| 2015-01-01_00:45:28 | 86.8 | 70.3 |
| 2015-01-01_00:45:29 | 86.1 | 70.3 |
| 2015-01-01_00:45:30 | 86.2 | 70.3 |
| 2015-01-01_00:45:31 | 87.2 | 70.3 |
| 2015-01-01_00:45:32 | 87.1 | 70.3 |
| 2015-01-01_00:45:33 | 87.2 | 70.3 |
| 2015-01-01_00:45:34 | 86.2 | 70.3 |
| 2015-01-01_00:45:35 | 87 | 70.3 |
| 2015-01-01_00:45:36 | 87.3 | 70.3 |
| 2015-01-01_00:45:37 | 87.4 | 70.3 |
| 2015-01-01_00:45:38 | 86.6 | 70.3 |
| 2015-01-01_00:45:39 | 87.5 | 70.3 |
| 2015-01-01_00:45:40 | 86.8 | 70.3 |
| 2015-01-01_00:45:41 | 87.4 | 70.3 |
| 2015-01-01_00:45:42 | 87.7 | 70.3 |
| 2015-01-01_00:45:43 | 88 | 70.3 |
| 2015-01-01_00:45:44 | 87.5 | 70.3 |
| 2015-01-01_00:45:45 | 87.9 | 70.1 |
| 2015-01-01_00:45:46 | 87.8 | 70.1 |
| 2015-01-01_00:45:47 | 87.8 | 70.1 |
| 2015-01-01_00:45:48 | 87.3 | 70.1 |
| 2015-01-01_00:45:49 | 88 | 70.1 |
| 2015-01-01_00:45:50 | 86.9 | 70.1 |
| 2015-01-01_00:45:51 | 87.8 | 70.1 |
| 2015-01-01_00:45:52 | 87.9 | 70.1 |
| 2015-01-01_00:45:53 | 86.5 | 69.8 |
| 2015-01-01_00:45:54 | 86.8 | 69.8 |
| 2015-01-01_00:45:55 | 86.9 | 69.8 |
| 2015-01-01_00:45:56 | 86.6 | 69.8 |
| 2015-01-01_00:45:57 | 86.4 | 69.8 |
| 2015-01-01_00:45:58 | 86.2 | 69.8 |
| 2015-01-01_00:45:59 | 85.3 | 69.8 |
| 2015-01-01_00:46:00 | 85.1 | 69.8 |
| 2015-01-01_00:46:01 | 86.1 | 69.6 |
| 2015-01-01_00:46:02 | 86.3 | 69.6 |
| 2015-01-01_00:46:03 | 86.2 | 69.6 |
| 2015-01-01_00:46:04 | 86 | 69.6 |
| 2015-01-01_00:46:05 | 86.1 | 69.6 |
| 2015-01-01_00:46:06 | 85.3 | 69.6 |
| 2015-01-01_00:46:07 | 86.5 | 69.6 |
| 2015-01-01_00:46:08 | 86.4 | 69.6 |
| 2015-01-01_00:46:09 | 86.2 | 69.6 |
| 2015-01-01_00:46:10 | 86.3 | 69.6 |
| 2015-01-01_00:46:11 | 86.9 | 69.6 |
| 2015-01-01_00:46:12 | 87 | 69.6 |
| 2015-01-01_00:46:13 | 87.2 | 69.6 |
| 2015-01-01_00:46:14 | 87.1 | 69.6 |
| 2015-01-01_00:46:15 | 86.9 | 69.6 |
| 2015-01-01_00:46:16 | 87.1 | 69.6 |
| 2015-01-01_00:46:17 | 87 | 69.6 |
| 2015-01-01_00:46:18 | 87.2 | 69.6 |
| 2015-01-01_00:46:19 | 87.5 | 69.6 |
| 2015-01-01_00:46:20 | 87.7 | 69.6 |
| 2015-01-01_00:46:21 | 88.1 | 69.6 |
| 2015-01-01_00:46:22 | 87.8 | 69.6 |
| 2015-01-01_00:46:23 | 88.3 | 69.6 |
| 2015-01-01_00:46:24 | 88.1 | 69.6 |
| 2015-01-01_00:46:25 | 87.8 | 69.6 |
| 2015-01-01_00:46:26 | 87.9 | 69.6 |
| 2015-01-01_00:46:27 | 87.9 | 69.6 |
| 2015-01-01_00:46:28 | 87.6 | 69.6 |
| 2015-01-01_00:46:29 | 87.9 | 69.6 |
| 2015-01-01_00:46:30 | 87.4 | 69.6 |
| 2015-01-01_00:46:31 | 87.3 | 69.6 |
| 2015-01-01_00:46:32 | 86.9 | 69.6 |
| 2015-01-01_00:46:33 | 86.8 | 69.6 |
| 2015-01-01_00:46:34 | 86.7 | 69.6 |
| 2015-01-01_00:46:35 | 86.2 | 69.6 |
| 2015-01-01_00:46:36 | 85.7 | 69.6 |
| 2015-01-01_00:46:37 | 85.8 | 69.6 |
| 2015-01-01_00:46:38 | 85.6 | 69.6 |
| 2015-01-01_00:46:39 | 85.8 | 69.6 |
| 2015-01-01_00:46:40 | 85.5 | 69.6 |
| 2015-01-01_00:46:41 | 84.9 | 69.6 |
| 2015-01-01_00:46:42 | 85.6 | 69.6 |
| 2015-01-01_00:46:43 | 85.2 | 69.6 |
| 2015-01-01_00:46:44 | 85.1 | 69.6 |
| 2015-01-01_00:46:45 | 84.3 | 69.6 |
| 2015-01-01_00:46:46 | 83.8 | 69.6 |
| 2015-01-01_00:46:47 | 84.9 | 69.6 |
| 2015-01-01_00:46:48 | 84.9 | 69.6 |
| 2015-01-01_00:46:49 | 84.4 | 70.1 |
| 2015-01-01_00:46:50 | 84.7 | 70.1 |
| 2015-01-01_00:46:51 | 84.7 | 70.1 |
| 2015-01-01_00:46:52 | 84.9 | 70.1 |
| 2015-01-01_00:46:53 | 84.7 | 70.1 |
| 2015-01-01_00:46:54 | 84.8 | 70.1 |
| 2015-01-01_00:46:55 | 83.9 | 70.1 |
| 2015-01-01_00:46:56 | 85.3 | 70.1 |
| 2015-01-01_00:46:57 | 85.1 | 70.5 |
| 2015-01-01_00:46:58 | 84.9 | 70.5 |
| 2015-01-01_00:46:59 | 85.4 | 70.5 |
| 2015-01-01_00:47:00 | 85.1 | 70.5 |
| 2015-01-01_00:47:01 | 85.3 | 70.5 |
| 2015-01-01_00:47:02 | 85 | 70.5 |
| 2015-01-01_00:47:03 | 85.3 | 70.5 |
| 2015-01-01_00:47:04 | 85.3 | 70.5 |
| 2015-01-01_00:47:05 | 85.5 | 70.5 |
| 2015-01-01_00:47:06 | 84.1 | 70.5 |
| 2015-01-01_00:47:07 | 85.4 | 70.5 |
| 2015-01-01_00:47:08 | 84.6 | 70.5 |
| 2015-01-01_00:47:09 | 84.1 | 70.5 |
| 2015-01-01_00:47:10 | 85.6 | 70.5 |
| 2015-01-01_00:47:11 | 85.3 | 70.5 |
| 2015-01-01_00:47:12 | 85.4 | 70.5 |
| 2015-01-01_00:47:13 | 86 | 70.6 |
| 2015-01-01_00:47:14 | 85.6 | 70.6 |
| 2015-01-01_00:47:15 | 85.6 | 70.6 |
| 2015-01-01_00:47:16 | 86 | 70.6 |
| 2015-01-01_00:47:17 | 86.8 | 70.6 |
| 2015-01-01_00:47:18 | 86.7 | 70.6 |
| 2015-01-01_00:47:19 | 87 | 70.6 |
| 2015-01-01_00:47:20 | 86.7 | 70.6 |
| 2015-01-01_00:47:21 | 86.3 | 70.6 |
| 2015-01-01_00:47:22 | 86.1 | 70.6 |
| 2015-01-01_00:47:23 | 87 | 70.6 |
| 2015-01-01_00:47:24 | 86.7 | 70.6 |
| 2015-01-01_00:47:25 | 87 | 70.6 |
| 2015-01-01_00:47:26 | 86.9 | 70.6 |
| 2015-01-01_00:47:27 | 87.1 | 70.6 |
| 2015-01-01_00:47:28 | 87.4 | 70.6 |
| 2015-01-01_00:47:29 | 87.1 | 70.6 |
| 2015-01-01_00:47:30 | 87.4 | 70.6 |
| 2015-01-01_00:47:31 | 87.4 | 70.6 |
| 2015-01-01_00:47:32 | 86.8 | 70.6 |
| 2015-01-01_00:47:33 | 87 | 70.6 |
| 2015-01-01_00:47:34 | 87.2 | 70.6 |
| 2015-01-01_00:47:35 | 86.9 | 70.6 |
| 2015-01-01_00:47:36 | 87.4 | 70.6 |
| 2015-01-01_00:47:37 | 87.4 | 70.4 |
| 2015-01-01_00:47:38 | 87.5 | 70.4 |
| 2015-01-01_00:47:39 | 87.9 | 70.4 |
| 2015-01-01_00:47:40 | 88.3 | 70.4 |
| 2015-01-01_00:47:41 | 88.1 | 70.4 |
| 2015-01-01_00:47:42 | 88 | 70.4 |
| 2015-01-01_00:47:43 | 88.4 | 70.4 |
| 2015-01-01_00:47:44 | 88.2 | 70.4 |
| 2015-01-01_00:47:45 | 87.8 | 70.3 |
| 2015-01-01_00:47:46 | 86.8 | 70.3 |
| 2015-01-01_00:47:47 | 88.3 | 70.3 |
| 2015-01-01_00:47:48 | 87.9 | 70.3 |
| 2015-01-01_00:47:49 | 88.3 | 70.3 |
| 2015-01-01_00:47:50 | 87.9 | 70.3 |
| 2015-01-01_00:47:51 | 88.2 | 70.3 |
| 2015-01-01_00:47:52 | 88.2 | 70.3 |
| 2015-01-01_00:47:53 | 88 | 70.3 |
| 2015-01-01_00:47:54 | 87.4 | 70.3 |
| 2015-01-01_00:47:55 | 87.4 | 70.3 |
| 2015-01-01_00:47:56 | 87.6 | 70.3 |
| 2015-01-01_00:47:57 | 87.6 | 70.3 |
| 2015-01-01_00:47:58 | 87.3 | 70.3 |
| 2015-01-01_00:47:59 | 87.4 | 70.3 |
| 2015-01-01_00:48:00 | 87.5 | 70.3 |
| 2015-01-01_00:48:01 | 87.3 | 70.3 |
| 2015-01-01_00:48:02 | 87 | 70.3 |
| 2015-01-01_00:48:03 | 86.9 | 70.3 |
| 2015-01-01_00:48:04 | 86.8 | 70.3 |
| 2015-01-01_00:48:05 | 86.5 | 70.3 |
| 2015-01-01_00:48:06 | 86.9 | 70.3 |
| 2015-01-01_00:48:07 | 87.1 | 70.3 |
| 2015-01-01_00:48:08 | 86.9 | 70.3 |
| 2015-01-01_00:48:09 | 86.9 | 70.5 |
| 2015-01-01_00:48:10 | 86.9 | 70.5 |
| 2015-01-01_00:48:11 | 86.4 | 70.5 |
| 2015-01-01_00:48:12 | 86.8 | 70.5 |
| 2015-01-01_00:48:13 | 86.6 | 70.5 |
| 2015-01-01_00:48:14 | 86.8 | 70.5 |
| 2015-01-01_00:48:15 | 86 | 70.5 |
| 2015-01-01_00:48:16 | 86.5 | 70.5 |
| 2015-01-01_00:48:17 | 87 | 70.6 |
| 2015-01-01_00:48:18 | 87.2 | 70.6 |
| 2015-01-01_00:48:19 | 86.9 | 70.6 |
| 2015-01-01_00:48:20 | 87.2 | 70.6 |
| 2015-01-01_00:48:21 | 87.3 | 70.6 |
| 2015-01-01_00:48:22 | 86.7 | 70.6 |
| 2015-01-01_00:48:23 | 87.1 | 70.6 |
| 2015-01-01_00:48:24 | 87.3 | 70.6 |
| 2015-01-01_00:48:25 | 87.3 | 70.6 |
| 2015-01-01_00:48:26 | 87 | 70.6 |
| 2015-01-01_00:48:27 | 87.3 | 70.6 |
| 2015-01-01_00:48:28 | 87.2 | 70.6 |
| 2015-01-01_00:48:29 | 87.1 | 70.6 |
| 2015-01-01_00:48:30 | 86.9 | 70.6 |
| 2015-01-01_00:48:31 | 87.6 | 70.6 |
| 2015-01-01_00:48:32 | 87.6 | 70.6 |
| 2015-01-01_00:48:33 | 87.1 | 70.6 |
| 2015-01-01_00:48:34 | 87.1 | 70.6 |
| 2015-01-01_00:48:35 | 87.3 | 70.6 |
| 2015-01-01_00:48:36 | 87.3 | 70.6 |
| 2015-01-01_00:48:37 | 87.3 | 70.6 |
| 2015-01-01_00:48:38 | 87.5 | 70.6 |
| 2015-01-01_00:48:39 | 87.4 | 70.6 |
| 2015-01-01_00:48:40 | 87.2 | 70.6 |
| 2015-01-01_00:48:41 | 87.6 | 70.6 |
| 2015-01-01_00:48:42 | 87.3 | 70.6 |
| 2015-01-01_00:48:43 | 87.8 | 70.6 |
| 2015-01-01_00:48:44 | 87.4 | 70.6 |
| 2015-01-01_00:48:45 | 87.9 | 70.6 |
| 2015-01-01_00:48:46 | 88 | 70.6 |
| 2015-01-01_00:48:47 | 88 | 70.6 |
| 2015-01-01_00:48:48 | 88.5 | 70.6 |
| 2015-01-01_00:48:49 | 87.6 | 70.6 |
| 2015-01-01_00:48:50 | 87.9 | 70.6 |
| 2015-01-01_00:48:51 | 88.3 | 70.6 |
| 2015-01-01_00:48:52 | 88.1 | 70.6 |
| 2015-01-01_00:48:53 | 88.7 | 70.6 |
| 2015-01-01_00:48:54 | 88.6 | 70.6 |
| 2015-01-01_00:48:55 | 87.5 | 70.6 |
| 2015-01-01_00:48:56 | 88.6 | 70.6 |
| 2015-01-01_00:48:57 | 88.4 | 70.7 |
| 2015-01-01_00:48:58 | 88.6 | 70.7 |
| 2015-01-01_00:48:59 | 87.5 | 70.7 |
| 2015-01-01_00:49:00 | 87.5 | 70.7 |
| 2015-01-01_00:49:01 | 86 | 70.7 |
| 2015-01-01_00:49:02 | 87 | 70.7 |
| 2015-01-01_00:49:03 | 87.4 | 70.7 |
| 2015-01-01_00:49:04 | 85.9 | 70.7 |
| 2015-01-01_00:49:05 | 86.8 | 70.6 |
| 2015-01-01_00:49:06 | 86.6 | 70.6 |
| 2015-01-01_00:49:07 | 85.7 | 70.6 |
| 2015-01-01_00:49:08 | 86.6 | 70.6 |
| 2015-01-01_00:49:09 | 86.2 | 70.6 |
| 2015-01-01_00:49:10 | 86.6 | 70.6 |
| 2015-01-01_00:49:11 | 86.5 | 70.6 |
| 2015-01-01_00:49:12 | 86.6 | 70.6 |
| 2015-01-01_00:49:13 | 86.3 | 70.5 |
| 2015-01-01_00:49:14 | 86 | 70.5 |
| 2015-01-01_00:49:15 | 85.8 | 70.5 |
| 2015-01-01_00:49:16 | 87.3 | 70.5 |
| 2015-01-01_00:49:17 | 86.6 | 70.5 |
| 2015-01-01_00:49:18 | 87.3 | 70.5 |
| 2015-01-01_00:49:19 | 86.8 | 70.5 |
| 2015-01-01_00:49:20 | 87.2 | 70.5 |
| 2015-01-01_00:49:21 | 87.4 | 70.4 |
| 2015-01-01_00:49:22 | 87.8 | 70.4 |
| 2015-01-01_00:49:23 | 87.9 | 70.4 |
| 2015-01-01_00:49:24 | 87.5 | 70.4 |
| 2015-01-01_00:49:25 | 87.6 | 70.4 |
| 2015-01-01_00:49:26 | 87.5 | 70.4 |
| 2015-01-01_00:49:27 | 87.6 | 70.4 |
| 2015-01-01_00:49:28 | 87.6 | 70.4 |
| 2015-01-01_00:49:29 | 88 | 70.3 |
| 2015-01-01_00:49:30 | 87.5 | 70.3 |
| 2015-01-01_00:49:31 | 87.5 | 70.3 |
| 2015-01-01_00:49:32 | 86.6 | 70.3 |
| 2015-01-01_00:49:33 | 87.5 | 70.3 |
| 2015-01-01_00:49:34 | 86.9 | 70.3 |
| 2015-01-01_00:49:35 | 87.8 | 70.3 |
| 2015-01-01_00:49:36 | 88 | 70.3 |
| 2015-01-01_00:49:37 | 88 | 70.3 |
| 2015-01-01_00:49:38 | 87.7 | 70.3 |
| 2015-01-01_00:49:39 | 87.5 | 70.3 |
| 2015-01-01_00:49:40 | 87.4 | 70.3 |
| 2015-01-01_00:49:41 | 86.9 | 70.3 |
| 2015-01-01_00:49:42 | 87.2 | 70.3 |
| 2015-01-01_00:49:43 | 87.3 | 70.3 |
| 2015-01-01_00:49:44 | 86.7 | 70.3 |
| 2015-01-01_00:49:45 | 86.9 | 70.1 |
| 2015-01-01_00:49:46 | 86.8 | 70.1 |
| 2015-01-01_00:49:47 | 86.6 | 70.1 |
| 2015-01-01_00:49:48 | 86.7 | 70.1 |
| 2015-01-01_00:49:49 | 86.3 | 70.1 |
| 2015-01-01_00:49:50 | 86.5 | 70.1 |
| 2015-01-01_00:49:51 | 86.9 | 70.1 |
| 2015-01-01_00:49:52 | 86.9 | 70.1 |
| 2015-01-01_00:49:53 | 86.6 | 70 |
| 2015-01-01_00:49:54 | 86.8 | 70 |
| 2015-01-01_00:49:55 | 86.9 | 70 |
| 2015-01-01_00:49:56 | 86.8 | 70 |
| 2015-01-01_00:49:57 | 86.2 | 70 |
| 2015-01-01_00:49:58 | 86.5 | 70 |
| 2015-01-01_00:49:59 | 85.5 | 70 |
| 2015-01-01_00:50:00 | 86.6 | 70 |
| 2015-01-01_00:50:01 | 84.8 | 69.9 |
| 2015-01-01_00:50:02 | 86.9 | 69.9 |
| 2015-01-01_00:50:03 | 85.6 | 69.9 |
| 2015-01-01_00:50:04 | 87 | 69.9 |
| 2015-01-01_00:50:05 | 86.9 | 69.9 |
| 2015-01-01_00:50:06 | 86.7 | 69.9 |
| 2015-01-01_00:50:07 | 87.1 | 69.9 |
| 2015-01-01_00:50:08 | 87.2 | 69.9 |
| 2015-01-01_00:50:09 | 86.9 | 69.9 |
| 2015-01-01_00:50:10 | 87 | 69.9 |
| 2015-01-01_00:50:11 | 86.8 | 69.9 |
| 2015-01-01_00:50:12 | 86.8 | 69.9 |
| 2015-01-01_00:50:13 | 87.1 | 69.9 |
| 2015-01-01_00:50:14 | 87.3 | 69.9 |
| 2015-01-01_00:50:15 | 86.9 | 69.9 |
| 2015-01-01_00:50:16 | 87 | 69.9 |
| 2015-01-01_00:50:17 | 87.4 | 69.9 |
| 2015-01-01_00:50:18 | 86.7 | 69.9 |
| 2015-01-01_00:50:19 | 87.3 | 69.9 |
| 2015-01-01_00:50:20 | 87.3 | 69.9 |
| 2015-01-01_00:50:21 | 87.6 | 69.9 |
| 2015-01-01_00:50:22 | 87.6 | 69.9 |
| 2015-01-01_00:50:23 | 87.2 | 69.9 |
| 2015-01-01_00:50:24 | 87.3 | 69.9 |
| 2015-01-01_00:50:25 | 87.3 | 69.8 |
| 2015-01-01_00:50:26 | 86.7 | 69.8 |
| 2015-01-01_00:50:27 | 87.6 | 69.8 |
| 2015-01-01_00:50:28 | 87.2 | 69.8 |
| 2015-01-01_00:50:29 | 87.5 | 69.8 |
| 2015-01-01_00:50:30 | 87.1 | 69.8 |
| 2015-01-01_00:50:31 | 87.1 | 69.8 |
| 2015-01-01_00:50:32 | 86.6 | 69.8 |
| 2015-01-01_00:50:33 | 87.3 | 69.7 |
| 2015-01-01_00:50:34 | 87 | 69.7 |
| 2015-01-01_00:50:35 | 87.2 | 69.7 |
| 2015-01-01_00:50:36 | 87 | 69.7 |
| 2015-01-01_00:50:37 | 86.8 | 69.7 |
| 2015-01-01_00:50:38 | 86.8 | 69.7 |
| 2015-01-01_00:50:39 | 86.4 | 69.7 |
| 2015-01-01_00:50:40 | 87.4 | 69.7 |
| 2015-01-01_00:50:41 | 87.3 | 69.6 |
| 2015-01-01_00:50:42 | 87.5 | 69.6 |
| 2015-01-01_00:50:43 | 86.9 | 69.6 |
| 2015-01-01_00:50:44 | 86.9 | 69.6 |
| 2015-01-01_00:50:45 | 86.8 | 69.6 |
| 2015-01-01_00:50:46 | 86.8 | 69.6 |
| 2015-01-01_00:50:47 | 86.8 | 69.6 |
| 2015-01-01_00:50:48 | 86.9 | 69.6 |
| 2015-01-01_00:50:49 | 87.1 | 69.5 |
| 2015-01-01_00:50:50 | 86.8 | 69.5 |
| 2015-01-01_00:50:51 | 86.9 | 69.5 |
| 2015-01-01_00:50:52 | 86.8 | 69.5 |
| 2015-01-01_00:50:53 | 85.7 | 69.5 |
| 2015-01-01_00:50:54 | 86.8 | 69.5 |
| 2015-01-01_00:50:55 | 86.5 | 69.5 |
| 2015-01-01_00:50:56 | 86.8 | 69.5 |
| 2015-01-01_00:50:57 | 87.1 | 69.5 |
| 2015-01-01_00:50:58 | 86.8 | 69.5 |
| 2015-01-01_00:50:59 | 87.3 | 69.5 |
| 2015-01-01_00:51:00 | 86.9 | 69.5 |
| 2015-01-01_00:51:01 | 86.9 | 69.5 |
| 2015-01-01_00:51:02 | 86.6 | 69.5 |
| 2015-01-01_00:51:03 | 87.3 | 69.5 |
| 2015-01-01_00:51:04 | 87.3 | 69.5 |
| 2015-01-01_00:51:05 | 87.5 | 69.6 |
| 2015-01-01_00:51:06 | 87.7 | 69.6 |
| 2015-01-01_00:51:07 | 87.6 | 69.6 |
| 2015-01-01_00:51:08 | 87.9 | 69.6 |
| 2015-01-01_00:51:09 | 87.7 | 69.6 |
| 2015-01-01_00:51:10 | 88.1 | 69.6 |
| 2015-01-01_00:51:11 | 87.3 | 69.6 |
| 2015-01-01_00:51:12 | 87.9 | 69.6 |
| 2015-01-01_00:51:13 | 88.2 | 69.6 |
| 2015-01-01_00:51:14 | 88.3 | 69.6 |
| 2015-01-01_00:51:15 | 87.8 | 69.6 |
| 2015-01-01_00:51:16 | 86.7 | 69.6 |
| 2015-01-01_00:51:17 | 87 | 69.6 |
| 2015-01-01_00:51:18 | 87.6 | 69.6 |
| 2015-01-01_00:51:19 | 87.2 | 69.6 |
| 2015-01-01_00:51:20 | 87 | 69.6 |
| 2015-01-01_00:51:21 | 86.5 | 69.7 |
| 2015-01-01_00:51:22 | 86.7 | 69.7 |
| 2015-01-01_00:51:23 | 86.6 | 69.7 |
| 2015-01-01_00:51:24 | 86 | 69.7 |
| 2015-01-01_00:51:25 | 85.3 | 69.7 |
| 2015-01-01_00:51:26 | 85.8 | 69.7 |
| 2015-01-01_00:51:27 | 85.9 | 69.7 |
| 2015-01-01_00:51:28 | 86.1 | 69.7 |
| 2015-01-01_00:51:29 | 84.6 | 69.7 |
| 2015-01-01_00:51:30 | 85.7 | 69.7 |
| 2015-01-01_00:51:31 | 85.6 | 69.7 |
| 2015-01-01_00:51:32 | 86.1 | 69.7 |
| 2015-01-01_00:51:33 | 86.2 | 69.7 |
| 2015-01-01_00:51:34 | 86.7 | 69.7 |
| 2015-01-01_00:51:35 | 86.6 | 69.7 |
| 2015-01-01_00:51:36 | 86.6 | 69.7 |
| 2015-01-01_00:51:37 | 86.3 | 69.8 |
| 2015-01-01_00:51:38 | 86.6 | 69.8 |
| 2015-01-01_00:51:39 | 86.5 | 69.8 |
| 2015-01-01_00:51:40 | 86.5 | 69.8 |
| 2015-01-01_00:51:41 | 86.4 | 69.8 |
| 2015-01-01_00:51:42 | 86.5 | 69.8 |
| 2015-01-01_00:51:43 | 85.7 | 69.8 |
| 2015-01-01_00:51:44 | 86.1 | 69.8 |
| 2015-01-01_00:51:45 | 86.1 | 69.8 |
| 2015-01-01_00:51:46 | 86.6 | 69.8 |
| 2015-01-01_00:51:47 | 86.9 | 69.8 |
| 2015-01-01_00:51:48 | 86 | 69.8 |
| 2015-01-01_00:51:49 | 86.7 | 69.8 |
| 2015-01-01_00:51:50 | 87.1 | 69.8 |
| 2015-01-01_00:51:51 | 87.2 | 69.8 |
| 2015-01-01_00:51:52 | 87.3 | 69.8 |
| 2015-01-01_00:51:53 | 87 | 70 |
| 2015-01-01_00:51:54 | 86.5 | 70 |
| 2015-01-01_00:51:55 | 87.3 | 70 |
| 2015-01-01_00:51:56 | 87.3 | 70 |
| 2015-01-01_00:51:57 | 87.9 | 70 |
| 2015-01-01_00:51:58 | 87.2 | 70 |
| 2015-01-01_00:51:59 | 87.7 | 70 |
| 2015-01-01_00:52:00 | 88.2 | 70 |
| 2015-01-01_00:52:01 | 88.1 | 70 |
| 2015-01-01_00:52:02 | 87.3 | 70 |
| 2015-01-01_00:52:03 | 87.8 | 70 |
| 2015-01-01_00:52:04 | 87.8 | 70 |
| 2015-01-01_00:52:05 | 88 | 70 |
| 2015-01-01_00:52:06 | 87.6 | 70 |
| 2015-01-01_00:52:07 | 88.4 | 70 |
| 2015-01-01_00:52:08 | 88.5 | 70 |
| 2015-01-01_00:52:09 | 87.5 | 70 |
| 2015-01-01_00:52:10 | 88.5 | 70 |
| 2015-01-01_00:52:11 | 87.7 | 70 |
| 2015-01-01_00:52:12 | 89 | 70 |
| 2015-01-01_00:52:13 | 88.8 | 70 |
| 2015-01-01_00:52:14 | 89 | 70 |
| 2015-01-01_00:52:15 | 88.7 | 70 |
| 2015-01-01_00:52:16 | 88.4 | 70 |
| 2015-01-01_00:52:17 | 88.4 | 70.1 |
| 2015-01-01_00:52:18 | 88.5 | 70.1 |
| 2015-01-01_00:52:19 | 88.5 | 70.1 |
| 2015-01-01_00:52:20 | 88.6 | 70.1 |
| 2015-01-01_00:52:21 | 88.8 | 70.1 |
| 2015-01-01_00:52:22 | 88.1 | 70.1 |
| 2015-01-01_00:52:23 | 88 | 70.1 |
| 2015-01-01_00:52:24 | 87.6 | 70.1 |
| 2015-01-01_00:52:25 | 86.3 | 70 |
| 2015-01-01_00:52:26 | 87.2 | 70 |
| 2015-01-01_00:52:27 | 87.1 | 70 |
| 2015-01-01_00:52:28 | 87.3 | 70 |
| 2015-01-01_00:52:29 | 86.6 | 70 |
| 2015-01-01_00:52:30 | 86.8 | 70 |
| 2015-01-01_00:52:31 | 86.3 | 70 |
| 2015-01-01_00:52:32 | 86.6 | 70 |
| 2015-01-01_00:52:33 | 87 | 70.1 |
| 2015-01-01_00:52:34 | 87 | 70.1 |
| 2015-01-01_00:52:35 | 86.2 | 70.1 |
| 2015-01-01_00:52:36 | 87.3 | 70.1 |
| 2015-01-01_00:52:37 | 86.6 | 70.1 |
| 2015-01-01_00:52:38 | 87.3 | 70.1 |
| 2015-01-01_00:52:39 | 87.1 | 70.1 |
| 2015-01-01_00:52:40 | 87.2 | 70.1 |
| 2015-01-01_00:52:41 | 87.3 | 70.6 |
| 2015-01-01_00:52:42 | 87.1 | 70.6 |
| 2015-01-01_00:52:43 | 87.7 | 70.6 |
| 2015-01-01_00:52:44 | 86.8 | 70.6 |
| 2015-01-01_00:52:45 | 87.3 | 70.6 |
| 2015-01-01_00:52:46 | 87.3 | 70.6 |
| 2015-01-01_00:52:47 | 87.4 | 70.6 |
| 2015-01-01_00:52:48 | 87.4 | 70.6 |
| 2015-01-01_00:52:49 | 87.2 | 71 |
| 2015-01-01_00:52:50 | 87.3 | 71 |
| 2015-01-01_00:52:51 | 86.7 | 71 |
| 2015-01-01_00:52:52 | 87.8 | 71 |
| 2015-01-01_00:52:53 | 86.7 | 71 |
| 2015-01-01_00:52:54 | 87.5 | 71 |
| 2015-01-01_00:52:55 | 87.7 | 71 |
| 2015-01-01_00:52:56 | 86.9 | 71 |
| 2015-01-01_00:52:57 | 87.8 | 71 |
| 2015-01-01_00:52:58 | 87.6 | 71 |
| 2015-01-01_00:52:59 | 88 | 71 |
| 2015-01-01_00:53:00 | 87.3 | 71 |
| 2015-01-01_00:53:01 | 88.2 | 71 |
| 2015-01-01_00:53:02 | 88.1 | 71 |
| 2015-01-01_00:53:03 | 87.7 | 71 |
| 2015-01-01_00:53:04 | 88.2 | 71 |
| 2015-01-01_00:53:05 | 87.2 | 71.1 |
| 2015-01-01_00:53:06 | 86.8 | 71.1 |
| 2015-01-01_00:53:07 | 87.3 | 71.1 |
| 2015-01-01_00:53:08 | 86.6 | 71.1 |
| 2015-01-01_00:53:09 | 86.9 | 71.1 |
| 2015-01-01_00:53:10 | 86.6 | 71.1 |
| 2015-01-01_00:53:11 | 86.1 | 71.1 |
| 2015-01-01_00:53:12 | 86.3 | 71.1 |
| 2015-01-01_00:53:13 | 85.7 | 70.8 |
| 2015-01-01_00:53:14 | 84.2 | 70.8 |
| 2015-01-01_00:53:15 | 85.3 | 70.8 |
| 2015-01-01_00:53:16 | 85.3 | 70.8 |
| 2015-01-01_00:53:17 | 85.9 | 70.8 |
| 2015-01-01_00:53:18 | 85.9 | 70.8 |
| 2015-01-01_00:53:19 | 85.6 | 70.8 |
| 2015-01-01_00:53:20 | 85.2 | 70.8 |
| 2015-01-01_00:53:21 | 85.4 | 70.8 |
| 2015-01-01_00:53:22 | 85.9 | 70.8 |
| 2015-01-01_00:53:23 | 86 | 70.8 |
| 2015-01-01_00:53:24 | 85.5 | 70.8 |
| 2015-01-01_00:53:25 | 86.1 | 70.8 |
| 2015-01-01_00:53:26 | 85.3 | 70.8 |
| 2015-01-01_00:53:27 | 85.8 | 70.8 |
| 2015-01-01_00:53:28 | 85.9 | 70.8 |
| 2015-01-01_00:53:29 | 85.4 | 70.7 |
| 2015-01-01_00:53:30 | 86.7 | 70.7 |
| 2015-01-01_00:53:31 | 86.7 | 70.7 |
| 2015-01-01_00:53:32 | 86.6 | 70.7 |
| 2015-01-01_00:53:33 | 86.8 | 70.7 |
| 2015-01-01_00:53:34 | 86.7 | 70.7 |
| 2015-01-01_00:53:35 | 86.3 | 70.7 |
| 2015-01-01_00:53:36 | 87.1 | 70.7 |
| 2015-01-01_00:53:37 | 86.7 | 70.6 |
| 2015-01-01_00:53:38 | 86.5 | 70.6 |
| 2015-01-01_00:53:39 | 87.4 | 70.6 |
| 2015-01-01_00:53:40 | 87.2 | 70.6 |
| 2015-01-01_00:53:41 | 87.2 | 70.6 |
| 2015-01-01_00:53:42 | 87 | 70.6 |
| 2015-01-01_00:53:43 | 87.7 | 70.6 |
| 2015-01-01_00:53:44 | 87.6 | 70.6 |
| 2015-01-01_00:53:45 | 87.7 | 70.5 |
| 2015-01-01_00:53:46 | 88 | 70.5 |
| 2015-01-01_00:53:47 | 87.8 | 70.5 |
| 2015-01-01_00:53:48 | 86.8 | 70.5 |
| 2015-01-01_00:53:49 | 88.2 | 70.5 |
| 2015-01-01_00:53:50 | 86.7 | 70.5 |
| 2015-01-01_00:53:51 | 87.3 | 70.5 |
| 2015-01-01_00:53:52 | 87.6 | 70.5 |
| 2015-01-01_00:53:53 | 87.4 | 70.3 |
| 2015-01-01_00:53:54 | 86.8 | 70.3 |
| 2015-01-01_00:53:55 | 87.4 | 70.3 |
| 2015-01-01_00:53:56 | 87.5 | 70.3 |
| 2015-01-01_00:53:57 | 87.6 | 70.3 |
| 2015-01-01_00:53:58 | 87.5 | 70.3 |
| 2015-01-01_00:53:59 | 87.6 | 70.3 |
| 2015-01-01_00:54:00 | 87.2 | 70.3 |
| 2015-01-01_00:54:01 | 87.1 | 70.7 |
| 2015-01-01_00:54:02 | 87 | 70.7 |
| 2015-01-01_00:54:03 | 87.1 | 70.7 |
| 2015-01-01_00:54:04 | 87.3 | 70.7 |
| 2015-01-01_00:54:05 | 85.8 | 70.7 |
| 2015-01-01_00:54:06 | 86.1 | 70.7 |
| 2015-01-01_00:54:07 | 86.9 | 70.7 |
| 2015-01-01_00:54:08 | 86.9 | 70.7 |
| 2015-01-01_00:54:09 | 86.8 | 71.3 |
| 2015-01-01_00:54:10 | 85.8 | 71.3 |
| 2015-01-01_00:54:11 | 86.4 | 71.3 |
| 2015-01-01_00:54:12 | 86.4 | 71.3 |
| 2015-01-01_00:54:13 | 86.2 | 71.3 |
| 2015-01-01_00:54:14 | 86.2 | 71.3 |
| 2015-01-01_00:54:15 | 86.3 | 71.3 |
| 2015-01-01_00:54:16 | 86.6 | 71.3 |
| 2015-01-01_00:54:17 | 85.6 | 72 |
| 2015-01-01_00:54:18 | 86.5 | 72 |
| 2015-01-01_00:54:19 | 86.5 | 72 |
| 2015-01-01_00:54:20 | 85.3 | 72 |
| 2015-01-01_00:54:21 | 86.4 | 72 |
| 2015-01-01_00:54:22 | 86.5 | 72 |
| 2015-01-01_00:54:23 | 86.5 | 72 |
| 2015-01-01_00:54:24 | 86.1 | 72 |
| 2015-01-01_00:54:25 | 86.1 | 72.6 |
| 2015-01-01_00:54:26 | 86.2 | 72.6 |
| 2015-01-01_00:54:27 | 85.9 | 72.6 |
| 2015-01-01_00:54:28 | 86.4 | 72.6 |
| 2015-01-01_00:54:29 | 86.2 | 72.6 |
| 2015-01-01_00:54:30 | 86.4 | 72.6 |
| 2015-01-01_00:54:31 | 85.7 | 72.6 |
| 2015-01-01_00:54:32 | 86.4 | 72.6 |
| 2015-01-01_00:54:33 | 85.6 | 73.1 |
| 2015-01-01_00:54:34 | 86.1 | 73.1 |
| 2015-01-01_00:54:35 | 86.3 | 73.1 |
| 2015-01-01_00:54:36 | 86.1 | 73.1 |
| 2015-01-01_00:54:37 | 86.3 | 73.1 |
| 2015-01-01_00:54:38 | 85.9 | 73.1 |
| 2015-01-01_00:54:39 | 86.4 | 73.1 |
| 2015-01-01_00:54:40 | 85.7 | 73.1 |
| 2015-01-01_00:54:41 | 86.3 | 73.5 |
| 2015-01-01_00:54:42 | 86.3 | 73.5 |
| 2015-01-01_00:54:43 | 86.5 | 73.5 |
| 2015-01-01_00:54:44 | 86.5 | 73.5 |
| 2015-01-01_00:54:45 | 86.3 | 73.5 |
| 2015-01-01_00:54:46 | 86.1 | 73.5 |
| 2015-01-01_00:54:47 | 86.1 | 73.5 |
| 2015-01-01_00:54:48 | 86.4 | 73.5 |
| 2015-01-01_00:54:49 | 86.5 | 74 |
| 2015-01-01_00:54:50 | 86.2 | 74 |
| 2015-01-01_00:54:51 | 85.2 | 74 |
| 2015-01-01_00:54:52 | 86.2 | 74 |
| 2015-01-01_00:54:53 | 86.4 | 74 |
| 2015-01-01_00:54:54 | 85.1 | 74 |
| 2015-01-01_00:54:55 | 86.6 | 74 |
| 2015-01-01_00:54:56 | 86.4 | 74 |
| 2015-01-01_00:54:57 | 86.3 | 74.3 |
| 2015-01-01_00:54:58 | 86.5 | 74.3 |
| 2015-01-01_00:54:59 | 86.6 | 74.3 |
| 2015-01-01_00:55:00 | 86.2 | 74.3 |
| 2015-01-01_00:55:01 | 86.5 | 74.3 |
| 2015-01-01_00:55:02 | 86.5 | 74.3 |
| 2015-01-01_00:55:03 | 86.7 | 74.3 |
| 2015-01-01_00:55:04 | 86.3 | 74.3 |
| 2015-01-01_00:55:05 | 85.6 | 74.6 |
| 2015-01-01_00:55:06 | 84.8 | 74.6 |
| 2015-01-01_00:55:07 | 86.3 | 74.6 |
| 2015-01-01_00:55:08 | 86.5 | 74.6 |
| 2015-01-01_00:55:09 | 86.4 | 74.6 |
| 2015-01-01_00:55:10 | 85.7 | 74.6 |
| 2015-01-01_00:55:11 | 86.2 | 74.6 |
| 2015-01-01_00:55:12 | 86.5 | 74.6 |
| 2015-01-01_00:55:13 | 86.3 | 74.8 |
| 2015-01-01_00:55:14 | 86.4 | 74.8 |
| 2015-01-01_00:55:15 | 86.4 | 74.8 |
| 2015-01-01_00:55:16 | 86.2 | 74.8 |
| 2015-01-01_00:55:17 | 86.1 | 74.8 |
| 2015-01-01_00:55:18 | 85.7 | 74.8 |
| 2015-01-01_00:55:19 | 86.1 | 74.8 |
| 2015-01-01_00:55:20 | 86.2 | 74.8 |
| 2015-01-01_00:55:21 | 86.5 | 75.1 |
| 2015-01-01_00:55:22 | 86.5 | 75.1 |
| 2015-01-01_00:55:23 | 86.2 | 75.1 |
| 2015-01-01_00:55:24 | 86.2 | 75.1 |
| 2015-01-01_00:55:25 | 86.5 | 75.1 |
| 2015-01-01_00:55:26 | 86.1 | 75.1 |
| 2015-01-01_00:55:27 | 86 | 75.1 |
| 2015-01-01_00:55:28 | 86.2 | 75.1 |
| 2015-01-01_00:55:29 | 85.8 | 75.3 |
| 2015-01-01_00:55:30 | 86.3 | 75.3 |
| 2015-01-01_00:55:31 | 85.4 | 75.3 |
| 2015-01-01_00:55:32 | 85.5 | 75.3 |
| 2015-01-01_00:55:33 | 86.4 | 75.3 |
| 2015-01-01_00:55:34 | 86.2 | 75.3 |
| 2015-01-01_00:55:35 | 86.6 | 75.3 |
| 2015-01-01_00:55:36 | 86.3 | 75.3 |
| 2015-01-01_00:55:37 | 85.4 | 75.4 |
| 2015-01-01_00:55:38 | 86.2 | 75.4 |
| 2015-01-01_00:55:39 | 86.2 | 75.4 |
| 2015-01-01_00:55:40 | 86.1 | 75.4 |
| 2015-01-01_00:55:41 | 86.3 | 75.4 |
| 2015-01-01_00:55:42 | 86.1 | 75.4 |
| 2015-01-01_00:55:43 | 86.2 | 75.4 |
| 2015-01-01_00:55:44 | 86.3 | 75.4 |
| 2015-01-01_00:55:45 | 85.7 | 75.5 |
| 2015-01-01_00:55:46 | 86.5 | 75.5 |
| 2015-01-01_00:55:47 | 86.3 | 75.5 |
| 2015-01-01_00:55:48 | 86.3 | 75.5 |
| 2015-01-01_00:55:49 | 85.4 | 75.5 |
| 2015-01-01_00:55:50 | 85.9 | 75.5 |
| 2015-01-01_00:55:51 | 86.6 | 75.5 |
| 2015-01-01_00:55:52 | 86.3 | 75.5 |
| 2015-01-01_00:55:53 | 86 | 75.8 |
| 2015-01-01_00:55:54 | 86.3 | 75.8 |
| 2015-01-01_00:55:55 | 85.4 | 75.8 |
| 2015-01-01_00:55:56 | 86.3 | 75.8 |
| 2015-01-01_00:55:57 | 86.3 | 75.8 |
| 2015-01-01_00:55:58 | 86.3 | 75.8 |
| 2015-01-01_00:55:59 | 86.2 | 75.8 |
| 2015-01-01_00:56:00 | 86.3 | 75.8 |
| 2015-01-01_00:56:01 | 86.4 | 76 |
| 2015-01-01_00:56:02 | 86.5 | 76 |
| 2015-01-01_00:56:03 | 86.2 | 76 |
| 2015-01-01_00:56:04 | 86.3 | 76 |
| 2015-01-01_00:56:05 | 86.5 | 76 |
| 2015-01-01_00:56:06 | 86.3 | 76 |
| 2015-01-01_00:56:07 | 86.5 | 76 |
| 2015-01-01_00:56:08 | 86.5 | 76 |
| 2015-01-01_00:56:09 | 86.2 | 76.1 |
| 2015-01-01_00:56:10 | 85.4 | 76.1 |
| 2015-01-01_00:56:11 | 86.7 | 76.1 |
| 2015-01-01_00:56:12 | 85.9 | 76.1 |
| 2015-01-01_00:56:13 | 86.3 | 76.1 |
| 2015-01-01_00:56:14 | 86.2 | 76.1 |
| 2015-01-01_00:56:15 | 86.5 | 76.1 |
| 2015-01-01_00:56:16 | 86.2 | 76.1 |
| 2015-01-01_00:56:17 | 86.6 | 76.3 |
| 2015-01-01_00:56:18 | 86.3 | 76.3 |
| 2015-01-01_00:56:19 | 85.9 | 76.3 |
| 2015-01-01_00:56:20 | 86.6 | 76.3 |
| 2015-01-01_00:56:21 | 86.5 | 76.3 |
| 2015-01-01_00:56:22 | 86.7 | 76.3 |
| 2015-01-01_00:56:23 | 86.7 | 76.3 |
| 2015-01-01_00:56:24 | 86.5 | 76.3 |
| 2015-01-01_00:56:25 | 86.5 | 76.3 |
| 2015-01-01_00:56:26 | 86.5 | 76.3 |
| 2015-01-01_00:56:27 | 86.5 | 76.3 |
| 2015-01-01_00:56:28 | 86.5 | 76.3 |
| 2015-01-01_00:56:29 | 86.6 | 76.3 |
| 2015-01-01_00:56:30 | 86.7 | 76.3 |
| 2015-01-01_00:56:31 | 85.9 | 76.3 |
| 2015-01-01_00:56:32 | 86.5 | 76.3 |
| 2015-01-01_00:56:33 | 86.5 | 76.4 |
| 2015-01-01_00:56:34 | 86.5 | 76.4 |
| 2015-01-01_00:56:35 | 86.3 | 76.4 |
| 2015-01-01_00:56:36 | 86.7 | 76.4 |
| 2015-01-01_00:56:37 | 86.8 | 76.4 |
| 2015-01-01_00:56:38 | 86.5 | 76.4 |
| 2015-01-01_00:56:39 | 86.3 | 76.4 |
| 2015-01-01_00:56:40 | 86.8 | 76.4 |
| 2015-01-01_00:56:41 | 85.7 | 76.5 |
| 2015-01-01_00:56:42 | 86.7 | 76.5 |
| 2015-01-01_00:56:43 | 86.7 | 76.5 |
| 2015-01-01_00:56:44 | 86.5 | 76.5 |
| 2015-01-01_00:56:45 | 86.4 | 76.5 |
| 2015-01-01_00:56:46 | 86.7 | 76.5 |
| 2015-01-01_00:56:47 | 86.6 | 76.5 |
| 2015-01-01_00:56:48 | 86.6 | 76.5 |
| 2015-01-01_00:56:49 | 86.7 | 76.6 |
| 2015-01-01_00:56:50 | 86.6 | 76.6 |
| 2015-01-01_00:56:51 | 86.7 | 76.6 |
| 2015-01-01_00:56:52 | 87.1 | 76.6 |
| 2015-01-01_00:56:53 | 87 | 76.6 |
| 2015-01-01_00:56:54 | 86.9 | 76.6 |
| 2015-01-01_00:56:55 | 86.7 | 76.6 |
| 2015-01-01_00:56:56 | 86.3 | 76.6 |
| 2015-01-01_00:56:57 | 86.6 | 76.6 |
| 2015-01-01_00:56:58 | 86.7 | 76.6 |
| 2015-01-01_00:56:59 | 86.4 | 76.6 |
| 2015-01-01_00:57:00 | 85.7 | 76.6 |
| 2015-01-01_00:57:01 | 86.6 | 76.6 |
| 2015-01-01_00:57:02 | 86.7 | 76.6 |
| 2015-01-01_00:57:03 | 86.7 | 76.6 |
| 2015-01-01_00:57:04 | 85.7 | 76.6 |
| 2015-01-01_00:57:05 | 86.7 | 76.8 |
| 2015-01-01_00:57:06 | 86.9 | 76.8 |
| 2015-01-01_00:57:07 | 87 | 76.8 |
| 2015-01-01_00:57:08 | 86.7 | 76.8 |
| 2015-01-01_00:57:09 | 86.6 | 76.8 |
| 2015-01-01_00:57:10 | 86.6 | 76.8 |
| 2015-01-01_00:57:11 | 86.6 | 76.8 |
| 2015-01-01_00:57:12 | 86.6 | 76.8 |
| 2015-01-01_00:57:13 | 86.7 | 76.9 |
| 2015-01-01_00:57:14 | 87.1 | 76.9 |
| 2015-01-01_00:57:15 | 86 | 76.9 |
| 2015-01-01_00:57:16 | 86.8 | 76.9 |
| 2015-01-01_00:57:17 | 86.9 | 76.9 |
| 2015-01-01_00:57:18 | 86.2 | 76.9 |
| 2015-01-01_00:57:19 | 86.9 | 76.9 |
| 2015-01-01_00:57:20 | 86.8 | 76.9 |
| 2015-01-01_00:57:21 | 86.6 | 76.9 |
| 2015-01-01_00:57:22 | 86.5 | 76.9 |
| 2015-01-01_00:57:23 | 86.9 | 76.9 |
| 2015-01-01_00:57:24 | 86.8 | 76.9 |
| 2015-01-01_00:57:25 | 86.5 | 76.9 |
| 2015-01-01_00:57:26 | 86.8 | 76.9 |
| 2015-01-01_00:57:27 | 85.8 | 76.9 |
| 2015-01-01_00:57:28 | 87 | 76.9 |
| 2015-01-01_00:57:29 | 86.9 | 76.9 |
| 2015-01-01_00:57:30 | 86.7 | 76.9 |
| 2015-01-01_00:57:31 | 86 | 76.9 |
| 2015-01-01_00:57:32 | 86.7 | 76.9 |
| 2015-01-01_00:57:33 | 86.7 | 76.9 |
| 2015-01-01_00:57:34 | 86.4 | 76.9 |
| 2015-01-01_00:57:35 | 86.7 | 76.9 |
| 2015-01-01_00:57:36 | 86.8 | 76.9 |
| 2015-01-01_00:57:37 | 86.6 | 76.9 |
| 2015-01-01_00:57:38 | 86.8 | 76.9 |
| 2015-01-01_00:57:39 | 86.7 | 76.9 |
| 2015-01-01_00:57:40 | 86.7 | 76.9 |
| 2015-01-01_00:57:41 | 86.6 | 76.9 |
| 2015-01-01_00:57:42 | 85.7 | 76.9 |
| 2015-01-01_00:57:43 | 86.6 | 76.9 |
| 2015-01-01_00:57:44 | 86.7 | 76.9 |
| 2015-01-01_00:57:45 | 86.4 | 77.1 |
| 2015-01-01_00:57:46 | 86.6 | 77.1 |
| 2015-01-01_00:57:47 | 86.7 | 77.1 |
| 2015-01-01_00:57:48 | 86.6 | 77.1 |
| 2015-01-01_00:57:49 | 86.6 | 77.1 |
| 2015-01-01_00:57:50 | 86.7 | 77.1 |
| 2015-01-01_00:57:51 | 86.3 | 77.1 |
| 2015-01-01_00:57:52 | 86.7 | 77.1 |
| 2015-01-01_00:57:53 | 86 | 77.2 |
| 2015-01-01_00:57:54 | 86.7 | 77.2 |
| 2015-01-01_00:57:55 | 86.7 | 77.2 |
| 2015-01-01_00:57:56 | 86.4 | 77.2 |
| 2015-01-01_00:57:57 | 86.6 | 77.2 |
| 2015-01-01_00:57:58 | 86.3 | 77.2 |
| 2015-01-01_00:57:59 | 86.6 | 77.2 |
| 2015-01-01_00:58:00 | 86.5 | 77.2 |
| 2015-01-01_00:58:01 | 86.5 | 77.4 |
| 2015-01-01_00:58:02 | 86.6 | 77.4 |
| 2015-01-01_00:58:03 | 86.7 | 77.4 |
| 2015-01-01_00:58:04 | 86.6 | 77.4 |
| 2015-01-01_00:58:05 | 86.3 | 77.4 |
| 2015-01-01_00:58:06 | 86.1 | 77.4 |
| 2015-01-01_00:58:07 | 86.7 | 77.4 |
| 2015-01-01_00:58:08 | 85.8 | 77.4 |
| 2015-01-01_00:58:09 | 86.7 | 77.4 |
| 2015-01-01_00:58:10 | 86.5 | 77.4 |
| 2015-01-01_00:58:11 | 86.5 | 77.4 |
| 2015-01-01_00:58:12 | 85.6 | 77.4 |
| 2015-01-01_00:58:13 | 86.5 | 77.4 |
| 2015-01-01_00:58:14 | 86.3 | 77.4 |
| 2015-01-01_00:58:15 | 85.7 | 77.4 |
| 2015-01-01_00:58:16 | 86.7 | 77.4 |
| 2015-01-01_00:58:17 | 86.8 | 77.3 |
| 2015-01-01_00:58:18 | 85.9 | 77.3 |
| 2015-01-01_00:58:19 | 86.7 | 77.3 |
| 2015-01-01_00:58:20 | 86.7 | 77.3 |
| 2015-01-01_00:58:21 | 85.5 | 77.3 |
| 2015-01-01_00:58:22 | 86.6 | 77.3 |
| 2015-01-01_00:58:23 | 86 | 77.3 |
| 2015-01-01_00:58:24 | 86.5 | 77.3 |
| 2015-01-01_00:58:25 | 86.8 | 77.4 |
| 2015-01-01_00:58:26 | 87 | 77.4 |
| 2015-01-01_00:58:27 | 86.6 | 77.4 |
| 2015-01-01_00:58:28 | 86.6 | 77.4 |
| 2015-01-01_00:58:29 | 86.5 | 77.4 |
| 2015-01-01_00:58:30 | 85.7 | 77.4 |
| 2015-01-01_00:58:31 | 86.5 | 77.4 |
| 2015-01-01_00:58:32 | 86.6 | 77.4 |
| 2015-01-01_00:58:33 | 86.2 | 77.5 |
| 2015-01-01_00:58:34 | 86.6 | 77.5 |
| 2015-01-01_00:58:35 | 86.7 | 77.5 |
| 2015-01-01_00:58:36 | 86.2 | 77.5 |
| 2015-01-01_00:58:37 | 86.5 | 77.5 |
| 2015-01-01_00:58:38 | 86.7 | 77.5 |
| 2015-01-01_00:58:39 | 86.6 | 77.5 |
| 2015-01-01_00:58:40 | 86.7 | 77.5 |
| 2015-01-01_00:58:41 | 86.3 | 77.6 |
| 2015-01-01_00:58:42 | 86.6 | 77.6 |
| 2015-01-01_00:58:43 | 86.7 | 77.6 |
| 2015-01-01_00:58:44 | 86 | 77.6 |
| 2015-01-01_00:58:45 | 86.8 | 77.6 |
| 2015-01-01_00:58:46 | 86.8 | 77.6 |
| 2015-01-01_00:58:47 | 86.6 | 77.6 |
| 2015-01-01_00:58:48 | 86.1 | 77.6 |
| 2015-01-01_00:58:49 | 86.7 | 77.7 |
| 2015-01-01_00:58:50 | 86.6 | 77.7 |
| 2015-01-01_00:58:51 | 86.9 | 77.7 |
| 2015-01-01_00:58:52 | 86.1 | 77.7 |
| 2015-01-01_00:58:53 | 86.8 | 77.7 |
| 2015-01-01_00:58:54 | 86.5 | 77.7 |
| 2015-01-01_00:58:55 | 86.7 | 77.7 |
| 2015-01-01_00:58:56 | 86.8 | 77.7 |
| 2015-01-01_00:58:57 | 86.3 | 77.6 |
| 2015-01-01_00:58:58 | 86.1 | 77.6 |
| 2015-01-01_00:58:59 | 86.5 | 77.6 |
| 2015-01-01_00:59:00 | 86 | 77.6 |
| 2015-01-01_00:59:01 | 86.7 | 77.6 |
| 2015-01-01_00:59:02 | 86.7 | 77.6 |
| 2015-01-01_00:59:03 | 86.8 | 77.6 |
| 2015-01-01_00:59:04 | 86.9 | 77.6 |
| 2015-01-01_00:59:05 | 86.9 | 77.7 |
| 2015-01-01_00:59:06 | 86.8 | 77.7 |
| 2015-01-01_00:59:07 | 87.1 | 77.7 |
| 2015-01-01_00:59:08 | 86.8 | 77.7 |
| 2015-01-01_00:59:09 | 86.8 | 77.7 |
| 2015-01-01_00:59:10 | 86.8 | 77.7 |
| 2015-01-01_00:59:11 | 86.9 | 77.7 |
| 2015-01-01_00:59:12 | 86.9 | 77.7 |
| 2015-01-01_00:59:13 | 87 | 77.8 |
| 2015-01-01_00:59:14 | 86.7 | 77.8 |
| 2015-01-01_00:59:15 | 86.8 | 77.8 |
| 2015-01-01_00:59:16 | 86.9 | 77.8 |
| 2015-01-01_00:59:17 | 86.9 | 77.8 |
| 2015-01-01_00:59:18 | 86.7 | 77.8 |
| 2015-01-01_00:59:19 | 86.8 | 77.8 |
| 2015-01-01_00:59:20 | 86.7 | 77.8 |
| 2015-01-01_00:59:21 | 86.6 | 77.9 |
| 2015-01-01_00:59:22 | 86 | 77.9 |
| 2015-01-01_00:59:23 | 87.4 | 77.9 |
| 2015-01-01_00:59:24 | 87 | 77.9 |
| 2015-01-01_00:59:25 | 85.9 | 77.9 |
| 2015-01-01_00:59:26 | 86.9 | 77.9 |
| 2015-01-01_00:59:27 | 86.3 | 77.9 |
| 2015-01-01_00:59:28 | 86.5 | 77.9 |
| 2015-01-01_00:59:29 | 86.8 | 78 |
| 2015-01-01_00:59:30 | 86.8 | 78 |
| 2015-01-01_00:59:31 | 87 | 78 |
| 2015-01-01_00:59:32 | 86.8 | 78 |
| 2015-01-01_00:59:33 | 86.9 | 78 |
| 2015-01-01_00:59:34 | 86.9 | 78 |
| 2015-01-01_00:59:35 | 87.1 | 78 |
| 2015-01-01_00:59:36 | 86.7 | 78 |
| 2015-01-01_00:59:37 | 86.9 | 78 |
| 2015-01-01_00:59:38 | 87.1 | 78 |
| 2015-01-01_00:59:39 | 86.7 | 78 |
| 2015-01-01_00:59:40 | 86.8 | 78 |
| 2015-01-01_00:59:41 | 86.9 | 78 |
| 2015-01-01_00:59:42 | 86.7 | 78 |
| 2015-01-01_00:59:43 | 86.8 | 78 |
| 2015-01-01_00:59:44 | 86.7 | 78 |
| 2015-01-01_00:59:45 | 86.8 | 78 |
| 2015-01-01_00:59:46 | 86.9 | 78 |
| 2015-01-01_00:59:47 | 86.7 | 78 |
| 2015-01-01_00:59:48 | 86.8 | 78 |
| 2015-01-01_00:59:49 | 87.1 | 78 |
| 2015-01-01_00:59:50 | 86.7 | 78 |
| 2015-01-01_00:59:51 | 86.8 | 78 |
| 2015-01-01_00:59:52 | 86.7 | 78 |
| 2015-01-01_00:59:53 | 86.5 | 78.1 |
| 2015-01-01_00:59:54 | 86.8 | 78.1 |
| 2015-01-01_00:59:55 | 87 | 78.1 |
| 2015-01-01_00:59:56 | 86 | 78.1 |
| 2015-01-01_00:59:57 | 86 | 78.1 |
| 2015-01-01_00:59:58 | 86.7 | 78.1 |
| 2015-01-01_00:59:59 | 85.7 | 78.1 |
| 2015-01-01_01:00:01 | 86.7 | 78.2 |
| 2015-01-01_01:00:02 | 86.8 | 78.2 |
| 2015-01-01_01:00:03 | 86.6 | 78.2 |
| 2015-01-01_01:00:04 | 86.7 | 78.2 |
| 2015-01-01_01:00:05 | 86.6 | 78.2 |
| 2015-01-01_01:00:06 | 86.5 | 78.2 |
| 2015-01-01_01:00:07 | 87 | 78.2 |
| 2015-01-01_01:00:08 | 86.8 | 78.2 |
| 2015-01-01_01:00:09 | 86.1 | 78.2 |
| 2015-01-01_01:00:10 | 85.8 | 78.2 |
| 2015-01-01_01:00:11 | 86.8 | 78.2 |
| 2015-01-01_01:00:12 | 86.6 | 78.2 |
| 2015-01-01_01:00:13 | 86.7 | 78.2 |
| 2015-01-01_01:00:14 | 85.9 | 78.2 |
| 2015-01-01_01:00:15 | 86.7 | 78.2 |
| 2015-01-01_01:00:16 | 86.7 | 78.2 |
| 2015-01-01_01:00:17 | 86.8 | 78.3 |
| 2015-01-01_01:00:18 | 85.9 | 78.3 |
| 2015-01-01_01:00:19 | 86.7 | 78.3 |
| 2015-01-01_01:00:20 | 86.5 | 78.3 |
| 2015-01-01_01:00:21 | 86.7 | 78.3 |
| 2015-01-01_01:00:22 | 86.5 | 78.3 |
| 2015-01-01_01:00:23 | 86.4 | 78.3 |
| 2015-01-01_01:00:24 | 86.6 | 78.3 |
| 2015-01-01_01:00:25 | 86.5 | 78.2 |
| 2015-01-01_01:00:26 | 86.7 | 78.2 |
| 2015-01-01_01:00:27 | 86.9 | 78.2 |
| 2015-01-01_01:00:28 | 86.9 | 78.2 |
| 2015-01-01_01:00:29 | 86.7 | 78.2 |
| 2015-01-01_01:00:30 | 86.4 | 78.2 |
| 2015-01-01_01:00:31 | 86.6 | 78.2 |
| 2015-01-01_01:00:32 | 85.7 | 78.2 |
| 2015-01-01_01:00:33 | 86.7 | 78.2 |
| 2015-01-01_01:00:34 | 86.6 | 78.2 |
| 2015-01-01_01:00:35 | 86.5 | 78.2 |
| 2015-01-01_01:00:36 | 86.4 | 78.2 |
| 2015-01-01_01:00:37 | 86.7 | 78.2 |
| 2015-01-01_01:00:38 | 86.6 | 78.2 |
| 2015-01-01_01:00:39 | 86.8 | 78.2 |
| 2015-01-01_01:00:40 | 86.6 | 78.2 |
| 2015-01-01_01:00:41 | 86.8 | 78.3 |
| 2015-01-01_01:00:42 | 86.4 | 78.3 |
| 2015-01-01_01:00:43 | 86.5 | 78.3 |
| 2015-01-01_01:00:44 | 86.5 | 78.3 |
| 2015-01-01_01:00:45 | 86.6 | 78.3 |
| 2015-01-01_01:00:46 | 86.3 | 78.3 |
| 2015-01-01_01:00:47 | 86.8 | 78.3 |
| 2015-01-01_01:00:48 | 86.6 | 78.3 |
| 2015-01-01_01:00:49 | 86.6 | 78.3 |
| 2015-01-01_01:00:50 | 86.6 | 78.3 |
| 2015-01-01_01:00:51 | 86.6 | 78.3 |
| 2015-01-01_01:00:52 | 86.8 | 78.3 |
| 2015-01-01_01:00:53 | 86.8 | 78.3 |
| 2015-01-01_01:00:54 | 86.2 | 78.3 |
| 2015-01-01_01:00:55 | 86.8 | 78.3 |
| 2015-01-01_01:00:56 | 86.5 | 78.3 |
| 2015-01-01_01:00:57 | 86.2 | 78.1 |
| 2015-01-01_01:00:58 | 86.7 | 78.1 |
| 2015-01-01_01:00:59 | 86.5 | 78.1 |
| 2015-01-01_01:01:00 | 86.7 | 78.1 |
| 2015-01-01_01:01:01 | 86.7 | 78.1 |
| 2015-01-01_01:01:02 | 87 | 78.1 |
| 2015-01-01_01:01:03 | 86.6 | 78.1 |
| 2015-01-01_01:01:04 | 86.6 | 78.1 |
| 2015-01-01_01:01:05 | 86.6 | 78 |
| 2015-01-01_01:01:06 | 86.7 | 78 |
| 2015-01-01_01:01:07 | 86.6 | 78 |
| 2015-01-01_01:01:08 | 86.8 | 78 |
| 2015-01-01_01:01:09 | 86.7 | 78 |
| 2015-01-01_01:01:10 | 86.8 | 78 |
| 2015-01-01_01:01:11 | 86.9 | 78 |
| 2015-01-01_01:01:12 | 86.6 | 78 |
| 2015-01-01_01:01:13 | 85.7 | 77.8 |
| 2015-01-01_01:01:14 | 86.6 | 77.8 |
| 2015-01-01_01:01:15 | 86.7 | 77.8 |
| 2015-01-01_01:01:16 | 86.5 | 77.8 |
| 2015-01-01_01:01:17 | 86.7 | 77.8 |
| 2015-01-01_01:01:18 | 86.6 | 77.8 |
| 2015-01-01_01:01:19 | 85.9 | 77.8 |
| 2015-01-01_01:01:20 | 86.7 | 77.8 |
| 2015-01-01_01:01:21 | 86.4 | 77.8 |
| 2015-01-01_01:01:22 | 86.6 | 77.8 |
| 2015-01-01_01:01:23 | 86.3 | 77.8 |
| 2015-01-01_01:01:24 | 86.6 | 77.8 |
| 2015-01-01_01:01:25 | 86.3 | 77.8 |
| 2015-01-01_01:01:26 | 86.5 | 77.8 |
| 2015-01-01_01:01:27 | 86.7 | 77.8 |
| 2015-01-01_01:01:28 | 86.4 | 77.8 |
| 2015-01-01_01:01:29 | 86.7 | 77.6 |
| 2015-01-01_01:01:30 | 87 | 77.6 |
| 2015-01-01_01:01:31 | 86.5 | 77.6 |
| 2015-01-01_01:01:32 | 86.7 | 77.6 |
| 2015-01-01_01:01:33 | 86.2 | 77.6 |
| 2015-01-01_01:01:34 | 86.2 | 77.6 |
| 2015-01-01_01:01:35 | 85.6 | 77.6 |
| 2015-01-01_01:01:36 | 86.5 | 77.6 |
| 2015-01-01_01:01:37 | 86.7 | 77.6 |
| 2015-01-01_01:01:38 | 86.7 | 77.6 |
| 2015-01-01_01:01:39 | 85.9 | 77.6 |
| 2015-01-01_01:01:40 | 85.9 | 77.6 |
| 2015-01-01_01:01:41 | 86.7 | 77.6 |
| 2015-01-01_01:01:42 | 86.5 | 77.6 |
| 2015-01-01_01:01:43 | 86.7 | 77.6 |
| 2015-01-01_01:01:44 | 86.5 | 77.6 |
| 2015-01-01_01:01:45 | 86.5 | 77.5 |
| 2015-01-01_01:01:46 | 86.4 | 77.5 |
| 2015-01-01_01:01:47 | 85.8 | 77.5 |
| 2015-01-01_01:01:48 | 86.5 | 77.5 |
| 2015-01-01_01:01:49 | 86.1 | 77.5 |
| 2015-01-01_01:01:50 | 86.5 | 77.5 |
| 2015-01-01_01:01:51 | 86.7 | 77.5 |
| 2015-01-01_01:01:52 | 86.4 | 77.5 |
| 2015-01-01_01:01:53 | 86.6 | 77.3 |
| 2015-01-01_01:01:54 | 86.5 | 77.3 |
| 2015-01-01_01:01:55 | 86.5 | 77.3 |
| 2015-01-01_01:01:56 | 86.5 | 77.3 |
| 2015-01-01_01:01:57 | 86.7 | 77.3 |
| 2015-01-01_01:01:58 | 86.7 | 77.3 |
| 2015-01-01_01:01:59 | 86.3 | 77.3 |
| 2015-01-01_01:02:00 | 86.4 | 77.3 |
| 2015-01-01_01:02:01 | 86.1 | 77.3 |
| 2015-01-01_01:02:02 | 86.8 | 77.3 |
| 2015-01-01_01:02:03 | 86.6 | 77.3 |
| 2015-01-01_01:02:04 | 86.6 | 77.3 |
| 2015-01-01_01:02:05 | 86.7 | 77.3 |
| 2015-01-01_01:02:06 | 85.8 | 77.3 |
| 2015-01-01_01:02:07 | 86.3 | 77.3 |
| 2015-01-01_01:02:08 | 86.8 | 77.3 |
| 2015-01-01_01:02:09 | 86.6 | 77.3 |
| 2015-01-01_01:02:10 | 86 | 77.3 |
| 2015-01-01_01:02:11 | 86.8 | 77.3 |
| 2015-01-01_01:02:12 | 86.9 | 77.3 |
| 2015-01-01_01:02:13 | 86.8 | 77.3 |
| 2015-01-01_01:02:14 | 86.8 | 77.3 |
| 2015-01-01_01:02:15 | 86.8 | 77.3 |
| 2015-01-01_01:02:16 | 86.3 | 77.3 |
| 2015-01-01_01:02:17 | 86.5 | 77 |
| 2015-01-01_01:02:18 | 86.7 | 77 |
| 2015-01-01_01:02:19 | 86.8 | 77 |
| 2015-01-01_01:02:20 | 87.1 | 77 |
| 2015-01-01_01:02:21 | 87.2 | 77 |
| 2015-01-01_01:02:22 | 86.9 | 77 |
| 2015-01-01_01:02:23 | 86.1 | 77 |
| 2015-01-01_01:02:24 | 87.2 | 77 |
| 2015-01-01_01:02:25 | 86.9 | 77 |
| 2015-01-01_01:02:26 | 87.1 | 77 |
| 2015-01-01_01:02:27 | 86.1 | 77 |
| 2015-01-01_01:02:28 | 86.9 | 77 |
| 2015-01-01_01:02:29 | 86.9 | 77 |
| 2015-01-01_01:02:30 | 87.1 | 77 |
| 2015-01-01_01:02:31 | 87.2 | 77 |
| 2015-01-01_01:02:32 | 87 | 77 |
| 2015-01-01_01:02:33 | 86.7 | 77 |
| 2015-01-01_01:02:34 | 87 | 77 |
| 2015-01-01_01:02:35 | 87.3 | 77 |
| 2015-01-01_01:02:36 | 87 | 77 |
| 2015-01-01_01:02:37 | 87 | 77 |
| 2015-01-01_01:02:38 | 87.2 | 77 |
| 2015-01-01_01:02:39 | 87.2 | 77 |
| 2015-01-01_01:02:40 | 87.1 | 77 |
| 2015-01-01_01:02:41 | 87.1 | 77 |
| 2015-01-01_01:02:42 | 86.8 | 77 |
| 2015-01-01_01:02:43 | 87.2 | 77 |
| 2015-01-01_01:02:44 | 86.9 | 77 |
| 2015-01-01_01:02:45 | 86.9 | 77 |
| 2015-01-01_01:02:46 | 86.8 | 77 |
| 2015-01-01_01:02:47 | 87.1 | 77 |
| 2015-01-01_01:02:48 | 86.4 | 77 |
| 2015-01-01_01:02:49 | 87.2 | 77 |
| 2015-01-01_01:02:50 | 86.8 | 77 |
| 2015-01-01_01:02:51 | 86.3 | 77 |
| 2015-01-01_01:02:52 | 87.2 | 77 |
| 2015-01-01_01:02:53 | 87 | 77 |
| 2015-01-01_01:02:54 | 86.7 | 77 |
| 2015-01-01_01:02:55 | 86.2 | 77 |
| 2015-01-01_01:02:56 | 87.2 | 77 |
| 2015-01-01_01:02:57 | 87 | 77 |
| 2015-01-01_01:02:58 | 87 | 77 |
| 2015-01-01_01:02:59 | 86.7 | 77 |
| 2015-01-01_01:03:00 | 87.1 | 77 |
| 2015-01-01_01:03:01 | 87.3 | 77 |
| 2015-01-01_01:03:02 | 87.4 | 77 |
| 2015-01-01_01:03:03 | 86.1 | 77 |
| 2015-01-01_01:03:04 | 87.2 | 77 |
| 2015-01-01_01:03:05 | 87.2 | 77 |
| 2015-01-01_01:03:06 | 87.4 | 77 |
| 2015-01-01_01:03:07 | 87.4 | 77 |
| 2015-01-01_01:03:08 | 87.5 | 77 |
| 2015-01-01_01:03:09 | 87.2 | 77 |
| 2015-01-01_01:03:10 | 87.4 | 77 |
| 2015-01-01_01:03:11 | 87.4 | 77 |
| 2015-01-01_01:03:12 | 87.3 | 77 |
| 2015-01-01_01:03:13 | 87.4 | 77.1 |
| 2015-01-01_01:03:14 | 87.2 | 77.1 |
| 2015-01-01_01:03:15 | 87.3 | 77.1 |
| 2015-01-01_01:03:16 | 87.5 | 77.1 |
| 2015-01-01_01:03:17 | 87.4 | 77.1 |
| 2015-01-01_01:03:18 | 87.3 | 77.1 |
| 2015-01-01_01:03:19 | 87.1 | 77.1 |
| 2015-01-01_01:03:20 | 87.6 | 77.1 |
| 2015-01-01_01:03:21 | 87.5 | 77.1 |
| 2015-01-01_01:03:22 | 87.8 | 77.1 |
| 2015-01-01_01:03:23 | 87.6 | 77.1 |
| 2015-01-01_01:03:24 | 87.5 | 77.1 |
| 2015-01-01_01:03:25 | 87.7 | 77.1 |
| 2015-01-01_01:03:26 | 87 | 77.1 |
| 2015-01-01_01:03:27 | 87.6 | 77.1 |
| 2015-01-01_01:03:28 | 87.8 | 77.1 |
| 2015-01-01_01:03:29 | 88 | 77.1 |
| 2015-01-01_01:03:30 | 88 | 77.1 |
| 2015-01-01_01:03:31 | 87.5 | 77.1 |
| 2015-01-01_01:03:32 | 87.9 | 77.1 |
| 2015-01-01_01:03:33 | 87.8 | 77.1 |
| 2015-01-01_01:03:34 | 87.8 | 77.1 |
| 2015-01-01_01:03:35 | 87.9 | 77.1 |
| 2015-01-01_01:03:36 | 87.3 | 77.1 |
| 2015-01-01_01:03:37 | 87.8 | 77.3 |
| 2015-01-01_01:03:38 | 87.8 | 77.3 |
| 2015-01-01_01:03:39 | 88.3 | 77.3 |
| 2015-01-01_01:03:40 | 88.1 | 77.3 |
| 2015-01-01_01:03:41 | 88 | 77.3 |
| 2015-01-01_01:03:42 | 87.6 | 77.3 |
| 2015-01-01_01:03:43 | 88 | 77.3 |
| 2015-01-01_01:03:44 | 88.2 | 77.3 |
| 2015-01-01_01:03:45 | 87.3 | 77.3 |
| 2015-01-01_01:03:46 | 87.8 | 77.3 |
| 2015-01-01_01:03:47 | 87.5 | 77.3 |
| 2015-01-01_01:03:48 | 88.4 | 77.3 |
| 2015-01-01_01:03:49 | 88.4 | 77.3 |
| 2015-01-01_01:03:50 | 86.9 | 77.3 |
| 2015-01-01_01:03:51 | 87.6 | 77.3 |
| 2015-01-01_01:03:52 | 88.3 | 77.3 |
| 2015-01-01_01:03:53 | 88.4 | 77.3 |
| 2015-01-01_01:03:54 | 88.3 | 77.3 |
| 2015-01-01_01:03:55 | 87.6 | 77.3 |
| 2015-01-01_01:03:56 | 88.5 | 77.3 |
| 2015-01-01_01:03:57 | 87.5 | 77.3 |
| 2015-01-01_01:03:58 | 88.6 | 77.3 |
| 2015-01-01_01:03:59 | 88.7 | 77.3 |
| 2015-01-01_01:04:00 | 88.8 | 77.3 |
| 2015-01-01_01:04:01 | 88.6 | 77.4 |
| 2015-01-01_01:04:02 | 88.6 | 77.4 |
| 2015-01-01_01:04:03 | 88.5 | 77.4 |
| 2015-01-01_01:04:04 | 89 | 77.4 |
| 2015-01-01_01:04:05 | 88.8 | 77.4 |
| 2015-01-01_01:04:06 | 88.9 | 77.4 |
| 2015-01-01_01:04:07 | 88.5 | 77.4 |
| 2015-01-01_01:04:08 | 88.5 | 77.4 |
| 2015-01-01_01:04:09 | 88.3 | 77.6 |
| 2015-01-01_01:04:10 | 88.6 | 77.6 |
| 2015-01-01_01:04:11 | 88.3 | 77.6 |
| 2015-01-01_01:04:12 | 88.3 | 77.6 |
| 2015-01-01_01:04:13 | 88.1 | 77.6 |
| 2015-01-01_01:04:14 | 88.3 | 77.6 |
| 2015-01-01_01:04:15 | 87.4 | 77.6 |
| 2015-01-01_01:04:16 | 88.1 | 77.6 |
| 2015-01-01_01:04:17 | 87.9 | 77.6 |
| 2015-01-01_01:04:18 | 88 | 77.6 |
| 2015-01-01_01:04:19 | 86.5 | 77.6 |
| 2015-01-01_01:04:20 | 87.7 | 77.6 |
| 2015-01-01_01:04:21 | 86.7 | 77.6 |
| 2015-01-01_01:04:22 | 87.2 | 77.6 |
| 2015-01-01_01:04:23 | 87.4 | 77.6 |
| 2015-01-01_01:04:24 | 87.6 | 77.6 |
| 2015-01-01_01:04:25 | 87.3 | 77.8 |
| 2015-01-01_01:04:26 | 87.4 | 77.8 |
| 2015-01-01_01:04:27 | 86 | 77.8 |
| 2015-01-01_01:04:28 | 86.2 | 77.8 |
| 2015-01-01_01:04:29 | 86.7 | 77.8 |
| 2015-01-01_01:04:30 | 87.3 | 77.8 |
| 2015-01-01_01:04:31 | 87.5 | 77.8 |
| 2015-01-01_01:04:32 | 86.1 | 77.8 |
| 2015-01-01_01:04:33 | 87.6 | 77.9 |
| 2015-01-01_01:04:34 | 87.1 | 77.9 |
| 2015-01-01_01:04:35 | 87.3 | 77.9 |
| 2015-01-01_01:04:36 | 87.4 | 77.9 |
| 2015-01-01_01:04:37 | 87.4 | 77.9 |
| 2015-01-01_01:04:38 | 87.2 | 77.9 |
| 2015-01-01_01:04:39 | 86.9 | 77.9 |
| 2015-01-01_01:04:40 | 87.5 | 77.9 |
| 2015-01-01_01:04:41 | 87.3 | 78 |
| 2015-01-01_01:04:42 | 87.5 | 78 |
| 2015-01-01_01:04:43 | 87.5 | 78 |
| 2015-01-01_01:04:44 | 87.5 | 78 |
| 2015-01-01_01:04:45 | 86.2 | 78 |
| 2015-01-01_01:04:46 | 87.4 | 78 |
| 2015-01-01_01:04:47 | 86.3 | 78 |
| 2015-01-01_01:04:48 | 87.7 | 78 |
| 2015-01-01_01:04:49 | 87 | 78.2 |
| 2015-01-01_01:04:50 | 86.7 | 78.2 |
| 2015-01-01_01:04:51 | 87.5 | 78.2 |
| 2015-01-01_01:04:52 | 86.9 | 78.2 |
| 2015-01-01_01:04:53 | 87.4 | 78.2 |
| 2015-01-01_01:04:54 | 87.8 | 78.2 |
| 2015-01-01_01:04:55 | 87.8 | 78.2 |
| 2015-01-01_01:04:56 | 88.2 | 78.2 |
| 2015-01-01_01:04:57 | 87.6 | 78.3 |
| 2015-01-01_01:04:58 | 87.7 | 78.3 |
| 2015-01-01_01:04:59 | 87.7 | 78.3 |
| 2015-01-01_01:05:00 | 88 | 78.3 |
| 2015-01-01_01:05:01 | 87.2 | 78.3 |
| 2015-01-01_01:05:02 | 88.1 | 78.3 |
| 2015-01-01_01:05:03 | 88.4 | 78.3 |
| 2015-01-01_01:05:04 | 87.8 | 78.3 |
| 2015-01-01_01:05:05 | 87.4 | 78.5 |
| 2015-01-01_01:05:06 | 87.6 | 78.5 |
| 2015-01-01_01:05:07 | 87.8 | 78.5 |
| 2015-01-01_01:05:08 | 88 | 78.5 |
| 2015-01-01_01:05:09 | 87.6 | 78.5 |
| 2015-01-01_01:05:10 | 88.6 | 78.5 |
| 2015-01-01_01:05:11 | 88.4 | 78.5 |
| 2015-01-01_01:05:12 | 89.1 | 78.5 |
| 2015-01-01_01:05:13 | 89.2 | 78.5 |
| 2015-01-01_01:05:14 | 88.3 | 78.5 |
| 2015-01-01_01:05:15 | 89.4 | 78.5 |
| 2015-01-01_01:05:16 | 88.8 | 78.5 |
| 2015-01-01_01:05:17 | 90.2 | 78.5 |
| 2015-01-01_01:05:18 | 88.5 | 78.5 |
| 2015-01-01_01:05:19 | 90.1 | 78.5 |
| 2015-01-01_01:05:20 | 90.3 | 78.5 |
| 2015-01-01_01:05:21 | 89.9 | 78.2 |
| 2015-01-01_01:05:22 | 88.9 | 78.2 |
| 2015-01-01_01:05:23 | 89.3 | 78.2 |
| 2015-01-01_01:05:24 | 87.9 | 78.2 |
| 2015-01-01_01:05:25 | 88.5 | 78.2 |
| 2015-01-01_01:05:26 | 88.2 | 78.2 |
| 2015-01-01_01:05:27 | 87.6 | 78.2 |
| 2015-01-01_01:05:28 | 86.7 | 78.2 |
| 2015-01-01_01:05:29 | 86.8 | 77.4 |
| 2015-01-01_01:05:30 | 86.7 | 77.4 |
| 2015-01-01_01:05:31 | 86.8 | 77.4 |
| 2015-01-01_01:05:32 | 86.7 | 77.4 |
| 2015-01-01_01:05:33 | 86.3 | 77.4 |
| 2015-01-01_01:05:34 | 86.6 | 77.4 |
| 2015-01-01_01:05:35 | 86.2 | 77.4 |
| 2015-01-01_01:05:36 | 86.6 | 77.4 |
| 2015-01-01_01:05:37 | 86.5 | 76.7 |
| 2015-01-01_01:05:38 | 86.3 | 76.7 |
| 2015-01-01_01:05:39 | 86.6 | 76.7 |
| 2015-01-01_01:05:40 | 85.9 | 76.7 |
| 2015-01-01_01:05:41 | 86.5 | 76.7 |
| 2015-01-01_01:05:42 | 86.4 | 76.7 |
| 2015-01-01_01:05:43 | 86.1 | 76.7 |
| 2015-01-01_01:05:44 | 86.9 | 76.7 |
| 2015-01-01_01:05:45 | 86.7 | 76.1 |
| 2015-01-01_01:05:46 | 86.1 | 76.1 |
| 2015-01-01_01:05:47 | 85.5 | 76.1 |
| 2015-01-01_01:05:48 | 87 | 76.1 |
| 2015-01-01_01:05:49 | 86.3 | 76.1 |
| 2015-01-01_01:05:50 | 86 | 76.1 |
| 2015-01-01_01:05:51 | 87.3 | 76.1 |
| 2015-01-01_01:05:52 | 87.2 | 76.1 |
| 2015-01-01_01:05:53 | 86.1 | 75.3 |
| 2015-01-01_01:05:54 | 87.4 | 75.3 |
| 2015-01-01_01:05:55 | 86.8 | 75.3 |
| 2015-01-01_01:05:56 | 87.7 | 75.3 |
| 2015-01-01_01:05:57 | 87.4 | 75.3 |
| 2015-01-01_01:05:58 | 87 | 75.3 |
| 2015-01-01_01:05:59 | 87.6 | 75.3 |
| 2015-01-01_01:06:00 | 87.6 | 75.3 |
| 2015-01-01_01:06:01 | 87.6 | 74.6 |
| 2015-01-01_01:06:02 | 87.4 | 74.6 |
| 2015-01-01_01:06:03 | 88.3 | 74.6 |
| 2015-01-01_01:06:04 | 88.3 | 74.6 |
| 2015-01-01_01:06:05 | 88.4 | 74.6 |
| 2015-01-01_01:06:06 | 88.4 | 74.6 |
| 2015-01-01_01:06:07 | 88.2 | 74.6 |
| 2015-01-01_01:06:08 | 88.6 | 74.6 |
| 2015-01-01_01:06:09 | 88.3 | 74.6 |
| 2015-01-01_01:06:10 | 88 | 74.6 |
| 2015-01-01_01:06:11 | 87.3 | 74.6 |
| 2015-01-01_01:06:12 | 87.5 | 74.6 |
| 2015-01-01_01:06:13 | 87.1 | 74.6 |
| 2015-01-01_01:06:14 | 87.2 | 74.6 |
| 2015-01-01_01:06:15 | 87.2 | 74.6 |
| 2015-01-01_01:06:16 | 86.3 | 74.6 |
| 2015-01-01_01:06:17 | 85.5 | 73.6 |
| 2015-01-01_01:06:18 | 85.9 | 73.6 |
| 2015-01-01_01:06:19 | 86.3 | 73.6 |
| 2015-01-01_01:06:20 | 86 | 73.6 |
| 2015-01-01_01:06:21 | 86.1 | 73.6 |
| 2015-01-01_01:06:22 | 85.6 | 73.6 |
| 2015-01-01_01:06:23 | 85.1 | 73.6 |
| 2015-01-01_01:06:24 | 86.2 | 73.6 |
| 2015-01-01_01:06:25 | 86.6 | 73.3 |
| 2015-01-01_01:06:26 | 85.7 | 73.3 |
| 2015-01-01_01:06:27 | 86.8 | 73.3 |
| 2015-01-01_01:06:28 | 86.5 | 73.3 |
| 2015-01-01_01:06:29 | 86.6 | 73.3 |
| 2015-01-01_01:06:30 | 86.7 | 73.3 |
| 2015-01-01_01:06:31 | 87 | 73.3 |
| 2015-01-01_01:06:32 | 87.2 | 73.3 |
| 2015-01-01_01:06:33 | 87.2 | 73 |
| 2015-01-01_01:06:34 | 87.2 | 73 |
| 2015-01-01_01:06:35 | 87.3 | 73 |
| 2015-01-01_01:06:36 | 86.7 | 73 |
| 2015-01-01_01:06:37 | 87.4 | 73 |
| 2015-01-01_01:06:38 | 87.9 | 73 |
| 2015-01-01_01:06:39 | 86.8 | 73 |
| 2015-01-01_01:06:40 | 87.8 | 73 |
| 2015-01-01_01:06:41 | 88.1 | 72.8 |
| 2015-01-01_01:06:42 | 88 | 72.8 |
| 2015-01-01_01:06:43 | 86.9 | 72.8 |
| 2015-01-01_01:06:44 | 88.3 | 72.8 |
| 2015-01-01_01:06:45 | 88.4 | 72.8 |
| 2015-01-01_01:06:46 | 88.2 | 72.8 |
| 2015-01-01_01:06:47 | 88.2 | 72.8 |
| 2015-01-01_01:06:48 | 87.9 | 72.8 |
| 2015-01-01_01:06:49 | 87.5 | 72.6 |
| 2015-01-01_01:06:50 | 86.9 | 72.6 |
| 2015-01-01_01:06:51 | 87.4 | 72.6 |
| 2015-01-01_01:06:52 | 86.2 | 72.6 |
| 2015-01-01_01:06:53 | 86 | 72.6 |
| 2015-01-01_01:06:54 | 86.8 | 72.6 |
| 2015-01-01_01:06:55 | 84.9 | 72.6 |
| 2015-01-01_01:06:56 | 86.1 | 72.6 |
| 2015-01-01_01:06:57 | 86.3 | 72.3 |
| 2015-01-01_01:06:58 | 86 | 72.3 |
| 2015-01-01_01:06:59 | 85.9 | 72.3 |
| 2015-01-01_01:07:00 | 86.2 | 72.3 |
| 2015-01-01_01:07:01 | 86.1 | 72.3 |
| 2015-01-01_01:07:02 | 85.7 | 72.3 |
| 2015-01-01_01:07:03 | 86.1 | 72.3 |
| 2015-01-01_01:07:04 | 85.9 | 72.3 |
| 2015-01-01_01:07:05 | 86.3 | 72.1 |
| 2015-01-01_01:07:06 | 85.8 | 72.1 |
| 2015-01-01_01:07:07 | 86.5 | 72.1 |
| 2015-01-01_01:07:08 | 86.5 | 72.1 |
| 2015-01-01_01:07:09 | 86.9 | 72.1 |
| 2015-01-01_01:07:10 | 86.9 | 72.1 |
| 2015-01-01_01:07:11 | 86.7 | 72.1 |
| 2015-01-01_01:07:12 | 87.2 | 72.1 |
| 2015-01-01_01:07:13 | 86.8 | 71.9 |
| 2015-01-01_01:07:14 | 86.9 | 71.9 |
| 2015-01-01_01:07:15 | 85.9 | 71.9 |
| 2015-01-01_01:07:16 | 87.4 | 71.9 |
| 2015-01-01_01:07:17 | 87.6 | 71.9 |
| 2015-01-01_01:07:18 | 86.7 | 71.9 |
| 2015-01-01_01:07:19 | 87.5 | 71.9 |
| 2015-01-01_01:07:20 | 87.5 | 71.9 |
| 2015-01-01_01:07:21 | 87.7 | 71.6 |
| 2015-01-01_01:07:22 | 87.6 | 71.6 |
| 2015-01-01_01:07:23 | 87.7 | 71.6 |
| 2015-01-01_01:07:24 | 88 | 71.6 |
| 2015-01-01_01:07:25 | 87.1 | 71.6 |
| 2015-01-01_01:07:26 | 87.9 | 71.6 |
| 2015-01-01_01:07:27 | 87 | 71.6 |
| 2015-01-01_01:07:28 | 88.2 | 71.6 |
| 2015-01-01_01:07:29 | 87.6 | 71.3 |
| 2015-01-01_01:07:30 | 88 | 71.3 |
| 2015-01-01_01:07:31 | 87.4 | 71.3 |
| 2015-01-01_01:07:32 | 87.3 | 71.3 |
| 2015-01-01_01:07:33 | 87.1 | 71.3 |
| 2015-01-01_01:07:34 | 86.8 | 71.3 |
| 2015-01-01_01:07:35 | 86.9 | 71.3 |
| 2015-01-01_01:07:36 | 85.4 | 71.3 |
| 2015-01-01_01:07:37 | 86.6 | 71.1 |
| 2015-01-01_01:07:38 | 86.4 | 71.1 |
| 2015-01-01_01:07:39 | 85.9 | 71.1 |
| 2015-01-01_01:07:40 | 85.9 | 71.1 |
| 2015-01-01_01:07:41 | 85.9 | 71.1 |
| 2015-01-01_01:07:42 | 85.8 | 71.1 |
| 2015-01-01_01:07:43 | 84.9 | 71.1 |
| 2015-01-01_01:07:44 | 86 | 71.1 |
| 2015-01-01_01:07:45 | 84.8 | 71 |
| 2015-01-01_01:07:46 | 85.1 | 71 |
| 2015-01-01_01:07:47 | 86.2 | 71 |
| 2015-01-01_01:07:48 | 86.2 | 71 |
| 2015-01-01_01:07:49 | 86.6 | 71 |
| 2015-01-01_01:07:50 | 86.1 | 71 |
| 2015-01-01_01:07:51 | 86.5 | 71 |
| 2015-01-01_01:07:52 | 85.7 | 71 |
| 2015-01-01_01:07:53 | 86.6 | 71 |
| 2015-01-01_01:07:54 | 87.1 | 71 |
| 2015-01-01_01:07:55 | 86.4 | 71 |
| 2015-01-01_01:07:56 | 86.4 | 71 |
| 2015-01-01_01:07:57 | 87 | 71 |
| 2015-01-01_01:07:58 | 86.2 | 71 |
| 2015-01-01_01:07:59 | 87 | 71 |
| 2015-01-01_01:08:00 | 87.1 | 71 |
| 2015-01-01_01:08:01 | 87.3 | 70.8 |
| 2015-01-01_01:08:02 | 87.2 | 70.8 |
| 2015-01-01_01:08:03 | 87.6 | 70.8 |
| 2015-01-01_01:08:04 | 87.4 | 70.8 |
| 2015-01-01_01:08:05 | 87.6 | 70.8 |
| 2015-01-01_01:08:06 | 87.5 | 70.8 |
| 2015-01-01_01:08:07 | 87.5 | 70.8 |
| 2015-01-01_01:08:08 | 86.6 | 70.8 |
| 2015-01-01_01:08:09 | 87.7 | 70.6 |
| 2015-01-01_01:08:10 | 87.8 | 70.6 |
| 2015-01-01_01:08:11 | 87.8 | 70.6 |
| 2015-01-01_01:08:12 | 88.1 | 70.6 |
| 2015-01-01_01:08:13 | 88 | 70.6 |
| 2015-01-01_01:08:14 | 88.2 | 70.6 |
| 2015-01-01_01:08:15 | 87.8 | 70.6 |
| 2015-01-01_01:08:16 | 87.5 | 70.6 |
| 2015-01-01_01:08:17 | 87.4 | 70.5 |
| 2015-01-01_01:08:18 | 86.2 | 70.5 |
| 2015-01-01_01:08:19 | 87.3 | 70.5 |
| 2015-01-01_01:08:20 | 87 | 70.5 |
| 2015-01-01_01:08:21 | 86.9 | 70.5 |
| 2015-01-01_01:08:22 | 85.3 | 70.5 |
| 2015-01-01_01:08:23 | 86.4 | 70.5 |
| 2015-01-01_01:08:24 | 86.6 | 70.5 |
| 2015-01-01_01:08:25 | 86.9 | 70.3 |
| 2015-01-01_01:08:26 | 86.2 | 70.3 |
| 2015-01-01_01:08:27 | 85.9 | 70.3 |
| 2015-01-01_01:08:28 | 84.6 | 70.3 |
| 2015-01-01_01:08:29 | 85.4 | 70.3 |
| 2015-01-01_01:08:30 | 85.8 | 70.3 |
| 2015-01-01_01:08:31 | 85.1 | 70.3 |
| 2015-01-01_01:08:32 | 86.1 | 70.3 |
| 2015-01-01_01:08:33 | 86 | 70.1 |
| 2015-01-01_01:08:34 | 86.1 | 70.1 |
| 2015-01-01_01:08:35 | 86.2 | 70.1 |
| 2015-01-01_01:08:36 | 86.4 | 70.1 |
| 2015-01-01_01:08:37 | 85.8 | 70.1 |
| 2015-01-01_01:08:38 | 86.3 | 70.1 |
| 2015-01-01_01:08:39 | 86.7 | 70.1 |
| 2015-01-01_01:08:40 | 86.2 | 70.1 |
| 2015-01-01_01:08:41 | 86.9 | 69.9 |
| 2015-01-01_01:08:42 | 86.3 | 69.9 |
| 2015-01-01_01:08:43 | 86.7 | 69.9 |
| 2015-01-01_01:08:44 | 86.4 | 69.9 |
| 2015-01-01_01:08:45 | 86.9 | 69.9 |
| 2015-01-01_01:08:46 | 86.9 | 69.9 |
| 2015-01-01_01:08:47 | 86.9 | 69.9 |
| 2015-01-01_01:08:48 | 86.7 | 69.9 |
| 2015-01-01_01:08:49 | 87.4 | 69.9 |
| 2015-01-01_01:08:50 | 87.2 | 69.9 |
| 2015-01-01_01:08:51 | 87.2 | 69.9 |
| 2015-01-01_01:08:52 | 87.5 | 69.9 |
| 2015-01-01_01:08:53 | 86 | 69.9 |
| 2015-01-01_01:08:54 | 87 | 69.9 |
| 2015-01-01_01:08:55 | 87.2 | 69.9 |
| 2015-01-01_01:08:56 | 87.9 | 69.9 |
| 2015-01-01_01:08:57 | 86.7 | 69.5 |
| 2015-01-01_01:08:58 | 88.2 | 69.5 |
| 2015-01-01_01:08:59 | 87.9 | 69.5 |
| 2015-01-01_01:09:00 | 87.8 | 69.5 |
| 2015-01-01_01:09:01 | 88.6 | 69.5 |
| 2015-01-01_01:09:02 | 88.4 | 69.5 |
| 2015-01-01_01:09:03 | 88.2 | 69.5 |
| 2015-01-01_01:09:04 | 88.3 | 69.5 |
| 2015-01-01_01:09:05 | 87.7 | 69.5 |
| 2015-01-01_01:09:06 | 87.5 | 69.5 |
| 2015-01-01_01:09:07 | 86.6 | 69.5 |
| 2015-01-01_01:09:08 | 86.5 | 69.5 |
| 2015-01-01_01:09:09 | 86.2 | 69.5 |
| 2015-01-01_01:09:10 | 85.9 | 69.5 |
| 2015-01-01_01:09:11 | 86.2 | 69.5 |
| 2015-01-01_01:09:12 | 85.7 | 69.5 |
| 2015-01-01_01:09:13 | 85.8 | 69.1 |
| 2015-01-01_01:09:14 | 84.9 | 69.1 |
| 2015-01-01_01:09:15 | 85.2 | 69.1 |
| 2015-01-01_01:09:16 | 86 | 69.1 |
| 2015-01-01_01:09:17 | 85.1 | 69.1 |
| 2015-01-01_01:09:18 | 86.3 | 69.1 |
| 2015-01-01_01:09:19 | 86.5 | 69.1 |
| 2015-01-01_01:09:20 | 86.2 | 69.1 |
| 2015-01-01_01:09:21 | 86.7 | 69.1 |
| 2015-01-01_01:09:22 | 86.5 | 69.1 |
| 2015-01-01_01:09:23 | 86.6 | 69.1 |
| 2015-01-01_01:09:24 | 86.8 | 69.1 |
| 2015-01-01_01:09:25 | 87.2 | 69.1 |
| 2015-01-01_01:09:26 | 86.7 | 69.1 |
| 2015-01-01_01:09:27 | 86.8 | 69.1 |
| 2015-01-01_01:09:28 | 87.1 | 69.1 |
| 2015-01-01_01:09:29 | 86.9 | 69.2 |
| 2015-01-01_01:09:30 | 87 | 69.2 |
| 2015-01-01_01:09:31 | 86.5 | 69.2 |
| 2015-01-01_01:09:32 | 87.7 | 69.2 |
| 2015-01-01_01:09:33 | 87.2 | 69.2 |
| 2015-01-01_01:09:34 | 87.7 | 69.2 |
| 2015-01-01_01:09:35 | 87.4 | 69.2 |
| 2015-01-01_01:09:36 | 87 | 69.2 |
| 2015-01-01_01:09:37 | 88.1 | 69.1 |
| 2015-01-01_01:09:38 | 88.2 | 69.1 |
| 2015-01-01_01:09:39 | 87.9 | 69.1 |
| 2015-01-01_01:09:40 | 87.9 | 69.1 |
| 2015-01-01_01:09:41 | 87.9 | 69.1 |
| 2015-01-01_01:09:42 | 87.9 | 69.1 |
| 2015-01-01_01:09:43 | 85.9 | 69.1 |
| 2015-01-01_01:09:44 | 87 | 69.1 |
| 2015-01-01_01:09:45 | 86.5 | 69 |
| 2015-01-01_01:09:46 | 86.1 | 69 |
| 2015-01-01_01:09:47 | 86.3 | 69 |
| 2015-01-01_01:09:48 | 86 | 69 |
| 2015-01-01_01:09:49 | 85.7 | 69 |
| 2015-01-01_01:09:50 | 85.8 | 69 |
| 2015-01-01_01:09:51 | 86 | 69 |
| 2015-01-01_01:09:52 | 86.1 | 69 |
| 2015-01-01_01:09:53 | 86.2 | 69 |
| 2015-01-01_01:09:54 | 86.1 | 69 |
| 2015-01-01_01:09:55 | 86.2 | 69 |
| 2015-01-01_01:09:56 | 86 | 69 |
| 2015-01-01_01:09:57 | 85.8 | 69 |
| 2015-01-01_01:09:58 | 85.6 | 69 |
| 2015-01-01_01:09:59 | 85.9 | 69 |
| 2015-01-01_01:10:00 | 85.5 | 69 |
| 2015-01-01_01:10:01 | 85.9 | 69.1 |
| 2015-01-01_01:10:02 | 85.6 | 69.1 |
| 2015-01-01_01:10:03 | 85.8 | 69.1 |
| 2015-01-01_01:10:04 | 85.9 | 69.1 |
| 2015-01-01_01:10:05 | 85.3 | 69.1 |
| 2015-01-01_01:10:06 | 85.9 | 69.1 |
| 2015-01-01_01:10:07 | 85.6 | 69.1 |
| 2015-01-01_01:10:08 | 85.9 | 69.1 |
| 2015-01-01_01:10:09 | 85.2 | 69.1 |
| 2015-01-01_01:10:10 | 84.5 | 69.1 |
| 2015-01-01_01:10:11 | 86.1 | 69.1 |
| 2015-01-01_01:10:12 | 85.7 | 69.1 |
| 2015-01-01_01:10:13 | 84.8 | 69.1 |
| 2015-01-01_01:10:14 | 86.3 | 69.1 |
| 2015-01-01_01:10:15 | 86 | 69.1 |
| 2015-01-01_01:10:16 | 85.9 | 69.1 |
| 2015-01-01_01:10:17 | 86.3 | 69.1 |
| 2015-01-01_01:10:18 | 86.5 | 69.1 |
| 2015-01-01_01:10:19 | 86.3 | 69.1 |
| 2015-01-01_01:10:20 | 86.8 | 69.1 |
| 2015-01-01_01:10:21 | 85.7 | 69.1 |
| 2015-01-01_01:10:22 | 86.7 | 69.1 |
| 2015-01-01_01:10:23 | 86.9 | 69.1 |
| 2015-01-01_01:10:24 | 86.9 | 69.1 |
| 2015-01-01_01:10:25 | 86.9 | 69 |
| 2015-01-01_01:10:26 | 86.9 | 69 |
| 2015-01-01_01:10:27 | 86.9 | 69 |
| 2015-01-01_01:10:28 | 86.4 | 69 |
| 2015-01-01_01:10:29 | 87.3 | 69 |
| 2015-01-01_01:10:30 | 86.9 | 69 |
| 2015-01-01_01:10:31 | 86.7 | 69 |
| 2015-01-01_01:10:32 | 87.2 | 69 |
| 2015-01-01_01:10:33 | 86.7 | 68.8 |
| 2015-01-01_01:10:34 | 87.3 | 68.8 |
| 2015-01-01_01:10:35 | 87.5 | 68.8 |
| 2015-01-01_01:10:36 | 87.7 | 68.8 |
| 2015-01-01_01:10:37 | 86.1 | 68.8 |
| 2015-01-01_01:10:38 | 87.4 | 68.8 |
| 2015-01-01_01:10:39 | 87.5 | 68.8 |
| 2015-01-01_01:10:40 | 87.8 | 68.8 |
| 2015-01-01_01:10:41 | 87.8 | 68.7 |
| 2015-01-01_01:10:42 | 87.7 | 68.7 |
| 2015-01-01_01:10:43 | 87.9 | 68.7 |
| 2015-01-01_01:10:44 | 87.8 | 68.7 |
| 2015-01-01_01:10:45 | 87.6 | 68.7 |
| 2015-01-01_01:10:46 | 87.3 | 68.7 |
| 2015-01-01_01:10:47 | 87.5 | 68.7 |
| 2015-01-01_01:10:48 | 87 | 68.7 |
| 2015-01-01_01:10:49 | 86.7 | 68.6 |
| 2015-01-01_01:10:50 | 86.8 | 68.6 |
| 2015-01-01_01:10:51 | 85.6 | 68.6 |
| 2015-01-01_01:10:52 | 86.1 | 68.6 |
| 2015-01-01_01:10:53 | 85.6 | 68.6 |
| 2015-01-01_01:10:54 | 85.7 | 68.6 |
| 2015-01-01_01:10:55 | 85.1 | 68.6 |
| 2015-01-01_01:10:56 | 84.7 | 68.6 |
| 2015-01-01_01:10:57 | 85.2 | 68.6 |
| 2015-01-01_01:10:58 | 85 | 68.6 |
| 2015-01-01_01:10:59 | 85.4 | 68.6 |
| 2015-01-01_01:11:00 | 85.5 | 68.6 |
| 2015-01-01_01:11:01 | 85.3 | 68.6 |
| 2015-01-01_01:11:02 | 84.1 | 68.6 |
| 2015-01-01_01:11:03 | 85.3 | 68.6 |
| 2015-01-01_01:11:04 | 86 | 68.6 |
| 2015-01-01_01:11:05 | 85.7 | 69 |
| 2015-01-01_01:11:06 | 85.7 | 69 |
| 2015-01-01_01:11:07 | 85.7 | 69 |
| 2015-01-01_01:11:08 | 85.3 | 69 |
| 2015-01-01_01:11:09 | 86 | 69 |
| 2015-01-01_01:11:10 | 86.1 | 69 |
| 2015-01-01_01:11:11 | 86.1 | 69 |
| 2015-01-01_01:11:12 | 86.1 | 69 |
| 2015-01-01_01:11:13 | 86.2 | 69.3 |
| 2015-01-01_01:11:14 | 86.5 | 69.3 |
| 2015-01-01_01:11:15 | 86.6 | 69.3 |
| 2015-01-01_01:11:16 | 86.2 | 69.3 |
| 2015-01-01_01:11:17 | 86.9 | 69.3 |
| 2015-01-01_01:11:18 | 86.6 | 69.3 |
| 2015-01-01_01:11:19 | 86.5 | 69.3 |
| 2015-01-01_01:11:20 | 86.1 | 69.3 |
| 2015-01-01_01:11:21 | 86.1 | 69.4 |
| 2015-01-01_01:11:22 | 86.6 | 69.4 |
| 2015-01-01_01:11:23 | 86.4 | 69.4 |
| 2015-01-01_01:11:24 | 86.7 | 69.4 |
| 2015-01-01_01:11:25 | 86.9 | 69.4 |
| 2015-01-01_01:11:26 | 86.6 | 69.4 |
| 2015-01-01_01:11:27 | 86.8 | 69.4 |
| 2015-01-01_01:11:28 | 86 | 69.4 |
| 2015-01-01_01:11:29 | 86.9 | 69.5 |
| 2015-01-01_01:11:30 | 86.7 | 69.5 |
| 2015-01-01_01:11:31 | 86.6 | 69.5 |
| 2015-01-01_01:11:32 | 86.7 | 69.5 |
| 2015-01-01_01:11:33 | 87 | 69.5 |
| 2015-01-01_01:11:34 | 87.4 | 69.5 |
| 2015-01-01_01:11:35 | 86.9 | 69.5 |
| 2015-01-01_01:11:36 | 86.8 | 69.5 |
| 2015-01-01_01:11:37 | 87 | 69.5 |
| 2015-01-01_01:11:38 | 86.4 | 69.5 |
| 2015-01-01_01:11:39 | 87.3 | 69.5 |
| 2015-01-01_01:11:40 | 87 | 69.5 |
| 2015-01-01_01:11:41 | 87.5 | 69.5 |
| 2015-01-01_01:11:42 | 87.2 | 69.5 |
| 2015-01-01_01:11:43 | 87.4 | 69.5 |
| 2015-01-01_01:11:44 | 87.2 | 69.5 |
| 2015-01-01_01:11:45 | 86.9 | 69.6 |
| 2015-01-01_01:11:46 | 87.5 | 69.6 |
| 2015-01-01_01:11:47 | 86.1 | 69.6 |
| 2015-01-01_01:11:48 | 87.6 | 69.6 |
| 2015-01-01_01:11:49 | 87.5 | 69.6 |
| 2015-01-01_01:11:50 | 86.9 | 69.6 |
| 2015-01-01_01:11:51 | 87 | 69.6 |
| 2015-01-01_01:11:52 | 87.5 | 69.6 |
| 2015-01-01_01:11:53 | 87.2 | 69.6 |
| 2015-01-01_01:11:54 | 87.1 | 69.6 |
| 2015-01-01_01:11:55 | 86.8 | 69.6 |
| 2015-01-01_01:11:56 | 87.4 | 69.6 |
| 2015-01-01_01:11:57 | 86.4 | 69.6 |
| 2015-01-01_01:11:58 | 86.8 | 69.6 |
| 2015-01-01_01:11:59 | 86.9 | 69.6 |
| 2015-01-01_01:12:00 | 87.4 | 69.6 |
| 2015-01-01_01:12:01 | 87.3 | 69.6 |
| 2015-01-01_01:12:02 | 87 | 69.6 |
| 2015-01-01_01:12:03 | 87.4 | 69.6 |
| 2015-01-01_01:12:04 | 87.7 | 69.6 |
| 2015-01-01_01:12:05 | 87.5 | 69.6 |
| 2015-01-01_01:12:06 | 87.7 | 69.6 |
| 2015-01-01_01:12:07 | 87.8 | 69.6 |
| 2015-01-01_01:12:08 | 87.9 | 69.6 |
| 2015-01-01_01:12:09 | 87.8 | 69.6 |
| 2015-01-01_01:12:10 | 87.6 | 69.6 |
| 2015-01-01_01:12:11 | 87.9 | 69.6 |
| 2015-01-01_01:12:12 | 87.8 | 69.6 |
| 2015-01-01_01:12:13 | 87.2 | 69.6 |
| 2015-01-01_01:12:14 | 87.4 | 69.6 |
| 2015-01-01_01:12:15 | 87.4 | 69.6 |
| 2015-01-01_01:12:16 | 87.4 | 69.6 |
| 2015-01-01_01:12:17 | 86.3 | 69.5 |
| 2015-01-01_01:12:18 | 87 | 69.5 |
| 2015-01-01_01:12:19 | 85.5 | 69.5 |
| 2015-01-01_01:12:20 | 87.4 | 69.5 |
| 2015-01-01_01:12:21 | 86.3 | 69.5 |
| 2015-01-01_01:12:22 | 87.4 | 69.5 |
| 2015-01-01_01:12:23 | 87 | 69.5 |
| 2015-01-01_01:12:24 | 87.3 | 69.5 |
| 2015-01-01_01:12:25 | 87 | 69.4 |
| 2015-01-01_01:12:26 | 87.5 | 69.4 |
| 2015-01-01_01:12:27 | 87.9 | 69.4 |
| 2015-01-01_01:12:28 | 87.8 | 69.4 |
| 2015-01-01_01:12:29 | 87.9 | 69.4 |
| 2015-01-01_01:12:30 | 87.6 | 69.4 |
| 2015-01-01_01:12:31 | 87.8 | 69.4 |
| 2015-01-01_01:12:32 | 87.4 | 69.4 |
| 2015-01-01_01:12:33 | 87.4 | 69.2 |
| 2015-01-01_01:12:34 | 85.6 | 69.2 |
| 2015-01-01_01:12:35 | 87.4 | 69.2 |
| 2015-01-01_01:12:36 | 87.6 | 69.2 |
| 2015-01-01_01:12:37 | 87.4 | 69.2 |
| 2015-01-01_01:12:38 | 87.6 | 69.2 |
| 2015-01-01_01:12:39 | 86.6 | 69.2 |
| 2015-01-01_01:12:40 | 87.3 | 69.2 |
| 2015-01-01_01:12:41 | 86.6 | 68.8 |
| 2015-01-01_01:12:42 | 87.1 | 68.8 |
| 2015-01-01_01:12:43 | 86.9 | 68.8 |
| 2015-01-01_01:12:44 | 86 | 68.8 |
| 2015-01-01_01:12:45 | 85.6 | 68.8 |
| 2015-01-01_01:12:46 | 86.7 | 68.8 |
| 2015-01-01_01:12:47 | 86.5 | 68.8 |
| 2015-01-01_01:12:48 | 86.6 | 68.8 |
| 2015-01-01_01:12:49 | 86.3 | 68.5 |
| 2015-01-01_01:12:50 | 86.4 | 68.5 |
| 2015-01-01_01:12:51 | 86.2 | 68.5 |
| 2015-01-01_01:12:52 | 86.6 | 68.5 |
| 2015-01-01_01:12:53 | 86.7 | 68.5 |
| 2015-01-01_01:12:54 | 86.4 | 68.5 |
| 2015-01-01_01:12:55 | 86.6 | 68.5 |
| 2015-01-01_01:12:56 | 86.8 | 68.5 |
| 2015-01-01_01:12:57 | 87.2 | 68.5 |
| 2015-01-01_01:12:58 | 87.1 | 68.5 |
| 2015-01-01_01:12:59 | 86.7 | 68.5 |
| 2015-01-01_01:13:00 | 87.1 | 68.5 |
| 2015-01-01_01:13:01 | 86.9 | 68.5 |
| 2015-01-01_01:13:02 | 86.6 | 68.5 |
| 2015-01-01_01:13:03 | 87.4 | 68.5 |
| 2015-01-01_01:13:04 | 87.5 | 68.5 |
| 2015-01-01_01:13:05 | 87.4 | 68 |
| 2015-01-01_01:13:06 | 87.6 | 68 |
| 2015-01-01_01:13:07 | 87 | 68 |
| 2015-01-01_01:13:08 | 86.5 | 68 |
| 2015-01-01_01:13:09 | 87.9 | 68 |
| 2015-01-01_01:13:10 | 87.6 | 68 |
| 2015-01-01_01:13:11 | 87.6 | 68 |
| 2015-01-01_01:13:12 | 87.5 | 68 |
| 2015-01-01_01:13:13 | 86.6 | 67.8 |
| 2015-01-01_01:13:14 | 86.5 | 67.8 |
| 2015-01-01_01:13:15 | 87.4 | 67.8 |
| 2015-01-01_01:13:16 | 86.2 | 67.8 |
| 2015-01-01_01:13:17 | 87.1 | 67.8 |
| 2015-01-01_01:13:18 | 85.9 | 67.8 |
| 2015-01-01_01:13:19 | 85.8 | 67.8 |
| 2015-01-01_01:13:20 | 87 | 67.8 |
| 2015-01-01_01:13:21 | 86.8 | 67.8 |
| 2015-01-01_01:13:22 | 85.9 | 67.8 |
| 2015-01-01_01:13:23 | 86.4 | 67.8 |
| 2015-01-01_01:13:24 | 86.6 | 67.8 |
| 2015-01-01_01:13:25 | 86.3 | 67.8 |
| 2015-01-01_01:13:26 | 85.8 | 67.8 |
| 2015-01-01_01:13:27 | 86.5 | 67.8 |
| 2015-01-01_01:13:28 | 86.4 | 67.8 |
| 2015-01-01_01:13:29 | 86.2 | 67.4 |
| 2015-01-01_01:13:30 | 86.5 | 67.4 |
| 2015-01-01_01:13:31 | 86.5 | 67.4 |
| 2015-01-01_01:13:32 | 86.7 | 67.4 |
| 2015-01-01_01:13:33 | 87 | 67.4 |
| 2015-01-01_01:13:34 | 86.8 | 67.4 |
| 2015-01-01_01:13:35 | 86.8 | 67.4 |
| 2015-01-01_01:13:36 | 86.6 | 67.4 |
| 2015-01-01_01:13:37 | 86.8 | 67.3 |
| 2015-01-01_01:13:38 | 86.1 | 67.3 |
| 2015-01-01_01:13:39 | 86.7 | 67.3 |
| 2015-01-01_01:13:40 | 86.5 | 67.3 |
| 2015-01-01_01:13:41 | 86.4 | 67.3 |
| 2015-01-01_01:13:42 | 86.8 | 67.3 |
| 2015-01-01_01:13:43 | 87.4 | 67.3 |
| 2015-01-01_01:13:44 | 86.9 | 67.3 |
| 2015-01-01_01:13:45 | 87.4 | 67.3 |
| 2015-01-01_01:13:46 | 87.4 | 67.3 |
| 2015-01-01_01:13:47 | 86.8 | 67.3 |
| 2015-01-01_01:13:48 | 87.3 | 67.3 |
| 2015-01-01_01:13:49 | 87.6 | 67.3 |
| 2015-01-01_01:13:50 | 86.8 | 67.3 |
| 2015-01-01_01:13:51 | 87.9 | 67.3 |
| 2015-01-01_01:13:52 | 86.8 | 67.3 |
| 2015-01-01_01:13:53 | 87.6 | 67.2 |
| 2015-01-01_01:13:54 | 87 | 67.2 |
| 2015-01-01_01:13:55 | 87.6 | 67.2 |
| 2015-01-01_01:13:56 | 87.5 | 67.2 |
| 2015-01-01_01:13:57 | 87.6 | 67.2 |
| 2015-01-01_01:13:58 | 87.4 | 67.2 |
| 2015-01-01_01:13:59 | 87 | 67.2 |
| 2015-01-01_01:14:00 | 86.9 | 67.2 |
| 2015-01-01_01:14:01 | 86.7 | 67.2 |
| 2015-01-01_01:14:02 | 86.4 | 67.2 |
| 2015-01-01_01:14:03 | 86.6 | 67.2 |
| 2015-01-01_01:14:04 | 86.5 | 67.2 |
| 2015-01-01_01:14:05 | 86.4 | 67.2 |
| 2015-01-01_01:14:06 | 86.5 | 67.2 |
| 2015-01-01_01:14:07 | 86.5 | 67.2 |
| 2015-01-01_01:14:08 | 86.2 | 67.2 |
| 2015-01-01_01:14:09 | 86.3 | 67.2 |
| 2015-01-01_01:14:10 | 86 | 67.2 |
| 2015-01-01_01:14:11 | 85.9 | 67.2 |
| 2015-01-01_01:14:12 | 85.9 | 67.2 |
| 2015-01-01_01:14:13 | 85.9 | 67.2 |
| 2015-01-01_01:14:14 | 85.8 | 67.2 |
| 2015-01-01_01:14:15 | 85.8 | 67.2 |
| 2015-01-01_01:14:16 | 85.8 | 67.2 |
| 2015-01-01_01:14:17 | 85.6 | 67.3 |
| 2015-01-01_01:14:18 | 85.7 | 67.3 |
| 2015-01-01_01:14:19 | 85.6 | 67.3 |
| 2015-01-01_01:14:20 | 85.3 | 67.3 |
| 2015-01-01_01:14:21 | 84.1 | 67.3 |
| 2015-01-01_01:14:22 | 85.1 | 67.3 |
| 2015-01-01_01:14:23 | 85 | 67.3 |
| 2015-01-01_01:14:24 | 85.1 | 67.3 |
| 2015-01-01_01:14:25 | 84.7 | 67.4 |
| 2015-01-01_01:14:26 | 84.9 | 67.4 |
| 2015-01-01_01:14:27 | 84.7 | 67.4 |
| 2015-01-01_01:14:28 | 84 | 67.4 |
| 2015-01-01_01:14:29 | 84.7 | 67.4 |
| 2015-01-01_01:14:30 | 84.7 | 67.4 |
| 2015-01-01_01:14:31 | 85 | 67.4 |
| 2015-01-01_01:14:32 | 84.8 | 67.4 |
| 2015-01-01_01:14:33 | 84.8 | 67.5 |
| 2015-01-01_01:14:34 | 85.1 | 67.5 |
| 2015-01-01_01:14:35 | 84.2 | 67.5 |
| 2015-01-01_01:14:36 | 84.9 | 67.5 |
| 2015-01-01_01:14:37 | 85.2 | 67.5 |
| 2015-01-01_01:14:38 | 85.1 | 67.5 |
| 2015-01-01_01:14:39 | 85.2 | 67.5 |
| 2015-01-01_01:14:40 | 84.5 | 67.5 |
| 2015-01-01_01:14:41 | 85.7 | 68 |
| 2015-01-01_01:14:42 | 86 | 68 |
| 2015-01-01_01:14:43 | 85.9 | 68 |
| 2015-01-01_01:14:44 | 86 | 68 |
| 2015-01-01_01:14:45 | 85.4 | 68 |
| 2015-01-01_01:14:46 | 85.8 | 68 |
| 2015-01-01_01:14:47 | 86.1 | 68 |
| 2015-01-01_01:14:48 | 86.3 | 68 |
| 2015-01-01_01:14:49 | 86.5 | 68.3 |
| 2015-01-01_01:14:50 | 86.1 | 68.3 |
| 2015-01-01_01:14:51 | 86.3 | 68.3 |
| 2015-01-01_01:14:52 | 86.3 | 68.3 |
| 2015-01-01_01:14:53 | 86.5 | 68.3 |
| 2015-01-01_01:14:54 | 86.2 | 68.3 |
| 2015-01-01_01:14:55 | 86.9 | 68.3 |
| 2015-01-01_01:14:56 | 86.8 | 68.3 |
| 2015-01-01_01:14:57 | 86.5 | 68.5 |
| 2015-01-01_01:14:58 | 86.8 | 68.5 |
| 2015-01-01_01:14:59 | 86.9 | 68.5 |
| 2015-01-01_01:15:00 | 86.5 | 68.5 |
| 2015-01-01_01:15:01 | 86.5 | 68.5 |
| 2015-01-01_01:15:02 | 87.3 | 68.5 |
| 2015-01-01_01:15:03 | 87.3 | 68.5 |
| 2015-01-01_01:15:04 | 87.1 | 68.5 |
| 2015-01-01_01:15:05 | 87.3 | 68.5 |
| 2015-01-01_01:15:06 | 87.5 | 68.5 |
| 2015-01-01_01:15:07 | 87 | 68.5 |
| 2015-01-01_01:15:08 | 88 | 68.5 |
| 2015-01-01_01:15:09 | 86.7 | 68.5 |
| 2015-01-01_01:15:10 | 87.8 | 68.5 |
| 2015-01-01_01:15:11 | 87.4 | 68.5 |
| 2015-01-01_01:15:12 | 87.8 | 68.5 |
| 2015-01-01_01:15:13 | 88 | 68.4 |
| 2015-01-01_01:15:14 | 88.3 | 68.4 |
| 2015-01-01_01:15:15 | 86.8 | 68.4 |
| 2015-01-01_01:15:16 | 88.1 | 68.4 |
| 2015-01-01_01:15:17 | 87.9 | 68.4 |
| 2015-01-01_01:15:18 | 88 | 68.4 |
| 2015-01-01_01:15:19 | 88 | 68.4 |
| 2015-01-01_01:15:20 | 88.1 | 68.4 |
| 2015-01-01_01:15:21 | 87.2 | 68.3 |
| 2015-01-01_01:15:22 | 88 | 68.3 |
| 2015-01-01_01:15:23 | 87.5 | 68.3 |
| 2015-01-01_01:15:24 | 87.5 | 68.3 |
| 2015-01-01_01:15:25 | 87.1 | 68.3 |
| 2015-01-01_01:15:26 | 86.4 | 68.3 |
| 2015-01-01_01:15:27 | 86.6 | 68.3 |
| 2015-01-01_01:15:28 | 86.3 | 68.3 |
| 2015-01-01_01:15:29 | 86.1 | 68.3 |
| 2015-01-01_01:15:30 | 86 | 68.3 |
| 2015-01-01_01:15:31 | 85.8 | 68.3 |
| 2015-01-01_01:15:32 | 85.9 | 68.3 |
| 2015-01-01_01:15:33 | 85.6 | 68.3 |
| 2015-01-01_01:15:34 | 85.7 | 68.3 |
| 2015-01-01_01:15:35 | 85.5 | 68.3 |
| 2015-01-01_01:15:36 | 85.2 | 68.3 |
| 2015-01-01_01:15:37 | 84.6 | 68.4 |
| 2015-01-01_01:15:38 | 85.6 | 68.4 |
| 2015-01-01_01:15:39 | 85.3 | 68.4 |
| 2015-01-01_01:15:40 | 85.1 | 68.4 |
| 2015-01-01_01:15:41 | 85.6 | 68.4 |
| 2015-01-01_01:15:42 | 85.2 | 68.4 |
| 2015-01-01_01:15:43 | 85 | 68.4 |
| 2015-01-01_01:15:44 | 85.2 | 68.4 |
| 2015-01-01_01:15:45 | 85.8 | 68.4 |
| 2015-01-01_01:15:46 | 85.8 | 68.4 |
| 2015-01-01_01:15:47 | 85.8 | 68.4 |
| 2015-01-01_01:15:48 | 85.7 | 68.4 |
| 2015-01-01_01:15:49 | 86 | 68.4 |
| 2015-01-01_01:15:50 | 85.9 | 68.4 |
| 2015-01-01_01:15:51 | 86 | 68.4 |
| 2015-01-01_01:15:52 | 86.2 | 68.4 |
| 2015-01-01_01:15:53 | 86.4 | 68.9 |
| 2015-01-01_01:15:54 | 86.1 | 68.9 |
| 2015-01-01_01:15:55 | 86.5 | 68.9 |
| 2015-01-01_01:15:56 | 86.6 | 68.9 |
| 2015-01-01_01:15:57 | 86.6 | 68.9 |
| 2015-01-01_01:15:58 | 86.5 | 68.9 |
| 2015-01-01_01:15:59 | 86.5 | 68.9 |
| 2015-01-01_01:16:00 | 86.4 | 68.9 |
| 2015-01-01_01:16:01 | 85.9 | 68.9 |
| 2015-01-01_01:16:02 | 86 | 68.9 |
| 2015-01-01_01:16:03 | 86.6 | 68.9 |
| 2015-01-01_01:16:04 | 86.7 | 68.9 |
| 2015-01-01_01:16:05 | 86.8 | 68.9 |
| 2015-01-01_01:16:06 | 85.9 | 68.9 |
| 2015-01-01_01:16:07 | 86.8 | 68.9 |
| 2015-01-01_01:16:08 | 86.8 | 68.9 |
| 2015-01-01_01:16:09 | 86.7 | 68.9 |
| 2015-01-01_01:16:10 | 87 | 68.9 |
| 2015-01-01_01:16:11 | 87.2 | 68.9 |
| 2015-01-01_01:16:12 | 86.4 | 68.9 |
| 2015-01-01_01:16:13 | 86.9 | 68.9 |
| 2015-01-01_01:16:14 | 86.4 | 68.9 |
| 2015-01-01_01:16:15 | 87.4 | 68.9 |
| 2015-01-01_01:16:16 | 87.3 | 68.9 |
| 2015-01-01_01:16:17 | 87 | 68.9 |
| 2015-01-01_01:16:18 | 87.7 | 68.9 |
| 2015-01-01_01:16:19 | 87.1 | 68.9 |
| 2015-01-01_01:16:20 | 87.8 | 68.9 |
| 2015-01-01_01:16:21 | 87.8 | 68.9 |
| 2015-01-01_01:16:22 | 87.4 | 68.9 |
| 2015-01-01_01:16:23 | 87 | 68.9 |
| 2015-01-01_01:16:24 | 87.9 | 68.9 |
| 2015-01-01_01:16:25 | 87.7 | 68.8 |
| 2015-01-01_01:16:26 | 87.8 | 68.8 |
| 2015-01-01_01:16:27 | 88.2 | 68.8 |
| 2015-01-01_01:16:28 | 87.5 | 68.8 |
| 2015-01-01_01:16:29 | 88.1 | 68.8 |
| 2015-01-01_01:16:30 | 87.2 | 68.8 |
| 2015-01-01_01:16:31 | 88.1 | 68.8 |
| 2015-01-01_01:16:32 | 88.3 | 68.8 |
| 2015-01-01_01:16:33 | 88 | 68.9 |
| 2015-01-01_01:16:34 | 87.4 | 68.9 |
| 2015-01-01_01:16:35 | 88.1 | 68.9 |
| 2015-01-01_01:16:36 | 88.8 | 68.9 |
| 2015-01-01_01:16:37 | 88.1 | 68.9 |
| 2015-01-01_01:16:38 | 88.4 | 68.9 |
| 2015-01-01_01:16:39 | 87.9 | 68.9 |
| 2015-01-01_01:16:40 | 88.1 | 68.9 |
| 2015-01-01_01:16:41 | 87.8 | 68.9 |
| 2015-01-01_01:16:42 | 87.8 | 68.9 |
| 2015-01-01_01:16:43 | 87.4 | 68.9 |
| 2015-01-01_01:16:44 | 86.8 | 68.9 |
| 2015-01-01_01:16:45 | 87.6 | 68.9 |
| 2015-01-01_01:16:46 | 87.5 | 68.9 |
| 2015-01-01_01:16:47 | 87.5 | 68.9 |
| 2015-01-01_01:16:48 | 85.3 | 68.9 |
| 2015-01-01_01:16:49 | 86.6 | 68.9 |
| 2015-01-01_01:16:50 | 86.8 | 68.9 |
| 2015-01-01_01:16:51 | 86.2 | 68.9 |
| 2015-01-01_01:16:52 | 85.7 | 68.9 |
| 2015-01-01_01:16:53 | 86.5 | 68.9 |
| 2015-01-01_01:16:54 | 85.9 | 68.9 |
| 2015-01-01_01:16:55 | 86.5 | 68.9 |
| 2015-01-01_01:16:56 | 87 | 68.9 |
| 2015-01-01_01:16:57 | 86.9 | 69 |
| 2015-01-01_01:16:58 | 86.7 | 69 |
| 2015-01-01_01:16:59 | 86.7 | 69 |
| 2015-01-01_01:17:00 | 85.6 | 69 |
| 2015-01-01_01:17:01 | 86.9 | 69 |
| 2015-01-01_01:17:02 | 85.8 | 69 |
| 2015-01-01_01:17:03 | 86.5 | 69 |
| 2015-01-01_01:17:04 | 87 | 69 |
| 2015-01-01_01:17:05 | 87.2 | 69 |
| 2015-01-01_01:17:06 | 87.5 | 69 |
| 2015-01-01_01:17:07 | 87.2 | 69 |
| 2015-01-01_01:17:08 | 87.2 | 69 |
| 2015-01-01_01:17:09 | 86.7 | 69 |
| 2015-01-01_01:17:10 | 86.8 | 69 |
| 2015-01-01_01:17:11 | 87.7 | 69 |
| 2015-01-01_01:17:12 | 87.3 | 69 |
| 2015-01-01_01:17:13 | 87.3 | 69.1 |
| 2015-01-01_01:17:14 | 87.3 | 69.1 |
| 2015-01-01_01:17:15 | 87.4 | 69.1 |
| 2015-01-01_01:17:16 | 87.7 | 69.1 |
| 2015-01-01_01:17:17 | 87.5 | 69.1 |
| 2015-01-01_01:17:18 | 87.7 | 69.1 |
| 2015-01-01_01:17:19 | 87.7 | 69.1 |
| 2015-01-01_01:17:20 | 87.6 | 69.1 |
| 2015-01-01_01:17:21 | 87.5 | 69.2 |
| 2015-01-01_01:17:22 | 88 | 69.2 |
| 2015-01-01_01:17:23 | 87.9 | 69.2 |
| 2015-01-01_01:17:24 | 87.6 | 69.2 |
| 2015-01-01_01:17:25 | 88 | 69.2 |
| 2015-01-01_01:17:26 | 88.3 | 69.2 |
| 2015-01-01_01:17:27 | 87.5 | 69.2 |
| 2015-01-01_01:17:28 | 87.9 | 69.2 |
| 2015-01-01_01:17:29 | 87.9 | 69.2 |
| 2015-01-01_01:17:30 | 87.8 | 69.2 |
| 2015-01-01_01:17:31 | 87.9 | 69.2 |
| 2015-01-01_01:17:32 | 87.7 | 69.2 |
| 2015-01-01_01:17:33 | 87.5 | 69.2 |
| 2015-01-01_01:17:34 | 86.2 | 69.2 |
| 2015-01-01_01:17:35 | 87.5 | 69.2 |
| 2015-01-01_01:17:36 | 87.6 | 69.2 |
| 2015-01-01_01:17:37 | 87.1 | 69.3 |
| 2015-01-01_01:17:38 | 87.3 | 69.3 |
| 2015-01-01_01:17:39 | 87.1 | 69.3 |
| 2015-01-01_01:17:40 | 87.1 | 69.3 |
| 2015-01-01_01:17:41 | 87.2 | 69.3 |
| 2015-01-01_01:17:42 | 87.2 | 69.3 |
| 2015-01-01_01:17:43 | 87.3 | 69.3 |
| 2015-01-01_01:17:44 | 86.8 | 69.3 |
| 2015-01-01_01:17:45 | 86.8 | 69.3 |
| 2015-01-01_01:17:46 | 87.3 | 69.3 |
| 2015-01-01_01:17:47 | 86.3 | 69.3 |
| 2015-01-01_01:17:48 | 86.9 | 69.3 |
| 2015-01-01_01:17:49 | 86.5 | 69.3 |
| 2015-01-01_01:17:50 | 86.3 | 69.3 |
| 2015-01-01_01:17:51 | 86.5 | 69.3 |
| 2015-01-01_01:17:52 | 86 | 69.3 |
| 2015-01-01_01:17:53 | 86.2 | 69.4 |
| 2015-01-01_01:17:54 | 85.7 | 69.4 |
| 2015-01-01_01:17:55 | 86.2 | 69.4 |
| 2015-01-01_01:17:56 | 86.3 | 69.4 |
| 2015-01-01_01:17:57 | 86.4 | 69.4 |
| 2015-01-01_01:17:58 | 86.1 | 69.4 |
| 2015-01-01_01:17:59 | 86.3 | 69.4 |
| 2015-01-01_01:18:00 | 86.1 | 69.4 |
| 2015-01-01_01:18:01 | 85.4 | 69.9 |
| 2015-01-01_01:18:02 | 86.2 | 69.9 |
| 2015-01-01_01:18:03 | 85.3 | 69.9 |
| 2015-01-01_01:18:04 | 86.3 | 69.9 |
| 2015-01-01_01:18:05 | 86.3 | 69.9 |
| 2015-01-01_01:18:06 | 86.4 | 69.9 |
| 2015-01-01_01:18:07 | 86.4 | 69.9 |
| 2015-01-01_01:18:08 | 86.3 | 69.9 |
| 2015-01-01_01:18:09 | 86.5 | 70.6 |
| 2015-01-01_01:18:10 | 86 | 70.6 |
| 2015-01-01_01:18:11 | 86.3 | 70.6 |
| 2015-01-01_01:18:12 | 86.5 | 70.6 |
| 2015-01-01_01:18:13 | 85.9 | 70.6 |
| 2015-01-01_01:18:14 | 86.9 | 70.6 |
| 2015-01-01_01:18:15 | 86.1 | 70.6 |
| 2015-01-01_01:18:16 | 86.8 | 70.6 |
| 2015-01-01_01:18:17 | 86.4 | 71.2 |
| 2015-01-01_01:18:18 | 86.7 | 71.2 |
| 2015-01-01_01:18:19 | 86.8 | 71.2 |
| 2015-01-01_01:18:20 | 86.7 | 71.2 |
| 2015-01-01_01:18:21 | 87.2 | 71.2 |
| 2015-01-01_01:18:22 | 87.2 | 71.2 |
| 2015-01-01_01:18:23 | 87 | 71.2 |
| 2015-01-01_01:18:24 | 86.9 | 71.2 |
| 2015-01-01_01:18:25 | 87.3 | 71.6 |
| 2015-01-01_01:18:26 | 86.3 | 71.6 |
| 2015-01-01_01:18:27 | 86.6 | 71.6 |
| 2015-01-01_01:18:28 | 87.3 | 71.6 |
| 2015-01-01_01:18:29 | 87.5 | 71.6 |
| 2015-01-01_01:18:30 | 88.3 | 71.6 |
| 2015-01-01_01:18:31 | 87.6 | 71.6 |
| 2015-01-01_01:18:32 | 88.1 | 71.6 |
| 2015-01-01_01:18:33 | 88.1 | 71.6 |
| 2015-01-01_01:18:34 | 87.6 | 71.6 |
| 2015-01-01_01:18:35 | 87.6 | 71.6 |
| 2015-01-01_01:18:36 | 88.1 | 71.6 |
| 2015-01-01_01:18:37 | 88.2 | 71.6 |
| 2015-01-01_01:18:38 | 88.3 | 71.6 |
| 2015-01-01_01:18:39 | 88.6 | 71.6 |
| 2015-01-01_01:18:40 | 88.5 | 71.6 |
| 2015-01-01_01:18:41 | 88.9 | 71.6 |
| 2015-01-01_01:18:42 | 88.9 | 71.6 |
| 2015-01-01_01:18:43 | 88.8 | 71.6 |
| 2015-01-01_01:18:44 | 89 | 71.6 |
| 2015-01-01_01:18:45 | 88.5 | 71.6 |
| 2015-01-01_01:18:46 | 89.2 | 71.6 |
| 2015-01-01_01:18:47 | 88.8 | 71.6 |
| 2015-01-01_01:18:48 | 88.6 | 71.6 |
| 2015-01-01_01:18:49 | 88.1 | 71.5 |
| 2015-01-01_01:18:50 | 87.8 | 71.5 |
| 2015-01-01_01:18:51 | 87.7 | 71.5 |
| 2015-01-01_01:18:52 | 87.3 | 71.5 |
| 2015-01-01_01:18:53 | 87.3 | 71.5 |
| 2015-01-01_01:18:54 | 86.6 | 71.5 |
| 2015-01-01_01:18:55 | 86.8 | 71.5 |
| 2015-01-01_01:18:56 | 86.7 | 71.5 |
| 2015-01-01_01:18:57 | 86.6 | 71.3 |
| 2015-01-01_01:18:58 | 86.6 | 71.3 |
| 2015-01-01_01:18:59 | 86.9 | 71.3 |
| 2015-01-01_01:19:00 | 86.8 | 71.3 |
| 2015-01-01_01:19:01 | 86.7 | 71.3 |
| 2015-01-01_01:19:02 | 87.3 | 71.3 |
| 2015-01-01_01:19:03 | 87 | 71.3 |
| 2015-01-01_01:19:04 | 87.2 | 71.3 |
| 2015-01-01_01:19:05 | 87.6 | 71.3 |
| 2015-01-01_01:19:06 | 87.2 | 71.3 |
| 2015-01-01_01:19:07 | 87.8 | 71.3 |
| 2015-01-01_01:19:08 | 87.9 | 71.3 |
| 2015-01-01_01:19:09 | 88.4 | 71.3 |
| 2015-01-01_01:19:10 | 87.9 | 71.3 |
| 2015-01-01_01:19:11 | 87.5 | 71.3 |
| 2015-01-01_01:19:12 | 88.5 | 71.3 |
| 2015-01-01_01:19:13 | 87.5 | 71.2 |
| 2015-01-01_01:19:14 | 88.4 | 71.2 |
| 2015-01-01_01:19:15 | 88.9 | 71.2 |
| 2015-01-01_01:19:16 | 88.4 | 71.2 |
| 2015-01-01_01:19:17 | 87.9 | 71.2 |
| 2015-01-01_01:19:18 | 88.5 | 71.2 |
| 2015-01-01_01:19:19 | 88.3 | 71.2 |
| 2015-01-01_01:19:20 | 87.8 | 71.2 |
| 2015-01-01_01:19:21 | 87.6 | 71 |
| 2015-01-01_01:19:22 | 86.6 | 71 |
| 2015-01-01_01:19:23 | 86.8 | 71 |
| 2015-01-01_01:19:24 | 85.9 | 71 |
| 2015-01-01_01:19:25 | 86.2 | 71 |
| 2015-01-01_01:19:26 | 86.6 | 71 |
| 2015-01-01_01:19:27 | 86.2 | 71 |
| 2015-01-01_01:19:28 | 86.3 | 71 |
| 2015-01-01_01:19:29 | 86.6 | 71 |
| 2015-01-01_01:19:30 | 86.2 | 71 |
| 2015-01-01_01:19:31 | 86.4 | 71 |
| 2015-01-01_01:19:32 | 86.4 | 71 |
| 2015-01-01_01:19:33 | 86.4 | 71 |
| 2015-01-01_01:19:34 | 86.8 | 71 |
| 2015-01-01_01:19:35 | 86.4 | 71 |
| 2015-01-01_01:19:36 | 86.8 | 71 |
| 2015-01-01_01:19:37 | 86.9 | 70.7 |
| 2015-01-01_01:19:38 | 86.9 | 70.7 |
| 2015-01-01_01:19:39 | 86.6 | 70.7 |
| 2015-01-01_01:19:40 | 86.9 | 70.7 |
| 2015-01-01_01:19:41 | 86.6 | 70.7 |
| 2015-01-01_01:19:42 | 86.8 | 70.7 |
| 2015-01-01_01:19:43 | 86.9 | 70.7 |
| 2015-01-01_01:19:44 | 86.5 | 70.7 |
| 2015-01-01_01:19:45 | 86.5 | 70.6 |
| 2015-01-01_01:19:46 | 86.7 | 70.6 |
| 2015-01-01_01:19:47 | 86.4 | 70.6 |
| 2015-01-01_01:19:48 | 85.8 | 70.6 |
| 2015-01-01_01:19:49 | 85.9 | 70.6 |
| 2015-01-01_01:19:50 | 85.9 | 70.6 |
| 2015-01-01_01:19:51 | 86.2 | 70.6 |
| 2015-01-01_01:19:52 | 85.9 | 70.6 |
| 2015-01-01_01:19:53 | 85.7 | 70.5 |
| 2015-01-01_01:19:54 | 85.7 | 70.5 |
| 2015-01-01_01:19:55 | 86.7 | 70.5 |
| 2015-01-01_01:19:56 | 86.2 | 70.5 |
| 2015-01-01_01:19:57 | 85.3 | 70.5 |
| 2015-01-01_01:19:58 | 86.3 | 70.5 |
| 2015-01-01_01:19:59 | 86.2 | 70.5 |
| 2015-01-01_01:20:00 | 85.6 | 70.5 |
| 2015-01-01_01:20:01 | 86.6 | 70.6 |
| 2015-01-01_01:20:02 | 86.8 | 70.6 |
| 2015-01-01_01:20:03 | 86.6 | 70.6 |
| 2015-01-01_01:20:04 | 86.7 | 70.6 |
| 2015-01-01_01:20:05 | 86.9 | 70.6 |
| 2015-01-01_01:20:06 | 87 | 70.6 |
| 2015-01-01_01:20:07 | 87 | 70.6 |
| 2015-01-01_01:20:08 | 87.3 | 70.6 |
| 2015-01-01_01:20:09 | 86.6 | 70.6 |
| 2015-01-01_01:20:10 | 87.4 | 70.6 |
| 2015-01-01_01:20:11 | 87.6 | 70.6 |
| 2015-01-01_01:20:12 | 87.6 | 70.6 |
| 2015-01-01_01:20:13 | 87.9 | 70.6 |
| 2015-01-01_01:20:14 | 87.5 | 70.6 |
| 2015-01-01_01:20:15 | 87.5 | 70.6 |
| 2015-01-01_01:20:16 | 87.5 | 70.6 |
| 2015-01-01_01:20:17 | 87.6 | 70.6 |
| 2015-01-01_01:20:18 | 87.6 | 70.6 |
| 2015-01-01_01:20:19 | 87.1 | 70.6 |
| 2015-01-01_01:20:20 | 88.3 | 70.6 |
| 2015-01-01_01:20:21 | 87.8 | 70.6 |
| 2015-01-01_01:20:22 | 88.4 | 70.6 |
| 2015-01-01_01:20:23 | 88.2 | 70.6 |
| 2015-01-01_01:20:24 | 88.2 | 70.6 |
| 2015-01-01_01:20:25 | 88.4 | 70.5 |
| 2015-01-01_01:20:26 | 88.5 | 70.5 |
| 2015-01-01_01:20:27 | 88.2 | 70.5 |
| 2015-01-01_01:20:28 | 88.2 | 70.5 |
| 2015-01-01_01:20:29 | 87.8 | 70.5 |
| 2015-01-01_01:20:30 | 88 | 70.5 |
| 2015-01-01_01:20:31 | 87.2 | 70.5 |
| 2015-01-01_01:20:32 | 87.2 | 70.5 |
| 2015-01-01_01:20:33 | 87.1 | 70.3 |
| 2015-01-01_01:20:34 | 86.6 | 70.3 |
| 2015-01-01_01:20:35 | 86.3 | 70.3 |
| 2015-01-01_01:20:36 | 85.7 | 70.3 |
| 2015-01-01_01:20:37 | 85.9 | 70.3 |
| 2015-01-01_01:20:38 | 86 | 70.3 |
| 2015-01-01_01:20:39 | 86.1 | 70.3 |
| 2015-01-01_01:20:40 | 84.8 | 70.3 |
| 2015-01-01_01:20:41 | 86.2 | 70.1 |
| 2015-01-01_01:20:42 | 86.1 | 70.1 |
| 2015-01-01_01:20:43 | 85.9 | 70.1 |
| 2015-01-01_01:20:44 | 86.1 | 70.1 |
| 2015-01-01_01:20:45 | 86.2 | 70.1 |
| 2015-01-01_01:20:46 | 85.4 | 70.1 |
| 2015-01-01_01:20:47 | 85.9 | 70.1 |
| 2015-01-01_01:20:48 | 86.1 | 70.1 |
| 2015-01-01_01:20:49 | 85.8 | 70.1 |
| 2015-01-01_01:20:50 | 85.6 | 70.1 |
| 2015-01-01_01:20:51 | 86.6 | 70.1 |
| 2015-01-01_01:20:52 | 86.6 | 70.1 |
| 2015-01-01_01:20:53 | 86.7 | 70.1 |
| 2015-01-01_01:20:54 | 86.5 | 70.1 |
| 2015-01-01_01:20:55 | 85.3 | 70.1 |
| 2015-01-01_01:20:56 | 86.8 | 70.1 |
| 2015-01-01_01:20:57 | 86.9 | 70.1 |
| 2015-01-01_01:20:58 | 85.6 | 70.1 |
| 2015-01-01_01:20:59 | 86.9 | 70.1 |
| 2015-01-01_01:21:00 | 86.9 | 70.1 |
| 2015-01-01_01:21:01 | 87 | 70.1 |
| 2015-01-01_01:21:02 | 86.9 | 70.1 |
| 2015-01-01_01:21:03 | 86.9 | 70.1 |
| 2015-01-01_01:21:04 | 86.7 | 70.1 |
| 2015-01-01_01:21:05 | 86.8 | 70.1 |
| 2015-01-01_01:21:06 | 86.3 | 70.1 |
| 2015-01-01_01:21:07 | 86.7 | 70.1 |
| 2015-01-01_01:21:08 | 87.1 | 70.1 |
| 2015-01-01_01:21:09 | 87 | 70.1 |
| 2015-01-01_01:21:10 | 86.8 | 70.1 |
| 2015-01-01_01:21:11 | 87 | 70.1 |
| 2015-01-01_01:21:12 | 87.4 | 70.1 |
| 2015-01-01_01:21:13 | 86.9 | 70.1 |
| 2015-01-01_01:21:14 | 87.2 | 70.1 |
| 2015-01-01_01:21:15 | 86.5 | 70.1 |
| 2015-01-01_01:21:16 | 87.4 | 70.1 |
| 2015-01-01_01:21:17 | 87.3 | 70.1 |
| 2015-01-01_01:21:18 | 87.5 | 70.1 |
| 2015-01-01_01:21:19 | 87.2 | 70.1 |
| 2015-01-01_01:21:20 | 87.8 | 70.1 |
| 2015-01-01_01:21:21 | 87.5 | 70.1 |
| 2015-01-01_01:21:22 | 87.9 | 70.1 |
| 2015-01-01_01:21:23 | 87.8 | 70.1 |
| 2015-01-01_01:21:24 | 87.6 | 70.1 |
| 2015-01-01_01:21:25 | 87.7 | 70.1 |
| 2015-01-01_01:21:26 | 87.7 | 70.1 |
| 2015-01-01_01:21:27 | 87.5 | 70.1 |
| 2015-01-01_01:21:28 | 87.8 | 70.1 |
| 2015-01-01_01:21:29 | 87.3 | 70.2 |
| 2015-01-01_01:21:30 | 87.6 | 70.2 |
| 2015-01-01_01:21:31 | 86.7 | 70.2 |
| 2015-01-01_01:21:32 | 87.5 | 70.2 |
| 2015-01-01_01:21:33 | 87.3 | 70.2 |
| 2015-01-01_01:21:34 | 87.3 | 70.2 |
| 2015-01-01_01:21:35 | 87.6 | 70.2 |
| 2015-01-01_01:21:36 | 87.3 | 70.2 |
| 2015-01-01_01:21:37 | 87.3 | 70.3 |
| 2015-01-01_01:21:38 | 86.6 | 70.3 |
| 2015-01-01_01:21:39 | 86.2 | 70.3 |
| 2015-01-01_01:21:40 | 87.4 | 70.3 |
| 2015-01-01_01:21:41 | 86.9 | 70.3 |
| 2015-01-01_01:21:42 | 86.8 | 70.3 |
| 2015-01-01_01:21:43 | 87.5 | 70.3 |
| 2015-01-01_01:21:44 | 87.3 | 70.3 |
| 2015-01-01_01:21:45 | 86.6 | 70.5 |
| 2015-01-01_01:21:46 | 87.6 | 70.5 |
| 2015-01-01_01:21:47 | 87.7 | 70.5 |
| 2015-01-01_01:21:48 | 87.9 | 70.5 |
| 2015-01-01_01:21:49 | 87.5 | 70.5 |
| 2015-01-01_01:21:50 | 87.3 | 70.5 |
| 2015-01-01_01:21:51 | 87.5 | 70.5 |
| 2015-01-01_01:21:52 | 87.8 | 70.5 |
| 2015-01-01_01:21:53 | 87.5 | 70.5 |
| 2015-01-01_01:21:54 | 87.3 | 70.5 |
| 2015-01-01_01:21:55 | 86.7 | 70.5 |
| 2015-01-01_01:21:56 | 87.3 | 70.5 |
| 2015-01-01_01:21:57 | 87.3 | 70.5 |
| 2015-01-01_01:21:58 | 87.5 | 70.5 |
| 2015-01-01_01:21:59 | 87.7 | 70.5 |
| 2015-01-01_01:22:00 | 87.2 | 70.5 |
| 2015-01-01_01:22:01 | 87.4 | 70.5 |
| 2015-01-01_01:22:02 | 87.5 | 70.5 |
| 2015-01-01_01:22:03 | 87.2 | 70.5 |
| 2015-01-01_01:22:04 | 87.4 | 70.5 |
| 2015-01-01_01:22:05 | 87.5 | 70.5 |
| 2015-01-01_01:22:06 | 86.5 | 70.5 |
| 2015-01-01_01:22:07 | 86.9 | 70.5 |
| 2015-01-01_01:22:08 | 86.2 | 70.5 |
| 2015-01-01_01:22:09 | 87.5 | 70.6 |
| 2015-01-01_01:22:10 | 87.7 | 70.6 |
| 2015-01-01_01:22:11 | 87.3 | 70.6 |
| 2015-01-01_01:22:12 | 88 | 70.6 |
| 2015-01-01_01:22:13 | 87.2 | 70.6 |
| 2015-01-01_01:22:14 | 88 | 70.6 |
| 2015-01-01_01:22:15 | 88 | 70.6 |
| 2015-01-01_01:22:16 | 88.1 | 70.6 |
| 2015-01-01_01:22:17 | 88.2 | 70.6 |
| 2015-01-01_01:22:18 | 88.1 | 70.6 |
| 2015-01-01_01:22:19 | 88.2 | 70.6 |
| 2015-01-01_01:22:20 | 88 | 70.6 |
| 2015-01-01_01:22:21 | 88 | 70.6 |
| 2015-01-01_01:22:22 | 88 | 70.6 |
| 2015-01-01_01:22:23 | 87.6 | 70.6 |
| 2015-01-01_01:22:24 | 87.5 | 70.6 |
| 2015-01-01_01:22:25 | 87.4 | 70.5 |
| 2015-01-01_01:22:26 | 87.3 | 70.5 |
| 2015-01-01_01:22:27 | 87.1 | 70.5 |
| 2015-01-01_01:22:28 | 86 | 70.5 |
| 2015-01-01_01:22:29 | 86.5 | 70.5 |
| 2015-01-01_01:22:30 | 86.2 | 70.5 |
| 2015-01-01_01:22:31 | 86.1 | 70.5 |
| 2015-01-01_01:22:32 | 86.2 | 70.5 |
| 2015-01-01_01:22:33 | 85.5 | 70.5 |
| 2015-01-01_01:22:34 | 86.2 | 70.5 |
| 2015-01-01_01:22:35 | 86.1 | 70.5 |
| 2015-01-01_01:22:36 | 85.1 | 70.5 |
| 2015-01-01_01:22:37 | 85.4 | 70.5 |
| 2015-01-01_01:22:38 | 85.8 | 70.5 |
| 2015-01-01_01:22:39 | 86.2 | 70.5 |
| 2015-01-01_01:22:40 | 86.3 | 70.5 |
| 2015-01-01_01:22:41 | 86.4 | 70.5 |
| 2015-01-01_01:22:42 | 86.1 | 70.5 |
| 2015-01-01_01:22:43 | 86 | 70.5 |
| 2015-01-01_01:22:44 | 86.5 | 70.5 |
| 2015-01-01_01:22:45 | 86.3 | 70.5 |
| 2015-01-01_01:22:46 | 85.9 | 70.5 |
| 2015-01-01_01:22:47 | 86.7 | 70.5 |
| 2015-01-01_01:22:48 | 86.5 | 70.5 |
| 2015-01-01_01:22:49 | 86.3 | 70.5 |
| 2015-01-01_01:22:50 | 87 | 70.5 |
| 2015-01-01_01:22:51 | 87 | 70.5 |
| 2015-01-01_01:22:52 | 87 | 70.5 |
| 2015-01-01_01:22:53 | 86.7 | 70.5 |
| 2015-01-01_01:22:54 | 85.8 | 70.5 |
| 2015-01-01_01:22:55 | 86.7 | 70.5 |
| 2015-01-01_01:22:56 | 86.2 | 70.5 |
| 2015-01-01_01:22:57 | 86.7 | 70.5 |
| 2015-01-01_01:22:58 | 87.1 | 70.5 |
| 2015-01-01_01:22:59 | 86.6 | 70.5 |
| 2015-01-01_01:23:00 | 87 | 70.5 |
| 2015-01-01_01:23:01 | 86 | 70.5 |
| 2015-01-01_01:23:02 | 87.3 | 70.5 |
| 2015-01-01_01:23:03 | 86.2 | 70.5 |
| 2015-01-01_01:23:04 | 87.3 | 70.5 |
| 2015-01-01_01:23:05 | 87.2 | 70.5 |
| 2015-01-01_01:23:06 | 86.9 | 70.5 |
| 2015-01-01_01:23:07 | 87 | 70.5 |
| 2015-01-01_01:23:08 | 87.2 | 70.5 |
| 2015-01-01_01:23:09 | 87.3 | 70.5 |
| 2015-01-01_01:23:10 | 86.2 | 70.5 |
| 2015-01-01_01:23:11 | 86.6 | 70.5 |
| 2015-01-01_01:23:12 | 87.4 | 70.5 |
| 2015-01-01_01:23:13 | 86.9 | 70.4 |
| 2015-01-01_01:23:14 | 87.3 | 70.4 |
| 2015-01-01_01:23:15 | 87.1 | 70.4 |
| 2015-01-01_01:23:16 | 87.2 | 70.4 |
| 2015-01-01_01:23:17 | 87.3 | 70.4 |
| 2015-01-01_01:23:18 | 85.9 | 70.4 |
| 2015-01-01_01:23:19 | 87.3 | 70.4 |
| 2015-01-01_01:23:20 | 87.1 | 70.4 |
| 2015-01-01_01:23:21 | 87.3 | 70.3 |
| 2015-01-01_01:23:22 | 87 | 70.3 |
| 2015-01-01_01:23:23 | 87.7 | 70.3 |
| 2015-01-01_01:23:24 | 87.5 | 70.3 |
| 2015-01-01_01:23:25 | 87.5 | 70.3 |
| 2015-01-01_01:23:26 | 86.9 | 70.3 |
| 2015-01-01_01:23:27 | 86.7 | 70.3 |
| 2015-01-01_01:23:28 | 87 | 70.3 |
| 2015-01-01_01:23:29 | 87.5 | 70.3 |
| 2015-01-01_01:23:30 | 87.7 | 70.3 |
| 2015-01-01_01:23:31 | 87.9 | 70.3 |
| 2015-01-01_01:23:32 | 87.8 | 70.3 |
| 2015-01-01_01:23:33 | 87.9 | 70.3 |
| 2015-01-01_01:23:34 | 87.8 | 70.3 |
| 2015-01-01_01:23:35 | 88.1 | 70.3 |
| 2015-01-01_01:23:36 | 88 | 70.3 |
| 2015-01-01_01:23:37 | 88.4 | 70.1 |
| 2015-01-01_01:23:38 | 86.8 | 70.1 |
| 2015-01-01_01:23:39 | 88 | 70.1 |
| 2015-01-01_01:23:40 | 87.8 | 70.1 |
| 2015-01-01_01:23:41 | 87.6 | 70.1 |
| 2015-01-01_01:23:42 | 86.5 | 70.1 |
| 2015-01-01_01:23:43 | 87.4 | 70.1 |
| 2015-01-01_01:23:44 | 87.5 | 70.1 |
| 2015-01-01_01:23:45 | 87.3 | 70.1 |
| 2015-01-01_01:23:46 | 86.7 | 70.1 |
| 2015-01-01_01:23:47 | 86.9 | 70.1 |
| 2015-01-01_01:23:48 | 86 | 70.1 |
| 2015-01-01_01:23:49 | 86.4 | 70.1 |
| 2015-01-01_01:23:50 | 86.5 | 70.1 |
| 2015-01-01_01:23:51 | 86.3 | 70.1 |
| 2015-01-01_01:23:52 | 86.7 | 70.1 |
| 2015-01-01_01:23:53 | 86.3 | 70.1 |
| 2015-01-01_01:23:54 | 86.3 | 70.1 |
| 2015-01-01_01:23:55 | 86.3 | 70.1 |
| 2015-01-01_01:23:56 | 86.5 | 70.1 |
| 2015-01-01_01:23:57 | 85.8 | 70.1 |
| 2015-01-01_01:23:58 | 86.5 | 70.1 |
| 2015-01-01_01:23:59 | 85.8 | 70.1 |
| 2015-01-01_01:24:00 | 84.9 | 70.1 |
| 2015-01-01_01:24:01 | 85.7 | 70.1 |
| 2015-01-01_01:24:02 | 86.1 | 70.1 |
| 2015-01-01_01:24:03 | 85.9 | 70.1 |
| 2015-01-01_01:24:04 | 85.3 | 70.1 |
| 2015-01-01_01:24:05 | 85.9 | 70.1 |
| 2015-01-01_01:24:06 | 86 | 70.1 |
| 2015-01-01_01:24:07 | 86.1 | 70.1 |
| 2015-01-01_01:24:08 | 86.2 | 70.1 |
| 2015-01-01_01:24:09 | 86.2 | 70.3 |
| 2015-01-01_01:24:10 | 86.5 | 70.3 |
| 2015-01-01_01:24:11 | 86.6 | 70.3 |
| 2015-01-01_01:24:12 | 86.3 | 70.3 |
| 2015-01-01_01:24:13 | 86.4 | 70.3 |
| 2015-01-01_01:24:14 | 85.9 | 70.3 |
| 2015-01-01_01:24:15 | 86 | 70.3 |
| 2015-01-01_01:24:16 | 85.7 | 70.3 |
| 2015-01-01_01:24:17 | 85.8 | 70.3 |
| 2015-01-01_01:24:18 | 86.1 | 70.3 |
| 2015-01-01_01:24:19 | 85.4 | 70.3 |
| 2015-01-01_01:24:20 | 85.9 | 70.3 |
| 2015-01-01_01:24:21 | 85.8 | 70.3 |
| 2015-01-01_01:24:22 | 85.9 | 70.3 |
| 2015-01-01_01:24:23 | 85.2 | 70.3 |
| 2015-01-01_01:24:24 | 85.7 | 70.3 |
| 2015-01-01_01:24:25 | 86.2 | 70.8 |
| 2015-01-01_01:24:26 | 85.1 | 70.8 |
| 2015-01-01_01:24:27 | 86.1 | 70.8 |
| 2015-01-01_01:24:28 | 86.1 | 70.8 |
| 2015-01-01_01:24:29 | 86.2 | 70.8 |
| 2015-01-01_01:24:30 | 85.8 | 70.8 |
| 2015-01-01_01:24:31 | 86.4 | 70.8 |
| 2015-01-01_01:24:32 | 85.3 | 70.8 |
| 2015-01-01_01:24:33 | 84.8 | 70.8 |
| 2015-01-01_01:24:34 | 86.5 | 70.8 |
| 2015-01-01_01:24:35 | 86.5 | 70.8 |
| 2015-01-01_01:24:36 | 86.5 | 70.8 |
| 2015-01-01_01:24:37 | 86.6 | 70.8 |
| 2015-01-01_01:24:38 | 86.9 | 70.8 |
| 2015-01-01_01:24:39 | 87 | 70.8 |
| 2015-01-01_01:24:40 | 86.5 | 70.8 |
| 2015-01-01_01:24:41 | 86.7 | 71.6 |
| 2015-01-01_01:24:42 | 86.9 | 71.6 |
| 2015-01-01_01:24:43 | 87.2 | 71.6 |
| 2015-01-01_01:24:44 | 87 | 71.6 |
| 2015-01-01_01:24:45 | 87 | 71.6 |
| 2015-01-01_01:24:46 | 87 | 71.6 |
| 2015-01-01_01:24:47 | 86.9 | 71.6 |
| 2015-01-01_01:24:48 | 87.1 | 71.6 |
| 2015-01-01_01:24:49 | 87.3 | 71.7 |
| 2015-01-01_01:24:50 | 86.8 | 71.7 |
| 2015-01-01_01:24:51 | 86.9 | 71.7 |
| 2015-01-01_01:24:52 | 86.1 | 71.7 |
| 2015-01-01_01:24:53 | 87.4 | 71.7 |
| 2015-01-01_01:24:54 | 87.1 | 71.7 |
| 2015-01-01_01:24:55 | 87.4 | 71.7 |
| 2015-01-01_01:24:56 | 87.5 | 71.7 |
| 2015-01-01_01:24:57 | 87.6 | 71.9 |
| 2015-01-01_01:24:58 | 87.6 | 71.9 |
| 2015-01-01_01:24:59 | 87.6 | 71.9 |
| 2015-01-01_01:25:00 | 87.9 | 71.9 |
| 2015-01-01_01:25:01 | 87.6 | 71.9 |
| 2015-01-01_01:25:02 | 87.9 | 71.9 |
| 2015-01-01_01:25:03 | 87.7 | 71.9 |
| 2015-01-01_01:25:04 | 87.4 | 71.9 |
| 2015-01-01_01:25:05 | 87.4 | 71.9 |
| 2015-01-01_01:25:06 | 87.5 | 71.9 |
| 2015-01-01_01:25:07 | 87.6 | 71.9 |
| 2015-01-01_01:25:08 | 87.5 | 71.9 |
| 2015-01-01_01:25:09 | 87.8 | 71.9 |
| 2015-01-01_01:25:10 | 88.1 | 71.9 |
| 2015-01-01_01:25:11 | 87.6 | 71.9 |
| 2015-01-01_01:25:12 | 87.6 | 71.9 |
| 2015-01-01_01:25:13 | 87.7 | 72.5 |
| 2015-01-01_01:25:14 | 87.7 | 72.5 |
| 2015-01-01_01:25:15 | 87.5 | 72.5 |
| 2015-01-01_01:25:16 | 87.6 | 72.5 |
| 2015-01-01_01:25:17 | 88.1 | 72.5 |
| 2015-01-01_01:25:18 | 87.6 | 72.5 |
| 2015-01-01_01:25:19 | 88.3 | 72.5 |
| 2015-01-01_01:25:20 | 87.7 | 72.5 |
| 2015-01-01_01:25:21 | 88.1 | 73.1 |
| 2015-01-01_01:25:22 | 87.8 | 73.1 |
| 2015-01-01_01:25:23 | 87.8 | 73.1 |
| 2015-01-01_01:25:24 | 88.1 | 73.1 |
| 2015-01-01_01:25:25 | 88 | 73.1 |
| 2015-01-01_01:25:26 | 88.1 | 73.1 |
| 2015-01-01_01:25:27 | 87.5 | 73.1 |
| 2015-01-01_01:25:28 | 87.8 | 73.1 |
| 2015-01-01_01:25:29 | 88 | 73.5 |
| 2015-01-01_01:25:30 | 87.8 | 73.5 |
| 2015-01-01_01:25:31 | 88 | 73.5 |
| 2015-01-01_01:25:32 | 88 | 73.5 |
| 2015-01-01_01:25:33 | 87.8 | 73.5 |
| 2015-01-01_01:25:34 | 88 | 73.5 |
| 2015-01-01_01:25:35 | 87.4 | 73.5 |
| 2015-01-01_01:25:36 | 88 | 73.5 |
| 2015-01-01_01:25:37 | 87.9 | 74 |
| 2015-01-01_01:25:38 | 87.8 | 74 |
| 2015-01-01_01:25:39 | 88.2 | 74 |
| 2015-01-01_01:25:40 | 88 | 74 |
| 2015-01-01_01:25:41 | 87.6 | 74 |
| 2015-01-01_01:25:42 | 88.1 | 74 |
| 2015-01-01_01:25:43 | 87.1 | 74 |
| 2015-01-01_01:25:44 | 87.9 | 74 |
| 2015-01-01_01:25:45 | 87.9 | 74.3 |
| 2015-01-01_01:25:46 | 88 | 74.3 |
| 2015-01-01_01:25:47 | 87.7 | 74.3 |
| 2015-01-01_01:25:48 | 88.1 | 74.3 |
| 2015-01-01_01:25:49 | 87.8 | 74.3 |
| 2015-01-01_01:25:50 | 87.9 | 74.3 |
| 2015-01-01_01:25:51 | 87.8 | 74.3 |
| 2015-01-01_01:25:52 | 87 | 74.3 |
| 2015-01-01_01:25:53 | 87.6 | 74.7 |
| 2015-01-01_01:25:54 | 87.9 | 74.7 |
| 2015-01-01_01:25:55 | 87.8 | 74.7 |
| 2015-01-01_01:25:56 | 87.2 | 74.7 |
| 2015-01-01_01:25:57 | 88.1 | 74.7 |
| 2015-01-01_01:25:58 | 88 | 74.7 |
| 2015-01-01_01:25:59 | 88.1 | 74.7 |
| 2015-01-01_01:26:00 | 87.9 | 74.7 |
| 2015-01-01_01:26:01 | 87.9 | 74.7 |
| 2015-01-01_01:26:02 | 87.6 | 74.7 |
| 2015-01-01_01:26:03 | 87 | 74.7 |
| 2015-01-01_01:26:04 | 86.7 | 74.7 |
| 2015-01-01_01:26:05 | 87.2 | 74.7 |
| 2015-01-01_01:26:06 | 87.8 | 74.7 |
| 2015-01-01_01:26:07 | 87.7 | 74.7 |
| 2015-01-01_01:26:08 | 87.9 | 74.7 |
| 2015-01-01_01:26:09 | 86.3 | 75.3 |
| 2015-01-01_01:26:10 | 87.9 | 75.3 |
| 2015-01-01_01:26:11 | 87.7 | 75.3 |
| 2015-01-01_01:26:12 | 87 | 75.3 |
| 2015-01-01_01:26:13 | 87.9 | 75.3 |
| 2015-01-01_01:26:14 | 87.7 | 75.3 |
| 2015-01-01_01:26:15 | 88.2 | 75.3 |
| 2015-01-01_01:26:16 | 87.4 | 75.3 |
| 2015-01-01_01:26:17 | 86.4 | 75.5 |
| 2015-01-01_01:26:18 | 87.6 | 75.5 |
| 2015-01-01_01:26:19 | 88 | 75.5 |
| 2015-01-01_01:26:20 | 88.3 | 75.5 |
| 2015-01-01_01:26:21 | 88.1 | 75.5 |
| 2015-01-01_01:26:22 | 88.5 | 75.5 |
| 2015-01-01_01:26:23 | 88.5 | 75.5 |
| 2015-01-01_01:26:24 | 88.6 | 75.5 |
| 2015-01-01_01:26:25 | 88.6 | 75.2 |
| 2015-01-01_01:26:26 | 88.7 | 75.2 |
| 2015-01-01_01:26:27 | 88.8 | 75.2 |
| 2015-01-01_01:26:28 | 88.6 | 75.2 |
| 2015-01-01_01:26:29 | 88.6 | 75.2 |
| 2015-01-01_01:26:30 | 88.9 | 75.2 |
| 2015-01-01_01:26:31 | 89 | 75.2 |
| 2015-01-01_01:26:32 | 89 | 75.2 |
| 2015-01-01_01:26:33 | 88.9 | 75.2 |
| 2015-01-01_01:26:34 | 89 | 75.2 |
| 2015-01-01_01:26:35 | 88.9 | 75.2 |
| 2015-01-01_01:26:36 | 88.5 | 75.2 |
| 2015-01-01_01:26:37 | 87.1 | 75.2 |
| 2015-01-01_01:26:38 | 86.5 | 75.2 |
| 2015-01-01_01:26:39 | 88 | 75.2 |
| 2015-01-01_01:26:40 | 87.3 | 75.2 |
| 2015-01-01_01:26:41 | 87.5 | 74.4 |
| 2015-01-01_01:26:42 | 86.7 | 74.4 |
| 2015-01-01_01:26:43 | 85.7 | 74.4 |
| 2015-01-01_01:26:44 | 86.4 | 74.4 |
| 2015-01-01_01:26:45 | 86.3 | 74.4 |
| 2015-01-01_01:26:46 | 84.8 | 74.4 |
| 2015-01-01_01:26:47 | 86.6 | 74.4 |
| 2015-01-01_01:26:48 | 85.1 | 74.4 |
| 2015-01-01_01:26:49 | 86 | 74.2 |
| 2015-01-01_01:26:50 | 86.2 | 74.2 |
| 2015-01-01_01:26:51 | 85.4 | 74.2 |
| 2015-01-01_01:26:52 | 86.7 | 74.2 |
| 2015-01-01_01:26:53 | 86.7 | 74.2 |
| 2015-01-01_01:26:54 | 86.8 | 74.2 |
| 2015-01-01_01:26:55 | 86.4 | 74.2 |
| 2015-01-01_01:26:56 | 86.1 | 74.2 |
| 2015-01-01_01:26:57 | 86.5 | 74.1 |
| 2015-01-01_01:26:58 | 86.5 | 74.1 |
| 2015-01-01_01:26:59 | 84.8 | 74.1 |
| 2015-01-01_01:27:00 | 85.9 | 74.1 |
| 2015-01-01_01:27:01 | 86.4 | 74.1 |
| 2015-01-01_01:27:02 | 86.3 | 74.1 |
| 2015-01-01_01:27:03 | 86.7 | 74.1 |
| 2015-01-01_01:27:04 | 86.6 | 74.1 |
| 2015-01-01_01:27:05 | 86.9 | 74 |
| 2015-01-01_01:27:06 | 86.9 | 74 |
| 2015-01-01_01:27:07 | 86.8 | 74 |
| 2015-01-01_01:27:08 | 86.9 | 74 |
| 2015-01-01_01:27:09 | 86.1 | 74 |
| 2015-01-01_01:27:10 | 86.5 | 74 |
| 2015-01-01_01:27:11 | 86.9 | 74 |
| 2015-01-01_01:27:12 | 87.2 | 74 |
| 2015-01-01_01:27:13 | 87.3 | 73.8 |
| 2015-01-01_01:27:14 | 87 | 73.8 |
| 2015-01-01_01:27:15 | 87.4 | 73.8 |
| 2015-01-01_01:27:16 | 87.4 | 73.8 |
| 2015-01-01_01:27:17 | 87.5 | 73.8 |
| 2015-01-01_01:27:18 | 87.2 | 73.8 |
| 2015-01-01_01:27:19 | 87.2 | 73.8 |
| 2015-01-01_01:27:20 | 87.3 | 73.8 |
| 2015-01-01_01:27:21 | 87.1 | 73.6 |
| 2015-01-01_01:27:22 | 87.3 | 73.6 |
| 2015-01-01_01:27:23 | 86.3 | 73.6 |
| 2015-01-01_01:27:24 | 87 | 73.6 |
| 2015-01-01_01:27:25 | 86.9 | 73.6 |
| 2015-01-01_01:27:26 | 87.2 | 73.6 |
| 2015-01-01_01:27:27 | 87 | 73.6 |
| 2015-01-01_01:27:28 | 86.7 | 73.6 |
| 2015-01-01_01:27:29 | 87 | 73.6 |
| 2015-01-01_01:27:30 | 86.9 | 73.6 |
| 2015-01-01_01:27:31 | 87 | 73.6 |
| 2015-01-01_01:27:32 | 86.6 | 73.6 |
| 2015-01-01_01:27:33 | 86.8 | 73.6 |
| 2015-01-01_01:27:34 | 86.8 | 73.6 |
| 2015-01-01_01:27:35 | 86.7 | 73.6 |
| 2015-01-01_01:27:36 | 86.7 | 73.6 |
| 2015-01-01_01:27:37 | 86.5 | 73.8 |
| 2015-01-01_01:27:38 | 87 | 73.8 |
| 2015-01-01_01:27:39 | 86.7 | 73.8 |
| 2015-01-01_01:27:40 | 87.2 | 73.8 |
| 2015-01-01_01:27:41 | 87 | 73.8 |
| 2015-01-01_01:27:42 | 86.1 | 73.8 |
| 2015-01-01_01:27:43 | 87.2 | 73.8 |
| 2015-01-01_01:27:44 | 86 | 73.8 |
| 2015-01-01_01:27:45 | 87.4 | 74.2 |
| 2015-01-01_01:27:46 | 87.1 | 74.2 |
| 2015-01-01_01:27:47 | 87.4 | 74.2 |
| 2015-01-01_01:27:48 | 86.5 | 74.2 |
| 2015-01-01_01:27:49 | 86.9 | 74.2 |
| 2015-01-01_01:27:50 | 87.4 | 74.2 |
| 2015-01-01_01:27:51 | 87.3 | 74.2 |
| 2015-01-01_01:27:52 | 87.2 | 74.2 |
| 2015-01-01_01:27:53 | 87.5 | 74.6 |
| 2015-01-01_01:27:54 | 87.3 | 74.6 |
| 2015-01-01_01:27:55 | 88 | 74.6 |
| 2015-01-01_01:27:56 | 86.3 | 74.6 |
| 2015-01-01_01:27:57 | 87.9 | 74.6 |
| 2015-01-01_01:27:58 | 87.3 | 74.6 |
| 2015-01-01_01:27:59 | 87.9 | 74.6 |
| 2015-01-01_01:28:00 | 88.1 | 74.6 |
| 2015-01-01_01:28:01 | 88 | 75 |
| 2015-01-01_01:28:02 | 87.9 | 75 |
| 2015-01-01_01:28:03 | 87.8 | 75 |
| 2015-01-01_01:28:04 | 88.2 | 75 |
| 2015-01-01_01:28:05 | 88 | 75 |
| 2015-01-01_01:28:06 | 88.2 | 75 |
| 2015-01-01_01:28:07 | 88 | 75 |
| 2015-01-01_01:28:08 | 88.3 | 75 |
| 2015-01-01_01:28:09 | 88.3 | 75 |
| 2015-01-01_01:28:10 | 88.5 | 75 |
| 2015-01-01_01:28:11 | 88.1 | 75 |
| 2015-01-01_01:28:12 | 88.6 | 75 |
| 2015-01-01_01:28:13 | 88.6 | 75 |
| 2015-01-01_01:28:14 | 89 | 75 |
| 2015-01-01_01:28:15 | 88.8 | 75 |
| 2015-01-01_01:28:16 | 88.6 | 75 |
| 2015-01-01_01:28:17 | 89.3 | 75 |
| 2015-01-01_01:28:18 | 89.3 | 75 |
| 2015-01-01_01:28:19 | 89.8 | 75 |
| 2015-01-01_01:28:20 | 89.7 | 75 |
| 2015-01-01_01:28:21 | 89.3 | 75 |
| 2015-01-01_01:28:22 | 89.7 | 75 |
| 2015-01-01_01:28:23 | 89.1 | 75 |
| 2015-01-01_01:28:24 | 88.5 | 75 |
| 2015-01-01_01:28:25 | 88.6 | 74.9 |
| 2015-01-01_01:28:26 | 88.1 | 74.9 |
| 2015-01-01_01:28:27 | 87.8 | 74.9 |
| 2015-01-01_01:28:28 | 87.3 | 74.9 |
| 2015-01-01_01:28:29 | 87 | 74.9 |
| 2015-01-01_01:28:30 | 86.6 | 74.9 |
| 2015-01-01_01:28:31 | 86.5 | 74.9 |
| 2015-01-01_01:28:32 | 86.5 | 74.9 |
| 2015-01-01_01:28:33 | 86.2 | 74.8 |
| 2015-01-01_01:28:34 | 86.1 | 74.8 |
| 2015-01-01_01:28:35 | 85.7 | 74.8 |
| 2015-01-01_01:28:36 | 85.8 | 74.8 |
| 2015-01-01_01:28:37 | 84.9 | 74.8 |
| 2015-01-01_01:28:38 | 85.8 | 74.8 |
| 2015-01-01_01:28:39 | 86 | 74.8 |
| 2015-01-01_01:28:40 | 86.2 | 74.8 |
| 2015-01-01_01:28:41 | 86.3 | 75 |
| 2015-01-01_01:28:42 | 86 | 75 |
| 2015-01-01_01:28:43 | 86.8 | 75 |
| 2015-01-01_01:28:44 | 86.3 | 75 |
| 2015-01-01_01:28:45 | 86.4 | 75 |
| 2015-01-01_01:28:46 | 86.7 | 75 |
| 2015-01-01_01:28:47 | 86.5 | 75 |
| 2015-01-01_01:28:48 | 86.2 | 75 |
| 2015-01-01_01:28:49 | 86.3 | 75.1 |
| 2015-01-01_01:28:50 | 86.2 | 75.1 |
| 2015-01-01_01:28:51 | 86.2 | 75.1 |
| 2015-01-01_01:28:52 | 86.3 | 75.1 |
| 2015-01-01_01:28:53 | 86.2 | 75.1 |
| 2015-01-01_01:28:54 | 85.8 | 75.1 |
| 2015-01-01_01:28:55 | 86.1 | 75.1 |
| 2015-01-01_01:28:56 | 86.1 | 75.1 |
| 2015-01-01_01:28:57 | 86.2 | 75.3 |
| 2015-01-01_01:28:58 | 86.2 | 75.3 |
| 2015-01-01_01:28:59 | 85.7 | 75.3 |
| 2015-01-01_01:29:00 | 85.8 | 75.3 |
| 2015-01-01_01:29:01 | 86.2 | 75.3 |
| 2015-01-01_01:29:02 | 85.7 | 75.3 |
| 2015-01-01_01:29:03 | 86.8 | 75.3 |
| 2015-01-01_01:29:04 | 86.9 | 75.3 |
| 2015-01-01_01:29:05 | 87 | 75.3 |
| 2015-01-01_01:29:06 | 86.7 | 75.3 |
| 2015-01-01_01:29:07 | 86.9 | 75.3 |
| 2015-01-01_01:29:08 | 86.5 | 75.3 |
| 2015-01-01_01:29:09 | 86.8 | 75.3 |
| 2015-01-01_01:29:10 | 87.2 | 75.3 |
| 2015-01-01_01:29:11 | 87.9 | 75.3 |
| 2015-01-01_01:29:12 | 87 | 75.3 |
| 2015-01-01_01:29:13 | 86.7 | 75.1 |
| 2015-01-01_01:29:14 | 87.6 | 75.1 |
| 2015-01-01_01:29:15 | 87.2 | 75.1 |
| 2015-01-01_01:29:16 | 87.7 | 75.1 |
| 2015-01-01_01:29:17 | 87.9 | 75.1 |
| 2015-01-01_01:29:18 | 87.9 | 75.1 |
| 2015-01-01_01:29:19 | 87.8 | 75.1 |
| 2015-01-01_01:29:20 | 88 | 75.1 |
| 2015-01-01_01:29:21 | 87.9 | 74.7 |
| 2015-01-01_01:29:22 | 88.4 | 74.7 |
| 2015-01-01_01:29:23 | 88.5 | 74.7 |
| 2015-01-01_01:29:24 | 88 | 74.7 |
| 2015-01-01_01:29:25 | 88.6 | 74.7 |
| 2015-01-01_01:29:26 | 88.8 | 74.7 |
| 2015-01-01_01:29:27 | 88.8 | 74.7 |
| 2015-01-01_01:29:28 | 89.1 | 74.7 |
| 2015-01-01_01:29:29 | 88.7 | 74.4 |
| 2015-01-01_01:29:30 | 88.8 | 74.4 |
| 2015-01-01_01:29:31 | 88.8 | 74.4 |
| 2015-01-01_01:29:32 | 88.8 | 74.4 |
| 2015-01-01_01:29:33 | 88.5 | 74.4 |
| 2015-01-01_01:29:34 | 88.8 | 74.4 |
| 2015-01-01_01:29:35 | 88.4 | 74.4 |
| 2015-01-01_01:29:36 | 87.8 | 74.4 |
| 2015-01-01_01:29:37 | 87.8 | 74.1 |
| 2015-01-01_01:29:38 | 86.9 | 74.1 |
| 2015-01-01_01:29:39 | 87.6 | 74.1 |
| 2015-01-01_01:29:40 | 87.1 | 74.1 |
| 2015-01-01_01:29:41 | 86.8 | 74.1 |
| 2015-01-01_01:29:42 | 86.8 | 74.1 |
| 2015-01-01_01:29:43 | 86.5 | 74.1 |
| 2015-01-01_01:29:44 | 87.3 | 74.1 |
| 2015-01-01_01:29:45 | 87.1 | 74 |
| 2015-01-01_01:29:46 | 87.3 | 74 |
| 2015-01-01_01:29:47 | 87 | 74 |
| 2015-01-01_01:29:48 | 86.8 | 74 |
| 2015-01-01_01:29:49 | 86.8 | 74 |
| 2015-01-01_01:29:50 | 86.8 | 74 |
| 2015-01-01_01:29:51 | 87 | 74 |
| 2015-01-01_01:29:52 | 86.8 | 74 |
| 2015-01-01_01:29:53 | 87 | 73.7 |
| 2015-01-01_01:29:54 | 87.1 | 73.7 |
| 2015-01-01_01:29:55 | 86.3 | 73.7 |
| 2015-01-01_01:29:56 | 86.8 | 73.7 |
| 2015-01-01_01:29:57 | 86.2 | 73.7 |
| 2015-01-01_01:29:58 | 87.3 | 73.7 |
| 2015-01-01_01:29:59 | 87.3 | 73.7 |
| 2015-01-01_01:30:00 | 87.2 | 73.7 |
| 2015-01-01_01:30:01 | 87.2 | 73.4 |
| 2015-01-01_01:30:02 | 87.4 | 73.4 |
| 2015-01-01_01:30:03 | 87.4 | 73.4 |
| 2015-01-01_01:30:04 | 87.6 | 73.4 |
| 2015-01-01_01:30:05 | 87.4 | 73.4 |
| 2015-01-01_01:30:06 | 87.9 | 73.4 |
| 2015-01-01_01:30:07 | 87.3 | 73.4 |
| 2015-01-01_01:30:08 | 87.7 | 73.4 |
| 2015-01-01_01:30:09 | 87.5 | 73.2 |
| 2015-01-01_01:30:10 | 88 | 73.2 |
| 2015-01-01_01:30:11 | 87.9 | 73.2 |
| 2015-01-01_01:30:12 | 88 | 73.2 |
| 2015-01-01_01:30:13 | 88.2 | 73.2 |
| 2015-01-01_01:30:14 | 88.3 | 73.2 |
| 2015-01-01_01:30:15 | 88.4 | 73.2 |
| 2015-01-01_01:30:16 | 87.9 | 73.2 |
| 2015-01-01_01:30:17 | 88 | 72.9 |
| 2015-01-01_01:30:18 | 87.1 | 72.9 |
| 2015-01-01_01:30:19 | 87.9 | 72.9 |
| 2015-01-01_01:30:20 | 86.8 | 72.9 |
| 2015-01-01_01:30:21 | 87.8 | 72.9 |
| 2015-01-01_01:30:22 | 87.5 | 72.9 |
| 2015-01-01_01:30:23 | 87.3 | 72.9 |
| 2015-01-01_01:30:24 | 87.4 | 72.9 |
| 2015-01-01_01:30:25 | 87.2 | 72.6 |
| 2015-01-01_01:30:26 | 86.9 | 72.6 |
| 2015-01-01_01:30:27 | 87.1 | 72.6 |
| 2015-01-01_01:30:28 | 86.5 | 72.6 |
| 2015-01-01_01:30:29 | 85.7 | 72.6 |
| 2015-01-01_01:30:30 | 86.6 | 72.6 |
| 2015-01-01_01:30:31 | 85.5 | 72.6 |
| 2015-01-01_01:30:32 | 86.7 | 72.6 |
| 2015-01-01_01:30:33 | 86.6 | 72.5 |
| 2015-01-01_01:30:34 | 86.3 | 72.5 |
| 2015-01-01_01:30:35 | 86 | 72.5 |
| 2015-01-01_01:30:36 | 86.9 | 72.5 |
| 2015-01-01_01:30:37 | 86.7 | 72.5 |
| 2015-01-01_01:30:38 | 86.5 | 72.5 |
| 2015-01-01_01:30:39 | 86.9 | 72.5 |
| 2015-01-01_01:30:40 | 86.6 | 72.5 |
| 2015-01-01_01:30:41 | 86.8 | 72.2 |
| 2015-01-01_01:30:42 | 86.9 | 72.2 |
| 2015-01-01_01:30:43 | 87.1 | 72.2 |
| 2015-01-01_01:30:44 | 86.9 | 72.2 |
| 2015-01-01_01:30:45 | 87 | 72.2 |
| 2015-01-01_01:30:46 | 86.8 | 72.2 |
| 2015-01-01_01:30:47 | 86.7 | 72.2 |
| 2015-01-01_01:30:48 | 86.1 | 72.2 |
| 2015-01-01_01:30:49 | 86.6 | 72 |
| 2015-01-01_01:30:50 | 86.9 | 72 |
| 2015-01-01_01:30:51 | 86.8 | 72 |
| 2015-01-01_01:30:52 | 86.9 | 72 |
| 2015-01-01_01:30:53 | 86.9 | 72 |
| 2015-01-01_01:30:54 | 87.1 | 72 |
| 2015-01-01_01:30:55 | 87.6 | 72 |
| 2015-01-01_01:30:56 | 87.3 | 72 |
| 2015-01-01_01:30:57 | 87.8 | 71.9 |
| 2015-01-01_01:30:58 | 87.5 | 71.9 |
| 2015-01-01_01:30:59 | 88.2 | 71.9 |
| 2015-01-01_01:31:00 | 87.9 | 71.9 |
| 2015-01-01_01:31:01 | 87.6 | 71.9 |
| 2015-01-01_01:31:02 | 87.5 | 71.9 |
| 2015-01-01_01:31:03 | 87.5 | 71.9 |
| 2015-01-01_01:31:04 | 87.7 | 71.9 |
| 2015-01-01_01:31:05 | 87.5 | 71.8 |
| 2015-01-01_01:31:06 | 87.5 | 71.8 |
| 2015-01-01_01:31:07 | 87.6 | 71.8 |
| 2015-01-01_01:31:08 | 87.5 | 71.8 |
| 2015-01-01_01:31:09 | 87.4 | 71.8 |
| 2015-01-01_01:31:10 | 87.3 | 71.8 |
| 2015-01-01_01:31:11 | 87.7 | 71.8 |
| 2015-01-01_01:31:12 | 87.2 | 71.8 |
| 2015-01-01_01:31:13 | 87.4 | 71.8 |
| 2015-01-01_01:31:14 | 87.3 | 71.8 |
| 2015-01-01_01:31:15 | 87.5 | 71.8 |
| 2015-01-01_01:31:16 | 87 | 71.8 |
| 2015-01-01_01:31:17 | 86.2 | 71.8 |
| 2015-01-01_01:31:18 | 87 | 71.8 |
| 2015-01-01_01:31:19 | 86.7 | 71.8 |
| 2015-01-01_01:31:20 | 87.3 | 71.8 |
| 2015-01-01_01:31:21 | 86.8 | 72 |
| 2015-01-01_01:31:22 | 86.9 | 72 |
| 2015-01-01_01:31:23 | 85.8 | 72 |
| 2015-01-01_01:31:24 | 86.7 | 72 |
| 2015-01-01_01:31:25 | 87.1 | 72 |
| 2015-01-01_01:31:26 | 86.6 | 72 |
| 2015-01-01_01:31:27 | 87 | 72 |
| 2015-01-01_01:31:28 | 87.2 | 72 |
| 2015-01-01_01:31:29 | 86.9 | 72.2 |
| 2015-01-01_01:31:30 | 86.8 | 72.2 |
| 2015-01-01_01:31:31 | 86.8 | 72.2 |
| 2015-01-01_01:31:32 | 87 | 72.2 |
| 2015-01-01_01:31:33 | 87 | 72.2 |
| 2015-01-01_01:31:34 | 85.9 | 72.2 |
| 2015-01-01_01:31:35 | 86.2 | 72.2 |
| 2015-01-01_01:31:36 | 86.8 | 72.2 |
| 2015-01-01_01:31:37 | 86.9 | 72.6 |
| 2015-01-01_01:31:38 | 87.2 | 72.6 |
| 2015-01-01_01:31:39 | 86.9 | 72.6 |
| 2015-01-01_01:31:40 | 87.2 | 72.6 |
| 2015-01-01_01:31:41 | 86.8 | 72.6 |
| 2015-01-01_01:31:42 | 87.1 | 72.6 |
| 2015-01-01_01:31:43 | 86.4 | 72.6 |
| 2015-01-01_01:31:44 | 87 | 72.6 |
| 2015-01-01_01:31:45 | 86.9 | 73.1 |
| 2015-01-01_01:31:46 | 86.8 | 73.1 |
| 2015-01-01_01:31:47 | 87 | 73.1 |
| 2015-01-01_01:31:48 | 86.9 | 73.1 |
| 2015-01-01_01:31:49 | 86.7 | 73.1 |
| 2015-01-01_01:31:50 | 86.4 | 73.1 |
| 2015-01-01_01:31:51 | 87 | 73.1 |
| 2015-01-01_01:31:52 | 87.1 | 73.1 |
| 2015-01-01_01:31:53 | 86.8 | 73.1 |
| 2015-01-01_01:31:54 | 87.2 | 73.1 |
| 2015-01-01_01:31:55 | 87.1 | 73.1 |
| 2015-01-01_01:31:56 | 86.5 | 73.1 |
| 2015-01-01_01:31:57 | 87.2 | 73.1 |
| 2015-01-01_01:31:58 | 87 | 73.1 |
| 2015-01-01_01:31:59 | 86.8 | 73.1 |
| 2015-01-01_01:32:00 | 87.2 | 73.1 |
| 2015-01-01_01:32:01 | 87.1 | 74 |
| 2015-01-01_01:32:02 | 87 | 74 |
| 2015-01-01_01:32:03 | 86.8 | 74 |
| 2015-01-01_01:32:04 | 86.7 | 74 |
| 2015-01-01_01:32:05 | 87.3 | 74 |
| 2015-01-01_01:32:06 | 87.4 | 74 |
| 2015-01-01_01:32:07 | 87.2 | 74 |
| 2015-01-01_01:32:08 | 87.1 | 74 |
| 2015-01-01_01:32:09 | 87.1 | 74.3 |
| 2015-01-01_01:32:10 | 87.1 | 74.3 |
| 2015-01-01_01:32:11 | 87 | 74.3 |
| 2015-01-01_01:32:12 | 87.2 | 74.3 |
| 2015-01-01_01:32:13 | 87.1 | 74.3 |
| 2015-01-01_01:32:14 | 87.2 | 74.3 |
| 2015-01-01_01:32:15 | 87.1 | 74.3 |
| 2015-01-01_01:32:16 | 87.2 | 74.3 |
| 2015-01-01_01:32:17 | 87.2 | 74.7 |
| 2015-01-01_01:32:18 | 86.6 | 74.7 |
| 2015-01-01_01:32:19 | 87.3 | 74.7 |
| 2015-01-01_01:32:20 | 87.2 | 74.7 |
| 2015-01-01_01:32:21 | 86.7 | 74.7 |
| 2015-01-01_01:32:22 | 86.9 | 74.7 |
| 2015-01-01_01:32:23 | 87.3 | 74.7 |
| 2015-01-01_01:32:24 | 87.4 | 74.7 |
| 2015-01-01_01:32:25 | 87.2 | 74.9 |
| 2015-01-01_01:32:26 | 86.3 | 74.9 |
| 2015-01-01_01:32:27 | 86.7 | 74.9 |
| 2015-01-01_01:32:28 | 87.5 | 74.9 |
| 2015-01-01_01:32:29 | 86.6 | 74.9 |
| 2015-01-01_01:32:30 | 87.2 | 74.9 |
| 2015-01-01_01:32:31 | 87.2 | 74.9 |
| 2015-01-01_01:32:32 | 87.9 | 74.9 |
| 2015-01-01_01:32:33 | 87.6 | 74.8 |
| 2015-01-01_01:32:34 | 87.6 | 74.8 |
| 2015-01-01_01:32:35 | 88 | 74.8 |
| 2015-01-01_01:32:36 | 87.4 | 74.8 |
| 2015-01-01_01:32:37 | 88.4 | 74.8 |
| 2015-01-01_01:32:38 | 88.4 | 74.8 |
| 2015-01-01_01:32:39 | 88.3 | 74.8 |
| 2015-01-01_01:32:40 | 87.2 | 74.8 |
| 2015-01-01_01:32:41 | 88.5 | 74.6 |
| 2015-01-01_01:32:42 | 88.5 | 74.6 |
| 2015-01-01_01:32:43 | 88.6 | 74.6 |
| 2015-01-01_01:32:44 | 88.6 | 74.6 |
| 2015-01-01_01:32:45 | 89 | 74.6 |
| 2015-01-01_01:32:46 | 88.9 | 74.6 |
| 2015-01-01_01:32:47 | 88.6 | 74.6 |
| 2015-01-01_01:32:48 | 88.6 | 74.6 |
| 2015-01-01_01:32:49 | 88.8 | 74.5 |
| 2015-01-01_01:32:50 | 87.8 | 74.5 |
| 2015-01-01_01:32:51 | 88.4 | 74.5 |
| 2015-01-01_01:32:52 | 88.6 | 74.5 |
| 2015-01-01_01:32:53 | 88.2 | 74.5 |
| 2015-01-01_01:32:54 | 88.2 | 74.5 |
| 2015-01-01_01:32:55 | 88.3 | 74.5 |
| 2015-01-01_01:32:56 | 87.8 | 74.5 |
| 2015-01-01_01:32:57 | 88 | 74.4 |
| 2015-01-01_01:32:58 | 87.4 | 74.4 |
| 2015-01-01_01:32:59 | 86.5 | 74.4 |
| 2015-01-01_01:33:00 | 87.2 | 74.4 |
| 2015-01-01_01:33:01 | 86.8 | 74.4 |
| 2015-01-01_01:33:02 | 86.7 | 74.4 |
| 2015-01-01_01:33:03 | 86.9 | 74.4 |
| 2015-01-01_01:33:04 | 86.9 | 74.4 |
| 2015-01-01_01:33:05 | 86.8 | 74.3 |
| 2015-01-01_01:33:06 | 86.9 | 74.3 |
| 2015-01-01_01:33:07 | 86.5 | 74.3 |
| 2015-01-01_01:33:08 | 86.7 | 74.3 |
| 2015-01-01_01:33:09 | 86.6 | 74.3 |
| 2015-01-01_01:33:10 | 86.7 | 74.3 |
| 2015-01-01_01:33:11 | 86.1 | 74.3 |
| 2015-01-01_01:33:12 | 86 | 74.3 |
| 2015-01-01_01:33:13 | 86.1 | 74.3 |
| 2015-01-01_01:33:14 | 86.8 | 74.3 |
| 2015-01-01_01:33:15 | 87 | 74.3 |
| 2015-01-01_01:33:16 | 87.2 | 74.3 |
| 2015-01-01_01:33:17 | 85.7 | 74.3 |
| 2015-01-01_01:33:18 | 85.8 | 74.3 |
| 2015-01-01_01:33:19 | 87.4 | 74.3 |
| 2015-01-01_01:33:20 | 87.4 | 74.3 |
| 2015-01-01_01:33:21 | 87.3 | 74.3 |
| 2015-01-01_01:33:22 | 87.9 | 74.3 |
| 2015-01-01_01:33:23 | 85.8 | 74.3 |
| 2015-01-01_01:33:24 | 87.2 | 74.3 |
| 2015-01-01_01:33:25 | 87 | 74.3 |
| 2015-01-01_01:33:26 | 87.6 | 74.3 |
| 2015-01-01_01:33:27 | 87.8 | 74.3 |
| 2015-01-01_01:33:28 | 87.9 | 74.3 |
| 2015-01-01_01:33:29 | 87.7 | 74.2 |
| 2015-01-01_01:33:30 | 87.9 | 74.2 |
| 2015-01-01_01:33:31 | 88.2 | 74.2 |
| 2015-01-01_01:33:32 | 88.4 | 74.2 |
| 2015-01-01_01:33:33 | 88.1 | 74.2 |
| 2015-01-01_01:33:34 | 88.3 | 74.2 |
| 2015-01-01_01:33:35 | 88.3 | 74.2 |
| 2015-01-01_01:33:36 | 88 | 74.2 |
| 2015-01-01_01:33:37 | 87.9 | 74.1 |
| 2015-01-01_01:33:38 | 88.1 | 74.1 |
| 2015-01-01_01:33:39 | 88.4 | 74.1 |
| 2015-01-01_01:33:40 | 88.1 | 74.1 |
| 2015-01-01_01:33:41 | 88.3 | 74.1 |
| 2015-01-01_01:33:42 | 86.8 | 74.1 |
| 2015-01-01_01:33:43 | 87.6 | 74.1 |
| 2015-01-01_01:33:44 | 87.5 | 74.1 |
| 2015-01-01_01:33:45 | 87.7 | 74.1 |
| 2015-01-01_01:33:46 | 87.8 | 74.1 |
| 2015-01-01_01:33:47 | 88 | 74.1 |
| 2015-01-01_01:33:48 | 87.4 | 74.1 |
| 2015-01-01_01:33:49 | 87.7 | 74.1 |
| 2015-01-01_01:33:50 | 87.4 | 74.1 |
| 2015-01-01_01:33:51 | 87.6 | 74.1 |
| 2015-01-01_01:33:52 | 87.6 | 74.1 |
| 2015-01-01_01:33:53 | 87.6 | 74.3 |
| 2015-01-01_01:33:54 | 87 | 74.3 |
| 2015-01-01_01:33:55 | 87.5 | 74.3 |
| 2015-01-01_01:33:56 | 87.8 | 74.3 |
| 2015-01-01_01:33:57 | 87.4 | 74.3 |
| 2015-01-01_01:33:58 | 87.9 | 74.3 |
| 2015-01-01_01:33:59 | 87.8 | 74.3 |
| 2015-01-01_01:34:00 | 86.6 | 74.3 |
| 2015-01-01_01:34:01 | 87 | 74.8 |
| 2015-01-01_01:34:02 | 86.5 | 74.8 |
| 2015-01-01_01:34:03 | 87.5 | 74.8 |
| 2015-01-01_01:34:04 | 87.5 | 74.8 |
| 2015-01-01_01:34:05 | 86.7 | 74.8 |
| 2015-01-01_01:34:06 | 86.1 | 74.8 |
| 2015-01-01_01:34:07 | 87.4 | 74.8 |
| 2015-01-01_01:34:08 | 87.2 | 74.8 |
| 2015-01-01_01:34:09 | 87 | 75.2 |
| 2015-01-01_01:34:10 | 86.2 | 75.2 |
| 2015-01-01_01:34:11 | 86.7 | 75.2 |
| 2015-01-01_01:34:12 | 87.2 | 75.2 |
| 2015-01-01_01:34:13 | 87.3 | 75.2 |
| 2015-01-01_01:34:14 | 86.9 | 75.2 |
| 2015-01-01_01:34:15 | 87.1 | 75.2 |
| 2015-01-01_01:34:16 | 86.3 | 75.2 |
| 2015-01-01_01:34:17 | 87 | 75.5 |
| 2015-01-01_01:34:18 | 87.2 | 75.5 |
| 2015-01-01_01:34:19 | 85.8 | 75.5 |
| 2015-01-01_01:34:20 | 86.1 | 75.5 |
| 2015-01-01_01:34:21 | 86.5 | 75.5 |
| 2015-01-01_01:34:22 | 87.2 | 75.5 |
| 2015-01-01_01:34:23 | 87.3 | 75.5 |
| 2015-01-01_01:34:24 | 87 | 75.5 |
| 2015-01-01_01:34:25 | 87.3 | 75.7 |
| 2015-01-01_01:34:26 | 86.7 | 75.7 |
| 2015-01-01_01:34:27 | 87.9 | 75.7 |
| 2015-01-01_01:34:28 | 87.6 | 75.7 |
| 2015-01-01_01:34:29 | 87.6 | 75.7 |
| 2015-01-01_01:34:30 | 88 | 75.7 |
| 2015-01-01_01:34:31 | 88.1 | 75.7 |
| 2015-01-01_01:34:32 | 88.3 | 75.7 |
| 2015-01-01_01:34:33 | 87.4 | 75.6 |
| 2015-01-01_01:34:34 | 88.5 | 75.6 |
| 2015-01-01_01:34:35 | 88.8 | 75.6 |
| 2015-01-01_01:34:36 | 88.9 | 75.6 |
| 2015-01-01_01:34:37 | 88.3 | 75.6 |
| 2015-01-01_01:34:38 | 89 | 75.6 |
| 2015-01-01_01:34:39 | 88.9 | 75.6 |
| 2015-01-01_01:34:40 | 88.4 | 75.6 |
| 2015-01-01_01:34:41 | 87.9 | 75.1 |
| 2015-01-01_01:34:42 | 89.4 | 75.1 |
| 2015-01-01_01:34:43 | 88.9 | 75.1 |
| 2015-01-01_01:34:44 | 88.8 | 75.1 |
| 2015-01-01_01:34:45 | 88.7 | 75.1 |
| 2015-01-01_01:34:46 | 87.9 | 75.1 |
| 2015-01-01_01:34:47 | 88 | 75.1 |
| 2015-01-01_01:34:48 | 87 | 75.1 |
| 2015-01-01_01:34:49 | 87.2 | 74.5 |
| 2015-01-01_01:34:50 | 86.9 | 74.5 |
| 2015-01-01_01:34:51 | 86.8 | 74.5 |
| 2015-01-01_01:34:52 | 85.1 | 74.5 |
| 2015-01-01_01:34:53 | 86.2 | 74.5 |
| 2015-01-01_01:34:54 | 86.1 | 74.5 |
| 2015-01-01_01:34:55 | 86.1 | 74.5 |
| 2015-01-01_01:34:56 | 85.6 | 74.5 |
| 2015-01-01_01:34:57 | 85.4 | 74.1 |
| 2015-01-01_01:34:58 | 86 | 74.1 |
| 2015-01-01_01:34:59 | 86.2 | 74.1 |
| 2015-01-01_01:35:00 | 86.7 | 74.1 |
| 2015-01-01_01:35:01 | 86 | 74.1 |
| 2015-01-01_01:35:02 | 86.8 | 74.1 |
| 2015-01-01_01:35:03 | 86.5 | 74.1 |
| 2015-01-01_01:35:04 | 86.8 | 74.1 |
| 2015-01-01_01:35:05 | 86.2 | 73.8 |
| 2015-01-01_01:35:06 | 87.3 | 73.8 |
| 2015-01-01_01:35:07 | 87.4 | 73.8 |
| 2015-01-01_01:35:08 | 87.3 | 73.8 |
| 2015-01-01_01:35:09 | 87.6 | 73.8 |
| 2015-01-01_01:35:10 | 87.9 | 73.8 |
| 2015-01-01_01:35:11 | 88.1 | 73.8 |
| 2015-01-01_01:35:12 | 88.6 | 73.8 |
| 2015-01-01_01:35:13 | 88.6 | 73.6 |
| 2015-01-01_01:35:14 | 89.2 | 73.6 |
| 2015-01-01_01:35:15 | 89.2 | 73.6 |
| 2015-01-01_01:35:16 | 89.4 | 73.6 |
| 2015-01-01_01:35:17 | 89.3 | 73.6 |
| 2015-01-01_01:35:18 | 89.4 | 73.6 |
| 2015-01-01_01:35:19 | 88.8 | 73.6 |
| 2015-01-01_01:35:20 | 88.6 | 73.6 |
| 2015-01-01_01:35:21 | 87.8 | 73.3 |
| 2015-01-01_01:35:22 | 87.6 | 73.3 |
| 2015-01-01_01:35:23 | 86.6 | 73.3 |
| 2015-01-01_01:35:24 | 86.5 | 73.3 |
| 2015-01-01_01:35:25 | 86 | 73.3 |
| 2015-01-01_01:35:26 | 85.6 | 73.3 |
| 2015-01-01_01:35:27 | 85.6 | 73.3 |
| 2015-01-01_01:35:28 | 84.9 | 73.3 |
| 2015-01-01_01:35:29 | 84.9 | 73.1 |
| 2015-01-01_01:35:30 | 85.3 | 73.1 |
| 2015-01-01_01:35:31 | 85.3 | 73.1 |
| 2015-01-01_01:35:32 | 84.5 | 73.1 |
| 2015-01-01_01:35:33 | 84.9 | 73.1 |
| 2015-01-01_01:35:34 | 85.1 | 73.1 |
| 2015-01-01_01:35:35 | 84.7 | 73.1 |
| 2015-01-01_01:35:36 | 85 | 73.1 |
| 2015-01-01_01:35:37 | 85.4 | 73.2 |
| 2015-01-01_01:35:38 | 85.2 | 73.2 |
| 2015-01-01_01:35:39 | 85.6 | 73.2 |
| 2015-01-01_01:35:40 | 85.2 | 73.2 |
| 2015-01-01_01:35:41 | 85.2 | 73.2 |
| 2015-01-01_01:35:42 | 85.4 | 73.2 |
| 2015-01-01_01:35:43 | 85.7 | 73.2 |
| 2015-01-01_01:35:44 | 85.6 | 73.2 |
| 2015-01-01_01:35:45 | 85.2 | 73.1 |
| 2015-01-01_01:35:46 | 85.9 | 73.1 |
| 2015-01-01_01:35:47 | 85.6 | 73.1 |
| 2015-01-01_01:35:48 | 85.5 | 73.1 |
| 2015-01-01_01:35:49 | 85.6 | 73.1 |
| 2015-01-01_01:35:50 | 85.6 | 73.1 |
| 2015-01-01_01:35:51 | 85.7 | 73.1 |
| 2015-01-01_01:35:52 | 85.7 | 73.1 |
| 2015-01-01_01:35:53 | 85.5 | 73 |
| 2015-01-01_01:35:54 | 85.7 | 73 |
| 2015-01-01_01:35:55 | 85.6 | 73 |
| 2015-01-01_01:35:56 | 85.7 | 73 |
| 2015-01-01_01:35:57 | 85.6 | 73 |
| 2015-01-01_01:35:58 | 85.7 | 73 |
| 2015-01-01_01:35:59 | 85.4 | 73 |
| 2015-01-01_01:36:00 | 85.6 | 73 |
| 2015-01-01_01:36:01 | 84.2 | 72.8 |
| 2015-01-01_01:36:02 | 84.3 | 72.8 |
| 2015-01-01_01:36:03 | 84.6 | 72.8 |
| 2015-01-01_01:36:04 | 84.8 | 72.8 |
| 2015-01-01_01:36:05 | 83.7 | 72.8 |
| 2015-01-01_01:36:06 | 85.5 | 72.8 |
| 2015-01-01_01:36:07 | 85.7 | 72.8 |
| 2015-01-01_01:36:08 | 85.6 | 72.8 |
| 2015-01-01_01:36:09 | 86.2 | 72.9 |
| 2015-01-01_01:36:10 | 86.3 | 72.9 |
| 2015-01-01_01:36:11 | 86 | 72.9 |
| 2015-01-01_01:36:12 | 86.2 | 72.9 |
| 2015-01-01_01:36:13 | 86.6 | 72.9 |
| 2015-01-01_01:36:14 | 86.6 | 72.9 |
| 2015-01-01_01:36:15 | 86.5 | 72.9 |
| 2015-01-01_01:36:16 | 86.3 | 72.9 |
| 2015-01-01_01:36:17 | 86.7 | 72.9 |
| 2015-01-01_01:36:18 | 86.2 | 72.9 |
| 2015-01-01_01:36:19 | 86.7 | 72.9 |
| 2015-01-01_01:36:20 | 87 | 72.9 |
| 2015-01-01_01:36:21 | 86.6 | 72.9 |
| 2015-01-01_01:36:22 | 86.7 | 72.9 |
| 2015-01-01_01:36:23 | 87.2 | 72.9 |
| 2015-01-01_01:36:24 | 87.3 | 72.9 |
| 2015-01-01_01:36:25 | 86.9 | 72.9 |
| 2015-01-01_01:36:26 | 86.8 | 72.9 |
| 2015-01-01_01:36:27 | 87.3 | 72.9 |
| 2015-01-01_01:36:28 | 87.8 | 72.9 |
| 2015-01-01_01:36:29 | 87.5 | 72.9 |
| 2015-01-01_01:36:30 | 88.2 | 72.9 |
| 2015-01-01_01:36:31 | 87.6 | 72.9 |
| 2015-01-01_01:36:32 | 87.1 | 72.9 |
| 2015-01-01_01:36:33 | 87.6 | 72.8 |
| 2015-01-01_01:36:34 | 88 | 72.8 |
| 2015-01-01_01:36:35 | 88.1 | 72.8 |
| 2015-01-01_01:36:36 | 88 | 72.8 |
| 2015-01-01_01:36:37 | 88.4 | 72.8 |
| 2015-01-01_01:36:38 | 88.2 | 72.8 |
| 2015-01-01_01:36:39 | 87.3 | 72.8 |
| 2015-01-01_01:36:40 | 86.8 | 72.8 |
| 2015-01-01_01:36:41 | 87.1 | 72.8 |
| 2015-01-01_01:36:42 | 88.5 | 72.8 |
| 2015-01-01_01:36:43 | 88.3 | 72.8 |
| 2015-01-01_01:36:44 | 88.3 | 72.8 |
| 2015-01-01_01:36:45 | 87.9 | 72.8 |
| 2015-01-01_01:36:46 | 87.2 | 72.8 |
| 2015-01-01_01:36:47 | 87.4 | 72.8 |
| 2015-01-01_01:36:48 | 87.8 | 72.8 |
| 2015-01-01_01:36:49 | 86.8 | 72.3 |
| 2015-01-01_01:36:50 | 86.6 | 72.3 |
| 2015-01-01_01:36:51 | 86.5 | 72.3 |
| 2015-01-01_01:36:52 | 86.2 | 72.3 |
| 2015-01-01_01:36:53 | 86.2 | 72.3 |
| 2015-01-01_01:36:54 | 85.8 | 72.3 |
| 2015-01-01_01:36:55 | 85.7 | 72.3 |
| 2015-01-01_01:36:56 | 85.8 | 72.3 |
| 2015-01-01_01:36:57 | 85.9 | 72.1 |
| 2015-01-01_01:36:58 | 86.3 | 72.1 |
| 2015-01-01_01:36:59 | 86.8 | 72.1 |
| 2015-01-01_01:37:00 | 86.2 | 72.1 |
| 2015-01-01_01:37:01 | 86.2 | 72.1 |
| 2015-01-01_01:37:02 | 86.9 | 72.1 |
| 2015-01-01_01:37:03 | 86.2 | 72.1 |
| 2015-01-01_01:37:04 | 86.6 | 72.1 |
| 2015-01-01_01:37:05 | 87.8 | 72.1 |
| 2015-01-01_01:37:06 | 87.6 | 72.1 |
| 2015-01-01_01:37:07 | 87.8 | 72.1 |
| 2015-01-01_01:37:08 | 87.6 | 72.1 |
| 2015-01-01_01:37:09 | 87.6 | 72.1 |
| 2015-01-01_01:37:10 | 88.1 | 72.1 |
| 2015-01-01_01:37:11 | 87.7 | 72.1 |
| 2015-01-01_01:37:12 | 87.2 | 72.1 |
| 2015-01-01_01:37:13 | 87.7 | 71.8 |
| 2015-01-01_01:37:14 | 87.6 | 71.8 |
| 2015-01-01_01:37:15 | 87.6 | 71.8 |
| 2015-01-01_01:37:16 | 87.4 | 71.8 |
| 2015-01-01_01:37:17 | 87.3 | 71.8 |
| 2015-01-01_01:37:18 | 87.5 | 71.8 |
| 2015-01-01_01:37:19 | 87.2 | 71.8 |
| 2015-01-01_01:37:20 | 86.9 | 71.8 |
| 2015-01-01_01:37:21 | 87.3 | 72.1 |
| 2015-01-01_01:37:22 | 87.7 | 72.1 |
| 2015-01-01_01:37:23 | 87.9 | 72.1 |
| 2015-01-01_01:37:24 | 87.6 | 72.1 |
| 2015-01-01_01:37:25 | 87.7 | 72.1 |
| 2015-01-01_01:37:26 | 87.9 | 72.1 |
| 2015-01-01_01:37:27 | 87.8 | 72.1 |
| 2015-01-01_01:37:28 | 87.6 | 72.1 |
| 2015-01-01_01:37:29 | 87.5 | 72.7 |
| 2015-01-01_01:37:30 | 87.2 | 72.7 |
| 2015-01-01_01:37:31 | 87.5 | 72.7 |
| 2015-01-01_01:37:32 | 87.9 | 72.7 |
| 2015-01-01_01:37:33 | 87.5 | 72.7 |
| 2015-01-01_01:37:34 | 87.6 | 72.7 |
| 2015-01-01_01:37:35 | 87.4 | 72.7 |
| 2015-01-01_01:37:36 | 87.9 | 72.7 |
| 2015-01-01_01:37:37 | 88.3 | 73.4 |
| 2015-01-01_01:37:38 | 87.8 | 73.4 |
| 2015-01-01_01:37:39 | 88.6 | 73.4 |
| 2015-01-01_01:37:40 | 88.4 | 73.4 |
| 2015-01-01_01:37:41 | 88.5 | 73.4 |
| 2015-01-01_01:37:42 | 88.2 | 73.4 |
| 2015-01-01_01:37:43 | 88.8 | 73.4 |
| 2015-01-01_01:37:44 | 88 | 73.4 |
| 2015-01-01_01:37:45 | 88.6 | 73.8 |
| 2015-01-01_01:37:46 | 89 | 73.8 |
| 2015-01-01_01:37:47 | 89.1 | 73.8 |
| 2015-01-01_01:37:48 | 89.6 | 73.8 |
| 2015-01-01_01:37:49 | 88.5 | 73.8 |
| 2015-01-01_01:37:50 | 89.3 | 73.8 |
| 2015-01-01_01:37:51 | 89 | 73.8 |
| 2015-01-01_01:37:52 | 88.5 | 73.8 |
| 2015-01-01_01:37:53 | 88.4 | 74 |
| 2015-01-01_01:37:54 | 87.4 | 74 |
| 2015-01-01_01:37:55 | 87.4 | 74 |
| 2015-01-01_01:37:56 | 87.2 | 74 |
| 2015-01-01_01:37:57 | 87.1 | 74 |
| 2015-01-01_01:37:58 | 86.7 | 74 |
| 2015-01-01_01:37:59 | 86.3 | 74 |
| 2015-01-01_01:38:00 | 85.7 | 74 |
| 2015-01-01_01:38:01 | 86.6 | 74 |
| 2015-01-01_01:38:02 | 86.7 | 74 |
| 2015-01-01_01:38:03 | 86.8 | 74 |
| 2015-01-01_01:38:04 | 86.4 | 74 |
| 2015-01-01_01:38:05 | 86.7 | 74 |
| 2015-01-01_01:38:06 | 86.6 | 74 |
| 2015-01-01_01:38:07 | 86.7 | 74 |
| 2015-01-01_01:38:08 | 87.1 | 74 |
| 2015-01-01_01:38:09 | 87.1 | 74 |
| 2015-01-01_01:38:10 | 86.5 | 74 |
| 2015-01-01_01:38:11 | 86.1 | 74 |
| 2015-01-01_01:38:12 | 85.9 | 74 |
| 2015-01-01_01:38:13 | 86.9 | 74 |
| 2015-01-01_01:38:14 | 87 | 74 |
| 2015-01-01_01:38:15 | 86.7 | 74 |
| 2015-01-01_01:38:16 | 87 | 74 |
| 2015-01-01_01:38:17 | 85.8 | 74.2 |
| 2015-01-01_01:38:18 | 86.7 | 74.2 |
| 2015-01-01_01:38:19 | 86.8 | 74.2 |
| 2015-01-01_01:38:20 | 87.4 | 74.2 |
| 2015-01-01_01:38:21 | 87.1 | 74.2 |
| 2015-01-01_01:38:22 | 87.3 | 74.2 |
| 2015-01-01_01:38:23 | 87.9 | 74.2 |
| 2015-01-01_01:38:24 | 87.5 | 74.2 |
| 2015-01-01_01:38:25 | 87.9 | 74.3 |
| 2015-01-01_01:38:26 | 87.5 | 74.3 |
| 2015-01-01_01:38:27 | 86.9 | 74.3 |
| 2015-01-01_01:38:28 | 87.9 | 74.3 |
| 2015-01-01_01:38:29 | 87.9 | 74.3 |
| 2015-01-01_01:38:30 | 88.2 | 74.3 |
| 2015-01-01_01:38:31 | 87.6 | 74.3 |
| 2015-01-01_01:38:32 | 88 | 74.3 |
| 2015-01-01_01:38:33 | 87.9 | 74.1 |
| 2015-01-01_01:38:34 | 87.9 | 74.1 |
| 2015-01-01_01:38:35 | 88.1 | 74.1 |
| 2015-01-01_01:38:36 | 87.8 | 74.1 |
| 2015-01-01_01:38:37 | 87.6 | 74.1 |
| 2015-01-01_01:38:38 | 87.6 | 74.1 |
| 2015-01-01_01:38:39 | 87.6 | 74.1 |
| 2015-01-01_01:38:40 | 88 | 74.1 |
| 2015-01-01_01:38:41 | 87.9 | 74 |
| 2015-01-01_01:38:42 | 86.7 | 74 |
| 2015-01-01_01:38:43 | 87.4 | 74 |
| 2015-01-01_01:38:44 | 87.4 | 74 |
| 2015-01-01_01:38:45 | 87 | 74 |
| 2015-01-01_01:38:46 | 88 | 74 |
| 2015-01-01_01:38:47 | 88.1 | 74 |
| 2015-01-01_01:38:48 | 87.8 | 74 |
| 2015-01-01_01:38:49 | 87.6 | 74 |
| 2015-01-01_01:38:50 | 87 | 74 |
| 2015-01-01_01:38:51 | 87.4 | 74 |
| 2015-01-01_01:38:52 | 87.9 | 74 |
| 2015-01-01_01:38:53 | 87 | 74 |
| 2015-01-01_01:38:54 | 87.9 | 74 |
| 2015-01-01_01:38:55 | 87.7 | 74 |
| 2015-01-01_01:38:56 | 87.8 | 74 |
| 2015-01-01_01:38:57 | 87.4 | 74.1 |
| 2015-01-01_01:38:58 | 87.5 | 74.1 |
| 2015-01-01_01:38:59 | 87.5 | 74.1 |
| 2015-01-01_01:39:00 | 87.8 | 74.1 |
| 2015-01-01_01:39:01 | 87.5 | 74.1 |
| 2015-01-01_01:39:02 | 87.4 | 74.1 |
| 2015-01-01_01:39:03 | 87.2 | 74.1 |
| 2015-01-01_01:39:04 | 87.2 | 74.1 |
| 2015-01-01_01:39:05 | 87.5 | 74.5 |
| 2015-01-01_01:39:06 | 87.6 | 74.5 |
| 2015-01-01_01:39:07 | 87.3 | 74.5 |
| 2015-01-01_01:39:08 | 86.6 | 74.5 |
| 2015-01-01_01:39:09 | 87.3 | 74.5 |
| 2015-01-01_01:39:10 | 86 | 74.5 |
| 2015-01-01_01:39:11 | 87.2 | 74.5 |
| 2015-01-01_01:39:12 | 87.6 | 74.5 |
| 2015-01-01_01:39:13 | 87.5 | 74.5 |
| 2015-01-01_01:39:14 | 85.6 | 74.5 |
| 2015-01-01_01:39:15 | 87.1 | 74.5 |
| 2015-01-01_01:39:16 | 87.6 | 74.5 |
| 2015-01-01_01:39:17 | 87.5 | 74.5 |
| 2015-01-01_01:39:18 | 87.9 | 74.5 |
| 2015-01-01_01:39:19 | 88.1 | 74.5 |
| 2015-01-01_01:39:20 | 87.8 | 74.5 |
| 2015-01-01_01:39:21 | 88.3 | 75.1 |
| 2015-01-01_01:39:22 | 88.1 | 75.1 |
| 2015-01-01_01:39:23 | 87.9 | 75.1 |
| 2015-01-01_01:39:24 | 88.2 | 75.1 |
| 2015-01-01_01:39:25 | 87.5 | 75.1 |
| 2015-01-01_01:39:26 | 87.3 | 75.1 |
| 2015-01-01_01:39:27 | 88 | 75.1 |
| 2015-01-01_01:39:28 | 87.4 | 75.1 |
| 2015-01-01_01:39:29 | 87.8 | 75.3 |
| 2015-01-01_01:39:30 | 87.9 | 75.3 |
| 2015-01-01_01:39:31 | 87.8 | 75.3 |
| 2015-01-01_01:39:32 | 88.3 | 75.3 |
| 2015-01-01_01:39:33 | 88.5 | 75.3 |
| 2015-01-01_01:39:34 | 88.5 | 75.3 |
| 2015-01-01_01:39:35 | 88.1 | 75.3 |
| 2015-01-01_01:39:36 | 88.9 | 75.3 |
| 2015-01-01_01:39:37 | 89 | 75.6 |
| 2015-01-01_01:39:38 | 88.9 | 75.6 |
| 2015-01-01_01:39:39 | 88.3 | 75.6 |
| 2015-01-01_01:39:40 | 88.4 | 75.6 |
| 2015-01-01_01:39:41 | 88.6 | 75.6 |
| 2015-01-01_01:39:42 | 88.5 | 75.6 |
| 2015-01-01_01:39:43 | 88.5 | 75.6 |
| 2015-01-01_01:39:44 | 88.7 | 75.6 |
| 2015-01-01_01:39:45 | 88.5 | 75.7 |
| 2015-01-01_01:39:46 | 87.2 | 75.7 |
| 2015-01-01_01:39:47 | 88.3 | 75.7 |
| 2015-01-01_01:39:48 | 87.5 | 75.7 |
| 2015-01-01_01:39:49 | 87.8 | 75.7 |
| 2015-01-01_01:39:50 | 86.8 | 75.7 |
| 2015-01-01_01:39:51 | 87.1 | 75.7 |
| 2015-01-01_01:39:52 | 87.3 | 75.7 |
| 2015-01-01_01:39:53 | 87.2 | 75.8 |
| 2015-01-01_01:39:54 | 87.3 | 75.8 |
| 2015-01-01_01:39:55 | 87.1 | 75.8 |
| 2015-01-01_01:39:56 | 87.5 | 75.8 |
| 2015-01-01_01:39:57 | 87.5 | 75.8 |
| 2015-01-01_01:39:58 | 87.6 | 75.8 |
| 2015-01-01_01:39:59 | 87.9 | 75.8 |
| 2015-01-01_01:40:00 | 87.3 | 75.8 |
| 2015-01-01_01:40:01 | 87.9 | 75.6 |
| 2015-01-01_01:40:02 | 87.9 | 75.6 |
| 2015-01-01_01:40:03 | 88.1 | 75.6 |
| 2015-01-01_01:40:04 | 87.7 | 75.6 |
| 2015-01-01_01:40:05 | 87.9 | 75.6 |
| 2015-01-01_01:40:06 | 87.9 | 75.6 |
| 2015-01-01_01:40:07 | 87.7 | 75.6 |
| 2015-01-01_01:40:08 | 87.9 | 75.6 |
| 2015-01-01_01:40:09 | 88.1 | 75.5 |
| 2015-01-01_01:40:10 | 88.1 | 75.5 |
| 2015-01-01_01:40:11 | 88 | 75.5 |
| 2015-01-01_01:40:12 | 88.2 | 75.5 |
| 2015-01-01_01:40:13 | 88.2 | 75.5 |
| 2015-01-01_01:40:14 | 88.3 | 75.5 |
| 2015-01-01_01:40:15 | 88.6 | 75.5 |
| 2015-01-01_01:40:16 | 87.9 | 75.5 |
| 2015-01-01_01:40:17 | 88.5 | 75.6 |
| 2015-01-01_01:40:18 | 88.2 | 75.6 |
| 2015-01-01_01:40:19 | 88.3 | 75.6 |
| 2015-01-01_01:40:20 | 87.3 | 75.6 |
| 2015-01-01_01:40:21 | 88.6 | 75.6 |
| 2015-01-01_01:40:22 | 87.9 | 75.6 |
| 2015-01-01_01:40:23 | 88.1 | 75.6 |
| 2015-01-01_01:40:24 | 88.2 | 75.6 |
| 2015-01-01_01:40:25 | 88.4 | 75.7 |
| 2015-01-01_01:40:26 | 88.3 | 75.7 |
| 2015-01-01_01:40:27 | 88.6 | 75.7 |
| 2015-01-01_01:40:28 | 88.5 | 75.7 |
| 2015-01-01_01:40:29 | 88.6 | 75.7 |
| 2015-01-01_01:40:30 | 88.2 | 75.7 |
| 2015-01-01_01:40:31 | 87.8 | 75.7 |
| 2015-01-01_01:40:32 | 87.8 | 75.7 |
| 2015-01-01_01:40:33 | 87.7 | 75.8 |
| 2015-01-01_01:40:34 | 87.7 | 75.8 |
| 2015-01-01_01:40:35 | 87.4 | 75.8 |
| 2015-01-01_01:40:36 | 87.2 | 75.8 |
| 2015-01-01_01:40:37 | 86.9 | 75.8 |
| 2015-01-01_01:40:38 | 86.9 | 75.8 |
| 2015-01-01_01:40:39 | 86.8 | 75.8 |
| 2015-01-01_01:40:40 | 87 | 75.8 |
| 2015-01-01_01:40:41 | 86.1 | 75.8 |
| 2015-01-01_01:40:42 | 86.9 | 75.8 |
| 2015-01-01_01:40:43 | 86.2 | 75.8 |
| 2015-01-01_01:40:44 | 86.7 | 75.8 |
| 2015-01-01_01:40:45 | 86 | 75.8 |
| 2015-01-01_01:40:46 | 86.7 | 75.8 |
| 2015-01-01_01:40:47 | 86.2 | 75.8 |
| 2015-01-01_01:40:48 | 86.5 | 75.8 |
| 2015-01-01_01:40:49 | 86.8 | 75.9 |
| 2015-01-01_01:40:50 | 86.8 | 75.9 |
| 2015-01-01_01:40:51 | 87.5 | 75.9 |
| 2015-01-01_01:40:52 | 86.8 | 75.9 |
| 2015-01-01_01:40:53 | 86.5 | 75.9 |
| 2015-01-01_01:40:54 | 86.6 | 75.9 |
| 2015-01-01_01:40:55 | 86.8 | 75.9 |
| 2015-01-01_01:40:56 | 87 | 75.9 |
| 2015-01-01_01:40:57 | 86.6 | 76.4 |
| 2015-01-01_01:40:58 | 87 | 76.4 |
| 2015-01-01_01:40:59 | 86.9 | 76.4 |
| 2015-01-01_01:41:00 | 86.5 | 76.4 |
| 2015-01-01_01:41:01 | 86.9 | 76.4 |
| 2015-01-01_01:41:02 | 86.9 | 76.4 |
| 2015-01-01_01:41:03 | 86.8 | 76.4 |
| 2015-01-01_01:41:04 | 87.2 | 76.4 |
| 2015-01-01_01:41:05 | 87.2 | 76.9 |
| 2015-01-01_01:41:06 | 87.2 | 76.9 |
| 2015-01-01_01:41:07 | 87 | 76.9 |
| 2015-01-01_01:41:08 | 86.9 | 76.9 |
| 2015-01-01_01:41:09 | 86 | 76.9 |
| 2015-01-01_01:41:10 | 87 | 76.9 |
| 2015-01-01_01:41:11 | 87.4 | 76.9 |
| 2015-01-01_01:41:12 | 86.4 | 76.9 |
| 2015-01-01_01:41:13 | 87.4 | 77.3 |
| 2015-01-01_01:41:14 | 87.1 | 77.3 |
| 2015-01-01_01:41:15 | 87.2 | 77.3 |
| 2015-01-01_01:41:16 | 87.4 | 77.3 |
| 2015-01-01_01:41:17 | 86.5 | 77.3 |
| 2015-01-01_01:41:18 | 86.8 | 77.3 |
| 2015-01-01_01:41:19 | 87.2 | 77.3 |
| 2015-01-01_01:41:20 | 87.3 | 77.3 |
| 2015-01-01_01:41:21 | 87.3 | 77.5 |
| 2015-01-01_01:41:22 | 87.1 | 77.5 |
| 2015-01-01_01:41:23 | 87.5 | 77.5 |
| 2015-01-01_01:41:24 | 87.5 | 77.5 |
| 2015-01-01_01:41:25 | 87.6 | 77.5 |
| 2015-01-01_01:41:26 | 87.5 | 77.5 |
| 2015-01-01_01:41:27 | 87.3 | 77.5 |
| 2015-01-01_01:41:28 | 87.5 | 77.5 |
| 2015-01-01_01:41:29 | 87.4 | 77.8 |
| 2015-01-01_01:41:30 | 87.3 | 77.8 |
| 2015-01-01_01:41:31 | 87.3 | 77.8 |
| 2015-01-01_01:41:32 | 87.6 | 77.8 |
| 2015-01-01_01:41:33 | 87.3 | 77.8 |
| 2015-01-01_01:41:34 | 87.3 | 77.8 |
| 2015-01-01_01:41:35 | 87.4 | 77.8 |
| 2015-01-01_01:41:36 | 87.6 | 77.8 |
| 2015-01-01_01:41:37 | 87.5 | 78.1 |
| 2015-01-01_01:41:38 | 87.4 | 78.1 |
| 2015-01-01_01:41:39 | 86.5 | 78.1 |
| 2015-01-01_01:41:40 | 87.4 | 78.1 |
| 2015-01-01_01:41:41 | 87 | 78.1 |
| 2015-01-01_01:41:42 | 87.6 | 78.1 |
| 2015-01-01_01:41:43 | 87.4 | 78.1 |
| 2015-01-01_01:41:44 | 87.3 | 78.1 |
| 2015-01-01_01:41:45 | 87.4 | 78.4 |
| 2015-01-01_01:41:46 | 87.5 | 78.4 |
| 2015-01-01_01:41:47 | 87.4 | 78.4 |
| 2015-01-01_01:41:48 | 86.9 | 78.4 |
| 2015-01-01_01:41:49 | 87.6 | 78.4 |
| 2015-01-01_01:41:50 | 87.5 | 78.4 |
| 2015-01-01_01:41:51 | 87.6 | 78.4 |
| 2015-01-01_01:41:52 | 87.8 | 78.4 |
| 2015-01-01_01:41:53 | 87.4 | 78.6 |
| 2015-01-01_01:41:54 | 87.7 | 78.6 |
| 2015-01-01_01:41:55 | 87.6 | 78.6 |
| 2015-01-01_01:41:56 | 87.5 | 78.6 |
| 2015-01-01_01:41:57 | 87.8 | 78.6 |
| 2015-01-01_01:41:58 | 87.4 | 78.6 |
| 2015-01-01_01:41:59 | 87.4 | 78.6 |
| 2015-01-01_01:42:00 | 87.5 | 78.6 |
| 2015-01-01_01:42:01 | 87.6 | 78.6 |
| 2015-01-01_01:42:02 | 87.6 | 78.6 |
| 2015-01-01_01:42:03 | 87.4 | 78.6 |
| 2015-01-01_01:42:04 | 87.6 | 78.6 |
| 2015-01-01_01:42:05 | 87.3 | 78.6 |
| 2015-01-01_01:42:06 | 86.5 | 78.6 |
| 2015-01-01_01:42:07 | 87.5 | 78.6 |
| 2015-01-01_01:42:08 | 87.4 | 78.6 |
| 2015-01-01_01:42:09 | 87 | 78.6 |
| 2015-01-01_01:42:10 | 87 | 78.6 |
| 2015-01-01_01:42:11 | 87.5 | 78.6 |
| 2015-01-01_01:42:12 | 87.7 | 78.6 |
| 2015-01-01_01:42:13 | 87 | 78.6 |
| 2015-01-01_01:42:14 | 86.9 | 78.6 |
| 2015-01-01_01:42:15 | 87.9 | 78.6 |
| 2015-01-01_01:42:16 | 87.8 | 78.6 |
| 2015-01-01_01:42:17 | 87.8 | 78.8 |
| 2015-01-01_01:42:18 | 88 | 78.8 |
| 2015-01-01_01:42:19 | 88.3 | 78.8 |
| 2015-01-01_01:42:20 | 88.5 | 78.8 |
| 2015-01-01_01:42:21 | 88.7 | 78.8 |
| 2015-01-01_01:42:22 | 88.7 | 78.8 |
| 2015-01-01_01:42:23 | 87.5 | 78.8 |
| 2015-01-01_01:42:24 | 89.1 | 78.8 |
| 2015-01-01_01:42:25 | 89.5 | 78.5 |
| 2015-01-01_01:42:26 | 89.8 | 78.5 |
| 2015-01-01_01:42:27 | 89.6 | 78.5 |
| 2015-01-01_01:42:28 | 89.8 | 78.5 |
| 2015-01-01_01:42:29 | 89.9 | 78.5 |
| 2015-01-01_01:42:30 | 89.8 | 78.5 |
| 2015-01-01_01:42:31 | 90.2 | 78.5 |
| 2015-01-01_01:42:32 | 89.5 | 78.5 |
| 2015-01-01_01:42:33 | 88.7 | 77.8 |
| 2015-01-01_01:42:34 | 88.5 | 77.8 |
| 2015-01-01_01:42:35 | 87.8 | 77.8 |
| 2015-01-01_01:42:36 | 87.3 | 77.8 |
| 2015-01-01_01:42:37 | 86.9 | 77.8 |
| 2015-01-01_01:42:38 | 86.9 | 77.8 |
| 2015-01-01_01:42:39 | 86.3 | 77.8 |
| 2015-01-01_01:42:40 | 86.1 | 77.8 |
| 2015-01-01_01:42:41 | 86.2 | 77.1 |
| 2015-01-01_01:42:42 | 86 | 77.1 |
| 2015-01-01_01:42:43 | 86.2 | 77.1 |
| 2015-01-01_01:42:44 | 85.9 | 77.1 |
| 2015-01-01_01:42:45 | 85.1 | 77.1 |
| 2015-01-01_01:42:46 | 86.1 | 77.1 |
| 2015-01-01_01:42:47 | 86.3 | 77.1 |
| 2015-01-01_01:42:48 | 86 | 77.1 |
| 2015-01-01_01:42:49 | 86.1 | 77 |
| 2015-01-01_01:42:50 | 86.2 | 77 |
| 2015-01-01_01:42:51 | 86.4 | 77 |
| 2015-01-01_01:42:52 | 86.2 | 77 |
| 2015-01-01_01:42:53 | 86.2 | 77 |
| 2015-01-01_01:42:54 | 86.2 | 77 |
| 2015-01-01_01:42:55 | 86.5 | 77 |
| 2015-01-01_01:42:56 | 86.8 | 77 |
| 2015-01-01_01:42:57 | 86.9 | 77 |
| 2015-01-01_01:42:58 | 86.6 | 77 |
| 2015-01-01_01:42:59 | 86.5 | 77 |
| 2015-01-01_01:43:00 | 86.5 | 77 |
| 2015-01-01_01:43:01 | 86.7 | 77 |
| 2015-01-01_01:43:02 | 87 | 77 |
| 2015-01-01_01:43:03 | 85.2 | 77 |
| 2015-01-01_01:43:04 | 86.7 | 77 |
| 2015-01-01_01:43:05 | 86.9 | 77.8 |
| 2015-01-01_01:43:06 | 87 | 77.8 |
| 2015-01-01_01:43:07 | 87.1 | 77.8 |
| 2015-01-01_01:43:08 | 87 | 77.8 |
| 2015-01-01_01:43:09 | 86.9 | 77.8 |
| 2015-01-01_01:43:10 | 87 | 77.8 |
| 2015-01-01_01:43:11 | 87.3 | 77.8 |
| 2015-01-01_01:43:12 | 87.2 | 77.8 |
| 2015-01-01_01:43:13 | 87.2 | 77.8 |
| 2015-01-01_01:43:14 | 87.1 | 77.8 |
| 2015-01-01_01:43:15 | 87.5 | 77.8 |
| 2015-01-01_01:43:16 | 87.5 | 77.8 |
| 2015-01-01_01:43:17 | 86 | 77.8 |
| 2015-01-01_01:43:18 | 87.8 | 77.8 |
| 2015-01-01_01:43:19 | 87.6 | 77.8 |
| 2015-01-01_01:43:20 | 87.8 | 77.8 |
| 2015-01-01_01:43:21 | 88 | 78.3 |
| 2015-01-01_01:43:22 | 88 | 78.3 |
| 2015-01-01_01:43:23 | 87.6 | 78.3 |
| 2015-01-01_01:43:24 | 88 | 78.3 |
| 2015-01-01_01:43:25 | 87.5 | 78.3 |
| 2015-01-01_01:43:26 | 88 | 78.3 |
| 2015-01-01_01:43:27 | 87.8 | 78.3 |
| 2015-01-01_01:43:28 | 87.9 | 78.3 |
| 2015-01-01_01:43:29 | 88.4 | 78.3 |
| 2015-01-01_01:43:30 | 88.4 | 78.3 |
| 2015-01-01_01:43:31 | 87.9 | 78.3 |
| 2015-01-01_01:43:32 | 87.5 | 78.3 |
| 2015-01-01_01:43:33 | 87.9 | 78.3 |
| 2015-01-01_01:43:34 | 88 | 78.3 |
| 2015-01-01_01:43:35 | 88.8 | 78.3 |
| 2015-01-01_01:43:36 | 88.2 | 78.3 |
| 2015-01-01_01:43:37 | 88.8 | 78.6 |
| 2015-01-01_01:43:38 | 88.2 | 78.6 |
| 2015-01-01_01:43:39 | 88.9 | 78.6 |
| 2015-01-01_01:43:40 | 88.4 | 78.6 |
| 2015-01-01_01:43:41 | 88.5 | 78.6 |
| 2015-01-01_01:43:42 | 87.8 | 78.6 |
| 2015-01-01_01:43:43 | 88.6 | 78.6 |
| 2015-01-01_01:43:44 | 88.2 | 78.6 |
| 2015-01-01_01:43:45 | 88.7 | 79 |
| 2015-01-01_01:43:46 | 87.9 | 79 |
| 2015-01-01_01:43:47 | 88.8 | 79 |
| 2015-01-01_01:43:48 | 87.4 | 79 |
| 2015-01-01_01:43:49 | 87.8 | 79 |
| 2015-01-01_01:43:50 | 88.3 | 79 |
| 2015-01-01_01:43:51 | 88.7 | 79 |
| 2015-01-01_01:43:52 | 88.7 | 79 |
| 2015-01-01_01:43:53 | 87.5 | 79 |
| 2015-01-01_01:43:54 | 88.8 | 79 |
| 2015-01-01_01:43:55 | 88.3 | 79 |
| 2015-01-01_01:43:56 | 88.5 | 79 |
| 2015-01-01_01:43:57 | 88.4 | 79 |
| 2015-01-01_01:43:58 | 88.5 | 79 |
| 2015-01-01_01:43:59 | 88.8 | 79 |
| 2015-01-01_01:44:00 | 88.6 | 79 |
| 2015-01-01_01:44:01 | 88.4 | 79.5 |
| 2015-01-01_01:44:02 | 87.7 | 79.5 |
| 2015-01-01_01:44:03 | 88.2 | 79.5 |
| 2015-01-01_01:44:04 | 88.4 | 79.5 |
| 2015-01-01_01:44:05 | 87.6 | 79.5 |
| 2015-01-01_01:44:06 | 88.1 | 79.5 |
| 2015-01-01_01:44:07 | 88 | 79.5 |
| 2015-01-01_01:44:08 | 87.9 | 79.5 |
| 2015-01-01_01:44:09 | 87.9 | 79.5 |
| 2015-01-01_01:44:10 | 87.7 | 79.5 |
| 2015-01-01_01:44:11 | 88 | 79.5 |
| 2015-01-01_01:44:12 | 87.6 | 79.5 |
| 2015-01-01_01:44:13 | 87.8 | 79.5 |
| 2015-01-01_01:44:14 | 87.9 | 79.5 |
| 2015-01-01_01:44:15 | 87.8 | 79.5 |
| 2015-01-01_01:44:16 | 87.3 | 79.5 |
| 2015-01-01_01:44:17 | 87.5 | 79.8 |
| 2015-01-01_01:44:18 | 87.4 | 79.8 |
| 2015-01-01_01:44:19 | 87.5 | 79.8 |
| 2015-01-01_01:44:20 | 87.3 | 79.8 |
| 2015-01-01_01:44:21 | 86.3 | 79.8 |
| 2015-01-01_01:44:22 | 87.7 | 79.8 |
| 2015-01-01_01:44:23 | 87.4 | 79.8 |
| 2015-01-01_01:44:24 | 87.3 | 79.8 |
| 2015-01-01_01:44:25 | 87.3 | 80 |
| 2015-01-01_01:44:26 | 87.3 | 80 |
| 2015-01-01_01:44:27 | 87 | 80 |
| 2015-01-01_01:44:28 | 87.3 | 80 |
| 2015-01-01_01:44:29 | 87.3 | 80 |
| 2015-01-01_01:44:30 | 87.7 | 80 |
| 2015-01-01_01:44:31 | 87.4 | 80 |
| 2015-01-01_01:44:32 | 87.4 | 80 |
| 2015-01-01_01:44:33 | 87.3 | 80.1 |
| 2015-01-01_01:44:34 | 87.1 | 80.1 |
| 2015-01-01_01:44:35 | 87.2 | 80.1 |
| 2015-01-01_01:44:36 | 87.4 | 80.1 |
| 2015-01-01_01:44:37 | 87.3 | 80.1 |
| 2015-01-01_01:44:38 | 87.5 | 80.1 |
| 2015-01-01_01:44:39 | 87.8 | 80.1 |
| 2015-01-01_01:44:40 | 87.4 | 80.1 |
| 2015-01-01_01:44:41 | 87.2 | 80.3 |
| 2015-01-01_01:44:42 | 87.4 | 80.3 |
| 2015-01-01_01:44:43 | 87.3 | 80.3 |
| 2015-01-01_01:44:44 | 86.9 | 80.3 |
| 2015-01-01_01:44:45 | 87.2 | 80.3 |
| 2015-01-01_01:44:46 | 86.5 | 80.3 |
| 2015-01-01_01:44:47 | 87.4 | 80.3 |
| 2015-01-01_01:44:48 | 87.8 | 80.3 |
| 2015-01-01_01:44:49 | 87 | 80.4 |
| 2015-01-01_01:44:50 | 87.9 | 80.4 |
| 2015-01-01_01:44:51 | 87.6 | 80.4 |
| 2015-01-01_01:44:52 | 87.8 | 80.4 |
| 2015-01-01_01:44:53 | 87.2 | 80.4 |
| 2015-01-01_01:44:54 | 88 | 80.4 |
| 2015-01-01_01:44:55 | 88.3 | 80.4 |
| 2015-01-01_01:44:56 | 88.4 | 80.4 |
| 2015-01-01_01:44:57 | 88.4 | 80.3 |
| 2015-01-01_01:44:58 | 88.5 | 80.3 |
| 2015-01-01_01:44:59 | 88.9 | 80.3 |
| 2015-01-01_01:45:00 | 88 | 80.3 |
| 2015-01-01_01:45:01 | 89 | 80.3 |
| 2015-01-01_01:45:02 | 89 | 80.3 |
| 2015-01-01_01:45:03 | 89 | 80.3 |
| 2015-01-01_01:45:04 | 88.8 | 80.3 |
| 2015-01-01_01:45:05 | 88.8 | 80.1 |
| 2015-01-01_01:45:06 | 89.1 | 80.1 |
| 2015-01-01_01:45:07 | 89 | 80.1 |
| 2015-01-01_01:45:08 | 88.7 | 80.1 |
| 2015-01-01_01:45:09 | 89 | 80.1 |
| 2015-01-01_01:45:10 | 88.7 | 80.1 |
| 2015-01-01_01:45:11 | 89 | 80.1 |
| 2015-01-01_01:45:12 | 89 | 80.1 |
| 2015-01-01_01:45:13 | 88.6 | 80.1 |
| 2015-01-01_01:45:14 | 88.3 | 80.1 |
| 2015-01-01_01:45:15 | 88.2 | 80.1 |
| 2015-01-01_01:45:16 | 88.2 | 80.1 |
| 2015-01-01_01:45:17 | 88.4 | 80.1 |
| 2015-01-01_01:45:18 | 87.8 | 80.1 |
| 2015-01-01_01:45:19 | 88 | 80.1 |
| 2015-01-01_01:45:20 | 87.4 | 80.1 |
| 2015-01-01_01:45:21 | 87.8 | 79.6 |
| 2015-01-01_01:45:22 | 87.2 | 79.6 |
| 2015-01-01_01:45:23 | 86.7 | 79.6 |
| 2015-01-01_01:45:24 | 87.9 | 79.6 |
| 2015-01-01_01:45:25 | 87.5 | 79.6 |
| 2015-01-01_01:45:26 | 87.8 | 79.6 |
| 2015-01-01_01:45:27 | 88 | 79.6 |
| 2015-01-01_01:45:28 | 88.1 | 79.6 |
| 2015-01-01_01:45:29 | 88.3 | 79.3 |
| 2015-01-01_01:45:30 | 88.3 | 79.3 |
| 2015-01-01_01:45:31 | 88.3 | 79.3 |
| 2015-01-01_01:45:32 | 88.3 | 79.3 |
| 2015-01-01_01:45:33 | 88.7 | 79.3 |
| 2015-01-01_01:45:34 | 88.4 | 79.3 |
| 2015-01-01_01:45:35 | 88.5 | 79.3 |
| 2015-01-01_01:45:36 | 88.8 | 79.3 |
| 2015-01-01_01:45:37 | 88.5 | 78.8 |
| 2015-01-01_01:45:38 | 87.6 | 78.8 |
| 2015-01-01_01:45:39 | 88.5 | 78.8 |
| 2015-01-01_01:45:40 | 88.6 | 78.8 |
| 2015-01-01_01:45:41 | 88.7 | 78.8 |
| 2015-01-01_01:45:42 | 88.6 | 78.8 |
| 2015-01-01_01:45:43 | 87.4 | 78.8 |
| 2015-01-01_01:45:44 | 88.2 | 78.8 |
| 2015-01-01_01:45:45 | 88.3 | 78.2 |
| 2015-01-01_01:45:46 | 87.8 | 78.2 |
| 2015-01-01_01:45:47 | 87.5 | 78.2 |
| 2015-01-01_01:45:48 | 87.3 | 78.2 |
| 2015-01-01_01:45:49 | 87.2 | 78.2 |
| 2015-01-01_01:45:50 | 87 | 78.2 |
| 2015-01-01_01:45:51 | 86.6 | 78.2 |
| 2015-01-01_01:45:52 | 86.5 | 78.2 |
| 2015-01-01_01:45:53 | 86.6 | 77.8 |
| 2015-01-01_01:45:54 | 86.4 | 77.8 |
| 2015-01-01_01:45:55 | 86.5 | 77.8 |
| 2015-01-01_01:45:56 | 86.2 | 77.8 |
| 2015-01-01_01:45:57 | 86.1 | 77.8 |
| 2015-01-01_01:45:58 | 86.4 | 77.8 |
| 2015-01-01_01:45:59 | 86 | 77.8 |
| 2015-01-01_01:46:00 | 86.5 | 77.8 |
| 2015-01-01_01:46:01 | 86.2 | 77.6 |
| 2015-01-01_01:46:02 | 86.1 | 77.6 |
| 2015-01-01_01:46:03 | 86.2 | 77.6 |
| 2015-01-01_01:46:04 | 85.2 | 77.6 |
| 2015-01-01_01:46:05 | 86.2 | 77.6 |
| 2015-01-01_01:46:06 | 85 | 77.6 |
| 2015-01-01_01:46:07 | 86.1 | 77.6 |
| 2015-01-01_01:46:08 | 86.3 | 77.6 |
| 2015-01-01_01:46:09 | 86.3 | 77.6 |
| 2015-01-01_01:46:10 | 86.3 | 77.6 |
| 2015-01-01_01:46:11 | 86.3 | 77.6 |
| 2015-01-01_01:46:12 | 86.5 | 77.6 |
| 2015-01-01_01:46:13 | 86.6 | 77.6 |
| 2015-01-01_01:46:14 | 86.6 | 77.6 |
| 2015-01-01_01:46:15 | 86.7 | 77.6 |
| 2015-01-01_01:46:16 | 86.5 | 77.6 |
| 2015-01-01_01:46:17 | 86.5 | 77.8 |
| 2015-01-01_01:46:18 | 86.6 | 77.8 |
| 2015-01-01_01:46:19 | 86.7 | 77.8 |
| 2015-01-01_01:46:20 | 86.9 | 77.8 |
| 2015-01-01_01:46:21 | 86.9 | 77.8 |
| 2015-01-01_01:46:22 | 86.9 | 77.8 |
| 2015-01-01_01:46:23 | 86.6 | 77.8 |
| 2015-01-01_01:46:24 | 86.6 | 77.8 |
| 2015-01-01_01:46:25 | 86.7 | 78.2 |
| 2015-01-01_01:46:26 | 86.9 | 78.2 |
| 2015-01-01_01:46:27 | 86.8 | 78.2 |
| 2015-01-01_01:46:28 | 86.8 | 78.2 |
| 2015-01-01_01:46:29 | 87 | 78.2 |
| 2015-01-01_01:46:30 | 87 | 78.2 |
| 2015-01-01_01:46:31 | 85.7 | 78.2 |
| 2015-01-01_01:46:32 | 87.1 | 78.2 |
| 2015-01-01_01:46:33 | 87 | 78.2 |
| 2015-01-01_01:46:34 | 87.2 | 78.2 |
| 2015-01-01_01:46:35 | 86.8 | 78.2 |
| 2015-01-01_01:46:36 | 87 | 78.2 |
| 2015-01-01_01:46:37 | 87 | 78.2 |
| 2015-01-01_01:46:38 | 87.2 | 78.2 |
| 2015-01-01_01:46:39 | 86.4 | 78.2 |
| 2015-01-01_01:46:40 | 87.1 | 78.2 |
| 2015-01-01_01:46:41 | 87.1 | 78.8 |
| 2015-01-01_01:46:42 | 87.3 | 78.8 |
| 2015-01-01_01:46:43 | 87.1 | 78.8 |
| 2015-01-01_01:46:44 | 86.6 | 78.8 |
| 2015-01-01_01:46:45 | 86.6 | 78.8 |
| 2015-01-01_01:46:46 | 86.6 | 78.8 |
| 2015-01-01_01:46:47 | 87.2 | 78.8 |
| 2015-01-01_01:46:48 | 87.4 | 78.8 |
| 2015-01-01_01:46:49 | 87.4 | 79.1 |
| 2015-01-01_01:46:50 | 87.5 | 79.1 |
| 2015-01-01_01:46:51 | 87.6 | 79.1 |
| 2015-01-01_01:46:52 | 87.4 | 79.1 |
| 2015-01-01_01:46:53 | 87.7 | 79.1 |
| 2015-01-01_01:46:54 | 87.5 | 79.1 |
| 2015-01-01_01:46:55 | 87.5 | 79.1 |
| 2015-01-01_01:46:56 | 87.6 | 79.1 |
| 2015-01-01_01:46:57 | 87.8 | 79.3 |
| 2015-01-01_01:46:58 | 88.1 | 79.3 |
| 2015-01-01_01:46:59 | 88 | 79.3 |
| 2015-01-01_01:47:00 | 88 | 79.3 |
| 2015-01-01_01:47:01 | 87.9 | 79.3 |
| 2015-01-01_01:47:02 | 88.1 | 79.3 |
| 2015-01-01_01:47:03 | 88.1 | 79.3 |
| 2015-01-01_01:47:04 | 84.5 | 79.3 |
| 2015-01-01_01:47:05 | 88.1 | 79.3 |
| 2015-01-01_01:47:06 | 88.2 | 79.3 |
| 2015-01-01_01:47:07 | 88.1 | 79.3 |
| 2015-01-01_01:47:08 | 88.2 | 79.3 |
| 2015-01-01_01:47:09 | 88.1 | 79.3 |
| 2015-01-01_01:47:10 | 88.3 | 79.3 |
| 2015-01-01_01:47:11 | 88.4 | 79.3 |
| 2015-01-01_01:47:12 | 88.4 | 79.3 |
| 2015-01-01_01:47:13 | 87.8 | 79.3 |
| 2015-01-01_01:47:14 | 87.6 | 79.3 |
| 2015-01-01_01:47:15 | 88.7 | 79.3 |
| 2015-01-01_01:47:16 | 88.8 | 79.3 |
| 2015-01-01_01:47:17 | 88 | 79.3 |
| 2015-01-01_01:47:18 | 87.8 | 79.3 |
| 2015-01-01_01:47:19 | 88.9 | 79.3 |
| 2015-01-01_01:47:20 | 88.1 | 79.3 |
| 2015-01-01_01:47:21 | 89.2 | 79.3 |
| 2015-01-01_01:47:22 | 88.7 | 79.3 |
| 2015-01-01_01:47:23 | 89.2 | 79.3 |
| 2015-01-01_01:47:24 | 89.8 | 79.3 |
| 2015-01-01_01:47:25 | 89.4 | 79.3 |
| 2015-01-01_01:47:26 | 89.4 | 79.3 |
| 2015-01-01_01:47:27 | 89 | 79.3 |
| 2015-01-01_01:47:28 | 88.7 | 79.3 |
| 2015-01-01_01:47:29 | 88.3 | 79 |
| 2015-01-01_01:47:30 | 87.9 | 79 |
| 2015-01-01_01:47:31 | 87.5 | 79 |
| 2015-01-01_01:47:32 | 86.5 | 79 |
| 2015-01-01_01:47:33 | 87.5 | 79 |
| 2015-01-01_01:47:34 | 87.2 | 79 |
| 2015-01-01_01:47:35 | 86.8 | 79 |
| 2015-01-01_01:47:36 | 86.8 | 79 |
| 2015-01-01_01:47:37 | 86.4 | 78.8 |
| 2015-01-01_01:47:38 | 86.6 | 78.8 |
| 2015-01-01_01:47:39 | 86.7 | 78.8 |
| 2015-01-01_01:47:40 | 86.6 | 78.8 |
| 2015-01-01_01:47:41 | 86.7 | 78.8 |
| 2015-01-01_01:47:42 | 87.1 | 78.8 |
| 2015-01-01_01:47:43 | 86.8 | 78.8 |
| 2015-01-01_01:47:44 | 86.8 | 78.8 |
| 2015-01-01_01:47:45 | 86.9 | 78.7 |
| 2015-01-01_01:47:46 | 86.7 | 78.7 |
| 2015-01-01_01:47:47 | 86.4 | 78.7 |
| 2015-01-01_01:47:48 | 86.8 | 78.7 |
| 2015-01-01_01:47:49 | 86.9 | 78.7 |
| 2015-01-01_01:47:50 | 86.8 | 78.7 |
| 2015-01-01_01:47:51 | 86.7 | 78.7 |
| 2015-01-01_01:47:52 | 86.8 | 78.7 |
| 2015-01-01_01:47:53 | 87 | 78.8 |
| 2015-01-01_01:47:54 | 87.3 | 78.8 |
| 2015-01-01_01:47:55 | 87.2 | 78.8 |
| 2015-01-01_01:47:56 | 86.8 | 78.8 |
| 2015-01-01_01:47:57 | 87.4 | 78.8 |
| 2015-01-01_01:47:58 | 87 | 78.8 |
| 2015-01-01_01:47:59 | 87.3 | 78.8 |
| 2015-01-01_01:48:00 | 87.1 | 78.8 |
| 2015-01-01_01:48:01 | 86.3 | 79.1 |
| 2015-01-01_01:48:02 | 87.4 | 79.1 |
| 2015-01-01_01:48:03 | 87.2 | 79.1 |
| 2015-01-01_01:48:04 | 87.3 | 79.1 |
| 2015-01-01_01:48:05 | 87.4 | 79.1 |
| 2015-01-01_01:48:06 | 87.5 | 79.1 |
| 2015-01-01_01:48:07 | 87.4 | 79.1 |
| 2015-01-01_01:48:08 | 87.5 | 79.1 |
| 2015-01-01_01:48:09 | 86.2 | 79.5 |
| 2015-01-01_01:48:10 | 87.6 | 79.5 |
| 2015-01-01_01:48:11 | 87.5 | 79.5 |
| 2015-01-01_01:48:12 | 87.6 | 79.5 |
| 2015-01-01_01:48:13 | 87.4 | 79.5 |
| 2015-01-01_01:48:14 | 87.8 | 79.5 |
| 2015-01-01_01:48:15 | 87.3 | 79.5 |
| 2015-01-01_01:48:16 | 87.5 | 79.5 |
| 2015-01-01_01:48:17 | 87.8 | 79.8 |
| 2015-01-01_01:48:18 | 87.6 | 79.8 |
| 2015-01-01_01:48:19 | 87.8 | 79.8 |
| 2015-01-01_01:48:20 | 87.9 | 79.8 |
| 2015-01-01_01:48:21 | 87.4 | 79.8 |
| 2015-01-01_01:48:22 | 88.3 | 79.8 |
| 2015-01-01_01:48:23 | 88.4 | 79.8 |
| 2015-01-01_01:48:24 | 88.4 | 79.8 |
| 2015-01-01_01:48:25 | 88.3 | 80 |
| 2015-01-01_01:48:26 | 88.3 | 80 |
| 2015-01-01_01:48:27 | 88.4 | 80 |
| 2015-01-01_01:48:28 | 88.3 | 80 |
| 2015-01-01_01:48:29 | 88.1 | 80 |
| 2015-01-01_01:48:30 | 87.7 | 80 |
| 2015-01-01_01:48:31 | 88.7 | 80 |
| 2015-01-01_01:48:32 | 88.9 | 80 |
| 2015-01-01_01:48:33 | 88.9 | 80.1 |
| 2015-01-01_01:48:34 | 88.8 | 80.1 |
| 2015-01-01_01:48:35 | 88.4 | 80.1 |
| 2015-01-01_01:48:36 | 88.4 | 80.1 |
| 2015-01-01_01:48:37 | 89.5 | 80.1 |
| 2015-01-01_01:48:38 | 88.9 | 80.1 |
| 2015-01-01_01:48:39 | 89.7 | 80.1 |
| 2015-01-01_01:48:40 | 89.6 | 80.1 |
| 2015-01-01_01:48:41 | 90.4 | 80.2 |
| 2015-01-01_01:48:42 | 90 | 80.2 |
| 2015-01-01_01:48:43 | 88.9 | 80.2 |
| 2015-01-01_01:48:44 | 88.8 | 80.2 |
| 2015-01-01_01:48:45 | 88.5 | 80.2 |
| 2015-01-01_01:48:46 | 88.6 | 80.2 |
| 2015-01-01_01:48:47 | 88.5 | 80.2 |
| 2015-01-01_01:48:48 | 88.4 | 80.2 |
| 2015-01-01_01:48:49 | 87.6 | 80 |
| 2015-01-01_01:48:50 | 87.4 | 80 |
| 2015-01-01_01:48:51 | 87 | 80 |
| 2015-01-01_01:48:52 | 86.8 | 80 |
| 2015-01-01_01:48:53 | 86.8 | 80 |
| 2015-01-01_01:48:54 | 86.9 | 80 |
| 2015-01-01_01:48:55 | 86.8 | 80 |
| 2015-01-01_01:48:56 | 87 | 80 |
| 2015-01-01_01:48:57 | 86.7 | 79.8 |
| 2015-01-01_01:48:58 | 86.5 | 79.8 |
| 2015-01-01_01:48:59 | 86.9 | 79.8 |
| 2015-01-01_01:49:00 | 86.9 | 79.8 |
| 2015-01-01_01:49:01 | 86.5 | 79.8 |
| 2015-01-01_01:49:02 | 86.2 | 79.8 |
| 2015-01-01_01:49:03 | 86.9 | 79.8 |
| 2015-01-01_01:49:04 | 86.9 | 79.8 |
| 2015-01-01_01:49:05 | 86.8 | 79.6 |
| 2015-01-01_01:49:06 | 86.8 | 79.6 |
| 2015-01-01_01:49:07 | 86.4 | 79.6 |
| 2015-01-01_01:49:08 | 86.8 | 79.6 |
| 2015-01-01_01:49:09 | 86.9 | 79.6 |
| 2015-01-01_01:49:10 | 87.4 | 79.6 |
| 2015-01-01_01:49:11 | 87.3 | 79.6 |
| 2015-01-01_01:49:12 | 86.9 | 79.6 |
| 2015-01-01_01:49:13 | 87.2 | 79.8 |
| 2015-01-01_01:49:14 | 87.6 | 79.8 |
| 2015-01-01_01:49:15 | 87.3 | 79.8 |
| 2015-01-01_01:49:16 | 87.2 | 79.8 |
| 2015-01-01_01:49:17 | 87.5 | 79.8 |
| 2015-01-01_01:49:18 | 87.4 | 79.8 |
| 2015-01-01_01:49:19 | 87.7 | 79.8 |
| 2015-01-01_01:49:20 | 86.6 | 79.8 |
| 2015-01-01_01:49:21 | 87.8 | 80.1 |
| 2015-01-01_01:49:22 | 88 | 80.1 |
| 2015-01-01_01:49:23 | 87.2 | 80.1 |
| 2015-01-01_01:49:24 | 87.9 | 80.1 |
| 2015-01-01_01:49:25 | 88 | 80.1 |
| 2015-01-01_01:49:26 | 87.8 | 80.1 |
| 2015-01-01_01:49:27 | 87.9 | 80.1 |
| 2015-01-01_01:49:28 | 87.9 | 80.1 |
| 2015-01-01_01:49:29 | 88 | 80.1 |
| 2015-01-01_01:49:30 | 88.2 | 80.1 |
| 2015-01-01_01:49:31 | 88.1 | 80.1 |
| 2015-01-01_01:49:32 | 88.3 | 80.1 |
| 2015-01-01_01:49:33 | 87.8 | 80.1 |
| 2015-01-01_01:49:34 | 88.1 | 80.1 |
| 2015-01-01_01:49:35 | 88.3 | 80.1 |
| 2015-01-01_01:49:36 | 88.3 | 80.1 |
| 2015-01-01_01:49:37 | 88.2 | 80.7 |
| 2015-01-01_01:49:38 | 88.2 | 80.7 |
| 2015-01-01_01:49:39 | 87.8 | 80.7 |
| 2015-01-01_01:49:40 | 88.6 | 80.7 |
| 2015-01-01_01:49:41 | 87.6 | 80.7 |
| 2015-01-01_01:49:42 | 88.4 | 80.7 |
| 2015-01-01_01:49:43 | 88.4 | 80.7 |
| 2015-01-01_01:49:44 | 88.6 | 80.7 |
| 2015-01-01_01:49:45 | 88.3 | 81 |
| 2015-01-01_01:49:46 | 88.5 | 81 |
| 2015-01-01_01:49:47 | 88.4 | 81 |
| 2015-01-01_01:49:48 | 88.7 | 81 |
| 2015-01-01_01:49:49 | 88.4 | 81 |
| 2015-01-01_01:49:50 | 88.6 | 81 |
| 2015-01-01_01:49:51 | 88.5 | 81 |
| 2015-01-01_01:49:52 | 88.4 | 81 |
| 2015-01-01_01:49:53 | 88.4 | 81.1 |
| 2015-01-01_01:49:54 | 88.6 | 81.1 |
| 2015-01-01_01:49:55 | 88.6 | 81.1 |
| 2015-01-01_01:49:56 | 87.6 | 81.1 |
| 2015-01-01_01:49:57 | 88.5 | 81.1 |
| 2015-01-01_01:49:58 | 87.1 | 81.1 |
| 2015-01-01_01:49:59 | 87.7 | 81.1 |
| 2015-01-01_01:50:00 | 88.5 | 81.1 |
| 2015-01-01_01:50:01 | 89.1 | 81.3 |
| 2015-01-01_01:50:02 | 89 | 81.3 |
| 2015-01-01_01:50:03 | 88.4 | 81.3 |
| 2015-01-01_01:50:04 | 89.6 | 81.3 |
| 2015-01-01_01:50:05 | 89.1 | 81.3 |
| 2015-01-01_01:50:06 | 90 | 81.3 |
| 2015-01-01_01:50:07 | 89.9 | 81.3 |
| 2015-01-01_01:50:08 | 89.6 | 81.3 |
| 2015-01-01_01:50:09 | 90.5 | 81.3 |
| 2015-01-01_01:50:10 | 90.5 | 81.3 |
| 2015-01-01_01:50:11 | 89.3 | 81.3 |
| 2015-01-01_01:50:12 | 89.4 | 81.3 |
| 2015-01-01_01:50:13 | 89.1 | 81.3 |
| 2015-01-01_01:50:14 | 88.5 | 81.3 |
| 2015-01-01_01:50:15 | 88.1 | 81.3 |
| 2015-01-01_01:50:16 | 87.4 | 81.3 |
| 2015-01-01_01:50:17 | 86.8 | 80.4 |
| 2015-01-01_01:50:18 | 86.9 | 80.4 |
| 2015-01-01_01:50:19 | 86.7 | 80.4 |
| 2015-01-01_01:50:20 | 86.9 | 80.4 |
| 2015-01-01_01:50:21 | 87.2 | 80.4 |
| 2015-01-01_01:50:22 | 87.4 | 80.4 |
| 2015-01-01_01:50:23 | 87.6 | 80.4 |
| 2015-01-01_01:50:24 | 87.6 | 80.4 |
| 2015-01-01_01:50:25 | 86.7 | 79.8 |
| 2015-01-01_01:50:26 | 88 | 79.8 |
| 2015-01-01_01:50:27 | 88.1 | 79.8 |
| 2015-01-01_01:50:28 | 86 | 79.8 |
| 2015-01-01_01:50:29 | 88.2 | 79.8 |
| 2015-01-01_01:50:30 | 87.3 | 79.8 |
| 2015-01-01_01:50:31 | 88.8 | 79.8 |
| 2015-01-01_01:50:32 | 88.8 | 79.8 |
| 2015-01-01_01:50:33 | 89.1 | 79.3 |
| 2015-01-01_01:50:34 | 89.2 | 79.3 |
| 2015-01-01_01:50:35 | 89.3 | 79.3 |
| 2015-01-01_01:50:36 | 88.9 | 79.3 |
| 2015-01-01_01:50:37 | 89 | 79.3 |
| 2015-01-01_01:50:38 | 88.4 | 79.3 |
| 2015-01-01_01:50:39 | 88.4 | 79.3 |
| 2015-01-01_01:50:40 | 88.3 | 79.3 |
| 2015-01-01_01:50:41 | 87.8 | 78.9 |
| 2015-01-01_01:50:42 | 87.4 | 78.9 |
| 2015-01-01_01:50:43 | 86.9 | 78.9 |
| 2015-01-01_01:50:44 | 86.8 | 78.9 |
| 2015-01-01_01:50:45 | 86.7 | 78.9 |
| 2015-01-01_01:50:46 | 86.3 | 78.9 |
| 2015-01-01_01:50:47 | 86.2 | 78.9 |
| 2015-01-01_01:50:48 | 85.5 | 78.9 |
| 2015-01-01_01:50:49 | 86.2 | 78.5 |
| 2015-01-01_01:50:50 | 86.2 | 78.5 |
| 2015-01-01_01:50:51 | 86.1 | 78.5 |
| 2015-01-01_01:50:52 | 86.2 | 78.5 |
| 2015-01-01_01:50:53 | 85.1 | 78.5 |
| 2015-01-01_01:50:54 | 86 | 78.5 |
| 2015-01-01_01:50:55 | 86.5 | 78.5 |
| 2015-01-01_01:50:56 | 86 | 78.5 |
| 2015-01-01_01:50:57 | 86.2 | 78.3 |
| 2015-01-01_01:50:58 | 86 | 78.3 |
| 2015-01-01_01:50:59 | 86.3 | 78.3 |
| 2015-01-01_01:51:00 | 86.3 | 78.3 |
| 2015-01-01_01:51:01 | 85.6 | 78.3 |
| 2015-01-01_01:51:02 | 84.6 | 78.3 |
| 2015-01-01_01:51:03 | 86.3 | 78.3 |
| 2015-01-01_01:51:04 | 86.3 | 78.3 |
| 2015-01-01_01:51:05 | 85.4 | 78.3 |
| 2015-01-01_01:51:06 | 86.3 | 78.3 |
| 2015-01-01_01:51:07 | 86.5 | 78.3 |
| 2015-01-01_01:51:08 | 86.9 | 78.3 |
| 2015-01-01_01:51:09 | 86.4 | 78.3 |
| 2015-01-01_01:51:10 | 86.8 | 78.3 |
| 2015-01-01_01:51:11 | 86.9 | 78.3 |
| 2015-01-01_01:51:12 | 86.8 | 78.3 |
| 2015-01-01_01:51:13 | 86.9 | 78.5 |
| 2015-01-01_01:51:14 | 86.8 | 78.5 |
| 2015-01-01_01:51:15 | 87.1 | 78.5 |
| 2015-01-01_01:51:16 | 87 | 78.5 |
| 2015-01-01_01:51:17 | 86 | 78.5 |
| 2015-01-01_01:51:18 | 87.2 | 78.5 |
| 2015-01-01_01:51:19 | 87.6 | 78.5 |
| 2015-01-01_01:51:20 | 87.5 | 78.5 |
| 2015-01-01_01:51:21 | 87.6 | 78.8 |
| 2015-01-01_01:51:22 | 87.9 | 78.8 |
| 2015-01-01_01:51:23 | 88 | 78.8 |
| 2015-01-01_01:51:24 | 88.1 | 78.8 |
| 2015-01-01_01:51:25 | 88.5 | 78.8 |
| 2015-01-01_01:51:26 | 88.4 | 78.8 |
| 2015-01-01_01:51:27 | 88.4 | 78.8 |
| 2015-01-01_01:51:28 | 88.9 | 78.8 |
| 2015-01-01_01:51:29 | 88.5 | 78.8 |
| 2015-01-01_01:51:30 | 87.2 | 78.8 |
| 2015-01-01_01:51:31 | 89.3 | 78.8 |
| 2015-01-01_01:51:32 | 89.4 | 78.8 |
| 2015-01-01_01:51:33 | 89.3 | 78.8 |
| 2015-01-01_01:51:34 | 89.8 | 78.8 |
| 2015-01-01_01:51:35 | 89.6 | 78.8 |
| 2015-01-01_01:51:36 | 89.4 | 78.8 |
| 2015-01-01_01:51:37 | 89.4 | 79.2 |
| 2015-01-01_01:51:38 | 89.3 | 79.2 |
| 2015-01-01_01:51:39 | 88.5 | 79.2 |
| 2015-01-01_01:51:40 | 86.9 | 79.2 |
| 2015-01-01_01:51:41 | 87.9 | 79.2 |
| 2015-01-01_01:51:42 | 87.2 | 79.2 |
| 2015-01-01_01:51:43 | 85.7 | 79.2 |
| 2015-01-01_01:51:44 | 86.4 | 79.2 |
| 2015-01-01_01:51:45 | 86.8 | 79 |
| 2015-01-01_01:51:46 | 86.5 | 79 |
| 2015-01-01_01:51:47 | 86.6 | 79 |
| 2015-01-01_01:51:48 | 86.9 | 79 |
| 2015-01-01_01:51:49 | 86.9 | 79 |
| 2015-01-01_01:51:50 | 87.3 | 79 |
| 2015-01-01_01:51:51 | 87.3 | 79 |
| 2015-01-01_01:51:52 | 87.1 | 79 |
| 2015-01-01_01:51:53 | 87 | 78.9 |
| 2015-01-01_01:51:54 | 87.1 | 78.9 |
| 2015-01-01_01:51:55 | 87.3 | 78.9 |
| 2015-01-01_01:51:56 | 87.3 | 78.9 |
| 2015-01-01_01:51:57 | 87.4 | 78.9 |
| 2015-01-01_01:51:58 | 87.2 | 78.9 |
| 2015-01-01_01:51:59 | 87.3 | 78.9 |
| 2015-01-01_01:52:00 | 87.4 | 78.9 |
| 2015-01-01_01:52:01 | 87.1 | 78.8 |
| 2015-01-01_01:52:02 | 87.6 | 78.8 |
| 2015-01-01_01:52:03 | 87.6 | 78.8 |
| 2015-01-01_01:52:04 | 87.6 | 78.8 |
| 2015-01-01_01:52:05 | 87.5 | 78.8 |
| 2015-01-01_01:52:06 | 87.7 | 78.8 |
| 2015-01-01_01:52:07 | 88.2 | 78.8 |
| 2015-01-01_01:52:08 | 87.6 | 78.8 |
| 2015-01-01_01:52:09 | 87.8 | 79.1 |
| 2015-01-01_01:52:10 | 88.1 | 79.1 |
| 2015-01-01_01:52:11 | 88.2 | 79.1 |
| 2015-01-01_01:52:12 | 88.2 | 79.1 |
| 2015-01-01_01:52:13 | 88.3 | 79.1 |
| 2015-01-01_01:52:14 | 88.6 | 79.1 |
| 2015-01-01_01:52:15 | 88.8 | 79.1 |
| 2015-01-01_01:52:16 | 88.5 | 79.1 |
| 2015-01-01_01:52:17 | 88.4 | 79.7 |
| 2015-01-01_01:52:18 | 88.6 | 79.7 |
| 2015-01-01_01:52:19 | 88.6 | 79.7 |
| 2015-01-01_01:52:20 | 88.6 | 79.7 |
| 2015-01-01_01:52:21 | 88.7 | 79.7 |
| 2015-01-01_01:52:22 | 88.7 | 79.7 |
| 2015-01-01_01:52:23 | 88.8 | 79.7 |
| 2015-01-01_01:52:24 | 88.6 | 79.7 |
| 2015-01-01_01:52:25 | 88.6 | 80.1 |
| 2015-01-01_01:52:26 | 88.6 | 80.1 |
| 2015-01-01_01:52:27 | 88.5 | 80.1 |
| 2015-01-01_01:52:28 | 87.4 | 80.1 |
| 2015-01-01_01:52:29 | 87.6 | 80.1 |
| 2015-01-01_01:52:30 | 88.1 | 80.1 |
| 2015-01-01_01:52:31 | 88.2 | 80.1 |
| 2015-01-01_01:52:32 | 87.8 | 80.1 |
| 2015-01-01_01:52:33 | 87.9 | 80.5 |
| 2015-01-01_01:52:34 | 87.6 | 80.5 |
| 2015-01-01_01:52:35 | 87.3 | 80.5 |
| 2015-01-01_01:52:36 | 86.3 | 80.5 |
| 2015-01-01_01:52:37 | 86 | 80.5 |
| 2015-01-01_01:52:38 | 87.2 | 80.5 |
| 2015-01-01_01:52:39 | 87.2 | 80.5 |
| 2015-01-01_01:52:40 | 85.7 | 80.5 |
| 2015-01-01_01:52:41 | 86.3 | 80.7 |
| 2015-01-01_01:52:42 | 87.4 | 80.7 |
| 2015-01-01_01:52:43 | 87.3 | 80.7 |
| 2015-01-01_01:52:44 | 87.4 | 80.7 |
| 2015-01-01_01:52:45 | 87.4 | 80.7 |
| 2015-01-01_01:52:46 | 87.9 | 80.7 |
| 2015-01-01_01:52:47 | 87.4 | 80.7 |
| 2015-01-01_01:52:48 | 87.8 | 80.7 |
| 2015-01-01_01:52:49 | 87.8 | 80.8 |
| 2015-01-01_01:52:50 | 87.9 | 80.8 |
| 2015-01-01_01:52:51 | 88.2 | 80.8 |
| 2015-01-01_01:52:52 | 88 | 80.8 |
| 2015-01-01_01:52:53 | 88.2 | 80.8 |
| 2015-01-01_01:52:54 | 87.9 | 80.8 |
| 2015-01-01_01:52:55 | 88.2 | 80.8 |
| 2015-01-01_01:52:56 | 88 | 80.8 |
| 2015-01-01_01:52:57 | 88.2 | 81 |
| 2015-01-01_01:52:58 | 88.5 | 81 |
| 2015-01-01_01:52:59 | 88.3 | 81 |
| 2015-01-01_01:53:00 | 88.4 | 81 |
| 2015-01-01_01:53:01 | 88.4 | 81 |
| 2015-01-01_01:53:02 | 87.7 | 81 |
| 2015-01-01_01:53:03 | 88.9 | 81 |
| 2015-01-01_01:53:04 | 88.6 | 81 |
| 2015-01-01_01:53:05 | 88.6 | 81.1 |
| 2015-01-01_01:53:06 | 88.9 | 81.1 |
| 2015-01-01_01:53:07 | 88.3 | 81.1 |
| 2015-01-01_01:53:08 | 88.7 | 81.1 |
| 2015-01-01_01:53:09 | 88.3 | 81.1 |
| 2015-01-01_01:53:10 | 88.5 | 81.1 |
| 2015-01-01_01:53:11 | 88.5 | 81.1 |
| 2015-01-01_01:53:12 | 88.5 | 81.1 |
| 2015-01-01_01:53:13 | 88.3 | 81.3 |
| 2015-01-01_01:53:14 | 88.1 | 81.3 |
| 2015-01-01_01:53:15 | 88.2 | 81.3 |
| 2015-01-01_01:53:16 | 87.4 | 81.3 |
| 2015-01-01_01:53:17 | 88.2 | 81.3 |
| 2015-01-01_01:53:18 | 88 | 81.3 |
| 2015-01-01_01:53:19 | 88 | 81.3 |
| 2015-01-01_01:53:20 | 87.8 | 81.3 |
| 2015-01-01_01:53:21 | 87.8 | 81.3 |
| 2015-01-01_01:53:22 | 88.2 | 81.3 |
| 2015-01-01_01:53:23 | 87 | 81.3 |
| 2015-01-01_01:53:24 | 88.4 | 81.3 |
| 2015-01-01_01:53:25 | 88.4 | 81.3 |
| 2015-01-01_01:53:26 | 88.5 | 81.3 |
| 2015-01-01_01:53:27 | 88.4 | 81.3 |
| 2015-01-01_01:53:28 | 88.5 | 81.3 |
| 2015-01-01_01:53:29 | 88.4 | 81.2 |
| 2015-01-01_01:53:30 | 88.4 | 81.2 |
| 2015-01-01_01:53:31 | 88.2 | 81.2 |
| 2015-01-01_01:53:32 | 88.5 | 81.2 |
| 2015-01-01_01:53:33 | 88.4 | 81.2 |
| 2015-01-01_01:53:34 | 88.6 | 81.2 |
| 2015-01-01_01:53:35 | 88.4 | 81.2 |
| 2015-01-01_01:53:36 | 87.6 | 81.2 |
| 2015-01-01_01:53:37 | 88.4 | 81.2 |
| 2015-01-01_01:53:38 | 88.3 | 81.2 |
| 2015-01-01_01:53:39 | 88.3 | 81.2 |
| 2015-01-01_01:53:40 | 88.3 | 81.2 |
| 2015-01-01_01:53:41 | 88 | 81.2 |
| 2015-01-01_01:53:42 | 88.2 | 81.2 |
| 2015-01-01_01:53:43 | 87.2 | 81.2 |
| 2015-01-01_01:53:44 | 87.9 | 81.2 |
| 2015-01-01_01:53:45 | 88 | 81.4 |
| 2015-01-01_01:53:46 | 87.9 | 81.4 |
| 2015-01-01_01:53:47 | 87.8 | 81.4 |
| 2015-01-01_01:53:48 | 87.9 | 81.4 |
| 2015-01-01_01:53:49 | 87.4 | 81.4 |
| 2015-01-01_01:53:50 | 87.4 | 81.4 |
| 2015-01-01_01:53:51 | 87.4 | 81.4 |
| 2015-01-01_01:53:52 | 87.3 | 81.4 |
| 2015-01-01_01:53:53 | 87.4 | 81.7 |
| 2015-01-01_01:53:54 | 86.5 | 81.7 |
| 2015-01-01_01:53:55 | 87.2 | 81.7 |
| 2015-01-01_01:53:56 | 86.9 | 81.7 |
| 2015-01-01_01:53:57 | 87.6 | 81.7 |
| 2015-01-01_01:53:58 | 87.4 | 81.7 |
| 2015-01-01_01:53:59 | 87.7 | 81.7 |
| 2015-01-01_01:54:00 | 87.4 | 81.7 |
| 2015-01-01_01:54:01 | 87.4 | 82 |
| 2015-01-01_01:54:02 | 87 | 82 |
| 2015-01-01_01:54:03 | 87.4 | 82 |
| 2015-01-01_01:54:04 | 87.5 | 82 |
| 2015-01-01_01:54:05 | 87.5 | 82 |
| 2015-01-01_01:54:06 | 87.5 | 82 |
| 2015-01-01_01:54:07 | 87.5 | 82 |
| 2015-01-01_01:54:08 | 87.3 | 82 |
| 2015-01-01_01:54:09 | 87.6 | 82.2 |
| 2015-01-01_01:54:10 | 87.7 | 82.2 |
| 2015-01-01_01:54:11 | 86.6 | 82.2 |
| 2015-01-01_01:54:12 | 87.7 | 82.2 |
| 2015-01-01_01:54:13 | 87.1 | 82.2 |
| 2015-01-01_01:54:14 | 87.6 | 82.2 |
| 2015-01-01_01:54:15 | 87.8 | 82.2 |
| 2015-01-01_01:54:16 | 87.7 | 82.2 |
| 2015-01-01_01:54:17 | 87.9 | 82.4 |
| 2015-01-01_01:54:18 | 87.7 | 82.4 |
| 2015-01-01_01:54:19 | 87.8 | 82.4 |
| 2015-01-01_01:54:20 | 87.9 | 82.4 |
| 2015-01-01_01:54:21 | 86.9 | 82.4 |
| 2015-01-01_01:54:22 | 87.5 | 82.4 |
| 2015-01-01_01:54:23 | 87.7 | 82.4 |
| 2015-01-01_01:54:24 | 88.1 | 82.4 |
| 2015-01-01_01:54:25 | 88 | 82.5 |
| 2015-01-01_01:54:26 | 87.9 | 82.5 |
| 2015-01-01_01:54:27 | 87.9 | 82.5 |
| 2015-01-01_01:54:28 | 88 | 82.5 |
| 2015-01-01_01:54:29 | 88.2 | 82.5 |
| 2015-01-01_01:54:30 | 88.1 | 82.5 |
| 2015-01-01_01:54:31 | 88.2 | 82.5 |
| 2015-01-01_01:54:32 | 88.2 | 82.5 |
| 2015-01-01_01:54:33 | 87.9 | 82.7 |
| 2015-01-01_01:54:34 | 88 | 82.7 |
| 2015-01-01_01:54:35 | 88.3 | 82.7 |
| 2015-01-01_01:54:36 | 88 | 82.7 |
| 2015-01-01_01:54:37 | 87.9 | 82.7 |